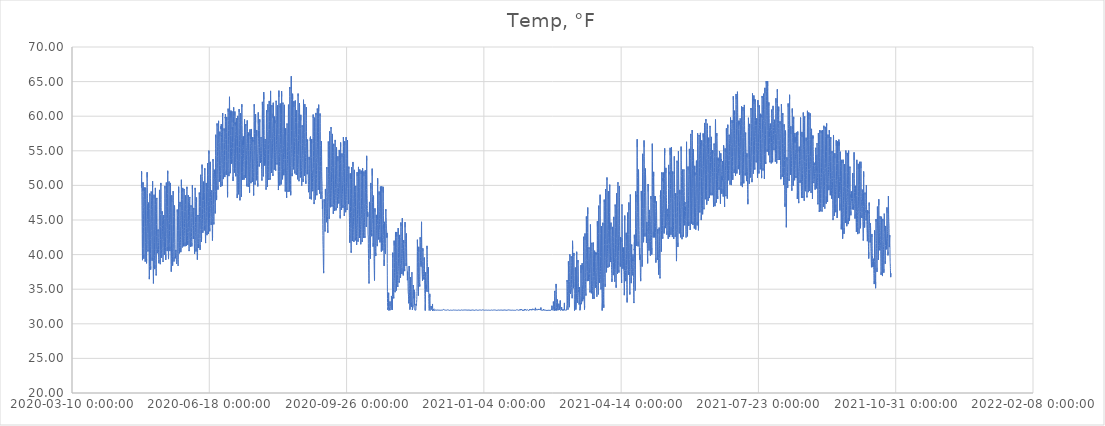
| Category | Temp, °F |
|---|---|
| 43950.59568287038 | 49.659 |
| 43950.63734953704 | 51.126 |
| 43950.67901620371 | 52.034 |
| 43950.72068287038 | 52.169 |
| 43950.76234953704 | 51.628 |
| 43950.80401620371 | 50.721 |
| 43950.84568287038 | 49.891 |
| 43950.88734953704 | 48.964 |
| 43950.92901620371 | 48.018 |
| 43950.97068287038 | 47.053 |
| 43951.01234953704 | 46.165 |
| 43951.05401620371 | 45.18 |
| 43951.09568287038 | 44.061 |
| 43951.13734953704 | 42.922 |
| 43951.17901620371 | 41.918 |
| 43951.22068287038 | 40.933 |
| 43951.26234953704 | 40.026 |
| 43951.30401620371 | 39.447 |
| 43951.34568287038 | 39.196 |
| 43951.38734953704 | 39.814 |
| 43951.42901620371 | 40.837 |
| 43951.47068287038 | 43.057 |
| 43951.51234953704 | 45.123 |
| 43951.55401620371 | 46.377 |
| 43951.59568287038 | 48.54 |
| 43951.63734953704 | 49.563 |
| 43951.67901620371 | 49.273 |
| 43951.72068287038 | 50.431 |
| 43951.76234953704 | 50.103 |
| 43951.80401620371 | 49.524 |
| 43951.84568287038 | 49.003 |
| 43951.88734953704 | 48.404 |
| 43951.92901620371 | 47.613 |
| 43951.97068287038 | 46.783 |
| 43952.01234953704 | 45.972 |
| 43952.05401620371 | 45.026 |
| 43952.09568287038 | 43.887 |
| 43952.13734953704 | 42.825 |
| 43952.17901620371 | 41.821 |
| 43952.22068287038 | 40.895 |
| 43952.26234953704 | 40.084 |
| 43952.30401620371 | 39.563 |
| 43952.34568287038 | 39.408 |
| 43952.38734953704 | 40.045 |
| 43952.42901620371 | 41.532 |
| 43952.47068287038 | 43.713 |
| 43952.51234953704 | 46.377 |
| 43952.55401620371 | 48.346 |
| 43952.59568287038 | 49.717 |
| 43952.63734953704 | 49.312 |
| 43952.67901620371 | 49.235 |
| 43952.72068287038 | 49.563 |
| 43952.76234953704 | 49.157 |
| 43952.80401620371 | 49.119 |
| 43952.84568287038 | 49.041 |
| 43952.88734953704 | 48.771 |
| 43952.92901620371 | 47.999 |
| 43952.97068287038 | 46.976 |
| 43953.01234953704 | 45.702 |
| 43953.05401620371 | 44.543 |
| 43953.09568287038 | 43.366 |
| 43953.13734953704 | 42.265 |
| 43953.17901620371 | 41.146 |
| 43953.22068287038 | 40.2 |
| 43953.26234953704 | 39.331 |
| 43953.30401620371 | 38.983 |
| 43953.34568287038 | 39.061 |
| 43953.38734953704 | 39.331 |
| 43953.42901620371 | 40.238 |
| 43953.47068287038 | 41.744 |
| 43953.51234953704 | 44.08 |
| 43953.55401620371 | 46.455 |
| 43953.59568287038 | 47.922 |
| 43953.63734953704 | 49.679 |
| 43953.67901620371 | 49.408 |
| 43953.72068287038 | 49.235 |
| 43953.76234953704 | 49.215 |
| 43953.80401620371 | 48.578 |
| 43953.84568287038 | 47.902 |
| 43953.88734953704 | 47.285 |
| 43953.92901620371 | 46.474 |
| 43953.97068287038 | 45.47 |
| 43954.01234953704 | 44.466 |
| 43954.05401620371 | 43.385 |
| 43954.09568287038 | 42.42 |
| 43954.13734953704 | 41.455 |
| 43954.17901620371 | 40.605 |
| 43954.22068287038 | 39.736 |
| 43954.26234953704 | 39.099 |
| 43954.30401620371 | 38.733 |
| 43954.34568287038 | 38.79 |
| 43954.38734953704 | 39.37 |
| 43954.42901620371 | 40.624 |
| 43954.47068287038 | 42.555 |
| 43954.51234953704 | 44.428 |
| 43954.55401620371 | 47.034 |
| 43954.59568287038 | 48.926 |
| 43954.63734953704 | 50.451 |
| 43954.67901620371 | 51.628 |
| 43954.72068287038 | 51.899 |
| 43954.76234953704 | 51.126 |
| 43954.80401620371 | 50.567 |
| 43954.84568287038 | 49.717 |
| 43954.88734953704 | 48.848 |
| 43954.92901620371 | 48.153 |
| 43954.97068287038 | 47.362 |
| 43955.01234953704 | 46.319 |
| 43955.05401620371 | 45.065 |
| 43955.09568287038 | 44.003 |
| 43955.13734953704 | 43.057 |
| 43955.17901620371 | 42.227 |
| 43955.22068287038 | 41.493 |
| 43955.26234953704 | 40.856 |
| 43955.30401620371 | 40.451 |
| 43955.34568287038 | 40.412 |
| 43955.38734953704 | 40.393 |
| 43955.42901620371 | 40.682 |
| 43955.47068287038 | 41.126 |
| 43955.51234953704 | 41.995 |
| 43955.55401620371 | 42.96 |
| 43955.59568287038 | 45.026 |
| 43955.63734953704 | 46.609 |
| 43955.67901620371 | 47.516 |
| 43955.72068287038 | 47.362 |
| 43955.76234953704 | 46.918 |
| 43955.80401620371 | 46.3 |
| 43955.84568287038 | 45.547 |
| 43955.88734953704 | 45.007 |
| 43955.92901620371 | 44.408 |
| 43955.97068287038 | 43.733 |
| 43956.01234953704 | 42.999 |
| 43956.05401620371 | 42.053 |
| 43956.09568287038 | 40.895 |
| 43956.13734953704 | 39.794 |
| 43956.17901620371 | 38.752 |
| 43956.22068287038 | 37.864 |
| 43956.26234953704 | 37.014 |
| 43956.30401620371 | 36.455 |
| 43956.34568287038 | 36.319 |
| 43956.38734953704 | 36.899 |
| 43956.42901620371 | 38.288 |
| 43956.47068287038 | 40.238 |
| 43956.51234953704 | 42.536 |
| 43956.55401620371 | 44.679 |
| 43956.59568287038 | 46.648 |
| 43956.63734953704 | 47.594 |
| 43956.67901620371 | 48.655 |
| 43956.72068287038 | 48.829 |
| 43956.76234953704 | 48.482 |
| 43956.80401620371 | 48.018 |
| 43956.84568287038 | 47.169 |
| 43956.88734953704 | 46.551 |
| 43956.92901620371 | 45.798 |
| 43956.97068287038 | 45.161 |
| 43957.01234953704 | 44.292 |
| 43957.05401620371 | 43.269 |
| 43957.09568287038 | 42.188 |
| 43957.13734953704 | 41.126 |
| 43957.17901620371 | 40.161 |
| 43957.22068287038 | 39.215 |
| 43957.26234953704 | 38.385 |
| 43957.30401620371 | 37.825 |
| 43957.34568287038 | 37.748 |
| 43957.38734953704 | 38.288 |
| 43957.42901620371 | 39.505 |
| 43957.47068287038 | 41.551 |
| 43957.51234953704 | 43.308 |
| 43957.55401620371 | 45.605 |
| 43957.59568287038 | 47.652 |
| 43957.63734953704 | 48.752 |
| 43957.67901620371 | 49.119 |
| 43957.72068287038 | 49.003 |
| 43957.76234953704 | 48.906 |
| 43957.80401620371 | 48.694 |
| 43957.84568287038 | 48.192 |
| 43957.88734953704 | 47.767 |
| 43957.92901620371 | 47.188 |
| 43957.97068287038 | 46.493 |
| 43958.01234953704 | 45.547 |
| 43958.05401620371 | 44.524 |
| 43958.09568287038 | 43.482 |
| 43958.13734953704 | 42.478 |
| 43958.17901620371 | 41.474 |
| 43958.22068287038 | 40.702 |
| 43958.26234953704 | 39.987 |
| 43958.30401620371 | 39.292 |
| 43958.34568287038 | 39.119 |
| 43958.38734953704 | 39.601 |
| 43958.42901620371 | 40.721 |
| 43958.47068287038 | 42.574 |
| 43958.51234953704 | 44.814 |
| 43958.55401620371 | 46.957 |
| 43958.59568287038 | 48.597 |
| 43958.63734953704 | 49.621 |
| 43958.67901620371 | 50.451 |
| 43958.72068287038 | 50.605 |
| 43958.76234953704 | 49.756 |
| 43958.80401620371 | 48.733 |
| 43958.84568287038 | 48.134 |
| 43958.88734953704 | 47.439 |
| 43958.92901620371 | 46.03 |
| 43958.97068287038 | 44.022 |
| 43959.01234953704 | 41.841 |
| 43959.05401620371 | 40.161 |
| 43959.09568287038 | 38.906 |
| 43959.13734953704 | 37.98 |
| 43959.17901620371 | 37.188 |
| 43959.22068287038 | 36.648 |
| 43959.26234953704 | 36.204 |
| 43959.30401620371 | 35.837 |
| 43959.34568287038 | 36.049 |
| 43959.38734953704 | 36.783 |
| 43959.42901620371 | 38.018 |
| 43959.47068287038 | 39.621 |
| 43959.51234953704 | 41.532 |
| 43959.55401620371 | 43.578 |
| 43959.59568287038 | 45.528 |
| 43959.63734953704 | 46.59 |
| 43959.67901620371 | 47.806 |
| 43959.72068287038 | 48.462 |
| 43959.76234953704 | 48.655 |
| 43959.80401620371 | 48.096 |
| 43959.84568287038 | 47.265 |
| 43959.88734953704 | 46.319 |
| 43959.92901620371 | 45.161 |
| 43959.97068287038 | 44.003 |
| 43960.01234953704 | 42.806 |
| 43960.05401620371 | 41.706 |
| 43960.09568287038 | 40.682 |
| 43960.13734953704 | 39.872 |
| 43960.17901620371 | 39.177 |
| 43960.22068287038 | 38.655 |
| 43960.26234953704 | 38.211 |
| 43960.30401620371 | 37.902 |
| 43960.34568287038 | 37.902 |
| 43960.38734953704 | 38.482 |
| 43960.42901620371 | 39.64 |
| 43960.47068287038 | 41.126 |
| 43960.51234953704 | 42.941 |
| 43960.55401620371 | 44.833 |
| 43960.59568287038 | 46.648 |
| 43960.63734953704 | 48.173 |
| 43960.67901620371 | 49.061 |
| 43960.72068287038 | 49.64 |
| 43960.76234953704 | 49.273 |
| 43960.80401620371 | 48.231 |
| 43960.84568287038 | 47.246 |
| 43960.88734953704 | 46.262 |
| 43960.92901620371 | 44.852 |
| 43960.97068287038 | 43.462 |
| 43961.01234953704 | 41.976 |
| 43961.05401620371 | 40.47 |
| 43961.09568287038 | 39.428 |
| 43961.13734953704 | 38.597 |
| 43961.17901620371 | 38.038 |
| 43961.22068287038 | 37.516 |
| 43961.26234953704 | 37.207 |
| 43961.30401620371 | 36.995 |
| 43961.34568287038 | 37.227 |
| 43961.38734953704 | 37.999 |
| 43961.42901620371 | 39.234 |
| 43961.47068287038 | 40.779 |
| 43961.51234953704 | 42.574 |
| 43961.55401620371 | 44.35 |
| 43961.59568287038 | 45.895 |
| 43961.63734953704 | 47.014 |
| 43961.67901620371 | 47.458 |
| 43961.72068287038 | 47.69 |
| 43961.76234953704 | 48.192 |
| 43961.80401620371 | 48.018 |
| 43961.84568287038 | 47.304 |
| 43961.88734953704 | 46.532 |
| 43961.92901620371 | 45.586 |
| 43961.97068287038 | 44.679 |
| 43962.01234953704 | 43.655 |
| 43962.05401620371 | 42.671 |
| 43962.09568287038 | 41.763 |
| 43962.13734953704 | 41.146 |
| 43962.17901620371 | 40.721 |
| 43962.22068287038 | 40.431 |
| 43962.26234953704 | 40.2 |
| 43962.30401620371 | 40.142 |
| 43962.34568287038 | 40.084 |
| 43962.38734953704 | 40.373 |
| 43962.42901620371 | 40.431 |
| 43962.47068287038 | 40.837 |
| 43962.51234953704 | 40.991 |
| 43962.55401620371 | 41.068 |
| 43962.59568287038 | 41.358 |
| 43962.63734953704 | 42.999 |
| 43962.67901620371 | 43.636 |
| 43962.72068287038 | 43.404 |
| 43962.76234953704 | 43.018 |
| 43962.80401620371 | 42.497 |
| 43962.84568287038 | 42.285 |
| 43962.88734953704 | 42.053 |
| 43962.92901620371 | 41.744 |
| 43962.97068287038 | 41.281 |
| 43963.01234953704 | 40.779 |
| 43963.05401620371 | 40.316 |
| 43963.09568287038 | 39.949 |
| 43963.13734953704 | 39.543 |
| 43963.17901620371 | 39.292 |
| 43963.22068287038 | 39.003 |
| 43963.26234953704 | 38.752 |
| 43963.30401620371 | 38.655 |
| 43963.34568287038 | 38.829 |
| 43963.38734953704 | 39.215 |
| 43963.42901620371 | 40.721 |
| 43963.47068287038 | 42.497 |
| 43963.51234953704 | 44.157 |
| 43963.55401620371 | 45.702 |
| 43963.59568287038 | 46.532 |
| 43963.63734953704 | 47.999 |
| 43963.67901620371 | 48.771 |
| 43963.72068287038 | 49.35 |
| 43963.76234953704 | 49.177 |
| 43963.80401620371 | 48.636 |
| 43963.84568287038 | 47.748 |
| 43963.88734953704 | 46.763 |
| 43963.92901620371 | 45.895 |
| 43963.97068287038 | 44.929 |
| 43964.01234953704 | 43.578 |
| 43964.05401620371 | 42.381 |
| 43964.09568287038 | 41.3 |
| 43964.13734953704 | 40.431 |
| 43964.17901620371 | 39.698 |
| 43964.22068287038 | 39.215 |
| 43964.26234953704 | 38.81 |
| 43964.30401620371 | 38.617 |
| 43964.34568287038 | 38.81 |
| 43964.38734953704 | 39.447 |
| 43964.42901620371 | 40.644 |
| 43964.47068287038 | 42.207 |
| 43964.51234953704 | 44.08 |
| 43964.55401620371 | 45.798 |
| 43964.59568287038 | 47.536 |
| 43964.63734953704 | 49.041 |
| 43964.67901620371 | 50.026 |
| 43964.72068287038 | 50.354 |
| 43964.76234953704 | 50.47 |
| 43964.80401620371 | 49.949 |
| 43964.84568287038 | 49.061 |
| 43964.88734953704 | 47.98 |
| 43964.92901620371 | 46.821 |
| 43964.97068287038 | 45.431 |
| 43965.01234953704 | 43.945 |
| 43965.05401620371 | 42.651 |
| 43965.09568287038 | 41.667 |
| 43965.13734953704 | 40.76 |
| 43965.17901620371 | 40.161 |
| 43965.22068287038 | 39.794 |
| 43965.26234953704 | 39.543 |
| 43965.30401620371 | 39.466 |
| 43965.34568287038 | 39.543 |
| 43965.38734953704 | 40.045 |
| 43965.42901620371 | 41.03 |
| 43965.47068287038 | 41.937 |
| 43965.51234953704 | 42.787 |
| 43965.55401620371 | 43.868 |
| 43965.59568287038 | 44.852 |
| 43965.63734953704 | 46.262 |
| 43965.67901620371 | 45.856 |
| 43965.72068287038 | 45.74 |
| 43965.76234953704 | 45.933 |
| 43965.80401620371 | 45.721 |
| 43965.84568287038 | 44.872 |
| 43965.88734953704 | 44.177 |
| 43965.92901620371 | 43.733 |
| 43965.97068287038 | 43.385 |
| 43966.01234953704 | 42.96 |
| 43966.05401620371 | 42.188 |
| 43966.09568287038 | 41.532 |
| 43966.13734953704 | 40.875 |
| 43966.17901620371 | 40.277 |
| 43966.22068287038 | 39.717 |
| 43966.26234953704 | 39.234 |
| 43966.30401620371 | 38.945 |
| 43966.34568287038 | 39.119 |
| 43966.38734953704 | 39.601 |
| 43966.42901620371 | 40.238 |
| 43966.47068287038 | 40.991 |
| 43966.51234953704 | 41.918 |
| 43966.55401620371 | 43.559 |
| 43966.59568287038 | 44.37 |
| 43966.63734953704 | 45.045 |
| 43966.67901620371 | 45.258 |
| 43966.72068287038 | 45.547 |
| 43966.76234953704 | 45.702 |
| 43966.80401620371 | 45.547 |
| 43966.84568287038 | 45.296 |
| 43966.88734953704 | 44.794 |
| 43966.92901620371 | 44.061 |
| 43966.97068287038 | 43.289 |
| 43967.01234953704 | 42.497 |
| 43967.05401620371 | 41.879 |
| 43967.09568287038 | 41.281 |
| 43967.13734953704 | 40.837 |
| 43967.17901620371 | 40.431 |
| 43967.22068287038 | 40.2 |
| 43967.26234953704 | 39.949 |
| 43967.30401620371 | 39.968 |
| 43967.34568287038 | 40.084 |
| 43967.38734953704 | 40.586 |
| 43967.42901620371 | 41.956 |
| 43967.47068287038 | 43.424 |
| 43967.51234953704 | 45.18 |
| 43967.55401620371 | 46.165 |
| 43967.59568287038 | 48.153 |
| 43967.63734953704 | 49.601 |
| 43967.67901620371 | 49.93 |
| 43967.72068287038 | 49.891 |
| 43967.76234953704 | 49.524 |
| 43967.80401620371 | 49.273 |
| 43967.84568287038 | 48.462 |
| 43967.88734953704 | 47.536 |
| 43967.92901620371 | 46.474 |
| 43967.97068287038 | 45.277 |
| 43968.01234953704 | 44.003 |
| 43968.05401620371 | 42.651 |
| 43968.09568287038 | 41.686 |
| 43968.13734953704 | 40.991 |
| 43968.17901620371 | 40.431 |
| 43968.22068287038 | 39.949 |
| 43968.26234953704 | 39.485 |
| 43968.30401620371 | 39.234 |
| 43968.34568287038 | 39.35 |
| 43968.38734953704 | 40.065 |
| 43968.42901620371 | 41.339 |
| 43968.47068287038 | 42.883 |
| 43968.51234953704 | 44.582 |
| 43968.55401620371 | 46.667 |
| 43968.59568287038 | 48.462 |
| 43968.63734953704 | 48.945 |
| 43968.67901620371 | 50.18 |
| 43968.72068287038 | 50.412 |
| 43968.76234953704 | 50.412 |
| 43968.80401620371 | 50.374 |
| 43968.84568287038 | 49.35 |
| 43968.88734953704 | 48.096 |
| 43968.92901620371 | 46.899 |
| 43968.97068287038 | 45.76 |
| 43969.01234953704 | 44.833 |
| 43969.05401620371 | 43.906 |
| 43969.09568287038 | 43.038 |
| 43969.13734953704 | 42.304 |
| 43969.17901620371 | 41.648 |
| 43969.22068287038 | 41.184 |
| 43969.26234953704 | 40.74 |
| 43969.30401620371 | 40.509 |
| 43969.34568287038 | 40.605 |
| 43969.38734953704 | 41.126 |
| 43969.42901620371 | 42.188 |
| 43969.47068287038 | 43.617 |
| 43969.51234953704 | 45.258 |
| 43969.55401620371 | 46.976 |
| 43969.59568287038 | 48.81 |
| 43969.63734953704 | 50.335 |
| 43969.67901620371 | 51.493 |
| 43969.72068287038 | 52.111 |
| 43969.76234953704 | 52.111 |
| 43969.80401620371 | 51.706 |
| 43969.84568287038 | 50.76 |
| 43969.88734953704 | 49.64 |
| 43969.92901620371 | 48.211 |
| 43969.97068287038 | 46.609 |
| 43970.01234953704 | 44.91 |
| 43970.05401620371 | 43.366 |
| 43970.09568287038 | 42.265 |
| 43970.13734953704 | 41.3 |
| 43970.17901620371 | 40.605 |
| 43970.22068287038 | 40.103 |
| 43970.26234953704 | 39.621 |
| 43970.30401620371 | 39.35 |
| 43970.34568287038 | 39.466 |
| 43970.38734953704 | 40.219 |
| 43970.42901620371 | 41.455 |
| 43970.47068287038 | 43.018 |
| 43970.51234953704 | 44.949 |
| 43970.55401620371 | 46.068 |
| 43970.59568287038 | 46.86 |
| 43970.63734953704 | 48.675 |
| 43970.67901620371 | 50.374 |
| 43970.72068287038 | 50.567 |
| 43970.76234953704 | 49.872 |
| 43970.80401620371 | 49.177 |
| 43970.84568287038 | 48.482 |
| 43970.88734953704 | 47.15 |
| 43970.92901620371 | 45.76 |
| 43970.97068287038 | 44.485 |
| 43971.01234953704 | 43.501 |
| 43971.05401620371 | 42.671 |
| 43971.09568287038 | 42.111 |
| 43971.13734953704 | 41.59 |
| 43971.17901620371 | 41.242 |
| 43971.22068287038 | 40.953 |
| 43971.26234953704 | 40.702 |
| 43971.30401620371 | 40.509 |
| 43971.34568287038 | 40.605 |
| 43971.38734953704 | 41.165 |
| 43971.42901620371 | 42.072 |
| 43971.47068287038 | 43.443 |
| 43971.51234953704 | 45.065 |
| 43971.55401620371 | 46.802 |
| 43971.59568287038 | 48.192 |
| 43971.63734953704 | 49.157 |
| 43971.67901620371 | 50.123 |
| 43971.72068287038 | 50.354 |
| 43971.76234953704 | 49.543 |
| 43971.80401620371 | 48.501 |
| 43971.84568287038 | 47.458 |
| 43971.88734953704 | 46.126 |
| 43971.92901620371 | 44.621 |
| 43971.97068287038 | 43.231 |
| 43972.01234953704 | 41.841 |
| 43972.05401620371 | 40.682 |
| 43972.09568287038 | 39.794 |
| 43972.13734953704 | 39.061 |
| 43972.17901620371 | 38.559 |
| 43972.22068287038 | 38.076 |
| 43972.26234953704 | 37.748 |
| 43972.30401620371 | 37.536 |
| 43972.34568287038 | 37.651 |
| 43972.38734953704 | 38.327 |
| 43972.42901620371 | 39.389 |
| 43972.47068287038 | 40.817 |
| 43972.51234953704 | 42.555 |
| 43972.55401620371 | 44.389 |
| 43972.59568287038 | 46.146 |
| 43972.63734953704 | 47.632 |
| 43972.67901620371 | 48.327 |
| 43972.72068287038 | 48.578 |
| 43972.76234953704 | 48.482 |
| 43972.80401620371 | 47.594 |
| 43972.84568287038 | 46.725 |
| 43972.88734953704 | 45.567 |
| 43972.92901620371 | 44.35 |
| 43972.97068287038 | 43.134 |
| 43973.01234953704 | 41.956 |
| 43973.05401620371 | 40.972 |
| 43973.09568287038 | 40.277 |
| 43973.13734953704 | 39.717 |
| 43973.17901620371 | 39.234 |
| 43973.22068287038 | 38.79 |
| 43973.26234953704 | 38.559 |
| 43973.30401620371 | 38.404 |
| 43973.34568287038 | 38.52 |
| 43973.38734953704 | 39.138 |
| 43973.42901620371 | 40.2 |
| 43973.47068287038 | 41.59 |
| 43973.51234953704 | 43.308 |
| 43973.55401620371 | 45.18 |
| 43973.59568287038 | 46.86 |
| 43973.63734953704 | 48.25 |
| 43973.67901620371 | 49.177 |
| 43973.72068287038 | 49.119 |
| 43973.76234953704 | 48.636 |
| 43973.80401620371 | 47.806 |
| 43973.84568287038 | 46.725 |
| 43973.88734953704 | 45.489 |
| 43973.92901620371 | 44.428 |
| 43973.97068287038 | 43.289 |
| 43974.01234953704 | 42.4 |
| 43974.05401620371 | 41.609 |
| 43974.09568287038 | 40.933 |
| 43974.13734953704 | 40.431 |
| 43974.17901620371 | 39.949 |
| 43974.22068287038 | 39.582 |
| 43974.26234953704 | 39.254 |
| 43974.30401620371 | 39.003 |
| 43974.34568287038 | 39.138 |
| 43974.38734953704 | 39.698 |
| 43974.42901620371 | 40.779 |
| 43974.47068287038 | 41.725 |
| 43974.51234953704 | 42.671 |
| 43974.55401620371 | 44.408 |
| 43974.59568287038 | 45.972 |
| 43974.63734953704 | 46.937 |
| 43974.67901620371 | 47.092 |
| 43974.72068287038 | 46.821 |
| 43974.76234953704 | 46.763 |
| 43974.80401620371 | 46.648 |
| 43974.84568287038 | 46.281 |
| 43974.88734953704 | 45.373 |
| 43974.92901620371 | 44.408 |
| 43974.97068287038 | 43.269 |
| 43975.01234953704 | 42.323 |
| 43975.05401620371 | 41.474 |
| 43975.09568287038 | 40.856 |
| 43975.13734953704 | 40.316 |
| 43975.17901620371 | 39.949 |
| 43975.22068287038 | 39.698 |
| 43975.26234953704 | 39.582 |
| 43975.30401620371 | 39.466 |
| 43975.34568287038 | 39.485 |
| 43975.38734953704 | 39.563 |
| 43975.42901620371 | 39.794 |
| 43975.47068287038 | 39.949 |
| 43975.51234953704 | 40.045 |
| 43975.55401620371 | 40.296 |
| 43975.59568287038 | 40.431 |
| 43975.63734953704 | 40.663 |
| 43975.67901620371 | 40.605 |
| 43975.72068287038 | 40.509 |
| 43975.76234953704 | 40.373 |
| 43975.80401620371 | 40.2 |
| 43975.84568287038 | 40.065 |
| 43975.88734953704 | 39.872 |
| 43975.92901620371 | 39.582 |
| 43975.97068287038 | 39.35 |
| 43976.01234953704 | 39.215 |
| 43976.05401620371 | 39.022 |
| 43976.09568287038 | 38.829 |
| 43976.13734953704 | 38.713 |
| 43976.17901620371 | 38.675 |
| 43976.22068287038 | 38.694 |
| 43976.26234953704 | 38.733 |
| 43976.30401620371 | 38.848 |
| 43976.34568287038 | 38.983 |
| 43976.38734953704 | 39.35 |
| 43976.42901620371 | 40.238 |
| 43976.47068287038 | 41.532 |
| 43976.51234953704 | 43.25 |
| 43976.55401620371 | 44.215 |
| 43976.59568287038 | 45.914 |
| 43976.63734953704 | 46.262 |
| 43976.67901620371 | 46.513 |
| 43976.72068287038 | 46.165 |
| 43976.76234953704 | 45.837 |
| 43976.80401620371 | 45.624 |
| 43976.84568287038 | 44.698 |
| 43976.88734953704 | 43.443 |
| 43976.92901620371 | 42.536 |
| 43976.97068287038 | 41.706 |
| 43977.01234953704 | 40.837 |
| 43977.05401620371 | 40.161 |
| 43977.09568287038 | 39.621 |
| 43977.13734953704 | 39.234 |
| 43977.17901620371 | 38.887 |
| 43977.22068287038 | 38.636 |
| 43977.26234953704 | 38.385 |
| 43977.30401620371 | 38.269 |
| 43977.34568287038 | 38.559 |
| 43977.38734953704 | 39.312 |
| 43977.42901620371 | 40.489 |
| 43977.47068287038 | 41.802 |
| 43977.51234953704 | 43.424 |
| 43977.55401620371 | 45.547 |
| 43977.59568287038 | 47.362 |
| 43977.63734953704 | 48.984 |
| 43977.67901620371 | 49.814 |
| 43977.72068287038 | 49.679 |
| 43977.76234953704 | 48.906 |
| 43977.80401620371 | 48.134 |
| 43977.84568287038 | 47.227 |
| 43977.88734953704 | 45.779 |
| 43977.92901620371 | 44.621 |
| 43977.97068287038 | 43.675 |
| 43978.01234953704 | 43.076 |
| 43978.05401620371 | 42.439 |
| 43978.09568287038 | 41.802 |
| 43978.13734953704 | 41.358 |
| 43978.17901620371 | 41.03 |
| 43978.22068287038 | 40.682 |
| 43978.26234953704 | 40.354 |
| 43978.30401620371 | 40.18 |
| 43978.34568287038 | 40.335 |
| 43978.38734953704 | 40.991 |
| 43978.42901620371 | 42.014 |
| 43978.47068287038 | 43.424 |
| 43978.51234953704 | 44.389 |
| 43978.55401620371 | 45.2 |
| 43978.59568287038 | 46.011 |
| 43978.63734953704 | 47.227 |
| 43978.67901620371 | 47.613 |
| 43978.72068287038 | 46.899 |
| 43978.76234953704 | 46.435 |
| 43978.80401620371 | 46.165 |
| 43978.84568287038 | 45.682 |
| 43978.88734953704 | 44.91 |
| 43978.92901620371 | 44.041 |
| 43978.97068287038 | 43.269 |
| 43979.01234953704 | 42.632 |
| 43979.05401620371 | 42.169 |
| 43979.09568287038 | 41.706 |
| 43979.13734953704 | 41.3 |
| 43979.17901620371 | 40.972 |
| 43979.22068287038 | 40.644 |
| 43979.26234953704 | 40.354 |
| 43979.30401620371 | 40.219 |
| 43979.34568287038 | 40.393 |
| 43979.38734953704 | 41.03 |
| 43979.42901620371 | 42.034 |
| 43979.47068287038 | 43.482 |
| 43979.51234953704 | 45.065 |
| 43979.55401620371 | 46.995 |
| 43979.59568287038 | 48.443 |
| 43979.63734953704 | 50.007 |
| 43979.67901620371 | 50.818 |
| 43979.72068287038 | 49.872 |
| 43979.76234953704 | 49.447 |
| 43979.80401620371 | 48.81 |
| 43979.84568287038 | 47.941 |
| 43979.88734953704 | 47.246 |
| 43979.92901620371 | 46.397 |
| 43979.97068287038 | 45.373 |
| 43980.01234953704 | 44.485 |
| 43980.05401620371 | 43.733 |
| 43980.09568287038 | 43.018 |
| 43980.13734953704 | 42.458 |
| 43980.17901620371 | 41.956 |
| 43980.22068287038 | 41.512 |
| 43980.26234953704 | 41.204 |
| 43980.30401620371 | 41.03 |
| 43980.34568287038 | 41.184 |
| 43980.38734953704 | 41.686 |
| 43980.42901620371 | 42.536 |
| 43980.47068287038 | 43.597 |
| 43980.51234953704 | 44.872 |
| 43980.55401620371 | 46.377 |
| 43980.59568287038 | 47.96 |
| 43980.63734953704 | 48.926 |
| 43980.67901620371 | 49.64 |
| 43980.72068287038 | 49.64 |
| 43980.76234953704 | 49.099 |
| 43980.80401620371 | 48.636 |
| 43980.84568287038 | 47.845 |
| 43980.88734953704 | 46.706 |
| 43980.92901620371 | 45.837 |
| 43980.97068287038 | 44.968 |
| 43981.01234953704 | 44.08 |
| 43981.05401620371 | 43.289 |
| 43981.09568287038 | 42.748 |
| 43981.13734953704 | 42.265 |
| 43981.17901620371 | 41.802 |
| 43981.22068287038 | 41.512 |
| 43981.26234953704 | 41.204 |
| 43981.30401620371 | 41.068 |
| 43981.34568287038 | 41.146 |
| 43981.38734953704 | 41.686 |
| 43981.42901620371 | 42.574 |
| 43981.47068287038 | 43.926 |
| 43981.51234953704 | 45.586 |
| 43981.55401620371 | 47.053 |
| 43981.59568287038 | 48.81 |
| 43981.63734953704 | 49.485 |
| 43981.67901620371 | 49.601 |
| 43981.72068287038 | 49.292 |
| 43981.76234953704 | 48.752 |
| 43981.80401620371 | 47.594 |
| 43981.84568287038 | 46.262 |
| 43981.88734953704 | 45.258 |
| 43981.92901620371 | 44.466 |
| 43981.97068287038 | 43.906 |
| 43982.01234953704 | 43.462 |
| 43982.05401620371 | 43.018 |
| 43982.09568287038 | 42.632 |
| 43982.13734953704 | 42.285 |
| 43982.17901620371 | 41.956 |
| 43982.22068287038 | 41.628 |
| 43982.26234953704 | 41.377 |
| 43982.30401620371 | 41.204 |
| 43982.34568287038 | 41.319 |
| 43982.38734953704 | 41.783 |
| 43982.42901620371 | 42.709 |
| 43982.47068287038 | 43.694 |
| 43982.51234953704 | 44.794 |
| 43982.55401620371 | 46.223 |
| 43982.59568287038 | 47.227 |
| 43982.63734953704 | 47.343 |
| 43982.67901620371 | 48.173 |
| 43982.72068287038 | 48.559 |
| 43982.76234953704 | 48.54 |
| 43982.80401620371 | 48.076 |
| 43982.84568287038 | 47.207 |
| 43982.88734953704 | 46.648 |
| 43982.92901620371 | 46.068 |
| 43982.97068287038 | 45.316 |
| 43983.01234953704 | 44.563 |
| 43983.05401620371 | 43.733 |
| 43983.09568287038 | 42.98 |
| 43983.13734953704 | 42.478 |
| 43983.17901620371 | 41.995 |
| 43983.22068287038 | 41.57 |
| 43983.26234953704 | 41.281 |
| 43983.30401620371 | 41.146 |
| 43983.34568287038 | 41.223 |
| 43983.38734953704 | 41.648 |
| 43983.42901620371 | 42.555 |
| 43983.47068287038 | 43.733 |
| 43983.51234953704 | 45.277 |
| 43983.55401620371 | 46.551 |
| 43983.59568287038 | 48.443 |
| 43983.63734953704 | 49.119 |
| 43983.67901620371 | 49.466 |
| 43983.72068287038 | 49.794 |
| 43983.76234953704 | 49.485 |
| 43983.80401620371 | 48.81 |
| 43983.84568287038 | 47.767 |
| 43983.88734953704 | 46.648 |
| 43983.92901620371 | 45.567 |
| 43983.97068287038 | 44.621 |
| 43984.01234953704 | 43.848 |
| 43984.05401620371 | 43.231 |
| 43984.09568287038 | 42.787 |
| 43984.13734953704 | 42.381 |
| 43984.17901620371 | 42.014 |
| 43984.22068287038 | 41.686 |
| 43984.26234953704 | 41.416 |
| 43984.30401620371 | 41.339 |
| 43984.34568287038 | 41.416 |
| 43984.38734953704 | 41.937 |
| 43984.42901620371 | 42.632 |
| 43984.47068287038 | 43.25 |
| 43984.51234953704 | 44.408 |
| 43984.55401620371 | 46.03 |
| 43984.59568287038 | 47.265 |
| 43984.63734953704 | 48.096 |
| 43984.67901620371 | 48.578 |
| 43984.72068287038 | 48.675 |
| 43984.76234953704 | 48.289 |
| 43984.80401620371 | 47.671 |
| 43984.84568287038 | 46.725 |
| 43984.88734953704 | 45.644 |
| 43984.92901620371 | 44.736 |
| 43984.97068287038 | 43.906 |
| 43985.01234953704 | 43.211 |
| 43985.05401620371 | 42.536 |
| 43985.09568287038 | 41.976 |
| 43985.13734953704 | 41.532 |
| 43985.17901620371 | 41.165 |
| 43985.22068287038 | 40.914 |
| 43985.26234953704 | 40.663 |
| 43985.30401620371 | 40.509 |
| 43985.34568287038 | 40.682 |
| 43985.38734953704 | 41.223 |
| 43985.42901620371 | 42.15 |
| 43985.47068287038 | 43.346 |
| 43985.51234953704 | 44.968 |
| 43985.55401620371 | 46.184 |
| 43985.59568287038 | 46.899 |
| 43985.63734953704 | 47.478 |
| 43985.67901620371 | 47.845 |
| 43985.72068287038 | 48.134 |
| 43985.76234953704 | 48.327 |
| 43985.80401620371 | 48.134 |
| 43985.84568287038 | 47.555 |
| 43985.88734953704 | 46.493 |
| 43985.92901620371 | 45.412 |
| 43985.97068287038 | 44.505 |
| 43986.01234953704 | 43.713 |
| 43986.05401620371 | 43.076 |
| 43986.09568287038 | 42.536 |
| 43986.13734953704 | 42.092 |
| 43986.17901620371 | 41.686 |
| 43986.22068287038 | 41.397 |
| 43986.26234953704 | 41.126 |
| 43986.30401620371 | 41.03 |
| 43986.34568287038 | 41.184 |
| 43986.38734953704 | 41.763 |
| 43986.42901620371 | 42.497 |
| 43986.47068287038 | 43.385 |
| 43986.51234953704 | 44.254 |
| 43986.55401620371 | 45.258 |
| 43986.59568287038 | 45.875 |
| 43986.63734953704 | 46.262 |
| 43986.67901620371 | 47.13 |
| 43986.72068287038 | 46.86 |
| 43986.76234953704 | 46.416 |
| 43986.80401620371 | 46.204 |
| 43986.84568287038 | 45.914 |
| 43986.88734953704 | 45.373 |
| 43986.92901620371 | 44.601 |
| 43986.97068287038 | 43.887 |
| 43987.01234953704 | 43.173 |
| 43987.05401620371 | 42.632 |
| 43987.09568287038 | 42.246 |
| 43987.13734953704 | 41.899 |
| 43987.17901620371 | 41.628 |
| 43987.22068287038 | 41.397 |
| 43987.26234953704 | 41.184 |
| 43987.30401620371 | 41.068 |
| 43987.34568287038 | 41.165 |
| 43987.38734953704 | 41.667 |
| 43987.42901620371 | 42.497 |
| 43987.47068287038 | 43.771 |
| 43987.51234953704 | 45.219 |
| 43987.55401620371 | 46.532 |
| 43987.59568287038 | 48.211 |
| 43987.63734953704 | 49.408 |
| 43987.67901620371 | 50.026 |
| 43987.72068287038 | 49.466 |
| 43987.76234953704 | 49.003 |
| 43987.80401620371 | 48.655 |
| 43987.84568287038 | 47.864 |
| 43987.88734953704 | 47.13 |
| 43987.92901620371 | 46.184 |
| 43987.97068287038 | 45.393 |
| 43988.01234953704 | 44.679 |
| 43988.05401620371 | 44.196 |
| 43988.09568287038 | 43.713 |
| 43988.13734953704 | 43.308 |
| 43988.17901620371 | 43.057 |
| 43988.22068287038 | 42.709 |
| 43988.26234953704 | 42.458 |
| 43988.30401620371 | 42.343 |
| 43988.34568287038 | 42.265 |
| 43988.38734953704 | 42.285 |
| 43988.42901620371 | 42.709 |
| 43988.47068287038 | 43.52 |
| 43988.51234953704 | 44.215 |
| 43988.55401620371 | 45.142 |
| 43988.59568287038 | 46.165 |
| 43988.63734953704 | 46.416 |
| 43988.67901620371 | 46.455 |
| 43988.72068287038 | 46.744 |
| 43988.76234953704 | 46.841 |
| 43988.80401620371 | 46.493 |
| 43988.84568287038 | 45.663 |
| 43988.88734953704 | 44.968 |
| 43988.92901620371 | 44.35 |
| 43988.97068287038 | 43.617 |
| 43989.01234953704 | 42.864 |
| 43989.05401620371 | 42.207 |
| 43989.09568287038 | 41.648 |
| 43989.13734953704 | 41.242 |
| 43989.17901620371 | 40.875 |
| 43989.22068287038 | 40.605 |
| 43989.26234953704 | 40.335 |
| 43989.30401620371 | 40.103 |
| 43989.34568287038 | 40.2 |
| 43989.38734953704 | 40.702 |
| 43989.42901620371 | 41.551 |
| 43989.47068287038 | 42.787 |
| 43989.51234953704 | 44.331 |
| 43989.55401620371 | 45.837 |
| 43989.59568287038 | 47.304 |
| 43989.63734953704 | 48.559 |
| 43989.67901620371 | 49.64 |
| 43989.72068287038 | 49.37 |
| 43989.76234953704 | 49.177 |
| 43989.80401620371 | 48.462 |
| 43989.84568287038 | 47.69 |
| 43989.88734953704 | 46.802 |
| 43989.92901620371 | 45.528 |
| 43989.97068287038 | 44.64 |
| 43990.01234953704 | 43.887 |
| 43990.05401620371 | 43.192 |
| 43990.09568287038 | 42.574 |
| 43990.13734953704 | 42.053 |
| 43990.17901620371 | 41.551 |
| 43990.22068287038 | 41.107 |
| 43990.26234953704 | 40.74 |
| 43990.30401620371 | 40.451 |
| 43990.34568287038 | 40.47 |
| 43990.38734953704 | 40.914 |
| 43990.42901620371 | 41.783 |
| 43990.47068287038 | 42.941 |
| 43990.51234953704 | 44.35 |
| 43990.55401620371 | 45.972 |
| 43990.59568287038 | 47.304 |
| 43990.63734953704 | 47.671 |
| 43990.67901620371 | 47.98 |
| 43990.72068287038 | 48.25 |
| 43990.76234953704 | 47.574 |
| 43990.80401620371 | 46.609 |
| 43990.84568287038 | 45.586 |
| 43990.88734953704 | 44.659 |
| 43990.92901620371 | 43.713 |
| 43990.97068287038 | 42.825 |
| 43991.01234953704 | 41.879 |
| 43991.05401620371 | 41.126 |
| 43991.09568287038 | 40.412 |
| 43991.13734953704 | 40.084 |
| 43991.17901620371 | 39.756 |
| 43991.22068287038 | 39.601 |
| 43991.26234953704 | 39.428 |
| 43991.30401620371 | 39.273 |
| 43991.34568287038 | 39.254 |
| 43991.38734953704 | 39.408 |
| 43991.42901620371 | 39.814 |
| 43991.47068287038 | 40.277 |
| 43991.51234953704 | 40.856 |
| 43991.55401620371 | 41.628 |
| 43991.59568287038 | 42.671 |
| 43991.63734953704 | 43.095 |
| 43991.67901620371 | 43.733 |
| 43991.72068287038 | 44.717 |
| 43991.76234953704 | 45.721 |
| 43991.80401620371 | 45.489 |
| 43991.84568287038 | 44.601 |
| 43991.88734953704 | 44.003 |
| 43991.92901620371 | 43.038 |
| 43991.97068287038 | 42.343 |
| 43992.01234953704 | 41.918 |
| 43992.05401620371 | 41.57 |
| 43992.09568287038 | 41.358 |
| 43992.13734953704 | 41.204 |
| 43992.17901620371 | 41.184 |
| 43992.22068287038 | 41.107 |
| 43992.26234953704 | 40.953 |
| 43992.30401620371 | 40.856 |
| 43992.34568287038 | 40.991 |
| 43992.38734953704 | 41.59 |
| 43992.42901620371 | 42.304 |
| 43992.47068287038 | 43.559 |
| 43992.51234953704 | 44.679 |
| 43992.55401620371 | 46.011 |
| 43992.59568287038 | 46.802 |
| 43992.63734953704 | 47.497 |
| 43992.67901620371 | 48.482 |
| 43992.72068287038 | 48.964 |
| 43992.76234953704 | 48.675 |
| 43992.80401620371 | 47.941 |
| 43992.84568287038 | 46.937 |
| 43992.88734953704 | 46.088 |
| 43992.92901620371 | 45.47 |
| 43992.97068287038 | 44.698 |
| 43993.01234953704 | 43.694 |
| 43993.05401620371 | 42.941 |
| 43993.09568287038 | 42.285 |
| 43993.13734953704 | 41.802 |
| 43993.17901620371 | 41.397 |
| 43993.22068287038 | 41.126 |
| 43993.26234953704 | 40.856 |
| 43993.30401620371 | 40.682 |
| 43993.34568287038 | 40.817 |
| 43993.38734953704 | 41.416 |
| 43993.42901620371 | 42.343 |
| 43993.47068287038 | 43.617 |
| 43993.51234953704 | 45.238 |
| 43993.55401620371 | 46.957 |
| 43993.59568287038 | 48.597 |
| 43993.63734953704 | 49.601 |
| 43993.67901620371 | 50.798 |
| 43993.72068287038 | 51.532 |
| 43993.76234953704 | 51.3 |
| 43993.80401620371 | 51.126 |
| 43993.84568287038 | 50.663 |
| 43993.88734953704 | 49.698 |
| 43993.92901620371 | 48.578 |
| 43993.97068287038 | 47.343 |
| 43994.01234953704 | 46.184 |
| 43994.05401620371 | 45.103 |
| 43994.09568287038 | 44.234 |
| 43994.13734953704 | 43.482 |
| 43994.17901620371 | 42.922 |
| 43994.22068287038 | 42.42 |
| 43994.26234953704 | 42.092 |
| 43994.30401620371 | 41.821 |
| 43994.34568287038 | 41.956 |
| 43994.38734953704 | 42.536 |
| 43994.42901620371 | 43.597 |
| 43994.47068287038 | 44.968 |
| 43994.51234953704 | 46.725 |
| 43994.55401620371 | 48.443 |
| 43994.59568287038 | 50.123 |
| 43994.63734953704 | 51.262 |
| 43994.67901620371 | 52.227 |
| 43994.72068287038 | 52.999 |
| 43994.76234953704 | 52.42 |
| 43994.80401620371 | 51.802 |
| 43994.84568287038 | 51.262 |
| 43994.88734953704 | 50.2 |
| 43994.92901620371 | 49.022 |
| 43994.97068287038 | 47.825 |
| 43995.01234953704 | 46.667 |
| 43995.05401620371 | 45.818 |
| 43995.09568287038 | 45.045 |
| 43995.13734953704 | 44.447 |
| 43995.17901620371 | 44.022 |
| 43995.22068287038 | 43.636 |
| 43995.26234953704 | 43.308 |
| 43995.30401620371 | 43.153 |
| 43995.34568287038 | 43.231 |
| 43995.38734953704 | 43.52 |
| 43995.42901620371 | 44.099 |
| 43995.47068287038 | 44.852 |
| 43995.51234953704 | 46.455 |
| 43995.55401620371 | 47.806 |
| 43995.59568287038 | 48.115 |
| 43995.63734953704 | 47.941 |
| 43995.67901620371 | 49.157 |
| 43995.72068287038 | 50.335 |
| 43995.76234953704 | 50.547 |
| 43995.80401620371 | 50.219 |
| 43995.84568287038 | 49.408 |
| 43995.88734953704 | 48.597 |
| 43995.92901620371 | 47.806 |
| 43995.97068287038 | 47.207 |
| 43996.01234953704 | 46.513 |
| 43996.05401620371 | 45.895 |
| 43996.09568287038 | 45.393 |
| 43996.13734953704 | 44.929 |
| 43996.17901620371 | 44.447 |
| 43996.22068287038 | 44.041 |
| 43996.26234953704 | 43.713 |
| 43996.30401620371 | 43.482 |
| 43996.34568287038 | 43.617 |
| 43996.38734953704 | 44.138 |
| 43996.42901620371 | 44.968 |
| 43996.47068287038 | 45.972 |
| 43996.51234953704 | 46.86 |
| 43996.55401620371 | 48.018 |
| 43996.59568287038 | 48.945 |
| 43996.63734953704 | 50.045 |
| 43996.67901620371 | 51.455 |
| 43996.72068287038 | 52.478 |
| 43996.76234953704 | 52.555 |
| 43996.80401620371 | 52.227 |
| 43996.84568287038 | 51.358 |
| 43996.88734953704 | 50.258 |
| 43996.92901620371 | 48.906 |
| 43996.97068287038 | 47.69 |
| 43997.01234953704 | 46.377 |
| 43997.05401620371 | 45.296 |
| 43997.09568287038 | 44.35 |
| 43997.13734953704 | 43.578 |
| 43997.17901620371 | 42.922 |
| 43997.22068287038 | 42.381 |
| 43997.26234953704 | 41.899 |
| 43997.30401620371 | 41.667 |
| 43997.34568287038 | 41.821 |
| 43997.38734953704 | 42.246 |
| 43997.42901620371 | 42.883 |
| 43997.47068287038 | 43.559 |
| 43997.51234953704 | 44.428 |
| 43997.55401620371 | 45.567 |
| 43997.59568287038 | 46.821 |
| 43997.63734953704 | 48.134 |
| 43997.67901620371 | 49.215 |
| 43997.72068287038 | 50.103 |
| 43997.76234953704 | 50.354 |
| 43997.80401620371 | 50.451 |
| 43997.84568287038 | 50.277 |
| 43997.88734953704 | 49.891 |
| 43997.92901620371 | 49.177 |
| 43997.97068287038 | 48.327 |
| 43998.01234953704 | 47.285 |
| 43998.05401620371 | 46.262 |
| 43998.09568287038 | 45.335 |
| 43998.13734953704 | 44.543 |
| 43998.17901620371 | 43.984 |
| 43998.22068287038 | 43.501 |
| 43998.26234953704 | 43.076 |
| 43998.30401620371 | 42.806 |
| 43998.34568287038 | 42.864 |
| 43998.38734953704 | 43.346 |
| 43998.42901620371 | 44.292 |
| 43998.47068287038 | 44.949 |
| 43998.51234953704 | 45.721 |
| 43998.55401620371 | 46.937 |
| 43998.59568287038 | 48.926 |
| 43998.63734953704 | 50.084 |
| 43998.67901620371 | 51.416 |
| 43998.72068287038 | 52.381 |
| 43998.76234953704 | 53.231 |
| 43998.80401620371 | 52.96 |
| 43998.84568287038 | 52.536 |
| 43998.88734953704 | 51.648 |
| 43998.92901620371 | 50.76 |
| 43998.97068287038 | 49.775 |
| 43999.01234953704 | 48.636 |
| 43999.05401620371 | 47.458 |
| 43999.09568287038 | 46.377 |
| 43999.13734953704 | 45.373 |
| 43999.17901620371 | 44.563 |
| 43999.22068287038 | 43.926 |
| 43999.26234953704 | 43.404 |
| 43999.30401620371 | 42.98 |
| 43999.34568287038 | 42.98 |
| 43999.38734953704 | 43.482 |
| 43999.42901620371 | 44.582 |
| 43999.47068287038 | 46.011 |
| 43999.51234953704 | 47.69 |
| 43999.55401620371 | 49.563 |
| 43999.59568287038 | 51.551 |
| 43999.63734953704 | 53.076 |
| 43999.67901620371 | 54.37 |
| 43999.72068287038 | 55.026 |
| 43999.76234953704 | 55.065 |
| 43999.80401620371 | 54.582 |
| 43999.84568287038 | 53.829 |
| 43999.88734953704 | 52.845 |
| 43999.92901620371 | 51.899 |
| 43999.97068287038 | 50.76 |
| 44000.01234953704 | 49.485 |
| 44000.05401620371 | 48.269 |
| 44000.09568287038 | 47.072 |
| 44000.13734953704 | 46.088 |
| 44000.17901620371 | 45.219 |
| 44000.22068287038 | 44.563 |
| 44000.26234953704 | 44.041 |
| 44000.30401620371 | 43.559 |
| 44000.34568287038 | 43.366 |
| 44000.38734953704 | 43.771 |
| 44000.42901620371 | 44.582 |
| 44000.47068287038 | 45.837 |
| 44000.51234953704 | 47.536 |
| 44000.55401620371 | 49.37 |
| 44000.59568287038 | 51.126 |
| 44000.63734953704 | 52.478 |
| 44000.67901620371 | 53.404 |
| 44000.72068287038 | 52.285 |
| 44000.76234953704 | 51.474 |
| 44000.80401620371 | 50.991 |
| 44000.84568287038 | 50.509 |
| 44000.88734953704 | 49.814 |
| 44000.92901620371 | 49.119 |
| 44000.97068287038 | 48.231 |
| 44001.01234953704 | 47.439 |
| 44001.05401620371 | 46.648 |
| 44001.09568287038 | 46.011 |
| 44001.13734953704 | 45.509 |
| 44001.17901620371 | 45.2 |
| 44001.22068287038 | 44.891 |
| 44001.26234953704 | 44.64 |
| 44001.30401620371 | 44.466 |
| 44001.34568287038 | 44.292 |
| 44001.38734953704 | 44.331 |
| 44001.42901620371 | 44.794 |
| 44001.47068287038 | 45.335 |
| 44001.51234953704 | 45.991 |
| 44001.55401620371 | 47.072 |
| 44001.59568287038 | 47.594 |
| 44001.63734953704 | 47.806 |
| 44001.67901620371 | 48.655 |
| 44001.72068287038 | 48.945 |
| 44001.76234953704 | 49.273 |
| 44001.80401620371 | 49.254 |
| 44001.84568287038 | 48.964 |
| 44001.88734953704 | 48.462 |
| 44001.92901620371 | 47.767 |
| 44001.97068287038 | 46.976 |
| 44002.01234953704 | 46.204 |
| 44002.05401620371 | 45.451 |
| 44002.09568287038 | 44.794 |
| 44002.13734953704 | 44.138 |
| 44002.17901620371 | 43.54 |
| 44002.22068287038 | 42.883 |
| 44002.26234953704 | 42.343 |
| 44002.30401620371 | 42.034 |
| 44002.34568287038 | 42.072 |
| 44002.38734953704 | 42.651 |
| 44002.42901620371 | 43.752 |
| 44002.47068287038 | 45.238 |
| 44002.51234953704 | 47.014 |
| 44002.55401620371 | 49.003 |
| 44002.59568287038 | 50.914 |
| 44002.63734953704 | 52.188 |
| 44002.67901620371 | 53.636 |
| 44002.72068287038 | 53.791 |
| 44002.76234953704 | 53.462 |
| 44002.80401620371 | 53.327 |
| 44002.84568287038 | 53.115 |
| 44002.88734953704 | 52.555 |
| 44002.92901620371 | 51.879 |
| 44002.97068287038 | 51.03 |
| 44003.01234953704 | 50.084 |
| 44003.05401620371 | 49.138 |
| 44003.09568287038 | 48.173 |
| 44003.13734953704 | 47.227 |
| 44003.17901620371 | 46.281 |
| 44003.22068287038 | 45.47 |
| 44003.26234953704 | 44.794 |
| 44003.30401620371 | 44.37 |
| 44003.34568287038 | 44.254 |
| 44003.38734953704 | 44.679 |
| 44003.42901620371 | 45.721 |
| 44003.47068287038 | 47.207 |
| 44003.51234953704 | 48.733 |
| 44003.55401620371 | 50.103 |
| 44003.59568287038 | 51.107 |
| 44003.63734953704 | 51.358 |
| 44003.67901620371 | 52.265 |
| 44003.72068287038 | 52.265 |
| 44003.76234953704 | 52.111 |
| 44003.80401620371 | 52.034 |
| 44003.84568287038 | 51.609 |
| 44003.88734953704 | 51.281 |
| 44003.92901620371 | 50.856 |
| 44003.97068287038 | 50.528 |
| 44004.01234953704 | 49.949 |
| 44004.05401620371 | 49.292 |
| 44004.09568287038 | 48.617 |
| 44004.13734953704 | 47.999 |
| 44004.17901620371 | 47.362 |
| 44004.22068287038 | 46.821 |
| 44004.26234953704 | 46.397 |
| 44004.30401620371 | 45.953 |
| 44004.34568287038 | 45.895 |
| 44004.38734953704 | 46.416 |
| 44004.42901620371 | 47.574 |
| 44004.47068287038 | 49.138 |
| 44004.51234953704 | 51.049 |
| 44004.55401620371 | 52.632 |
| 44004.59568287038 | 54.331 |
| 44004.63734953704 | 55.316 |
| 44004.67901620371 | 56.899 |
| 44004.72068287038 | 57.323 |
| 44004.76234953704 | 56.879 |
| 44004.80401620371 | 55.74 |
| 44004.84568287038 | 55.142 |
| 44004.88734953704 | 54.37 |
| 44004.92901620371 | 53.984 |
| 44004.97068287038 | 53.385 |
| 44005.01234953704 | 52.497 |
| 44005.05401620371 | 51.551 |
| 44005.09568287038 | 50.702 |
| 44005.13734953704 | 49.968 |
| 44005.17901620371 | 49.273 |
| 44005.22068287038 | 48.636 |
| 44005.26234953704 | 48.25 |
| 44005.30401620371 | 47.883 |
| 44005.34568287038 | 47.941 |
| 44005.38734953704 | 48.52 |
| 44005.42901620371 | 49.717 |
| 44005.47068287038 | 51.319 |
| 44005.51234953704 | 53.211 |
| 44005.55401620371 | 55.219 |
| 44005.59568287038 | 57.169 |
| 44005.63734953704 | 58.945 |
| 44005.67901620371 | 59.042 |
| 44005.72068287038 | 58.636 |
| 44005.76234953704 | 58.385 |
| 44005.80401620371 | 57.845 |
| 44005.84568287038 | 57.285 |
| 44005.88734953704 | 56.416 |
| 44005.92901620371 | 55.625 |
| 44005.97068287038 | 54.93 |
| 44006.01234953704 | 54.177 |
| 44006.05401620371 | 53.308 |
| 44006.09568287038 | 52.478 |
| 44006.13734953704 | 51.628 |
| 44006.17901620371 | 50.933 |
| 44006.22068287038 | 50.354 |
| 44006.26234953704 | 49.814 |
| 44006.30401620371 | 49.389 |
| 44006.34568287038 | 49.331 |
| 44006.38734953704 | 49.91 |
| 44006.42901620371 | 50.991 |
| 44006.47068287038 | 52.362 |
| 44006.51234953704 | 54.273 |
| 44006.55401620371 | 56.107 |
| 44006.59568287038 | 57.941 |
| 44006.63734953704 | 58.984 |
| 44006.67901620371 | 58.733 |
| 44006.72068287038 | 58.926 |
| 44006.76234953704 | 59.331 |
| 44006.80401620371 | 59.003 |
| 44006.84568287038 | 58.192 |
| 44006.88734953704 | 57.265 |
| 44006.92901620371 | 56.628 |
| 44006.97068287038 | 56.049 |
| 44007.01234953704 | 55.489 |
| 44007.05401620371 | 54.852 |
| 44007.09568287038 | 53.868 |
| 44007.13734953704 | 52.941 |
| 44007.17901620371 | 52.208 |
| 44007.22068287038 | 51.59 |
| 44007.26234953704 | 50.953 |
| 44007.30401620371 | 50.528 |
| 44007.34568287038 | 50.509 |
| 44007.38734953704 | 51.049 |
| 44007.42901620371 | 52.034 |
| 44007.47068287038 | 52.864 |
| 44007.51234953704 | 53.964 |
| 44007.55401620371 | 55.161 |
| 44007.59568287038 | 55.258 |
| 44007.63734953704 | 56.223 |
| 44007.67901620371 | 57.42 |
| 44007.72068287038 | 57.767 |
| 44007.76234953704 | 57.092 |
| 44007.80401620371 | 56.513 |
| 44007.84568287038 | 56.242 |
| 44007.88734953704 | 55.779 |
| 44007.92901620371 | 55.065 |
| 44007.97068287038 | 54.273 |
| 44008.01234953704 | 53.636 |
| 44008.05401620371 | 52.883 |
| 44008.09568287038 | 52.208 |
| 44008.13734953704 | 51.59 |
| 44008.17901620371 | 51.069 |
| 44008.22068287038 | 50.509 |
| 44008.26234953704 | 49.987 |
| 44008.30401620371 | 49.775 |
| 44008.34568287038 | 49.949 |
| 44008.38734953704 | 50.567 |
| 44008.42901620371 | 51.628 |
| 44008.47068287038 | 53.115 |
| 44008.51234953704 | 54.91 |
| 44008.55401620371 | 56.879 |
| 44008.59568287038 | 58.559 |
| 44008.63734953704 | 58.134 |
| 44008.67901620371 | 58.462 |
| 44008.72068287038 | 58.849 |
| 44008.76234953704 | 58.269 |
| 44008.80401620371 | 57.613 |
| 44008.84568287038 | 57.69 |
| 44008.88734953704 | 57.401 |
| 44008.92901620371 | 56.879 |
| 44008.97068287038 | 55.991 |
| 44009.01234953704 | 55.007 |
| 44009.05401620371 | 54.003 |
| 44009.09568287038 | 53.134 |
| 44009.13734953704 | 52.401 |
| 44009.17901620371 | 51.706 |
| 44009.22068287038 | 50.914 |
| 44009.26234953704 | 50.296 |
| 44009.30401620371 | 49.91 |
| 44009.34568287038 | 49.949 |
| 44009.38734953704 | 50.567 |
| 44009.42901620371 | 51.609 |
| 44009.47068287038 | 53.018 |
| 44009.51234953704 | 54.64 |
| 44009.55401620371 | 56.204 |
| 44009.59568287038 | 57.729 |
| 44009.63734953704 | 59.447 |
| 44009.67901620371 | 60.142 |
| 44009.72068287038 | 60.238 |
| 44009.76234953704 | 60.451 |
| 44009.80401620371 | 60.026 |
| 44009.84568287038 | 59.37 |
| 44009.88734953704 | 58.501 |
| 44009.92901620371 | 57.304 |
| 44009.97068287038 | 56.107 |
| 44010.01234953704 | 55.026 |
| 44010.05401620371 | 54.042 |
| 44010.09568287038 | 53.076 |
| 44010.13734953704 | 52.265 |
| 44010.17901620371 | 51.628 |
| 44010.22068287038 | 51.184 |
| 44010.26234953704 | 50.914 |
| 44010.30401620371 | 50.818 |
| 44010.34568287038 | 50.972 |
| 44010.38734953704 | 51.416 |
| 44010.42901620371 | 51.802 |
| 44010.47068287038 | 52.42 |
| 44010.51234953704 | 53.385 |
| 44010.55401620371 | 55.026 |
| 44010.59568287038 | 56.204 |
| 44010.63734953704 | 56.57 |
| 44010.67901620371 | 56.783 |
| 44010.72068287038 | 57.42 |
| 44010.76234953704 | 58.231 |
| 44010.80401620371 | 58.327 |
| 44010.84568287038 | 58.154 |
| 44010.88734953704 | 57.883 |
| 44010.92901620371 | 57.459 |
| 44010.97068287038 | 57.034 |
| 44011.01234953704 | 56.184 |
| 44011.05401620371 | 55.2 |
| 44011.09568287038 | 54.312 |
| 44011.13734953704 | 53.424 |
| 44011.17901620371 | 52.652 |
| 44011.22068287038 | 52.014 |
| 44011.26234953704 | 51.493 |
| 44011.30401620371 | 51.204 |
| 44011.34568287038 | 51.165 |
| 44011.38734953704 | 51.3 |
| 44011.42901620371 | 52.053 |
| 44011.47068287038 | 53.578 |
| 44011.51234953704 | 54.987 |
| 44011.55401620371 | 56.609 |
| 44011.59568287038 | 58.424 |
| 44011.63734953704 | 59.872 |
| 44011.67901620371 | 59.717 |
| 44011.72068287038 | 59.891 |
| 44011.76234953704 | 60.316 |
| 44011.80401620371 | 60.045 |
| 44011.84568287038 | 59.254 |
| 44011.88734953704 | 58.482 |
| 44011.92901620371 | 57.574 |
| 44011.97068287038 | 56.648 |
| 44012.01234953704 | 55.876 |
| 44012.05401620371 | 55.103 |
| 44012.09568287038 | 54.331 |
| 44012.13734953704 | 53.559 |
| 44012.17901620371 | 52.922 |
| 44012.22068287038 | 52.439 |
| 44012.26234953704 | 52.014 |
| 44012.30401620371 | 51.744 |
| 44012.34568287038 | 51.513 |
| 44012.38734953704 | 51.416 |
| 44012.42901620371 | 52.304 |
| 44012.47068287038 | 53.482 |
| 44012.51234953704 | 55.026 |
| 44012.55401620371 | 56.59 |
| 44012.59568287038 | 57.613 |
| 44012.63734953704 | 59.293 |
| 44012.67901620371 | 59.35 |
| 44012.72068287038 | 59.891 |
| 44012.76234953704 | 59.833 |
| 44012.80401620371 | 59.389 |
| 44012.84568287038 | 58.617 |
| 44012.88734953704 | 57.806 |
| 44012.92901620371 | 56.86 |
| 44012.97068287038 | 55.876 |
| 44013.01234953704 | 54.679 |
| 44013.05401620371 | 53.404 |
| 44013.09568287038 | 52.15 |
| 44013.13734953704 | 51.049 |
| 44013.17901620371 | 50.065 |
| 44013.22068287038 | 49.292 |
| 44013.26234953704 | 48.713 |
| 44013.30401620371 | 48.289 |
| 44013.34568287038 | 48.404 |
| 44013.38734953704 | 49.061 |
| 44013.42901620371 | 50.277 |
| 44013.47068287038 | 51.879 |
| 44013.51234953704 | 53.791 |
| 44013.55401620371 | 55.856 |
| 44013.59568287038 | 57.69 |
| 44013.63734953704 | 59.428 |
| 44013.67901620371 | 60.509 |
| 44013.72068287038 | 61.088 |
| 44013.76234953704 | 61.107 |
| 44013.80401620371 | 60.625 |
| 44013.84568287038 | 60.045 |
| 44013.88734953704 | 59.389 |
| 44013.92901620371 | 58.771 |
| 44013.97068287038 | 57.922 |
| 44014.01234953704 | 57.034 |
| 44014.05401620371 | 55.953 |
| 44014.09568287038 | 54.756 |
| 44014.13734953704 | 53.771 |
| 44014.17901620371 | 53.076 |
| 44014.22068287038 | 52.42 |
| 44014.26234953704 | 51.802 |
| 44014.30401620371 | 51.339 |
| 44014.34568287038 | 51.358 |
| 44014.38734953704 | 51.995 |
| 44014.42901620371 | 53.115 |
| 44014.47068287038 | 54.659 |
| 44014.51234953704 | 56.455 |
| 44014.55401620371 | 57.883 |
| 44014.59568287038 | 60.142 |
| 44014.63734953704 | 61.493 |
| 44014.67901620371 | 62.516 |
| 44014.72068287038 | 62.806 |
| 44014.76234953704 | 62.13 |
| 44014.80401620371 | 61.358 |
| 44014.84568287038 | 60.47 |
| 44014.88734953704 | 59.466 |
| 44014.92901620371 | 58.462 |
| 44014.97068287038 | 57.497 |
| 44015.01234953704 | 56.686 |
| 44015.05401620371 | 55.972 |
| 44015.09568287038 | 55.142 |
| 44015.13734953704 | 54.235 |
| 44015.17901620371 | 53.462 |
| 44015.22068287038 | 52.787 |
| 44015.26234953704 | 52.13 |
| 44015.30401620371 | 51.764 |
| 44015.34568287038 | 51.821 |
| 44015.38734953704 | 52.478 |
| 44015.42901620371 | 53.694 |
| 44015.47068287038 | 55.316 |
| 44015.51234953704 | 57.227 |
| 44015.55401620371 | 59.312 |
| 44015.59568287038 | 60.625 |
| 44015.63734953704 | 59.852 |
| 44015.67901620371 | 60.007 |
| 44015.72068287038 | 60.354 |
| 44015.76234953704 | 60.818 |
| 44015.80401620371 | 60.876 |
| 44015.84568287038 | 60.161 |
| 44015.88734953704 | 58.964 |
| 44015.92901620371 | 58.038 |
| 44015.97068287038 | 57.246 |
| 44016.01234953704 | 56.706 |
| 44016.05401620371 | 56.339 |
| 44016.09568287038 | 55.953 |
| 44016.13734953704 | 55.489 |
| 44016.17901620371 | 54.872 |
| 44016.22068287038 | 54.196 |
| 44016.26234953704 | 53.52 |
| 44016.30401620371 | 53.134 |
| 44016.34568287038 | 53.211 |
| 44016.38734953704 | 53.733 |
| 44016.42901620371 | 54.91 |
| 44016.47068287038 | 56.57 |
| 44016.51234953704 | 58.231 |
| 44016.55401620371 | 60.702 |
| 44016.59568287038 | 60.798 |
| 44016.63734953704 | 59.08 |
| 44016.67901620371 | 58.443 |
| 44016.72068287038 | 58.192 |
| 44016.76234953704 | 58.366 |
| 44016.80401620371 | 58.308 |
| 44016.84568287038 | 57.903 |
| 44016.88734953704 | 57.15 |
| 44016.92901620371 | 56.242 |
| 44016.97068287038 | 55.354 |
| 44017.01234953704 | 54.524 |
| 44017.05401620371 | 53.848 |
| 44017.09568287038 | 53.211 |
| 44017.13734953704 | 52.632 |
| 44017.17901620371 | 52.072 |
| 44017.22068287038 | 51.532 |
| 44017.26234953704 | 50.991 |
| 44017.30401620371 | 50.644 |
| 44017.34568287038 | 50.644 |
| 44017.38734953704 | 51.262 |
| 44017.42901620371 | 52.458 |
| 44017.47068287038 | 54.157 |
| 44017.51234953704 | 56.223 |
| 44017.55401620371 | 58.54 |
| 44017.59568287038 | 58.926 |
| 44017.63734953704 | 59.061 |
| 44017.67901620371 | 59.988 |
| 44017.72068287038 | 60.991 |
| 44017.76234953704 | 61.281 |
| 44017.80401620371 | 60.856 |
| 44017.84568287038 | 60.084 |
| 44017.88734953704 | 59.486 |
| 44017.92901620371 | 58.81 |
| 44017.97068287038 | 57.999 |
| 44018.01234953704 | 57.15 |
| 44018.05401620371 | 56.339 |
| 44018.09568287038 | 55.489 |
| 44018.13734953704 | 54.659 |
| 44018.17901620371 | 53.791 |
| 44018.22068287038 | 52.941 |
| 44018.26234953704 | 52.265 |
| 44018.30401620371 | 51.841 |
| 44018.34568287038 | 51.802 |
| 44018.38734953704 | 52.381 |
| 44018.42901620371 | 53.096 |
| 44018.47068287038 | 54.659 |
| 44018.51234953704 | 55.296 |
| 44018.55401620371 | 56.937 |
| 44018.59568287038 | 59.293 |
| 44018.63734953704 | 60.682 |
| 44018.67901620371 | 60.065 |
| 44018.72068287038 | 59.447 |
| 44018.76234953704 | 59.312 |
| 44018.80401620371 | 59.138 |
| 44018.84568287038 | 58.849 |
| 44018.88734953704 | 59.08 |
| 44018.92901620371 | 58.598 |
| 44018.97068287038 | 57.825 |
| 44019.01234953704 | 57.401 |
| 44019.05401620371 | 56.706 |
| 44019.09568287038 | 55.682 |
| 44019.13734953704 | 54.37 |
| 44019.17901620371 | 53.289 |
| 44019.22068287038 | 52.42 |
| 44019.26234953704 | 51.783 |
| 44019.30401620371 | 51.319 |
| 44019.34568287038 | 51.319 |
| 44019.38734953704 | 51.783 |
| 44019.42901620371 | 52.883 |
| 44019.47068287038 | 54.08 |
| 44019.51234953704 | 55.47 |
| 44019.55401620371 | 57.401 |
| 44019.59568287038 | 57.767 |
| 44019.63734953704 | 59.003 |
| 44019.67901620371 | 59.235 |
| 44019.72068287038 | 59.196 |
| 44019.76234953704 | 59.717 |
| 44019.80401620371 | 59.505 |
| 44019.84568287038 | 58.713 |
| 44019.88734953704 | 57.883 |
| 44019.92901620371 | 56.783 |
| 44019.97068287038 | 55.567 |
| 44020.01234953704 | 54.582 |
| 44020.05401620371 | 53.713 |
| 44020.09568287038 | 52.709 |
| 44020.13734953704 | 51.686 |
| 44020.17901620371 | 50.721 |
| 44020.22068287038 | 49.794 |
| 44020.26234953704 | 48.964 |
| 44020.30401620371 | 48.346 |
| 44020.34568287038 | 48.173 |
| 44020.38734953704 | 48.791 |
| 44020.42901620371 | 50.045 |
| 44020.47068287038 | 51.706 |
| 44020.51234953704 | 53.636 |
| 44020.55401620371 | 55.625 |
| 44020.59568287038 | 57.246 |
| 44020.63734953704 | 57.71 |
| 44020.67901620371 | 59.428 |
| 44020.72068287038 | 60.045 |
| 44020.76234953704 | 59.93 |
| 44020.80401620371 | 59.389 |
| 44020.84568287038 | 58.559 |
| 44020.88734953704 | 58.154 |
| 44020.92901620371 | 57.536 |
| 44020.97068287038 | 56.725 |
| 44021.01234953704 | 55.876 |
| 44021.05401620371 | 55.026 |
| 44021.09568287038 | 53.945 |
| 44021.13734953704 | 52.787 |
| 44021.17901620371 | 51.57 |
| 44021.22068287038 | 50.451 |
| 44021.26234953704 | 49.428 |
| 44021.30401620371 | 48.713 |
| 44021.34568287038 | 48.733 |
| 44021.38734953704 | 49.273 |
| 44021.42901620371 | 50.412 |
| 44021.47068287038 | 52.188 |
| 44021.51234953704 | 54.235 |
| 44021.55401620371 | 55.991 |
| 44021.59568287038 | 58.366 |
| 44021.63734953704 | 59.524 |
| 44021.67901620371 | 60.547 |
| 44021.72068287038 | 61.03 |
| 44021.76234953704 | 60.586 |
| 44021.80401620371 | 59.775 |
| 44021.84568287038 | 59.08 |
| 44021.88734953704 | 58.173 |
| 44021.92901620371 | 57.323 |
| 44021.97068287038 | 56.455 |
| 44022.01234953704 | 55.489 |
| 44022.05401620371 | 54.601 |
| 44022.09568287038 | 53.482 |
| 44022.13734953704 | 52.362 |
| 44022.17901620371 | 51.242 |
| 44022.22068287038 | 50.065 |
| 44022.26234953704 | 48.945 |
| 44022.30401620371 | 48.115 |
| 44022.34568287038 | 47.845 |
| 44022.38734953704 | 48.289 |
| 44022.42901620371 | 49.428 |
| 44022.47068287038 | 51.377 |
| 44022.51234953704 | 53.713 |
| 44022.55401620371 | 55.933 |
| 44022.59568287038 | 57.883 |
| 44022.63734953704 | 59.447 |
| 44022.67901620371 | 59.949 |
| 44022.72068287038 | 60.432 |
| 44022.76234953704 | 59.852 |
| 44022.80401620371 | 59.524 |
| 44022.84568287038 | 58.655 |
| 44022.88734953704 | 57.845 |
| 44022.92901620371 | 57.015 |
| 44022.97068287038 | 56.204 |
| 44023.01234953704 | 55.354 |
| 44023.05401620371 | 54.486 |
| 44023.09568287038 | 53.559 |
| 44023.13734953704 | 52.574 |
| 44023.17901620371 | 51.493 |
| 44023.22068287038 | 50.451 |
| 44023.26234953704 | 49.428 |
| 44023.30401620371 | 48.675 |
| 44023.34568287038 | 48.346 |
| 44023.38734953704 | 48.752 |
| 44023.42901620371 | 49.949 |
| 44023.47068287038 | 51.918 |
| 44023.51234953704 | 54.331 |
| 44023.55401620371 | 56.725 |
| 44023.59568287038 | 58.81 |
| 44023.63734953704 | 60.451 |
| 44023.67901620371 | 61.493 |
| 44023.72068287038 | 61.725 |
| 44023.76234953704 | 61.3 |
| 44023.80401620371 | 60.47 |
| 44023.84568287038 | 59.331 |
| 44023.88734953704 | 58.675 |
| 44023.92901620371 | 58.154 |
| 44023.97068287038 | 57.613 |
| 44024.01234953704 | 56.976 |
| 44024.05401620371 | 56.3 |
| 44024.09568287038 | 55.489 |
| 44024.13734953704 | 54.679 |
| 44024.17901620371 | 53.791 |
| 44024.22068287038 | 52.787 |
| 44024.26234953704 | 51.821 |
| 44024.30401620371 | 51.069 |
| 44024.34568287038 | 50.798 |
| 44024.38734953704 | 51.184 |
| 44024.42901620371 | 52.227 |
| 44024.47068287038 | 54.177 |
| 44024.51234953704 | 56.107 |
| 44024.55401620371 | 56.339 |
| 44024.59568287038 | 56.377 |
| 44024.63734953704 | 55.818 |
| 44024.67901620371 | 56.474 |
| 44024.72068287038 | 56.3 |
| 44024.76234953704 | 57.072 |
| 44024.80401620371 | 56.416 |
| 44024.84568287038 | 55.721 |
| 44024.88734953704 | 55.219 |
| 44024.92901620371 | 54.621 |
| 44024.97068287038 | 54.254 |
| 44025.01234953704 | 53.848 |
| 44025.05401620371 | 53.443 |
| 44025.09568287038 | 52.999 |
| 44025.13734953704 | 52.574 |
| 44025.17901620371 | 52.014 |
| 44025.22068287038 | 51.513 |
| 44025.26234953704 | 51.069 |
| 44025.30401620371 | 50.837 |
| 44025.34568287038 | 50.837 |
| 44025.38734953704 | 51.513 |
| 44025.42901620371 | 52.478 |
| 44025.47068287038 | 53.597 |
| 44025.51234953704 | 54.389 |
| 44025.55401620371 | 56.126 |
| 44025.59568287038 | 57.671 |
| 44025.63734953704 | 58.984 |
| 44025.67901620371 | 59.563 |
| 44025.72068287038 | 59.099 |
| 44025.76234953704 | 58.404 |
| 44025.80401620371 | 57.729 |
| 44025.84568287038 | 57.362 |
| 44025.88734953704 | 56.821 |
| 44025.92901620371 | 56.3 |
| 44025.97068287038 | 55.856 |
| 44026.01234953704 | 55.47 |
| 44026.05401620371 | 55.045 |
| 44026.09568287038 | 54.621 |
| 44026.13734953704 | 54.022 |
| 44026.17901620371 | 53.366 |
| 44026.22068287038 | 52.671 |
| 44026.26234953704 | 51.957 |
| 44026.30401620371 | 51.416 |
| 44026.34568287038 | 51.107 |
| 44026.38734953704 | 51.262 |
| 44026.42901620371 | 52.362 |
| 44026.47068287038 | 53.636 |
| 44026.51234953704 | 54.37 |
| 44026.55401620371 | 56.551 |
| 44026.59568287038 | 58.868 |
| 44026.63734953704 | 59.003 |
| 44026.67901620371 | 58.598 |
| 44026.72068287038 | 57.845 |
| 44026.76234953704 | 57.401 |
| 44026.80401620371 | 56.802 |
| 44026.84568287038 | 56.358 |
| 44026.88734953704 | 56.011 |
| 44026.92901620371 | 55.74 |
| 44026.97068287038 | 55.451 |
| 44027.01234953704 | 55.026 |
| 44027.05401620371 | 54.428 |
| 44027.09568287038 | 53.694 |
| 44027.13734953704 | 52.941 |
| 44027.17901620371 | 52.227 |
| 44027.22068287038 | 51.513 |
| 44027.26234953704 | 50.702 |
| 44027.30401620371 | 50.18 |
| 44027.34568287038 | 49.872 |
| 44027.38734953704 | 50.258 |
| 44027.42901620371 | 51.223 |
| 44027.47068287038 | 52.922 |
| 44027.51234953704 | 55.123 |
| 44027.55401620371 | 57.381 |
| 44027.59568287038 | 59.235 |
| 44027.63734953704 | 59.389 |
| 44027.67901620371 | 58.771 |
| 44027.72068287038 | 58.578 |
| 44027.76234953704 | 58.173 |
| 44027.80401620371 | 57.787 |
| 44027.84568287038 | 57.478 |
| 44027.88734953704 | 56.86 |
| 44027.92901620371 | 56.069 |
| 44027.97068287038 | 55.412 |
| 44028.01234953704 | 54.833 |
| 44028.05401620371 | 54.215 |
| 44028.09568287038 | 53.597 |
| 44028.13734953704 | 52.922 |
| 44028.17901620371 | 52.111 |
| 44028.22068287038 | 51.358 |
| 44028.26234953704 | 50.605 |
| 44028.30401620371 | 49.987 |
| 44028.34568287038 | 49.794 |
| 44028.38734953704 | 50.142 |
| 44028.42901620371 | 51.223 |
| 44028.47068287038 | 52.941 |
| 44028.51234953704 | 55.026 |
| 44028.55401620371 | 57.092 |
| 44028.59568287038 | 57.092 |
| 44028.63734953704 | 57.632 |
| 44028.67901620371 | 57.111 |
| 44028.72068287038 | 56.744 |
| 44028.76234953704 | 56.474 |
| 44028.80401620371 | 56.262 |
| 44028.84568287038 | 55.76 |
| 44028.88734953704 | 55.316 |
| 44028.92901620371 | 55.045 |
| 44028.97068287038 | 54.717 |
| 44029.01234953704 | 54.138 |
| 44029.05401620371 | 53.443 |
| 44029.09568287038 | 52.729 |
| 44029.13734953704 | 51.995 |
| 44029.17901620371 | 51.184 |
| 44029.22068287038 | 50.451 |
| 44029.26234953704 | 49.698 |
| 44029.30401620371 | 49.177 |
| 44029.34568287038 | 48.945 |
| 44029.38734953704 | 49.331 |
| 44029.42901620371 | 50.431 |
| 44029.47068287038 | 52.323 |
| 44029.51234953704 | 54.35 |
| 44029.55401620371 | 56.03 |
| 44029.59568287038 | 57.903 |
| 44029.63734953704 | 58.096 |
| 44029.67901620371 | 57.439 |
| 44029.72068287038 | 57.227 |
| 44029.76234953704 | 57.246 |
| 44029.80401620371 | 57.401 |
| 44029.84568287038 | 57.323 |
| 44029.88734953704 | 56.667 |
| 44029.92901620371 | 56.011 |
| 44029.97068287038 | 55.567 |
| 44030.01234953704 | 55.026 |
| 44030.05401620371 | 54.408 |
| 44030.09568287038 | 53.81 |
| 44030.13734953704 | 53.192 |
| 44030.17901620371 | 52.497 |
| 44030.22068287038 | 51.802 |
| 44030.26234953704 | 51.049 |
| 44030.30401620371 | 50.509 |
| 44030.34568287038 | 50.316 |
| 44030.38734953704 | 50.625 |
| 44030.42901620371 | 51.628 |
| 44030.47068287038 | 53.366 |
| 44030.51234953704 | 55.721 |
| 44030.55401620371 | 56.706 |
| 44030.59568287038 | 58.154 |
| 44030.63734953704 | 57.343 |
| 44030.67901620371 | 57.632 |
| 44030.72068287038 | 57.265 |
| 44030.76234953704 | 56.995 |
| 44030.80401620371 | 56.667 |
| 44030.84568287038 | 56.3 |
| 44030.88734953704 | 55.779 |
| 44030.92901620371 | 55.296 |
| 44030.97068287038 | 54.91 |
| 44031.01234953704 | 54.408 |
| 44031.05401620371 | 54.042 |
| 44031.09568287038 | 53.501 |
| 44031.13734953704 | 52.825 |
| 44031.17901620371 | 52.092 |
| 44031.22068287038 | 51.435 |
| 44031.26234953704 | 50.837 |
| 44031.30401620371 | 50.509 |
| 44031.34568287038 | 50.374 |
| 44031.38734953704 | 50.489 |
| 44031.42901620371 | 51.242 |
| 44031.47068287038 | 52.304 |
| 44031.51234953704 | 53.829 |
| 44031.55401620371 | 54.119 |
| 44031.59568287038 | 55.065 |
| 44031.63734953704 | 55.393 |
| 44031.67901620371 | 56.976 |
| 44031.72068287038 | 56.358 |
| 44031.76234953704 | 56.551 |
| 44031.80401620371 | 56.339 |
| 44031.84568287038 | 55.586 |
| 44031.88734953704 | 55.103 |
| 44031.92901620371 | 54.486 |
| 44031.97068287038 | 53.829 |
| 44032.01234953704 | 53.173 |
| 44032.05401620371 | 52.536 |
| 44032.09568287038 | 51.821 |
| 44032.13734953704 | 51.146 |
| 44032.17901620371 | 50.509 |
| 44032.22068287038 | 49.736 |
| 44032.26234953704 | 49.08 |
| 44032.30401620371 | 48.54 |
| 44032.34568287038 | 48.404 |
| 44032.38734953704 | 48.81 |
| 44032.42901620371 | 49.93 |
| 44032.47068287038 | 51.86 |
| 44032.51234953704 | 54.37 |
| 44032.55401620371 | 57.072 |
| 44032.59568287038 | 59.235 |
| 44032.63734953704 | 60.432 |
| 44032.67901620371 | 61.474 |
| 44032.72068287038 | 61.725 |
| 44032.76234953704 | 61.377 |
| 44032.80401620371 | 60.412 |
| 44032.84568287038 | 59.37 |
| 44032.88734953704 | 58.424 |
| 44032.92901620371 | 57.516 |
| 44032.97068287038 | 56.686 |
| 44033.01234953704 | 55.818 |
| 44033.05401620371 | 55.026 |
| 44033.09568287038 | 54.235 |
| 44033.13734953704 | 53.482 |
| 44033.17901620371 | 52.709 |
| 44033.22068287038 | 51.879 |
| 44033.26234953704 | 51.088 |
| 44033.30401620371 | 50.335 |
| 44033.34568287038 | 50.103 |
| 44033.38734953704 | 50.374 |
| 44033.42901620371 | 51.397 |
| 44033.47068287038 | 53.211 |
| 44033.51234953704 | 55.798 |
| 44033.55401620371 | 58.173 |
| 44033.59568287038 | 59.486 |
| 44033.63734953704 | 59.486 |
| 44033.67901620371 | 59.814 |
| 44033.72068287038 | 60.296 |
| 44033.76234953704 | 60.2 |
| 44033.80401620371 | 59.119 |
| 44033.84568287038 | 58.018 |
| 44033.88734953704 | 57.478 |
| 44033.92901620371 | 56.628 |
| 44033.97068287038 | 55.76 |
| 44034.01234953704 | 54.968 |
| 44034.05401620371 | 54.389 |
| 44034.09568287038 | 53.829 |
| 44034.13734953704 | 53.385 |
| 44034.17901620371 | 52.845 |
| 44034.22068287038 | 52.169 |
| 44034.26234953704 | 51.435 |
| 44034.30401620371 | 50.895 |
| 44034.34568287038 | 50.74 |
| 44034.38734953704 | 51.03 |
| 44034.42901620371 | 52.053 |
| 44034.47068287038 | 52.999 |
| 44034.51234953704 | 54.833 |
| 44034.55401620371 | 56.744 |
| 44034.59568287038 | 57.999 |
| 44034.63734953704 | 57.092 |
| 44034.67901620371 | 56.513 |
| 44034.72068287038 | 56.088 |
| 44034.76234953704 | 55.876 |
| 44034.80401620371 | 55.528 |
| 44034.84568287038 | 55.219 |
| 44034.88734953704 | 54.891 |
| 44034.92901620371 | 54.621 |
| 44034.97068287038 | 54.215 |
| 44035.01234953704 | 53.945 |
| 44035.05401620371 | 53.617 |
| 44035.09568287038 | 53.211 |
| 44035.13734953704 | 52.652 |
| 44035.17901620371 | 52.111 |
| 44035.22068287038 | 51.416 |
| 44035.26234953704 | 50.682 |
| 44035.30401620371 | 50.065 |
| 44035.34568287038 | 49.852 |
| 44035.38734953704 | 50.316 |
| 44035.42901620371 | 51.397 |
| 44035.47068287038 | 53.54 |
| 44035.51234953704 | 54.563 |
| 44035.55401620371 | 55.895 |
| 44035.59568287038 | 57.903 |
| 44035.63734953704 | 60.026 |
| 44035.67901620371 | 60.547 |
| 44035.72068287038 | 58.945 |
| 44035.76234953704 | 58.926 |
| 44035.80401620371 | 58.636 |
| 44035.84568287038 | 57.922 |
| 44035.88734953704 | 57.15 |
| 44035.92901620371 | 56.764 |
| 44035.97068287038 | 56.628 |
| 44036.01234953704 | 56.32 |
| 44036.05401620371 | 55.933 |
| 44036.09568287038 | 55.489 |
| 44036.13734953704 | 55.045 |
| 44036.17901620371 | 54.505 |
| 44036.22068287038 | 53.906 |
| 44036.26234953704 | 53.347 |
| 44036.30401620371 | 53.038 |
| 44036.34568287038 | 52.729 |
| 44036.38734953704 | 52.69 |
| 44036.42901620371 | 53.076 |
| 44036.47068287038 | 53.54 |
| 44036.51234953704 | 54.312 |
| 44036.55401620371 | 55.451 |
| 44036.59568287038 | 56.416 |
| 44036.63734953704 | 57.903 |
| 44036.67901620371 | 59.022 |
| 44036.72068287038 | 59.215 |
| 44036.76234953704 | 59.543 |
| 44036.80401620371 | 59.119 |
| 44036.84568287038 | 58.25 |
| 44036.88734953704 | 57.439 |
| 44036.92901620371 | 57.034 |
| 44036.97068287038 | 56.628 |
| 44037.01234953704 | 56.184 |
| 44037.05401620371 | 55.856 |
| 44037.09568287038 | 55.644 |
| 44037.13734953704 | 55.393 |
| 44037.17901620371 | 55.026 |
| 44037.22068287038 | 54.601 |
| 44037.26234953704 | 54.08 |
| 44037.30401620371 | 53.636 |
| 44037.34568287038 | 53.269 |
| 44037.38734953704 | 53.289 |
| 44037.42901620371 | 53.597 |
| 44037.47068287038 | 53.848 |
| 44037.51234953704 | 53.984 |
| 44037.55401620371 | 54.331 |
| 44037.59568287038 | 55.026 |
| 44037.63734953704 | 55.74 |
| 44037.67901620371 | 56.821 |
| 44037.72068287038 | 56.976 |
| 44037.76234953704 | 56.764 |
| 44037.80401620371 | 56.377 |
| 44037.84568287038 | 56.049 |
| 44037.88734953704 | 55.586 |
| 44037.92901620371 | 55.065 |
| 44037.97068287038 | 54.563 |
| 44038.01234953704 | 54.061 |
| 44038.05401620371 | 53.694 |
| 44038.09568287038 | 53.308 |
| 44038.13734953704 | 52.787 |
| 44038.17901620371 | 52.285 |
| 44038.22068287038 | 51.764 |
| 44038.26234953704 | 51.3 |
| 44038.30401620371 | 50.856 |
| 44038.34568287038 | 50.702 |
| 44038.38734953704 | 50.991 |
| 44038.42901620371 | 51.976 |
| 44038.47068287038 | 53.791 |
| 44038.51234953704 | 56.126 |
| 44038.55401620371 | 59.37 |
| 44038.59568287038 | 60.567 |
| 44038.63734953704 | 60.991 |
| 44038.67901620371 | 62.072 |
| 44038.72068287038 | 61.551 |
| 44038.76234953704 | 61.011 |
| 44038.80401620371 | 59.852 |
| 44038.84568287038 | 59.157 |
| 44038.88734953704 | 58.404 |
| 44038.92901620371 | 57.883 |
| 44038.97068287038 | 57.381 |
| 44039.01234953704 | 56.725 |
| 44039.05401620371 | 56.069 |
| 44039.09568287038 | 55.451 |
| 44039.13734953704 | 54.794 |
| 44039.17901620371 | 54.022 |
| 44039.22068287038 | 53.25 |
| 44039.26234953704 | 52.343 |
| 44039.30401620371 | 51.609 |
| 44039.34568287038 | 51.3 |
| 44039.38734953704 | 51.59 |
| 44039.42901620371 | 52.536 |
| 44039.47068287038 | 54.37 |
| 44039.51234953704 | 56.976 |
| 44039.55401620371 | 59.679 |
| 44039.59568287038 | 61.802 |
| 44039.63734953704 | 63.327 |
| 44039.67901620371 | 63.482 |
| 44039.72068287038 | 63.501 |
| 44039.76234953704 | 63.443 |
| 44039.80401620371 | 62.439 |
| 44039.84568287038 | 61.3 |
| 44039.88734953704 | 60.084 |
| 44039.92901620371 | 59.003 |
| 44039.97068287038 | 58.076 |
| 44040.01234953704 | 57.188 |
| 44040.05401620371 | 56.551 |
| 44040.09568287038 | 56.011 |
| 44040.13734953704 | 55.489 |
| 44040.17901620371 | 54.833 |
| 44040.22068287038 | 54.157 |
| 44040.26234953704 | 53.501 |
| 44040.30401620371 | 53.057 |
| 44040.34568287038 | 52.864 |
| 44040.38734953704 | 52.922 |
| 44040.42901620371 | 52.941 |
| 44040.47068287038 | 53.327 |
| 44040.51234953704 | 53.52 |
| 44040.55401620371 | 53.269 |
| 44040.59568287038 | 54.138 |
| 44040.63734953704 | 56.532 |
| 44040.67901620371 | 56.648 |
| 44040.72068287038 | 56.686 |
| 44040.76234953704 | 56.764 |
| 44040.80401620371 | 56.493 |
| 44040.84568287038 | 56.011 |
| 44040.88734953704 | 55.181 |
| 44040.92901620371 | 54.563 |
| 44040.97068287038 | 53.906 |
| 44041.01234953704 | 53.443 |
| 44041.05401620371 | 52.941 |
| 44041.09568287038 | 52.671 |
| 44041.13734953704 | 52.227 |
| 44041.17901620371 | 51.59 |
| 44041.22068287038 | 50.933 |
| 44041.26234953704 | 50.277 |
| 44041.30401620371 | 49.679 |
| 44041.34568287038 | 49.389 |
| 44041.38734953704 | 49.717 |
| 44041.42901620371 | 50.702 |
| 44041.47068287038 | 52.767 |
| 44041.51234953704 | 55.026 |
| 44041.55401620371 | 57.459 |
| 44041.59568287038 | 58.984 |
| 44041.63734953704 | 59.814 |
| 44041.67901620371 | 60.856 |
| 44041.72068287038 | 60.296 |
| 44041.76234953704 | 59.988 |
| 44041.80401620371 | 59.003 |
| 44041.84568287038 | 58.096 |
| 44041.88734953704 | 57.092 |
| 44041.92901620371 | 56.416 |
| 44041.97068287038 | 55.876 |
| 44042.01234953704 | 55.142 |
| 44042.05401620371 | 54.428 |
| 44042.09568287038 | 53.771 |
| 44042.13734953704 | 53.076 |
| 44042.17901620371 | 52.362 |
| 44042.22068287038 | 51.551 |
| 44042.26234953704 | 50.76 |
| 44042.30401620371 | 50.161 |
| 44042.34568287038 | 49.775 |
| 44042.38734953704 | 50.103 |
| 44042.42901620371 | 51.069 |
| 44042.47068287038 | 52.323 |
| 44042.51234953704 | 55.123 |
| 44042.55401620371 | 57.806 |
| 44042.59568287038 | 59.042 |
| 44042.63734953704 | 60.219 |
| 44042.67901620371 | 61.435 |
| 44042.72068287038 | 61.725 |
| 44042.76234953704 | 60.547 |
| 44042.80401620371 | 60.103 |
| 44042.84568287038 | 59.293 |
| 44042.88734953704 | 58.81 |
| 44042.92901620371 | 58.057 |
| 44042.97068287038 | 57.285 |
| 44043.01234953704 | 56.551 |
| 44043.05401620371 | 55.914 |
| 44043.09568287038 | 55.181 |
| 44043.13734953704 | 54.447 |
| 44043.17901620371 | 53.617 |
| 44043.22068287038 | 52.709 |
| 44043.26234953704 | 51.879 |
| 44043.30401620371 | 51.165 |
| 44043.34568287038 | 50.779 |
| 44043.38734953704 | 51.069 |
| 44043.42901620371 | 51.918 |
| 44043.47068287038 | 53.829 |
| 44043.51234953704 | 56.493 |
| 44043.55401620371 | 59.119 |
| 44043.59568287038 | 61.493 |
| 44043.63734953704 | 62.208 |
| 44043.67901620371 | 61.783 |
| 44043.72068287038 | 61.918 |
| 44043.76234953704 | 61.416 |
| 44043.80401620371 | 60.47 |
| 44043.84568287038 | 59.215 |
| 44043.88734953704 | 58.057 |
| 44043.92901620371 | 57.42 |
| 44043.97068287038 | 56.706 |
| 44044.01234953704 | 56.011 |
| 44044.05401620371 | 55.393 |
| 44044.09568287038 | 54.833 |
| 44044.13734953704 | 54.235 |
| 44044.17901620371 | 53.54 |
| 44044.22068287038 | 52.787 |
| 44044.26234953704 | 51.937 |
| 44044.30401620371 | 51.184 |
| 44044.34568287038 | 50.837 |
| 44044.38734953704 | 51.088 |
| 44044.42901620371 | 52.014 |
| 44044.47068287038 | 53.926 |
| 44044.51234953704 | 56.744 |
| 44044.55401620371 | 59.601 |
| 44044.59568287038 | 61.879 |
| 44044.63734953704 | 63.655 |
| 44044.67901620371 | 63.289 |
| 44044.72068287038 | 62.999 |
| 44044.76234953704 | 62.864 |
| 44044.80401620371 | 61.648 |
| 44044.84568287038 | 60.489 |
| 44044.88734953704 | 59.582 |
| 44044.92901620371 | 58.617 |
| 44044.97068287038 | 57.883 |
| 44045.01234953704 | 57.111 |
| 44045.05401620371 | 56.455 |
| 44045.09568287038 | 55.702 |
| 44045.13734953704 | 55.084 |
| 44045.17901620371 | 54.428 |
| 44045.22068287038 | 53.655 |
| 44045.26234953704 | 52.767 |
| 44045.30401620371 | 52.092 |
| 44045.34568287038 | 51.802 |
| 44045.38734953704 | 52.092 |
| 44045.42901620371 | 52.864 |
| 44045.47068287038 | 54.775 |
| 44045.51234953704 | 56.513 |
| 44045.55401620371 | 59.235 |
| 44045.59568287038 | 61.59 |
| 44045.63734953704 | 61.358 |
| 44045.67901620371 | 59.524 |
| 44045.72068287038 | 59.659 |
| 44045.76234953704 | 59.64 |
| 44045.80401620371 | 59.582 |
| 44045.84568287038 | 58.598 |
| 44045.88734953704 | 57.806 |
| 44045.92901620371 | 57.285 |
| 44045.97068287038 | 56.744 |
| 44046.01234953704 | 56.107 |
| 44046.05401620371 | 55.528 |
| 44046.09568287038 | 54.968 |
| 44046.13734953704 | 54.389 |
| 44046.17901620371 | 53.733 |
| 44046.22068287038 | 52.96 |
| 44046.26234953704 | 52.323 |
| 44046.30401620371 | 51.706 |
| 44046.34568287038 | 51.377 |
| 44046.38734953704 | 51.628 |
| 44046.42901620371 | 52.497 |
| 44046.47068287038 | 54.466 |
| 44046.51234953704 | 57.227 |
| 44046.55401620371 | 60.354 |
| 44046.59568287038 | 59.775 |
| 44046.63734953704 | 61.937 |
| 44046.67901620371 | 61.899 |
| 44046.72068287038 | 60.914 |
| 44046.76234953704 | 60.702 |
| 44046.80401620371 | 60.007 |
| 44046.84568287038 | 59.003 |
| 44046.88734953704 | 58.25 |
| 44046.92901620371 | 57.516 |
| 44046.97068287038 | 56.841 |
| 44047.01234953704 | 56.165 |
| 44047.05401620371 | 55.586 |
| 44047.09568287038 | 55.065 |
| 44047.13734953704 | 54.543 |
| 44047.17901620371 | 53.964 |
| 44047.22068287038 | 53.289 |
| 44047.26234953704 | 52.652 |
| 44047.30401620371 | 52.265 |
| 44047.34568287038 | 52.227 |
| 44047.38734953704 | 52.497 |
| 44047.42901620371 | 53.096 |
| 44047.47068287038 | 54.794 |
| 44047.51234953704 | 57.053 |
| 44047.55401620371 | 57.864 |
| 44047.59568287038 | 59.949 |
| 44047.63734953704 | 59.022 |
| 44047.67901620371 | 59.408 |
| 44047.72068287038 | 59.524 |
| 44047.76234953704 | 58.906 |
| 44047.80401620371 | 58.424 |
| 44047.84568287038 | 57.69 |
| 44047.88734953704 | 56.995 |
| 44047.92901620371 | 56.358 |
| 44047.97068287038 | 55.74 |
| 44048.01234953704 | 55.2 |
| 44048.05401620371 | 54.814 |
| 44048.09568287038 | 54.35 |
| 44048.13734953704 | 54.042 |
| 44048.17901620371 | 53.791 |
| 44048.22068287038 | 53.424 |
| 44048.26234953704 | 52.883 |
| 44048.30401620371 | 52.343 |
| 44048.34568287038 | 52.13 |
| 44048.38734953704 | 52.381 |
| 44048.42901620371 | 53.076 |
| 44048.47068287038 | 54.717 |
| 44048.51234953704 | 57.362 |
| 44048.55401620371 | 59.157 |
| 44048.59568287038 | 60.316 |
| 44048.63734953704 | 61.532 |
| 44048.67901620371 | 62.227 |
| 44048.72068287038 | 62.015 |
| 44048.76234953704 | 61.184 |
| 44048.80401620371 | 60.084 |
| 44048.84568287038 | 59.138 |
| 44048.88734953704 | 58.308 |
| 44048.92901620371 | 57.285 |
| 44048.97068287038 | 56.513 |
| 44049.01234953704 | 55.933 |
| 44049.05401620371 | 55.509 |
| 44049.09568287038 | 55.258 |
| 44049.13734953704 | 54.91 |
| 44049.17901620371 | 54.505 |
| 44049.22068287038 | 54.119 |
| 44049.26234953704 | 53.713 |
| 44049.30401620371 | 53.308 |
| 44049.34568287038 | 53.018 |
| 44049.38734953704 | 53.289 |
| 44049.42901620371 | 53.675 |
| 44049.47068287038 | 55.045 |
| 44049.51234953704 | 56.59 |
| 44049.55401620371 | 58.231 |
| 44049.59568287038 | 58.771 |
| 44049.63734953704 | 60.007 |
| 44049.67901620371 | 59.524 |
| 44049.72068287038 | 61.551 |
| 44049.76234953704 | 61.03 |
| 44049.80401620371 | 59.659 |
| 44049.84568287038 | 58.038 |
| 44049.88734953704 | 57.072 |
| 44049.92901620371 | 56.223 |
| 44049.97068287038 | 55.2 |
| 44050.01234953704 | 54.273 |
| 44050.05401620371 | 53.443 |
| 44050.09568287038 | 52.767 |
| 44050.13734953704 | 52.014 |
| 44050.17901620371 | 51.416 |
| 44050.22068287038 | 50.933 |
| 44050.26234953704 | 50.258 |
| 44050.30401620371 | 49.601 |
| 44050.34568287038 | 49.331 |
| 44050.38734953704 | 49.524 |
| 44050.42901620371 | 50.335 |
| 44050.47068287038 | 52.014 |
| 44050.51234953704 | 54.428 |
| 44050.55401620371 | 57.381 |
| 44050.59568287038 | 60.007 |
| 44050.63734953704 | 62.343 |
| 44050.67901620371 | 63.482 |
| 44050.72068287038 | 63.694 |
| 44050.76234953704 | 62.767 |
| 44050.80401620371 | 61.223 |
| 44050.84568287038 | 59.466 |
| 44050.88734953704 | 58.366 |
| 44050.92901620371 | 57.343 |
| 44050.97068287038 | 56.397 |
| 44051.01234953704 | 55.567 |
| 44051.05401620371 | 54.775 |
| 44051.09568287038 | 54.138 |
| 44051.13734953704 | 53.462 |
| 44051.17901620371 | 52.748 |
| 44051.22068287038 | 51.976 |
| 44051.26234953704 | 51.204 |
| 44051.30401620371 | 50.412 |
| 44051.34568287038 | 49.968 |
| 44051.38734953704 | 49.987 |
| 44051.42901620371 | 50.567 |
| 44051.47068287038 | 51.995 |
| 44051.51234953704 | 54.408 |
| 44051.55401620371 | 57.188 |
| 44051.59568287038 | 60.084 |
| 44051.63734953704 | 60.876 |
| 44051.67901620371 | 61.841 |
| 44051.72068287038 | 61.262 |
| 44051.76234953704 | 61.455 |
| 44051.80401620371 | 60.489 |
| 44051.84568287038 | 59.099 |
| 44051.88734953704 | 57.883 |
| 44051.92901620371 | 56.899 |
| 44051.97068287038 | 55.933 |
| 44052.01234953704 | 55.2 |
| 44052.05401620371 | 54.543 |
| 44052.09568287038 | 53.984 |
| 44052.13734953704 | 53.404 |
| 44052.17901620371 | 52.767 |
| 44052.22068287038 | 52.014 |
| 44052.26234953704 | 51.223 |
| 44052.30401620371 | 50.528 |
| 44052.34568287038 | 50.142 |
| 44052.38734953704 | 50.219 |
| 44052.42901620371 | 50.856 |
| 44052.47068287038 | 52.285 |
| 44052.51234953704 | 54.582 |
| 44052.55401620371 | 57.459 |
| 44052.59568287038 | 60.238 |
| 44052.63734953704 | 62.072 |
| 44052.67901620371 | 63.636 |
| 44052.72068287038 | 63.655 |
| 44052.76234953704 | 62.845 |
| 44052.80401620371 | 61.648 |
| 44052.84568287038 | 59.814 |
| 44052.88734953704 | 58.385 |
| 44052.92901620371 | 57.381 |
| 44052.97068287038 | 56.59 |
| 44053.01234953704 | 55.914 |
| 44053.05401620371 | 55.316 |
| 44053.09568287038 | 54.659 |
| 44053.13734953704 | 54.099 |
| 44053.17901620371 | 53.443 |
| 44053.22068287038 | 52.787 |
| 44053.26234953704 | 51.957 |
| 44053.30401620371 | 51.223 |
| 44053.34568287038 | 50.875 |
| 44053.38734953704 | 50.953 |
| 44053.42901620371 | 51.59 |
| 44053.47068287038 | 52.98 |
| 44053.51234953704 | 55.316 |
| 44053.55401620371 | 57.767 |
| 44053.59568287038 | 58.52 |
| 44053.63734953704 | 61.957 |
| 44053.67901620371 | 61.744 |
| 44053.72068287038 | 61.628 |
| 44053.76234953704 | 60.798 |
| 44053.80401620371 | 59.601 |
| 44053.84568287038 | 58.598 |
| 44053.88734953704 | 57.497 |
| 44053.92901620371 | 56.706 |
| 44053.97068287038 | 55.779 |
| 44054.01234953704 | 54.794 |
| 44054.05401620371 | 54.08 |
| 44054.09568287038 | 53.733 |
| 44054.13734953704 | 53.366 |
| 44054.17901620371 | 52.98 |
| 44054.22068287038 | 52.478 |
| 44054.26234953704 | 51.957 |
| 44054.30401620371 | 51.474 |
| 44054.34568287038 | 51.397 |
| 44054.38734953704 | 51.513 |
| 44054.42901620371 | 52.439 |
| 44054.47068287038 | 53.366 |
| 44054.51234953704 | 54.968 |
| 44054.55401620371 | 56.918 |
| 44054.59568287038 | 59.505 |
| 44054.63734953704 | 60.895 |
| 44054.67901620371 | 61.648 |
| 44054.72068287038 | 60.47 |
| 44054.76234953704 | 59.428 |
| 44054.80401620371 | 57.845 |
| 44054.84568287038 | 56.686 |
| 44054.88734953704 | 55.431 |
| 44054.92901620371 | 54.447 |
| 44054.97068287038 | 53.752 |
| 44055.01234953704 | 53.211 |
| 44055.05401620371 | 52.671 |
| 44055.09568287038 | 52.227 |
| 44055.13734953704 | 51.841 |
| 44055.17901620371 | 51.204 |
| 44055.22068287038 | 50.625 |
| 44055.26234953704 | 49.93 |
| 44055.30401620371 | 49.292 |
| 44055.34568287038 | 49.119 |
| 44055.38734953704 | 49.408 |
| 44055.42901620371 | 50.065 |
| 44055.47068287038 | 51.667 |
| 44055.51234953704 | 53.733 |
| 44055.55401620371 | 57.015 |
| 44055.59568287038 | 58.018 |
| 44055.63734953704 | 58.25 |
| 44055.67901620371 | 57.227 |
| 44055.72068287038 | 56.821 |
| 44055.76234953704 | 56.957 |
| 44055.80401620371 | 56.262 |
| 44055.84568287038 | 55.335 |
| 44055.88734953704 | 54.37 |
| 44055.92901620371 | 53.462 |
| 44055.97068287038 | 52.941 |
| 44056.01234953704 | 52.536 |
| 44056.05401620371 | 52.169 |
| 44056.09568287038 | 51.802 |
| 44056.13734953704 | 51.223 |
| 44056.17901620371 | 50.547 |
| 44056.22068287038 | 49.814 |
| 44056.26234953704 | 49.08 |
| 44056.30401620371 | 48.404 |
| 44056.34568287038 | 48.211 |
| 44056.38734953704 | 48.482 |
| 44056.42901620371 | 49.466 |
| 44056.47068287038 | 51.377 |
| 44056.51234953704 | 54.08 |
| 44056.55401620371 | 56.59 |
| 44056.59568287038 | 57.999 |
| 44056.63734953704 | 58.945 |
| 44056.67901620371 | 58.771 |
| 44056.72068287038 | 58.269 |
| 44056.76234953704 | 57.845 |
| 44056.80401620371 | 57.13 |
| 44056.84568287038 | 56.339 |
| 44056.88734953704 | 55.586 |
| 44056.92901620371 | 54.891 |
| 44056.97068287038 | 54.312 |
| 44057.01234953704 | 53.752 |
| 44057.05401620371 | 53.192 |
| 44057.09568287038 | 52.709 |
| 44057.13734953704 | 52.13 |
| 44057.17901620371 | 51.493 |
| 44057.22068287038 | 50.779 |
| 44057.26234953704 | 49.987 |
| 44057.30401620371 | 49.273 |
| 44057.34568287038 | 49.061 |
| 44057.38734953704 | 49.312 |
| 44057.42901620371 | 50.18 |
| 44057.47068287038 | 51.899 |
| 44057.51234953704 | 54.408 |
| 44057.55401620371 | 57.497 |
| 44057.59568287038 | 59.814 |
| 44057.63734953704 | 61.339 |
| 44057.67901620371 | 61.667 |
| 44057.72068287038 | 60.895 |
| 44057.76234953704 | 59.968 |
| 44057.80401620371 | 58.713 |
| 44057.84568287038 | 57.555 |
| 44057.88734953704 | 56.165 |
| 44057.92901620371 | 55.103 |
| 44057.97068287038 | 54.235 |
| 44058.01234953704 | 53.424 |
| 44058.05401620371 | 52.845 |
| 44058.09568287038 | 52.343 |
| 44058.13734953704 | 51.744 |
| 44058.17901620371 | 51.146 |
| 44058.22068287038 | 50.451 |
| 44058.26234953704 | 49.717 |
| 44058.30401620371 | 49.119 |
| 44058.34568287038 | 49.003 |
| 44058.38734953704 | 49.389 |
| 44058.42901620371 | 50.316 |
| 44058.47068287038 | 52.381 |
| 44058.51234953704 | 55.045 |
| 44058.55401620371 | 58.578 |
| 44058.59568287038 | 60.933 |
| 44058.63734953704 | 62.845 |
| 44058.67901620371 | 64.215 |
| 44058.72068287038 | 63.945 |
| 44058.76234953704 | 62.845 |
| 44058.80401620371 | 60.876 |
| 44058.84568287038 | 59.003 |
| 44058.88734953704 | 57.034 |
| 44058.92901620371 | 55.586 |
| 44058.97068287038 | 54.254 |
| 44059.01234953704 | 53.52 |
| 44059.05401620371 | 52.845 |
| 44059.09568287038 | 52.072 |
| 44059.13734953704 | 51.339 |
| 44059.17901620371 | 50.682 |
| 44059.22068287038 | 50.123 |
| 44059.26234953704 | 49.37 |
| 44059.30401620371 | 48.578 |
| 44059.34568287038 | 48.694 |
| 44059.38734953704 | 49.157 |
| 44059.42901620371 | 50.161 |
| 44059.47068287038 | 51.937 |
| 44059.51234953704 | 54.987 |
| 44059.55401620371 | 58.173 |
| 44059.59568287038 | 61.725 |
| 44059.63734953704 | 63.598 |
| 44059.67901620371 | 64.679 |
| 44059.72068287038 | 65.779 |
| 44059.76234953704 | 63.964 |
| 44059.80401620371 | 62.42 |
| 44059.84568287038 | 59.93 |
| 44059.88734953704 | 57.941 |
| 44059.92901620371 | 56.706 |
| 44059.97068287038 | 55.76 |
| 44060.01234953704 | 55.161 |
| 44060.05401620371 | 54.621 |
| 44060.09568287038 | 54.061 |
| 44060.13734953704 | 53.675 |
| 44060.17901620371 | 53.153 |
| 44060.22068287038 | 52.594 |
| 44060.26234953704 | 51.899 |
| 44060.30401620371 | 51.339 |
| 44060.34568287038 | 51.435 |
| 44060.38734953704 | 51.783 |
| 44060.42901620371 | 52.594 |
| 44060.47068287038 | 54.215 |
| 44060.51234953704 | 56.841 |
| 44060.55401620371 | 59.756 |
| 44060.59568287038 | 62.188 |
| 44060.63734953704 | 62.285 |
| 44060.67901620371 | 63.25 |
| 44060.72068287038 | 63.347 |
| 44060.76234953704 | 62.497 |
| 44060.80401620371 | 61.455 |
| 44060.84568287038 | 60.451 |
| 44060.88734953704 | 59.389 |
| 44060.92901620371 | 58.501 |
| 44060.97068287038 | 57.69 |
| 44061.01234953704 | 56.937 |
| 44061.05401620371 | 56.3 |
| 44061.09568287038 | 55.76 |
| 44061.13734953704 | 55.316 |
| 44061.17901620371 | 54.717 |
| 44061.22068287038 | 54.061 |
| 44061.26234953704 | 53.347 |
| 44061.30401620371 | 52.671 |
| 44061.34568287038 | 52.323 |
| 44061.38734953704 | 52.729 |
| 44061.42901620371 | 53.848 |
| 44061.47068287038 | 55.837 |
| 44061.51234953704 | 57.999 |
| 44061.55401620371 | 60.084 |
| 44061.59568287038 | 61.899 |
| 44061.63734953704 | 62.169 |
| 44061.67901620371 | 62.188 |
| 44061.72068287038 | 61.3 |
| 44061.76234953704 | 60.895 |
| 44061.80401620371 | 59.852 |
| 44061.84568287038 | 58.849 |
| 44061.88734953704 | 57.96 |
| 44061.92901620371 | 57.285 |
| 44061.97068287038 | 56.899 |
| 44062.01234953704 | 56.358 |
| 44062.05401620371 | 55.682 |
| 44062.09568287038 | 55.026 |
| 44062.13734953704 | 54.428 |
| 44062.17901620371 | 54.022 |
| 44062.22068287038 | 53.462 |
| 44062.26234953704 | 52.748 |
| 44062.30401620371 | 51.976 |
| 44062.34568287038 | 51.725 |
| 44062.38734953704 | 52.15 |
| 44062.42901620371 | 53.424 |
| 44062.47068287038 | 55.393 |
| 44062.51234953704 | 57.671 |
| 44062.55401620371 | 59.852 |
| 44062.59568287038 | 61.86 |
| 44062.63734953704 | 62.266 |
| 44062.67901620371 | 61.764 |
| 44062.72068287038 | 61.416 |
| 44062.76234953704 | 60.451 |
| 44062.80401620371 | 59.794 |
| 44062.84568287038 | 59.08 |
| 44062.88734953704 | 58.134 |
| 44062.92901620371 | 57.401 |
| 44062.97068287038 | 56.764 |
| 44063.01234953704 | 56.165 |
| 44063.05401620371 | 55.605 |
| 44063.09568287038 | 55.065 |
| 44063.13734953704 | 54.486 |
| 44063.17901620371 | 53.829 |
| 44063.22068287038 | 53.115 |
| 44063.26234953704 | 52.401 |
| 44063.30401620371 | 51.744 |
| 44063.34568287038 | 51.513 |
| 44063.38734953704 | 51.918 |
| 44063.42901620371 | 53.231 |
| 44063.47068287038 | 55.258 |
| 44063.51234953704 | 56.937 |
| 44063.55401620371 | 59.119 |
| 44063.59568287038 | 60.856 |
| 44063.63734953704 | 60.702 |
| 44063.67901620371 | 59.273 |
| 44063.72068287038 | 59.312 |
| 44063.76234953704 | 59.389 |
| 44063.80401620371 | 58.675 |
| 44063.84568287038 | 57.787 |
| 44063.88734953704 | 57.111 |
| 44063.92901620371 | 56.764 |
| 44063.97068287038 | 56.242 |
| 44064.01234953704 | 55.702 |
| 44064.05401620371 | 55.103 |
| 44064.09568287038 | 54.486 |
| 44064.13734953704 | 53.829 |
| 44064.17901620371 | 53.231 |
| 44064.22068287038 | 52.594 |
| 44064.26234953704 | 51.841 |
| 44064.30401620371 | 51.146 |
| 44064.34568287038 | 50.875 |
| 44064.38734953704 | 51.319 |
| 44064.42901620371 | 52.555 |
| 44064.47068287038 | 54.486 |
| 44064.51234953704 | 56.783 |
| 44064.55401620371 | 59.099 |
| 44064.59568287038 | 61.32 |
| 44064.63734953704 | 62.806 |
| 44064.67901620371 | 63.269 |
| 44064.72068287038 | 62.845 |
| 44064.76234953704 | 61.783 |
| 44064.80401620371 | 60.567 |
| 44064.84568287038 | 59.35 |
| 44064.88734953704 | 58.269 |
| 44064.92901620371 | 57.343 |
| 44064.97068287038 | 56.493 |
| 44065.01234953704 | 55.682 |
| 44065.05401620371 | 54.968 |
| 44065.09568287038 | 54.331 |
| 44065.13734953704 | 53.675 |
| 44065.17901620371 | 52.98 |
| 44065.22068287038 | 52.285 |
| 44065.26234953704 | 51.532 |
| 44065.30401620371 | 50.875 |
| 44065.34568287038 | 50.605 |
| 44065.38734953704 | 50.895 |
| 44065.42901620371 | 52.034 |
| 44065.47068287038 | 53.829 |
| 44065.51234953704 | 56.088 |
| 44065.55401620371 | 58.115 |
| 44065.59568287038 | 59.91 |
| 44065.63734953704 | 61.242 |
| 44065.67901620371 | 61.899 |
| 44065.72068287038 | 62.015 |
| 44065.76234953704 | 61.416 |
| 44065.80401620371 | 60.374 |
| 44065.84568287038 | 59.235 |
| 44065.88734953704 | 58.211 |
| 44065.92901620371 | 57.208 |
| 44065.97068287038 | 56.416 |
| 44066.01234953704 | 55.586 |
| 44066.05401620371 | 54.891 |
| 44066.09568287038 | 54.254 |
| 44066.13734953704 | 53.694 |
| 44066.17901620371 | 53.134 |
| 44066.22068287038 | 52.516 |
| 44066.26234953704 | 51.899 |
| 44066.30401620371 | 51.397 |
| 44066.34568287038 | 51.146 |
| 44066.38734953704 | 51.397 |
| 44066.42901620371 | 51.976 |
| 44066.47068287038 | 53.887 |
| 44066.51234953704 | 55.933 |
| 44066.55401620371 | 58.231 |
| 44066.59568287038 | 59.582 |
| 44066.63734953704 | 59.756 |
| 44066.67901620371 | 60.2 |
| 44066.72068287038 | 59.37 |
| 44066.76234953704 | 58.54 |
| 44066.80401620371 | 57.825 |
| 44066.84568287038 | 56.686 |
| 44066.88734953704 | 55.798 |
| 44066.92901620371 | 55.007 |
| 44066.97068287038 | 54.273 |
| 44067.01234953704 | 53.597 |
| 44067.05401620371 | 53.057 |
| 44067.09568287038 | 52.594 |
| 44067.13734953704 | 52.15 |
| 44067.17901620371 | 51.628 |
| 44067.22068287038 | 51.184 |
| 44067.26234953704 | 50.682 |
| 44067.30401620371 | 50.161 |
| 44067.34568287038 | 49.968 |
| 44067.38734953704 | 50.123 |
| 44067.42901620371 | 51.165 |
| 44067.47068287038 | 53.134 |
| 44067.51234953704 | 55.335 |
| 44067.55401620371 | 57.169 |
| 44067.59568287038 | 58.115 |
| 44067.63734953704 | 58.694 |
| 44067.67901620371 | 58.385 |
| 44067.72068287038 | 57.98 |
| 44067.76234953704 | 57.42 |
| 44067.80401620371 | 56.802 |
| 44067.84568287038 | 56.069 |
| 44067.88734953704 | 55.721 |
| 44067.92901620371 | 55.412 |
| 44067.97068287038 | 55.007 |
| 44068.01234953704 | 54.408 |
| 44068.05401620371 | 53.887 |
| 44068.09568287038 | 53.327 |
| 44068.13734953704 | 52.845 |
| 44068.17901620371 | 52.401 |
| 44068.22068287038 | 51.802 |
| 44068.26234953704 | 51.223 |
| 44068.30401620371 | 50.663 |
| 44068.34568287038 | 50.509 |
| 44068.38734953704 | 50.933 |
| 44068.42901620371 | 52.246 |
| 44068.47068287038 | 54.312 |
| 44068.51234953704 | 56.648 |
| 44068.55401620371 | 59.061 |
| 44068.59568287038 | 60.837 |
| 44068.63734953704 | 62.381 |
| 44068.67901620371 | 61.648 |
| 44068.72068287038 | 60.316 |
| 44068.76234953704 | 59.235 |
| 44068.80401620371 | 58.25 |
| 44068.84568287038 | 57.323 |
| 44068.88734953704 | 56.416 |
| 44068.92901620371 | 55.779 |
| 44068.97068287038 | 55.354 |
| 44069.01234953704 | 55.084 |
| 44069.05401620371 | 54.64 |
| 44069.09568287038 | 54.37 |
| 44069.13734953704 | 53.848 |
| 44069.17901620371 | 53.211 |
| 44069.22068287038 | 52.574 |
| 44069.26234953704 | 52.034 |
| 44069.30401620371 | 51.551 |
| 44069.34568287038 | 51.377 |
| 44069.38734953704 | 51.899 |
| 44069.42901620371 | 53.115 |
| 44069.47068287038 | 55.605 |
| 44069.51234953704 | 57.632 |
| 44069.55401620371 | 60.123 |
| 44069.59568287038 | 61.744 |
| 44069.63734953704 | 61.281 |
| 44069.67901620371 | 60.74 |
| 44069.72068287038 | 60.181 |
| 44069.76234953704 | 59.08 |
| 44069.80401620371 | 57.845 |
| 44069.84568287038 | 56.783 |
| 44069.88734953704 | 56.03 |
| 44069.92901620371 | 55.586 |
| 44069.97068287038 | 55.065 |
| 44070.01234953704 | 54.582 |
| 44070.05401620371 | 54.061 |
| 44070.09568287038 | 53.443 |
| 44070.13734953704 | 52.941 |
| 44070.17901620371 | 52.343 |
| 44070.22068287038 | 51.706 |
| 44070.26234953704 | 51.107 |
| 44070.30401620371 | 50.47 |
| 44070.34568287038 | 50.238 |
| 44070.38734953704 | 50.702 |
| 44070.42901620371 | 52.034 |
| 44070.47068287038 | 54.273 |
| 44070.51234953704 | 56.937 |
| 44070.55401620371 | 59.428 |
| 44070.59568287038 | 60.779 |
| 44070.63734953704 | 61.32 |
| 44070.67901620371 | 60.181 |
| 44070.72068287038 | 59.389 |
| 44070.76234953704 | 58.926 |
| 44070.80401620371 | 57.787 |
| 44070.84568287038 | 57.072 |
| 44070.88734953704 | 56.242 |
| 44070.92901620371 | 55.547 |
| 44070.97068287038 | 54.987 |
| 44071.01234953704 | 54.447 |
| 44071.05401620371 | 54.022 |
| 44071.09568287038 | 53.713 |
| 44071.13734953704 | 53.404 |
| 44071.17901620371 | 53.018 |
| 44071.22068287038 | 52.516 |
| 44071.26234953704 | 52.034 |
| 44071.30401620371 | 51.609 |
| 44071.34568287038 | 51.551 |
| 44071.38734953704 | 51.725 |
| 44071.42901620371 | 52.265 |
| 44071.47068287038 | 53.366 |
| 44071.51234953704 | 54.659 |
| 44071.55401620371 | 55.123 |
| 44071.59568287038 | 56.628 |
| 44071.63734953704 | 56.416 |
| 44071.67901620371 | 55.682 |
| 44071.72068287038 | 55.277 |
| 44071.76234953704 | 54.698 |
| 44071.80401620371 | 54.215 |
| 44071.84568287038 | 53.636 |
| 44071.88734953704 | 53.153 |
| 44071.92901620371 | 52.883 |
| 44071.97068287038 | 52.478 |
| 44072.01234953704 | 51.976 |
| 44072.05401620371 | 51.532 |
| 44072.09568287038 | 51.011 |
| 44072.13734953704 | 50.547 |
| 44072.17901620371 | 50.142 |
| 44072.22068287038 | 49.64 |
| 44072.26234953704 | 49.254 |
| 44072.30401620371 | 49.022 |
| 44072.34568287038 | 48.887 |
| 44072.38734953704 | 48.926 |
| 44072.42901620371 | 48.926 |
| 44072.47068287038 | 49.254 |
| 44072.51234953704 | 49.389 |
| 44072.55401620371 | 49.582 |
| 44072.59568287038 | 50.142 |
| 44072.63734953704 | 52.323 |
| 44072.67901620371 | 53.771 |
| 44072.72068287038 | 54.119 |
| 44072.76234953704 | 53.675 |
| 44072.80401620371 | 53.038 |
| 44072.84568287038 | 52.478 |
| 44072.88734953704 | 51.937 |
| 44072.92901620371 | 51.223 |
| 44072.97068287038 | 50.74 |
| 44073.01234953704 | 50.451 |
| 44073.05401620371 | 50.354 |
| 44073.09568287038 | 50.18 |
| 44073.13734953704 | 49.794 |
| 44073.17901620371 | 49.466 |
| 44073.22068287038 | 48.964 |
| 44073.26234953704 | 48.54 |
| 44073.30401620371 | 48.057 |
| 44073.34568287038 | 47.941 |
| 44073.38734953704 | 48.366 |
| 44073.42901620371 | 49.736 |
| 44073.47068287038 | 51.957 |
| 44073.51234953704 | 54.486 |
| 44073.55401620371 | 56.455 |
| 44073.59568287038 | 56.918 |
| 44073.63734953704 | 56.416 |
| 44073.67901620371 | 56.783 |
| 44073.72068287038 | 57.053 |
| 44073.76234953704 | 56.474 |
| 44073.80401620371 | 55.277 |
| 44073.84568287038 | 54.524 |
| 44073.88734953704 | 53.984 |
| 44073.92901620371 | 53.578 |
| 44073.97068287038 | 53.115 |
| 44074.01234953704 | 52.362 |
| 44074.05401620371 | 51.686 |
| 44074.09568287038 | 51.069 |
| 44074.13734953704 | 50.586 |
| 44074.17901620371 | 50.026 |
| 44074.22068287038 | 49.466 |
| 44074.26234953704 | 48.791 |
| 44074.30401620371 | 48.192 |
| 44074.34568287038 | 47.98 |
| 44074.38734953704 | 48.424 |
| 44074.42901620371 | 49.775 |
| 44074.47068287038 | 51.821 |
| 44074.51234953704 | 54.022 |
| 44074.55401620371 | 55.856 |
| 44074.59568287038 | 56.416 |
| 44074.63734953704 | 56.686 |
| 44074.67901620371 | 56.049 |
| 44074.72068287038 | 55.026 |
| 44074.76234953704 | 54.099 |
| 44074.80401620371 | 53.462 |
| 44074.84568287038 | 53.096 |
| 44074.88734953704 | 52.748 |
| 44074.92901620371 | 52.458 |
| 44074.97068287038 | 52.285 |
| 44075.01234953704 | 52.111 |
| 44075.05401620371 | 51.937 |
| 44075.09568287038 | 51.783 |
| 44075.13734953704 | 51.416 |
| 44075.17901620371 | 51.011 |
| 44075.22068287038 | 50.412 |
| 44075.26234953704 | 49.891 |
| 44075.30401620371 | 49.408 |
| 44075.34568287038 | 49.157 |
| 44075.38734953704 | 49.37 |
| 44075.42901620371 | 50.431 |
| 44075.47068287038 | 52.265 |
| 44075.51234953704 | 54.389 |
| 44075.55401620371 | 56.493 |
| 44075.59568287038 | 58.308 |
| 44075.63734953704 | 59.698 |
| 44075.67901620371 | 60.238 |
| 44075.72068287038 | 59.717 |
| 44075.76234953704 | 58.443 |
| 44075.80401620371 | 57.092 |
| 44075.84568287038 | 56.011 |
| 44075.88734953704 | 55.045 |
| 44075.92901620371 | 54.138 |
| 44075.97068287038 | 53.25 |
| 44076.01234953704 | 52.439 |
| 44076.05401620371 | 51.783 |
| 44076.09568287038 | 51.126 |
| 44076.13734953704 | 50.528 |
| 44076.17901620371 | 49.872 |
| 44076.22068287038 | 49.099 |
| 44076.26234953704 | 48.346 |
| 44076.30401620371 | 47.613 |
| 44076.34568287038 | 47.304 |
| 44076.38734953704 | 47.594 |
| 44076.42901620371 | 48.81 |
| 44076.47068287038 | 50.875 |
| 44076.51234953704 | 53.269 |
| 44076.55401620371 | 55.702 |
| 44076.59568287038 | 57.767 |
| 44076.63734953704 | 59.215 |
| 44076.67901620371 | 59.794 |
| 44076.72068287038 | 59.215 |
| 44076.76234953704 | 58.154 |
| 44076.80401620371 | 56.937 |
| 44076.84568287038 | 55.991 |
| 44076.88734953704 | 55.123 |
| 44076.92901620371 | 54.35 |
| 44076.97068287038 | 53.559 |
| 44077.01234953704 | 52.845 |
| 44077.05401620371 | 52.227 |
| 44077.09568287038 | 51.706 |
| 44077.13734953704 | 51.107 |
| 44077.17901620371 | 50.489 |
| 44077.22068287038 | 49.756 |
| 44077.26234953704 | 49.003 |
| 44077.30401620371 | 48.308 |
| 44077.34568287038 | 47.96 |
| 44077.38734953704 | 48.211 |
| 44077.42901620371 | 49.466 |
| 44077.47068287038 | 51.551 |
| 44077.51234953704 | 53.926 |
| 44077.55401620371 | 56.339 |
| 44077.59568287038 | 58.404 |
| 44077.63734953704 | 59.852 |
| 44077.67901620371 | 60.47 |
| 44077.72068287038 | 60.123 |
| 44077.76234953704 | 59.061 |
| 44077.80401620371 | 57.767 |
| 44077.84568287038 | 56.706 |
| 44077.88734953704 | 55.644 |
| 44077.92901620371 | 54.814 |
| 44077.97068287038 | 54.042 |
| 44078.01234953704 | 53.327 |
| 44078.05401620371 | 52.652 |
| 44078.09568287038 | 52.111 |
| 44078.13734953704 | 51.59 |
| 44078.17901620371 | 51.011 |
| 44078.22068287038 | 50.277 |
| 44078.26234953704 | 49.582 |
| 44078.30401620371 | 48.868 |
| 44078.34568287038 | 48.578 |
| 44078.38734953704 | 48.848 |
| 44078.42901620371 | 50.142 |
| 44078.47068287038 | 52.15 |
| 44078.51234953704 | 54.505 |
| 44078.55401620371 | 56.821 |
| 44078.59568287038 | 58.926 |
| 44078.63734953704 | 60.432 |
| 44078.67901620371 | 61.107 |
| 44078.72068287038 | 60.876 |
| 44078.76234953704 | 59.601 |
| 44078.80401620371 | 58.424 |
| 44078.84568287038 | 57.246 |
| 44078.88734953704 | 56.184 |
| 44078.92901620371 | 55.181 |
| 44078.97068287038 | 54.37 |
| 44079.01234953704 | 53.713 |
| 44079.05401620371 | 53.173 |
| 44079.09568287038 | 52.709 |
| 44079.13734953704 | 52.343 |
| 44079.17901620371 | 51.744 |
| 44079.22068287038 | 51.146 |
| 44079.26234953704 | 50.393 |
| 44079.30401620371 | 49.717 |
| 44079.34568287038 | 49.37 |
| 44079.38734953704 | 49.582 |
| 44079.42901620371 | 50.76 |
| 44079.47068287038 | 52.825 |
| 44079.51234953704 | 55.258 |
| 44079.55401620371 | 57.652 |
| 44079.59568287038 | 59.679 |
| 44079.63734953704 | 60.953 |
| 44079.67901620371 | 61.667 |
| 44079.72068287038 | 60.702 |
| 44079.76234953704 | 59.737 |
| 44079.80401620371 | 58.52 |
| 44079.84568287038 | 57.381 |
| 44079.88734953704 | 56.648 |
| 44079.92901620371 | 55.76 |
| 44079.97068287038 | 54.968 |
| 44080.01234953704 | 54.157 |
| 44080.05401620371 | 53.385 |
| 44080.09568287038 | 52.767 |
| 44080.13734953704 | 52.15 |
| 44080.17901620371 | 51.474 |
| 44080.22068287038 | 50.74 |
| 44080.26234953704 | 49.949 |
| 44080.30401620371 | 49.177 |
| 44080.34568287038 | 48.829 |
| 44080.38734953704 | 49.099 |
| 44080.42901620371 | 50.18 |
| 44080.47068287038 | 52.13 |
| 44080.51234953704 | 54.389 |
| 44080.55401620371 | 56.686 |
| 44080.59568287038 | 58.462 |
| 44080.63734953704 | 59.852 |
| 44080.67901620371 | 60.393 |
| 44080.72068287038 | 60.026 |
| 44080.76234953704 | 58.926 |
| 44080.80401620371 | 57.787 |
| 44080.84568287038 | 56.686 |
| 44080.88734953704 | 55.779 |
| 44080.92901620371 | 54.987 |
| 44080.97068287038 | 54.157 |
| 44081.01234953704 | 53.404 |
| 44081.05401620371 | 52.69 |
| 44081.09568287038 | 52.092 |
| 44081.13734953704 | 51.513 |
| 44081.17901620371 | 50.895 |
| 44081.22068287038 | 50.065 |
| 44081.26234953704 | 49.292 |
| 44081.30401620371 | 48.501 |
| 44081.34568287038 | 48.057 |
| 44081.38734953704 | 48.173 |
| 44081.42901620371 | 49.08 |
| 44081.47068287038 | 50.586 |
| 44081.51234953704 | 51.995 |
| 44081.55401620371 | 53.675 |
| 44081.59568287038 | 55.219 |
| 44081.63734953704 | 56.107 |
| 44081.67901620371 | 56.397 |
| 44081.72068287038 | 56.126 |
| 44081.76234953704 | 55.296 |
| 44081.80401620371 | 54.447 |
| 44081.84568287038 | 53.578 |
| 44081.88734953704 | 52.748 |
| 44081.92901620371 | 52.014 |
| 44081.97068287038 | 51.319 |
| 44082.01234953704 | 50.991 |
| 44082.05401620371 | 50.682 |
| 44082.09568287038 | 50.567 |
| 44082.13734953704 | 50.238 |
| 44082.17901620371 | 49.833 |
| 44082.22068287038 | 49.254 |
| 44082.26234953704 | 48.713 |
| 44082.30401620371 | 48.115 |
| 44082.34568287038 | 47.343 |
| 44082.38734953704 | 46.802 |
| 44082.42901620371 | 46.609 |
| 44082.47068287038 | 46.995 |
| 44082.51234953704 | 47.072 |
| 44082.55401620371 | 47.787 |
| 44082.59568287038 | 46.686 |
| 44082.63734953704 | 45.412 |
| 44082.67901620371 | 44.35 |
| 44082.72068287038 | 43.462 |
| 44082.76234953704 | 42.748 |
| 44082.80401620371 | 41.918 |
| 44082.84568287038 | 41.435 |
| 44082.88734953704 | 41.242 |
| 44082.92901620371 | 40.856 |
| 44082.97068287038 | 40.47 |
| 44083.01234953704 | 40.065 |
| 44083.05401620371 | 39.485 |
| 44083.09568287038 | 38.926 |
| 44083.13734953704 | 38.462 |
| 44083.17901620371 | 38.057 |
| 44083.22068287038 | 37.671 |
| 44083.26234953704 | 37.478 |
| 44083.30401620371 | 37.323 |
| 44083.34568287038 | 37.632 |
| 44083.38734953704 | 38.153 |
| 44083.42901620371 | 38.945 |
| 44083.47068287038 | 40.895 |
| 44083.51234953704 | 42.806 |
| 44083.55401620371 | 43.733 |
| 44083.59568287038 | 45.2 |
| 44083.63734953704 | 47.304 |
| 44083.67901620371 | 47.999 |
| 44083.72068287038 | 48.096 |
| 44083.76234953704 | 47.671 |
| 44083.80401620371 | 47.555 |
| 44083.84568287038 | 47.42 |
| 44083.88734953704 | 46.763 |
| 44083.92901620371 | 46.281 |
| 44083.97068287038 | 45.663 |
| 44084.01234953704 | 45.219 |
| 44084.05401620371 | 44.929 |
| 44084.09568287038 | 44.756 |
| 44084.13734953704 | 44.64 |
| 44084.17901620371 | 44.447 |
| 44084.22068287038 | 44.234 |
| 44084.26234953704 | 43.906 |
| 44084.30401620371 | 43.655 |
| 44084.34568287038 | 43.346 |
| 44084.38734953704 | 43.54 |
| 44084.42901620371 | 44.563 |
| 44084.47068287038 | 46.628 |
| 44084.51234953704 | 48.076 |
| 44084.55401620371 | 49.215 |
| 44084.59568287038 | 49.485 |
| 44084.63734953704 | 48.597 |
| 44084.67901620371 | 48.366 |
| 44084.72068287038 | 47.98 |
| 44084.76234953704 | 47.632 |
| 44084.80401620371 | 47.227 |
| 44084.84568287038 | 46.995 |
| 44084.88734953704 | 46.86 |
| 44084.92901620371 | 46.59 |
| 44084.97068287038 | 46.262 |
| 44085.01234953704 | 45.991 |
| 44085.05401620371 | 45.875 |
| 44085.09568287038 | 45.74 |
| 44085.13734953704 | 45.644 |
| 44085.17901620371 | 45.547 |
| 44085.22068287038 | 45.316 |
| 44085.26234953704 | 44.987 |
| 44085.30401620371 | 44.679 |
| 44085.34568287038 | 44.543 |
| 44085.38734953704 | 44.582 |
| 44085.42901620371 | 44.852 |
| 44085.47068287038 | 45.624 |
| 44085.51234953704 | 45.933 |
| 44085.55401620371 | 48.231 |
| 44085.59568287038 | 50.76 |
| 44085.63734953704 | 52.652 |
| 44085.67901620371 | 52.671 |
| 44085.72068287038 | 52.323 |
| 44085.76234953704 | 51.686 |
| 44085.80401620371 | 50.528 |
| 44085.84568287038 | 49.679 |
| 44085.88734953704 | 49.08 |
| 44085.92901620371 | 48.366 |
| 44085.97068287038 | 47.555 |
| 44086.01234953704 | 46.706 |
| 44086.05401620371 | 46.011 |
| 44086.09568287038 | 45.509 |
| 44086.13734953704 | 45.142 |
| 44086.17901620371 | 44.794 |
| 44086.22068287038 | 44.37 |
| 44086.26234953704 | 43.906 |
| 44086.30401620371 | 43.346 |
| 44086.34568287038 | 43.153 |
| 44086.38734953704 | 43.501 |
| 44086.42901620371 | 44.833 |
| 44086.47068287038 | 46.957 |
| 44086.51234953704 | 49.505 |
| 44086.55401620371 | 51.918 |
| 44086.59568287038 | 54.042 |
| 44086.63734953704 | 55.663 |
| 44086.67901620371 | 56.339 |
| 44086.72068287038 | 56.184 |
| 44086.76234953704 | 55.142 |
| 44086.80401620371 | 53.906 |
| 44086.84568287038 | 52.767 |
| 44086.88734953704 | 51.706 |
| 44086.92901620371 | 50.837 |
| 44086.97068287038 | 50.007 |
| 44087.01234953704 | 49.312 |
| 44087.05401620371 | 48.694 |
| 44087.09568287038 | 48.192 |
| 44087.13734953704 | 47.709 |
| 44087.17901620371 | 47.188 |
| 44087.22068287038 | 46.686 |
| 44087.26234953704 | 46.088 |
| 44087.30401620371 | 45.509 |
| 44087.34568287038 | 45.161 |
| 44087.38734953704 | 45.567 |
| 44087.42901620371 | 46.821 |
| 44087.47068287038 | 48.887 |
| 44087.51234953704 | 51.319 |
| 44087.55401620371 | 53.694 |
| 44087.59568287038 | 55.74 |
| 44087.63734953704 | 57.246 |
| 44087.67901620371 | 57.806 |
| 44087.72068287038 | 57.497 |
| 44087.76234953704 | 56.474 |
| 44087.80401620371 | 55.354 |
| 44087.84568287038 | 54.235 |
| 44087.88734953704 | 53.269 |
| 44087.92901620371 | 52.401 |
| 44087.97068287038 | 51.57 |
| 44088.01234953704 | 50.875 |
| 44088.05401620371 | 50.258 |
| 44088.09568287038 | 49.717 |
| 44088.13734953704 | 49.235 |
| 44088.17901620371 | 48.771 |
| 44088.22068287038 | 48.269 |
| 44088.26234953704 | 47.709 |
| 44088.30401620371 | 47.13 |
| 44088.34568287038 | 46.841 |
| 44088.38734953704 | 47.207 |
| 44088.42901620371 | 48.192 |
| 44088.47068287038 | 49.968 |
| 44088.51234953704 | 52.15 |
| 44088.55401620371 | 54.37 |
| 44088.59568287038 | 56.397 |
| 44088.63734953704 | 57.806 |
| 44088.67901620371 | 58.424 |
| 44088.72068287038 | 58.173 |
| 44088.76234953704 | 57.208 |
| 44088.80401620371 | 56.242 |
| 44088.84568287038 | 55.123 |
| 44088.88734953704 | 53.926 |
| 44088.92901620371 | 52.864 |
| 44088.97068287038 | 51.995 |
| 44089.01234953704 | 51.204 |
| 44089.05401620371 | 50.412 |
| 44089.09568287038 | 49.794 |
| 44089.13734953704 | 49.292 |
| 44089.17901620371 | 48.771 |
| 44089.22068287038 | 48.308 |
| 44089.26234953704 | 47.767 |
| 44089.30401620371 | 47.207 |
| 44089.34568287038 | 46.937 |
| 44089.38734953704 | 47.246 |
| 44089.42901620371 | 48.346 |
| 44089.47068287038 | 50.2 |
| 44089.51234953704 | 52.362 |
| 44089.55401620371 | 54.389 |
| 44089.59568287038 | 56.03 |
| 44089.63734953704 | 57.111 |
| 44089.67901620371 | 57.439 |
| 44089.72068287038 | 56.744 |
| 44089.76234953704 | 55.856 |
| 44089.80401620371 | 54.756 |
| 44089.84568287038 | 53.54 |
| 44089.88734953704 | 52.574 |
| 44089.92901620371 | 51.706 |
| 44089.97068287038 | 50.875 |
| 44090.01234953704 | 50.123 |
| 44090.05401620371 | 49.505 |
| 44090.09568287038 | 48.906 |
| 44090.13734953704 | 48.346 |
| 44090.17901620371 | 47.825 |
| 44090.22068287038 | 47.285 |
| 44090.26234953704 | 46.763 |
| 44090.30401620371 | 46.165 |
| 44090.34568287038 | 45.895 |
| 44090.38734953704 | 46.262 |
| 44090.42901620371 | 47.246 |
| 44090.47068287038 | 48.733 |
| 44090.51234953704 | 50.76 |
| 44090.55401620371 | 52.613 |
| 44090.59568287038 | 54.35 |
| 44090.63734953704 | 55.528 |
| 44090.67901620371 | 56.011 |
| 44090.72068287038 | 55.702 |
| 44090.76234953704 | 54.756 |
| 44090.80401620371 | 53.578 |
| 44090.84568287038 | 52.516 |
| 44090.88734953704 | 51.551 |
| 44090.92901620371 | 50.798 |
| 44090.97068287038 | 50.354 |
| 44091.01234953704 | 49.814 |
| 44091.05401620371 | 49.37 |
| 44091.09568287038 | 48.926 |
| 44091.13734953704 | 48.482 |
| 44091.17901620371 | 48.096 |
| 44091.22068287038 | 47.594 |
| 44091.26234953704 | 47.111 |
| 44091.30401620371 | 46.609 |
| 44091.34568287038 | 46.319 |
| 44091.38734953704 | 46.744 |
| 44091.42901620371 | 47.806 |
| 44091.47068287038 | 49.543 |
| 44091.51234953704 | 51.667 |
| 44091.55401620371 | 53.713 |
| 44091.59568287038 | 55.335 |
| 44091.63734953704 | 56.3 |
| 44091.67901620371 | 56.57 |
| 44091.72068287038 | 56.242 |
| 44091.76234953704 | 55.393 |
| 44091.80401620371 | 54.119 |
| 44091.84568287038 | 52.883 |
| 44091.88734953704 | 51.783 |
| 44091.92901620371 | 50.933 |
| 44091.97068287038 | 50.18 |
| 44092.01234953704 | 49.543 |
| 44092.05401620371 | 48.926 |
| 44092.09568287038 | 48.52 |
| 44092.13734953704 | 48.173 |
| 44092.17901620371 | 47.787 |
| 44092.22068287038 | 47.343 |
| 44092.26234953704 | 46.918 |
| 44092.30401620371 | 46.551 |
| 44092.34568287038 | 46.397 |
| 44092.38734953704 | 46.763 |
| 44092.42901620371 | 47.825 |
| 44092.47068287038 | 49.505 |
| 44092.51234953704 | 50.856 |
| 44092.55401620371 | 52.15 |
| 44092.59568287038 | 53.366 |
| 44092.63734953704 | 54.833 |
| 44092.67901620371 | 55.489 |
| 44092.72068287038 | 55.412 |
| 44092.76234953704 | 54.505 |
| 44092.80401620371 | 53.096 |
| 44092.84568287038 | 51.648 |
| 44092.88734953704 | 50.567 |
| 44092.92901620371 | 49.852 |
| 44092.97068287038 | 49.254 |
| 44093.01234953704 | 48.733 |
| 44093.05401620371 | 48.346 |
| 44093.09568287038 | 48.211 |
| 44093.13734953704 | 48.057 |
| 44093.17901620371 | 47.845 |
| 44093.22068287038 | 47.478 |
| 44093.26234953704 | 47.111 |
| 44093.30401620371 | 46.763 |
| 44093.34568287038 | 46.744 |
| 44093.38734953704 | 47.053 |
| 44093.42901620371 | 48.404 |
| 44093.47068287038 | 48.848 |
| 44093.51234953704 | 49.679 |
| 44093.55401620371 | 50.412 |
| 44093.59568287038 | 51.319 |
| 44093.63734953704 | 52.304 |
| 44093.67901620371 | 53.655 |
| 44093.72068287038 | 54.215 |
| 44093.76234953704 | 53.462 |
| 44093.80401620371 | 52.458 |
| 44093.84568287038 | 51.783 |
| 44093.88734953704 | 51.146 |
| 44093.92901620371 | 50.625 |
| 44093.97068287038 | 50.238 |
| 44094.01234953704 | 49.968 |
| 44094.05401620371 | 49.717 |
| 44094.09568287038 | 49.466 |
| 44094.13734953704 | 49.138 |
| 44094.17901620371 | 48.713 |
| 44094.22068287038 | 48.327 |
| 44094.26234953704 | 47.941 |
| 44094.30401620371 | 47.536 |
| 44094.34568287038 | 47.381 |
| 44094.38734953704 | 47.594 |
| 44094.42901620371 | 48.52 |
| 44094.47068287038 | 49.794 |
| 44094.51234953704 | 50.644 |
| 44094.55401620371 | 51.918 |
| 44094.59568287038 | 53.52 |
| 44094.63734953704 | 54.93 |
| 44094.67901620371 | 55.123 |
| 44094.72068287038 | 55.007 |
| 44094.76234953704 | 54.022 |
| 44094.80401620371 | 52.98 |
| 44094.84568287038 | 51.957 |
| 44094.88734953704 | 51.184 |
| 44094.92901620371 | 50.431 |
| 44094.97068287038 | 49.601 |
| 44095.01234953704 | 48.752 |
| 44095.05401620371 | 47.999 |
| 44095.09568287038 | 47.42 |
| 44095.13734953704 | 46.937 |
| 44095.17901620371 | 46.532 |
| 44095.22068287038 | 46.165 |
| 44095.26234953704 | 45.798 |
| 44095.30401620371 | 45.412 |
| 44095.34568287038 | 45.238 |
| 44095.38734953704 | 45.702 |
| 44095.42901620371 | 46.957 |
| 44095.47068287038 | 48.887 |
| 44095.51234953704 | 51.358 |
| 44095.55401620371 | 53.134 |
| 44095.59568287038 | 53.636 |
| 44095.63734953704 | 54.698 |
| 44095.67901620371 | 56.204 |
| 44095.72068287038 | 55.586 |
| 44095.76234953704 | 54.698 |
| 44095.80401620371 | 53.791 |
| 44095.84568287038 | 52.709 |
| 44095.88734953704 | 51.59 |
| 44095.92901620371 | 50.837 |
| 44095.97068287038 | 49.93 |
| 44096.01234953704 | 49.235 |
| 44096.05401620371 | 48.694 |
| 44096.09568287038 | 48.327 |
| 44096.13734953704 | 48.096 |
| 44096.17901620371 | 47.845 |
| 44096.22068287038 | 47.516 |
| 44096.26234953704 | 47.111 |
| 44096.30401620371 | 46.648 |
| 44096.34568287038 | 46.474 |
| 44096.38734953704 | 46.879 |
| 44096.42901620371 | 48.096 |
| 44096.47068287038 | 50.045 |
| 44096.51234953704 | 51.995 |
| 44096.55401620371 | 53.347 |
| 44096.59568287038 | 53.752 |
| 44096.63734953704 | 54.621 |
| 44096.67901620371 | 54.601 |
| 44096.72068287038 | 54.061 |
| 44096.76234953704 | 53.076 |
| 44096.80401620371 | 52.285 |
| 44096.84568287038 | 51.397 |
| 44096.88734953704 | 50.663 |
| 44096.92901620371 | 50.354 |
| 44096.97068287038 | 50.084 |
| 44097.01234953704 | 49.601 |
| 44097.05401620371 | 49.157 |
| 44097.09568287038 | 48.887 |
| 44097.13734953704 | 48.694 |
| 44097.17901620371 | 48.346 |
| 44097.22068287038 | 47.902 |
| 44097.26234953704 | 47.458 |
| 44097.30401620371 | 47.014 |
| 44097.34568287038 | 46.763 |
| 44097.38734953704 | 47.169 |
| 44097.42901620371 | 48.25 |
| 44097.47068287038 | 50.18 |
| 44097.51234953704 | 52.536 |
| 44097.55401620371 | 54.93 |
| 44097.59568287038 | 56.107 |
| 44097.63734953704 | 56.686 |
| 44097.67901620371 | 56.976 |
| 44097.72068287038 | 56.706 |
| 44097.76234953704 | 55.605 |
| 44097.80401620371 | 54.331 |
| 44097.84568287038 | 53.173 |
| 44097.88734953704 | 52.034 |
| 44097.92901620371 | 51.184 |
| 44097.97068287038 | 50.431 |
| 44098.01234953704 | 49.717 |
| 44098.05401620371 | 49.041 |
| 44098.09568287038 | 48.404 |
| 44098.13734953704 | 47.922 |
| 44098.17901620371 | 47.381 |
| 44098.22068287038 | 46.879 |
| 44098.26234953704 | 46.339 |
| 44098.30401620371 | 45.818 |
| 44098.34568287038 | 45.586 |
| 44098.38734953704 | 45.914 |
| 44098.42901620371 | 47.111 |
| 44098.47068287038 | 48.327 |
| 44098.51234953704 | 50.238 |
| 44098.55401620371 | 52.42 |
| 44098.59568287038 | 54.621 |
| 44098.63734953704 | 56.049 |
| 44098.67901620371 | 56.377 |
| 44098.72068287038 | 55.856 |
| 44098.76234953704 | 54.621 |
| 44098.80401620371 | 53.462 |
| 44098.84568287038 | 52.478 |
| 44098.88734953704 | 51.474 |
| 44098.92901620371 | 50.567 |
| 44098.97068287038 | 49.852 |
| 44099.01234953704 | 49.177 |
| 44099.05401620371 | 48.675 |
| 44099.09568287038 | 48.289 |
| 44099.13734953704 | 47.941 |
| 44099.17901620371 | 47.613 |
| 44099.22068287038 | 47.207 |
| 44099.26234953704 | 46.821 |
| 44099.30401620371 | 46.339 |
| 44099.34568287038 | 46.126 |
| 44099.38734953704 | 46.551 |
| 44099.42901620371 | 47.767 |
| 44099.47068287038 | 49.717 |
| 44099.51234953704 | 51.667 |
| 44099.55401620371 | 53.848 |
| 44099.59568287038 | 55.682 |
| 44099.63734953704 | 56.686 |
| 44099.67901620371 | 56.976 |
| 44099.72068287038 | 56.532 |
| 44099.76234953704 | 55.277 |
| 44099.80401620371 | 53.926 |
| 44099.84568287038 | 52.883 |
| 44099.88734953704 | 51.937 |
| 44099.92901620371 | 51.204 |
| 44099.97068287038 | 50.431 |
| 44100.01234953704 | 49.775 |
| 44100.05401620371 | 49.177 |
| 44100.09568287038 | 48.675 |
| 44100.13734953704 | 48.269 |
| 44100.17901620371 | 47.825 |
| 44100.22068287038 | 47.42 |
| 44100.26234953704 | 46.957 |
| 44100.30401620371 | 46.628 |
| 44100.34568287038 | 46.455 |
| 44100.38734953704 | 46.686 |
| 44100.42901620371 | 47.825 |
| 44100.47068287038 | 49.563 |
| 44100.51234953704 | 51.725 |
| 44100.55401620371 | 53.906 |
| 44100.59568287038 | 55.393 |
| 44100.63734953704 | 56.32 |
| 44100.67901620371 | 56.551 |
| 44100.72068287038 | 56.262 |
| 44100.76234953704 | 55.142 |
| 44100.80401620371 | 53.771 |
| 44100.84568287038 | 52.787 |
| 44100.88734953704 | 52.034 |
| 44100.92901620371 | 51.319 |
| 44100.97068287038 | 50.682 |
| 44101.01234953704 | 50.335 |
| 44101.05401620371 | 50.142 |
| 44101.09568287038 | 49.891 |
| 44101.13734953704 | 49.582 |
| 44101.17901620371 | 49.099 |
| 44101.22068287038 | 48.617 |
| 44101.26234953704 | 48.096 |
| 44101.30401620371 | 47.69 |
| 44101.34568287038 | 47.458 |
| 44101.38734953704 | 47.304 |
| 44101.42901620371 | 47.458 |
| 44101.47068287038 | 48.308 |
| 44101.51234953704 | 49.505 |
| 44101.55401620371 | 50.625 |
| 44101.59568287038 | 52.265 |
| 44101.63734953704 | 52.709 |
| 44101.67901620371 | 52.709 |
| 44101.72068287038 | 52.401 |
| 44101.76234953704 | 51.011 |
| 44101.80401620371 | 49.621 |
| 44101.84568287038 | 48.597 |
| 44101.88734953704 | 47.922 |
| 44101.92901620371 | 47.111 |
| 44101.97068287038 | 46.3 |
| 44102.01234953704 | 45.702 |
| 44102.05401620371 | 45.335 |
| 44102.09568287038 | 44.833 |
| 44102.13734953704 | 44.331 |
| 44102.17901620371 | 43.926 |
| 44102.22068287038 | 43.366 |
| 44102.26234953704 | 42.864 |
| 44102.30401620371 | 42.207 |
| 44102.34568287038 | 41.725 |
| 44102.38734953704 | 41.86 |
| 44102.42901620371 | 42.902 |
| 44102.47068287038 | 44.563 |
| 44102.51234953704 | 46.706 |
| 44102.55401620371 | 48.848 |
| 44102.59568287038 | 50.47 |
| 44102.63734953704 | 51.532 |
| 44102.67901620371 | 51.744 |
| 44102.72068287038 | 50.895 |
| 44102.76234953704 | 49.524 |
| 44102.80401620371 | 48.211 |
| 44102.84568287038 | 46.976 |
| 44102.88734953704 | 46.068 |
| 44102.92901620371 | 45.258 |
| 44102.97068287038 | 44.524 |
| 44103.01234953704 | 43.81 |
| 44103.05401620371 | 43.25 |
| 44103.09568287038 | 42.787 |
| 44103.13734953704 | 42.323 |
| 44103.17901620371 | 41.937 |
| 44103.22068287038 | 41.512 |
| 44103.26234953704 | 41.049 |
| 44103.30401620371 | 40.528 |
| 44103.34568287038 | 40.277 |
| 44103.38734953704 | 40.586 |
| 44103.42901620371 | 41.841 |
| 44103.47068287038 | 43.733 |
| 44103.51234953704 | 46.223 |
| 44103.55401620371 | 48.713 |
| 44103.59568287038 | 50.837 |
| 44103.63734953704 | 52.246 |
| 44103.67901620371 | 52.652 |
| 44103.72068287038 | 52.169 |
| 44103.76234953704 | 50.895 |
| 44103.80401620371 | 49.679 |
| 44103.84568287038 | 48.578 |
| 44103.88734953704 | 47.594 |
| 44103.92901620371 | 46.648 |
| 44103.97068287038 | 45.895 |
| 44104.01234953704 | 45.258 |
| 44104.05401620371 | 44.756 |
| 44104.09568287038 | 44.292 |
| 44104.13734953704 | 43.964 |
| 44104.17901620371 | 43.559 |
| 44104.22068287038 | 43.211 |
| 44104.26234953704 | 42.709 |
| 44104.30401620371 | 42.246 |
| 44104.34568287038 | 41.956 |
| 44104.38734953704 | 42.343 |
| 44104.42901620371 | 43.617 |
| 44104.47068287038 | 45.624 |
| 44104.51234953704 | 48.115 |
| 44104.55401620371 | 50.451 |
| 44104.59568287038 | 52.304 |
| 44104.63734953704 | 53.385 |
| 44104.67901620371 | 53.482 |
| 44104.72068287038 | 52.709 |
| 44104.76234953704 | 51.184 |
| 44104.80401620371 | 49.814 |
| 44104.84568287038 | 48.675 |
| 44104.88734953704 | 47.671 |
| 44104.92901620371 | 46.783 |
| 44104.97068287038 | 45.991 |
| 44105.01234953704 | 45.354 |
| 44105.05401620371 | 44.833 |
| 44105.09568287038 | 44.408 |
| 44105.13734953704 | 44.022 |
| 44105.17901620371 | 43.578 |
| 44105.22068287038 | 43.134 |
| 44105.26234953704 | 42.748 |
| 44105.30401620371 | 42.169 |
| 44105.34568287038 | 41.841 |
| 44105.38734953704 | 42.169 |
| 44105.42901620371 | 43.153 |
| 44105.47068287038 | 44.582 |
| 44105.51234953704 | 46.821 |
| 44105.55401620371 | 48.945 |
| 44105.59568287038 | 50.76 |
| 44105.63734953704 | 51.976 |
| 44105.67901620371 | 52.246 |
| 44105.72068287038 | 51.59 |
| 44105.76234953704 | 50.219 |
| 44105.80401620371 | 49.08 |
| 44105.84568287038 | 48.057 |
| 44105.88734953704 | 47.285 |
| 44105.92901620371 | 46.667 |
| 44105.97068287038 | 45.895 |
| 44106.01234953704 | 45.316 |
| 44106.05401620371 | 44.833 |
| 44106.09568287038 | 44.601 |
| 44106.13734953704 | 44.234 |
| 44106.17901620371 | 43.848 |
| 44106.22068287038 | 43.385 |
| 44106.26234953704 | 42.902 |
| 44106.30401620371 | 42.362 |
| 44106.34568287038 | 42.053 |
| 44106.38734953704 | 42.458 |
| 44106.42901620371 | 43.597 |
| 44106.47068287038 | 45.451 |
| 44106.51234953704 | 46.957 |
| 44106.55401620371 | 48.289 |
| 44106.59568287038 | 49.099 |
| 44106.63734953704 | 49.466 |
| 44106.67901620371 | 49.93 |
| 44106.72068287038 | 49.756 |
| 44106.76234953704 | 49.003 |
| 44106.80401620371 | 47.96 |
| 44106.84568287038 | 46.957 |
| 44106.88734953704 | 46.223 |
| 44106.92901620371 | 45.624 |
| 44106.97068287038 | 45.142 |
| 44107.01234953704 | 44.621 |
| 44107.05401620371 | 44.215 |
| 44107.09568287038 | 43.81 |
| 44107.13734953704 | 43.424 |
| 44107.17901620371 | 43.057 |
| 44107.22068287038 | 42.613 |
| 44107.26234953704 | 42.169 |
| 44107.30401620371 | 41.628 |
| 44107.34568287038 | 41.416 |
| 44107.38734953704 | 41.744 |
| 44107.42901620371 | 42.748 |
| 44107.47068287038 | 44.447 |
| 44107.51234953704 | 46.744 |
| 44107.55401620371 | 48.906 |
| 44107.59568287038 | 50.586 |
| 44107.63734953704 | 51.686 |
| 44107.67901620371 | 51.918 |
| 44107.72068287038 | 51.319 |
| 44107.76234953704 | 50.219 |
| 44107.80401620371 | 49.119 |
| 44107.84568287038 | 48.057 |
| 44107.88734953704 | 47.169 |
| 44107.92901620371 | 46.474 |
| 44107.97068287038 | 45.76 |
| 44108.01234953704 | 45.2 |
| 44108.05401620371 | 44.717 |
| 44108.09568287038 | 44.312 |
| 44108.13734953704 | 43.945 |
| 44108.17901620371 | 43.52 |
| 44108.22068287038 | 43.095 |
| 44108.26234953704 | 42.613 |
| 44108.30401620371 | 42.188 |
| 44108.34568287038 | 41.86 |
| 44108.38734953704 | 42.227 |
| 44108.42901620371 | 43.366 |
| 44108.47068287038 | 45.277 |
| 44108.51234953704 | 47.555 |
| 44108.55401620371 | 49.64 |
| 44108.59568287038 | 51.339 |
| 44108.63734953704 | 52.401 |
| 44108.67901620371 | 52.671 |
| 44108.72068287038 | 52.072 |
| 44108.76234953704 | 50.991 |
| 44108.80401620371 | 49.833 |
| 44108.84568287038 | 48.81 |
| 44108.88734953704 | 47.883 |
| 44108.92901620371 | 47.15 |
| 44108.97068287038 | 46.532 |
| 44109.01234953704 | 45.972 |
| 44109.05401620371 | 45.489 |
| 44109.09568287038 | 45.123 |
| 44109.13734953704 | 44.736 |
| 44109.17901620371 | 44.292 |
| 44109.22068287038 | 43.79 |
| 44109.26234953704 | 43.289 |
| 44109.30401620371 | 42.709 |
| 44109.34568287038 | 42.4 |
| 44109.38734953704 | 42.651 |
| 44109.42901620371 | 43.733 |
| 44109.47068287038 | 45.528 |
| 44109.51234953704 | 47.671 |
| 44109.55401620371 | 49.717 |
| 44109.59568287038 | 51.262 |
| 44109.63734953704 | 52.304 |
| 44109.67901620371 | 52.362 |
| 44109.72068287038 | 51.628 |
| 44109.76234953704 | 50.374 |
| 44109.80401620371 | 49.215 |
| 44109.84568287038 | 48.134 |
| 44109.88734953704 | 47.111 |
| 44109.92901620371 | 46.3 |
| 44109.97068287038 | 45.586 |
| 44110.01234953704 | 44.872 |
| 44110.05401620371 | 44.35 |
| 44110.09568287038 | 44.003 |
| 44110.13734953704 | 43.617 |
| 44110.17901620371 | 43.25 |
| 44110.22068287038 | 42.787 |
| 44110.26234953704 | 42.343 |
| 44110.30401620371 | 41.802 |
| 44110.34568287038 | 41.493 |
| 44110.38734953704 | 41.821 |
| 44110.42901620371 | 42.96 |
| 44110.47068287038 | 44.698 |
| 44110.51234953704 | 46.899 |
| 44110.55401620371 | 49.041 |
| 44110.59568287038 | 50.682 |
| 44110.63734953704 | 51.764 |
| 44110.67901620371 | 52.13 |
| 44110.72068287038 | 51.628 |
| 44110.76234953704 | 50.547 |
| 44110.80401620371 | 49.37 |
| 44110.84568287038 | 48.269 |
| 44110.88734953704 | 47.323 |
| 44110.92901620371 | 46.493 |
| 44110.97068287038 | 45.779 |
| 44111.01234953704 | 45.2 |
| 44111.05401620371 | 44.756 |
| 44111.09568287038 | 44.408 |
| 44111.13734953704 | 44.08 |
| 44111.17901620371 | 43.675 |
| 44111.22068287038 | 43.25 |
| 44111.26234953704 | 42.729 |
| 44111.30401620371 | 42.227 |
| 44111.34568287038 | 41.821 |
| 44111.38734953704 | 42.15 |
| 44111.42901620371 | 43.173 |
| 44111.47068287038 | 44.872 |
| 44111.51234953704 | 47.111 |
| 44111.55401620371 | 49.196 |
| 44111.59568287038 | 50.953 |
| 44111.63734953704 | 52.092 |
| 44111.67901620371 | 52.478 |
| 44111.72068287038 | 51.995 |
| 44111.76234953704 | 50.914 |
| 44111.80401620371 | 49.756 |
| 44111.84568287038 | 48.597 |
| 44111.88734953704 | 47.671 |
| 44111.92901620371 | 46.918 |
| 44111.97068287038 | 46.281 |
| 44112.01234953704 | 45.74 |
| 44112.05401620371 | 45.296 |
| 44112.09568287038 | 44.949 |
| 44112.13734953704 | 44.601 |
| 44112.17901620371 | 44.273 |
| 44112.22068287038 | 43.771 |
| 44112.26234953704 | 43.327 |
| 44112.30401620371 | 42.787 |
| 44112.34568287038 | 42.4 |
| 44112.38734953704 | 42.613 |
| 44112.42901620371 | 43.655 |
| 44112.47068287038 | 45.316 |
| 44112.51234953704 | 47.458 |
| 44112.55401620371 | 49.505 |
| 44112.59568287038 | 51.146 |
| 44112.63734953704 | 52.014 |
| 44112.67901620371 | 51.957 |
| 44112.72068287038 | 51.358 |
| 44112.76234953704 | 50.277 |
| 44112.80401620371 | 49.235 |
| 44112.84568287038 | 48.327 |
| 44112.88734953704 | 47.401 |
| 44112.92901620371 | 46.686 |
| 44112.97068287038 | 46.068 |
| 44113.01234953704 | 45.451 |
| 44113.05401620371 | 45.007 |
| 44113.09568287038 | 44.601 |
| 44113.13734953704 | 44.234 |
| 44113.17901620371 | 43.848 |
| 44113.22068287038 | 43.578 |
| 44113.26234953704 | 43.192 |
| 44113.30401620371 | 42.787 |
| 44113.34568287038 | 42.42 |
| 44113.38734953704 | 42.671 |
| 44113.42901620371 | 43.926 |
| 44113.47068287038 | 45.779 |
| 44113.51234953704 | 48.211 |
| 44113.55401620371 | 50.528 |
| 44113.59568287038 | 51.513 |
| 44113.63734953704 | 52.188 |
| 44113.67901620371 | 52.208 |
| 44113.72068287038 | 51.628 |
| 44113.76234953704 | 50.818 |
| 44113.80401620371 | 49.949 |
| 44113.84568287038 | 48.964 |
| 44113.88734953704 | 48.173 |
| 44113.92901620371 | 47.574 |
| 44113.97068287038 | 46.976 |
| 44114.01234953704 | 46.493 |
| 44114.05401620371 | 46.204 |
| 44114.09568287038 | 45.875 |
| 44114.13734953704 | 45.605 |
| 44114.17901620371 | 45.335 |
| 44114.22068287038 | 45.123 |
| 44114.26234953704 | 44.775 |
| 44114.30401620371 | 44.292 |
| 44114.34568287038 | 44.003 |
| 44114.38734953704 | 44.292 |
| 44114.42901620371 | 45.451 |
| 44114.47068287038 | 47.246 |
| 44114.51234953704 | 49.428 |
| 44114.55401620371 | 51.358 |
| 44114.59568287038 | 52.806 |
| 44114.63734953704 | 54.273 |
| 44114.67901620371 | 54.35 |
| 44114.72068287038 | 53.597 |
| 44114.76234953704 | 52.478 |
| 44114.80401620371 | 51.609 |
| 44114.84568287038 | 50.74 |
| 44114.88734953704 | 49.736 |
| 44114.92901620371 | 48.848 |
| 44114.97068287038 | 48.482 |
| 44115.01234953704 | 48.076 |
| 44115.05401620371 | 47.594 |
| 44115.09568287038 | 47.15 |
| 44115.13734953704 | 46.667 |
| 44115.17901620371 | 46.358 |
| 44115.22068287038 | 46.165 |
| 44115.26234953704 | 45.972 |
| 44115.30401620371 | 45.624 |
| 44115.34568287038 | 45.451 |
| 44115.38734953704 | 45.663 |
| 44115.42901620371 | 46.126 |
| 44115.47068287038 | 46.165 |
| 44115.51234953704 | 46.165 |
| 44115.55401620371 | 45.586 |
| 44115.59568287038 | 44.273 |
| 44115.63734953704 | 42.96 |
| 44115.67901620371 | 42.825 |
| 44115.72068287038 | 42.999 |
| 44115.76234953704 | 42.96 |
| 44115.80401620371 | 42.536 |
| 44115.84568287038 | 41.628 |
| 44115.88734953704 | 40.837 |
| 44115.92901620371 | 40.2 |
| 44115.97068287038 | 39.814 |
| 44116.01234953704 | 39.408 |
| 44116.05401620371 | 38.926 |
| 44116.09568287038 | 38.462 |
| 44116.13734953704 | 37.922 |
| 44116.17901620371 | 37.42 |
| 44116.22068287038 | 36.937 |
| 44116.26234953704 | 36.532 |
| 44116.30401620371 | 36.165 |
| 44116.34568287038 | 35.837 |
| 44116.38734953704 | 36.126 |
| 44116.42901620371 | 37.246 |
| 44116.47068287038 | 39.157 |
| 44116.51234953704 | 41.706 |
| 44116.55401620371 | 44.234 |
| 44116.59568287038 | 46.165 |
| 44116.63734953704 | 47.343 |
| 44116.67901620371 | 47.613 |
| 44116.72068287038 | 46.976 |
| 44116.76234953704 | 45.972 |
| 44116.80401620371 | 44.949 |
| 44116.84568287038 | 44.119 |
| 44116.88734953704 | 43.269 |
| 44116.92901620371 | 42.594 |
| 44116.97068287038 | 42.169 |
| 44117.01234953704 | 41.879 |
| 44117.05401620371 | 41.609 |
| 44117.09568287038 | 41.242 |
| 44117.13734953704 | 40.953 |
| 44117.17901620371 | 40.644 |
| 44117.22068287038 | 40.354 |
| 44117.26234953704 | 40.007 |
| 44117.30401620371 | 39.621 |
| 44117.34568287038 | 39.408 |
| 44117.38734953704 | 39.717 |
| 44117.42901620371 | 40.837 |
| 44117.47068287038 | 42.806 |
| 44117.51234953704 | 45.258 |
| 44117.55401620371 | 47.555 |
| 44117.59568287038 | 49.119 |
| 44117.63734953704 | 50.142 |
| 44117.67901620371 | 50.354 |
| 44117.72068287038 | 49.524 |
| 44117.76234953704 | 48.25 |
| 44117.80401620371 | 47.246 |
| 44117.84568287038 | 46.281 |
| 44117.88734953704 | 45.412 |
| 44117.92901620371 | 44.717 |
| 44117.97068287038 | 44.254 |
| 44118.01234953704 | 43.868 |
| 44118.05401620371 | 43.617 |
| 44118.09568287038 | 43.52 |
| 44118.13734953704 | 43.54 |
| 44118.17901620371 | 43.482 |
| 44118.22068287038 | 43.404 |
| 44118.26234953704 | 43.173 |
| 44118.30401620371 | 42.922 |
| 44118.34568287038 | 42.651 |
| 44118.38734953704 | 43.018 |
| 44118.42901620371 | 44.041 |
| 44118.47068287038 | 45.682 |
| 44118.51234953704 | 47.922 |
| 44118.55401620371 | 49.987 |
| 44118.59568287038 | 51.609 |
| 44118.63734953704 | 52.42 |
| 44118.67901620371 | 52.285 |
| 44118.72068287038 | 51.397 |
| 44118.76234953704 | 50.296 |
| 44118.80401620371 | 49.235 |
| 44118.84568287038 | 48.385 |
| 44118.88734953704 | 47.516 |
| 44118.92901620371 | 46.57 |
| 44118.97068287038 | 45.856 |
| 44119.01234953704 | 45.084 |
| 44119.05401620371 | 44.485 |
| 44119.09568287038 | 44.331 |
| 44119.13734953704 | 44.119 |
| 44119.17901620371 | 43.675 |
| 44119.22068287038 | 43.211 |
| 44119.26234953704 | 42.594 |
| 44119.30401620371 | 41.821 |
| 44119.34568287038 | 41.146 |
| 44119.38734953704 | 41.049 |
| 44119.42901620371 | 41.706 |
| 44119.47068287038 | 42.999 |
| 44119.51234953704 | 44.91 |
| 44119.55401620371 | 46.783 |
| 44119.59568287038 | 48.115 |
| 44119.63734953704 | 48.52 |
| 44119.67901620371 | 48.038 |
| 44119.72068287038 | 46.725 |
| 44119.76234953704 | 45.258 |
| 44119.80401620371 | 44.08 |
| 44119.84568287038 | 42.98 |
| 44119.88734953704 | 42.014 |
| 44119.92901620371 | 41.165 |
| 44119.97068287038 | 40.393 |
| 44120.01234953704 | 39.659 |
| 44120.05401620371 | 39.003 |
| 44120.09568287038 | 38.482 |
| 44120.13734953704 | 38.076 |
| 44120.17901620371 | 37.767 |
| 44120.22068287038 | 37.362 |
| 44120.26234953704 | 36.956 |
| 44120.30401620371 | 36.551 |
| 44120.34568287038 | 36.261 |
| 44120.38734953704 | 36.686 |
| 44120.42901620371 | 37.69 |
| 44120.47068287038 | 39.428 |
| 44120.51234953704 | 41.686 |
| 44120.55401620371 | 43.636 |
| 44120.59568287038 | 45.2 |
| 44120.63734953704 | 46.262 |
| 44120.67901620371 | 46.686 |
| 44120.72068287038 | 46.165 |
| 44120.76234953704 | 45.142 |
| 44120.80401620371 | 44.196 |
| 44120.84568287038 | 43.404 |
| 44120.88734953704 | 42.536 |
| 44120.92901620371 | 41.821 |
| 44120.97068287038 | 41.319 |
| 44121.01234953704 | 40.895 |
| 44121.05401620371 | 40.644 |
| 44121.09568287038 | 40.431 |
| 44121.13734953704 | 40.296 |
| 44121.17901620371 | 40.122 |
| 44121.22068287038 | 39.968 |
| 44121.26234953704 | 39.794 |
| 44121.30401620371 | 39.678 |
| 44121.34568287038 | 39.794 |
| 44121.38734953704 | 40.2 |
| 44121.42901620371 | 41.261 |
| 44121.47068287038 | 41.59 |
| 44121.51234953704 | 42.072 |
| 44121.55401620371 | 42.787 |
| 44121.59568287038 | 44.08 |
| 44121.63734953704 | 45.2 |
| 44121.67901620371 | 45.74 |
| 44121.72068287038 | 45.818 |
| 44121.76234953704 | 45.258 |
| 44121.80401620371 | 44.621 |
| 44121.84568287038 | 44.254 |
| 44121.88734953704 | 43.868 |
| 44121.92901620371 | 43.501 |
| 44121.97068287038 | 43.076 |
| 44122.01234953704 | 42.671 |
| 44122.05401620371 | 42.285 |
| 44122.09568287038 | 42.111 |
| 44122.13734953704 | 41.899 |
| 44122.17901620371 | 41.783 |
| 44122.22068287038 | 41.648 |
| 44122.26234953704 | 41.532 |
| 44122.30401620371 | 41.397 |
| 44122.34568287038 | 41.223 |
| 44122.38734953704 | 41.59 |
| 44122.42901620371 | 42.825 |
| 44122.47068287038 | 44.35 |
| 44122.51234953704 | 44.872 |
| 44122.55401620371 | 47.188 |
| 44122.59568287038 | 49.621 |
| 44122.63734953704 | 51.03 |
| 44122.67901620371 | 51.126 |
| 44122.72068287038 | 50.219 |
| 44122.76234953704 | 49.389 |
| 44122.80401620371 | 48.733 |
| 44122.84568287038 | 47.941 |
| 44122.88734953704 | 47.285 |
| 44122.92901620371 | 46.397 |
| 44122.97068287038 | 45.567 |
| 44123.01234953704 | 45.007 |
| 44123.05401620371 | 44.524 |
| 44123.09568287038 | 44.177 |
| 44123.13734953704 | 43.848 |
| 44123.17901620371 | 43.404 |
| 44123.22068287038 | 43.231 |
| 44123.26234953704 | 42.941 |
| 44123.30401620371 | 42.574 |
| 44123.34568287038 | 42.188 |
| 44123.38734953704 | 42.42 |
| 44123.42901620371 | 43.308 |
| 44123.47068287038 | 44.929 |
| 44123.51234953704 | 46.918 |
| 44123.55401620371 | 48.134 |
| 44123.59568287038 | 48.192 |
| 44123.63734953704 | 48.675 |
| 44123.67901620371 | 49.119 |
| 44123.72068287038 | 48.578 |
| 44123.76234953704 | 47.845 |
| 44123.80401620371 | 46.879 |
| 44123.84568287038 | 46.204 |
| 44123.88734953704 | 45.74 |
| 44123.92901620371 | 45.238 |
| 44123.97068287038 | 44.736 |
| 44124.01234953704 | 44.331 |
| 44124.05401620371 | 43.984 |
| 44124.09568287038 | 43.675 |
| 44124.13734953704 | 43.482 |
| 44124.17901620371 | 43.192 |
| 44124.22068287038 | 42.96 |
| 44124.26234953704 | 42.613 |
| 44124.30401620371 | 42.15 |
| 44124.34568287038 | 41.763 |
| 44124.38734953704 | 41.744 |
| 44124.42901620371 | 42.613 |
| 44124.47068287038 | 44.119 |
| 44124.51234953704 | 46.068 |
| 44124.55401620371 | 47.883 |
| 44124.59568287038 | 49.177 |
| 44124.63734953704 | 49.833 |
| 44124.67901620371 | 49.949 |
| 44124.72068287038 | 49.292 |
| 44124.76234953704 | 48.327 |
| 44124.80401620371 | 47.458 |
| 44124.84568287038 | 46.706 |
| 44124.88734953704 | 45.875 |
| 44124.92901620371 | 45.084 |
| 44124.97068287038 | 44.37 |
| 44125.01234953704 | 43.694 |
| 44125.05401620371 | 43.134 |
| 44125.09568287038 | 42.709 |
| 44125.13734953704 | 42.265 |
| 44125.17901620371 | 41.918 |
| 44125.22068287038 | 41.532 |
| 44125.26234953704 | 41.146 |
| 44125.30401620371 | 40.76 |
| 44125.34568287038 | 40.431 |
| 44125.38734953704 | 40.489 |
| 44125.42901620371 | 41.609 |
| 44125.47068287038 | 43.25 |
| 44125.51234953704 | 45.142 |
| 44125.55401620371 | 47.169 |
| 44125.59568287038 | 48.771 |
| 44125.63734953704 | 49.872 |
| 44125.67901620371 | 49.91 |
| 44125.72068287038 | 49.119 |
| 44125.76234953704 | 48.057 |
| 44125.80401620371 | 47.207 |
| 44125.84568287038 | 46.262 |
| 44125.88734953704 | 45.2 |
| 44125.92901620371 | 44.35 |
| 44125.97068287038 | 43.578 |
| 44126.01234953704 | 42.941 |
| 44126.05401620371 | 42.458 |
| 44126.09568287038 | 42.092 |
| 44126.13734953704 | 41.802 |
| 44126.17901620371 | 41.532 |
| 44126.22068287038 | 41.281 |
| 44126.26234953704 | 41.088 |
| 44126.30401620371 | 40.779 |
| 44126.34568287038 | 40.605 |
| 44126.38734953704 | 40.779 |
| 44126.42901620371 | 41.783 |
| 44126.47068287038 | 43.404 |
| 44126.51234953704 | 45.489 |
| 44126.55401620371 | 47.555 |
| 44126.59568287038 | 49.022 |
| 44126.63734953704 | 49.794 |
| 44126.67901620371 | 49.756 |
| 44126.72068287038 | 48.906 |
| 44126.76234953704 | 47.671 |
| 44126.80401620371 | 46.706 |
| 44126.84568287038 | 45.663 |
| 44126.88734953704 | 44.466 |
| 44126.92901620371 | 43.694 |
| 44126.97068287038 | 43.269 |
| 44127.01234953704 | 42.787 |
| 44127.05401620371 | 42.169 |
| 44127.09568287038 | 41.609 |
| 44127.13734953704 | 41.068 |
| 44127.17901620371 | 40.567 |
| 44127.22068287038 | 40.045 |
| 44127.26234953704 | 39.428 |
| 44127.30401620371 | 38.829 |
| 44127.34568287038 | 38.366 |
| 44127.38734953704 | 38.501 |
| 44127.42901620371 | 39.234 |
| 44127.47068287038 | 40.161 |
| 44127.51234953704 | 41.068 |
| 44127.55401620371 | 42.4 |
| 44127.59568287038 | 43.713 |
| 44127.63734953704 | 44.736 |
| 44127.67901620371 | 44.794 |
| 44127.72068287038 | 44.35 |
| 44127.76234953704 | 43.694 |
| 44127.80401620371 | 43.115 |
| 44127.84568287038 | 42.651 |
| 44127.88734953704 | 42.285 |
| 44127.92901620371 | 42.014 |
| 44127.97068287038 | 41.783 |
| 44128.01234953704 | 41.628 |
| 44128.05401620371 | 41.455 |
| 44128.09568287038 | 41.165 |
| 44128.13734953704 | 40.953 |
| 44128.17901620371 | 40.779 |
| 44128.22068287038 | 40.644 |
| 44128.26234953704 | 40.547 |
| 44128.30401620371 | 40.335 |
| 44128.34568287038 | 40.122 |
| 44128.38734953704 | 40.296 |
| 44128.42901620371 | 40.528 |
| 44128.47068287038 | 41.59 |
| 44128.51234953704 | 43.713 |
| 44128.55401620371 | 46.011 |
| 44128.59568287038 | 46.551 |
| 44128.63734953704 | 46.3 |
| 44128.67901620371 | 45.837 |
| 44128.72068287038 | 45.528 |
| 44128.76234953704 | 45.335 |
| 44128.80401620371 | 45.296 |
| 44128.84568287038 | 45.123 |
| 44128.88734953704 | 44.872 |
| 44128.92901620371 | 44.466 |
| 44128.97068287038 | 44.138 |
| 44129.01234953704 | 43.829 |
| 44129.05401620371 | 43.733 |
| 44129.09568287038 | 43.675 |
| 44129.13734953704 | 43.636 |
| 44129.17901620371 | 43.424 |
| 44129.22068287038 | 43.115 |
| 44129.26234953704 | 42.845 |
| 44129.30401620371 | 42.613 |
| 44129.34568287038 | 42.458 |
| 44129.38734953704 | 42.729 |
| 44129.42901620371 | 43.134 |
| 44129.47068287038 | 43.269 |
| 44129.51234953704 | 43.095 |
| 44129.55401620371 | 42.458 |
| 44129.59568287038 | 40.933 |
| 44129.63734953704 | 38.713 |
| 44129.67901620371 | 37.034 |
| 44129.72068287038 | 35.74 |
| 44129.76234953704 | 34.621 |
| 44129.80401620371 | 33.617 |
| 44129.84568287038 | 33.095 |
| 44129.88734953704 | 32.96 |
| 44129.92901620371 | 32.536 |
| 44129.97068287038 | 32.323 |
| 44130.01234953704 | 32.034 |
| 44130.05401620371 | 31.956 |
| 44130.09568287038 | 31.956 |
| 44130.13734953704 | 31.937 |
| 44130.17901620371 | 31.976 |
| 44130.22068287038 | 31.976 |
| 44130.26234953704 | 31.976 |
| 44130.30401620371 | 31.937 |
| 44130.34568287038 | 31.956 |
| 44130.38734953704 | 31.995 |
| 44130.42901620371 | 32.014 |
| 44130.47068287038 | 31.995 |
| 44130.51234953704 | 32.034 |
| 44130.55401620371 | 32.516 |
| 44130.59568287038 | 33.694 |
| 44130.63734953704 | 34.485 |
| 44130.67901620371 | 34.215 |
| 44130.72068287038 | 33.945 |
| 44130.76234953704 | 33.482 |
| 44130.80401620371 | 32.98 |
| 44130.84568287038 | 32.304 |
| 44130.88734953704 | 31.918 |
| 44130.92901620371 | 31.995 |
| 44130.97068287038 | 31.956 |
| 44131.01234953704 | 31.956 |
| 44131.05401620371 | 31.956 |
| 44131.09568287038 | 31.976 |
| 44131.13734953704 | 31.995 |
| 44131.17901620371 | 31.956 |
| 44131.22068287038 | 31.956 |
| 44131.26234953704 | 31.976 |
| 44131.30401620371 | 31.976 |
| 44131.34568287038 | 31.976 |
| 44131.38734953704 | 31.976 |
| 44131.42901620371 | 31.937 |
| 44131.47068287038 | 32.034 |
| 44131.51234953704 | 32.034 |
| 44131.55401620371 | 32.362 |
| 44131.59568287038 | 32.902 |
| 44131.63734953704 | 33.231 |
| 44131.67901620371 | 33.134 |
| 44131.72068287038 | 32.555 |
| 44131.76234953704 | 31.995 |
| 44131.80401620371 | 31.956 |
| 44131.84568287038 | 31.976 |
| 44131.88734953704 | 31.976 |
| 44131.92901620371 | 31.956 |
| 44131.97068287038 | 31.918 |
| 44132.01234953704 | 31.956 |
| 44132.05401620371 | 31.956 |
| 44132.09568287038 | 31.976 |
| 44132.13734953704 | 31.976 |
| 44132.17901620371 | 31.956 |
| 44132.22068287038 | 31.976 |
| 44132.26234953704 | 31.937 |
| 44132.30401620371 | 31.976 |
| 44132.34568287038 | 31.956 |
| 44132.38734953704 | 31.956 |
| 44132.42901620371 | 32.014 |
| 44132.47068287038 | 32.072 |
| 44132.51234953704 | 32.053 |
| 44132.55401620371 | 32.092 |
| 44132.59568287038 | 32.169 |
| 44132.63734953704 | 33.385 |
| 44132.67901620371 | 34.022 |
| 44132.72068287038 | 34.022 |
| 44132.76234953704 | 33.713 |
| 44132.80401620371 | 33.52 |
| 44132.84568287038 | 33.308 |
| 44132.88734953704 | 32.999 |
| 44132.92901620371 | 32.671 |
| 44132.97068287038 | 32.362 |
| 44133.01234953704 | 32.304 |
| 44133.05401620371 | 32.188 |
| 44133.09568287038 | 32.169 |
| 44133.13734953704 | 32.149 |
| 44133.17901620371 | 32.149 |
| 44133.22068287038 | 32.13 |
| 44133.26234953704 | 31.995 |
| 44133.30401620371 | 31.918 |
| 44133.34568287038 | 31.918 |
| 44133.38734953704 | 31.956 |
| 44133.42901620371 | 32.709 |
| 44133.47068287038 | 33.983 |
| 44133.51234953704 | 36.049 |
| 44133.55401620371 | 37.999 |
| 44133.59568287038 | 39.447 |
| 44133.63734953704 | 40.277 |
| 44133.67901620371 | 40.335 |
| 44133.72068287038 | 39.601 |
| 44133.76234953704 | 38.868 |
| 44133.80401620371 | 38.134 |
| 44133.84568287038 | 37.343 |
| 44133.88734953704 | 36.705 |
| 44133.92901620371 | 36.223 |
| 44133.97068287038 | 35.76 |
| 44134.01234953704 | 35.451 |
| 44134.05401620371 | 35.238 |
| 44134.09568287038 | 35.026 |
| 44134.13734953704 | 34.91 |
| 44134.17901620371 | 34.678 |
| 44134.22068287038 | 34.524 |
| 44134.26234953704 | 34.196 |
| 44134.30401620371 | 33.868 |
| 44134.34568287038 | 33.675 |
| 44134.38734953704 | 33.868 |
| 44134.42901620371 | 34.601 |
| 44134.47068287038 | 36.049 |
| 44134.51234953704 | 37.999 |
| 44134.55401620371 | 39.794 |
| 44134.59568287038 | 41.184 |
| 44134.63734953704 | 42.014 |
| 44134.67901620371 | 42.092 |
| 44134.72068287038 | 41.3 |
| 44134.76234953704 | 40.431 |
| 44134.80401620371 | 39.659 |
| 44134.84568287038 | 38.848 |
| 44134.88734953704 | 38.018 |
| 44134.92901620371 | 37.381 |
| 44134.97068287038 | 36.918 |
| 44135.01234953704 | 36.57 |
| 44135.05401620371 | 36.242 |
| 44135.09568287038 | 36.088 |
| 44135.13734953704 | 35.933 |
| 44135.17901620371 | 35.76 |
| 44135.22068287038 | 35.509 |
| 44135.26234953704 | 35.2 |
| 44135.30401620371 | 34.852 |
| 44135.34568287038 | 34.563 |
| 44135.38734953704 | 34.833 |
| 44135.42901620371 | 35.817 |
| 44135.47068287038 | 37.458 |
| 44135.51234953704 | 39.524 |
| 44135.55401620371 | 41.377 |
| 44135.59568287038 | 42.458 |
| 44135.63734953704 | 43.269 |
| 44135.67901620371 | 43.192 |
| 44135.72068287038 | 42.458 |
| 44135.76234953704 | 41.512 |
| 44135.80401620371 | 40.779 |
| 44135.84568287038 | 39.929 |
| 44135.88734953704 | 39.08 |
| 44135.92901620371 | 38.327 |
| 44135.97068287038 | 37.767 |
| 44136.01234953704 | 37.304 |
| 44136.05401620371 | 36.995 |
| 44136.05401620371 | 36.744 |
| 44136.09568287038 | 36.455 |
| 44136.13734953704 | 36.126 |
| 44136.17901620371 | 35.837 |
| 44136.22068287038 | 35.489 |
| 44136.26234953704 | 35.065 |
| 44136.30401620371 | 34.814 |
| 44136.34568287038 | 34.968 |
| 44136.38734953704 | 35.76 |
| 44136.42901620371 | 37.169 |
| 44136.47068287038 | 39.138 |
| 44136.51234953704 | 40.991 |
| 44136.55401620371 | 42.439 |
| 44136.59568287038 | 43.269 |
| 44136.63734953704 | 43.346 |
| 44136.67901620371 | 42.613 |
| 44136.72068287038 | 41.763 |
| 44136.76234953704 | 40.895 |
| 44136.80401620371 | 39.968 |
| 44136.84568287038 | 39.041 |
| 44136.88734953704 | 38.385 |
| 44136.92901620371 | 37.883 |
| 44136.97068287038 | 37.555 |
| 44137.01234953704 | 37.323 |
| 44137.05401620371 | 37.111 |
| 44137.09568287038 | 36.918 |
| 44137.13734953704 | 36.628 |
| 44137.17901620371 | 36.3 |
| 44137.22068287038 | 35.991 |
| 44137.26234953704 | 35.682 |
| 44137.30401620371 | 35.335 |
| 44137.34568287038 | 35.528 |
| 44137.38734953704 | 36.3 |
| 44137.42901620371 | 37.651 |
| 44137.47068287038 | 39.563 |
| 44137.51234953704 | 41.455 |
| 44137.55401620371 | 42.922 |
| 44137.59568287038 | 43.829 |
| 44137.63734953704 | 43.829 |
| 44137.67901620371 | 43.076 |
| 44137.72068287038 | 42.15 |
| 44137.76234953704 | 41.204 |
| 44137.80401620371 | 40.277 |
| 44137.84568287038 | 39.447 |
| 44137.88734953704 | 38.771 |
| 44137.92901620371 | 38.288 |
| 44137.97068287038 | 37.999 |
| 44138.01234953704 | 37.767 |
| 44138.05401620371 | 37.555 |
| 44138.09568287038 | 37.362 |
| 44138.13734953704 | 37.149 |
| 44138.17901620371 | 36.918 |
| 44138.22068287038 | 36.57 |
| 44138.26234953704 | 36.281 |
| 44138.30401620371 | 35.953 |
| 44138.34568287038 | 36.184 |
| 44138.38734953704 | 36.995 |
| 44138.42901620371 | 38.346 |
| 44138.47068287038 | 39.621 |
| 44138.51234953704 | 41.261 |
| 44138.55401620371 | 42.555 |
| 44138.59568287038 | 42.845 |
| 44138.63734953704 | 42.767 |
| 44138.67901620371 | 42.69 |
| 44138.72068287038 | 42.207 |
| 44138.76234953704 | 41.532 |
| 44138.80401620371 | 40.624 |
| 44138.84568287038 | 39.794 |
| 44138.88734953704 | 39.254 |
| 44138.92901620371 | 38.964 |
| 44138.97068287038 | 38.694 |
| 44139.01234953704 | 38.501 |
| 44139.05401620371 | 38.211 |
| 44139.09568287038 | 37.941 |
| 44139.13734953704 | 37.767 |
| 44139.17901620371 | 37.497 |
| 44139.22068287038 | 37.207 |
| 44139.26234953704 | 36.937 |
| 44139.30401620371 | 36.648 |
| 44139.34568287038 | 36.648 |
| 44139.38734953704 | 37.362 |
| 44139.42901620371 | 38.733 |
| 44139.47068287038 | 40.509 |
| 44139.51234953704 | 42.478 |
| 44139.55401620371 | 43.926 |
| 44139.59568287038 | 44.64 |
| 44139.63734953704 | 44.717 |
| 44139.67901620371 | 44.138 |
| 44139.72068287038 | 43.346 |
| 44139.76234953704 | 42.613 |
| 44139.80401620371 | 41.763 |
| 44139.84568287038 | 40.875 |
| 44139.88734953704 | 40.18 |
| 44139.92901620371 | 39.678 |
| 44139.97068287038 | 39.389 |
| 44140.01234953704 | 39.177 |
| 44140.05401620371 | 38.926 |
| 44140.09568287038 | 38.636 |
| 44140.13734953704 | 38.366 |
| 44140.17901620371 | 38.115 |
| 44140.22068287038 | 37.787 |
| 44140.26234953704 | 37.497 |
| 44140.30401620371 | 37.207 |
| 44140.34568287038 | 37.304 |
| 44140.38734953704 | 38.134 |
| 44140.42901620371 | 39.505 |
| 44140.47068287038 | 41.339 |
| 44140.51234953704 | 43.153 |
| 44140.55401620371 | 44.466 |
| 44140.59568287038 | 45.258 |
| 44140.63734953704 | 45.296 |
| 44140.67901620371 | 44.543 |
| 44140.72068287038 | 43.655 |
| 44140.76234953704 | 42.825 |
| 44140.80401620371 | 41.802 |
| 44140.84568287038 | 40.895 |
| 44140.88734953704 | 40.18 |
| 44140.92901620371 | 39.678 |
| 44140.97068287038 | 39.408 |
| 44141.01234953704 | 39.099 |
| 44141.05401620371 | 38.829 |
| 44141.09568287038 | 38.52 |
| 44141.13734953704 | 38.269 |
| 44141.17901620371 | 37.941 |
| 44141.22068287038 | 37.632 |
| 44141.26234953704 | 37.246 |
| 44141.30401620371 | 36.995 |
| 44141.34568287038 | 37.111 |
| 44141.38734953704 | 37.902 |
| 44141.42901620371 | 39.099 |
| 44141.47068287038 | 40.624 |
| 44141.51234953704 | 41.455 |
| 44141.55401620371 | 41.628 |
| 44141.59568287038 | 42.092 |
| 44141.63734953704 | 42.13 |
| 44141.67901620371 | 42.15 |
| 44141.72068287038 | 41.686 |
| 44141.76234953704 | 41.184 |
| 44141.80401620371 | 40.605 |
| 44141.84568287038 | 40.103 |
| 44141.88734953704 | 39.678 |
| 44141.92901620371 | 39.37 |
| 44141.97068287038 | 39.022 |
| 44142.01234953704 | 38.829 |
| 44142.05401620371 | 38.733 |
| 44142.09568287038 | 38.597 |
| 44142.13734953704 | 38.482 |
| 44142.17901620371 | 38.25 |
| 44142.22068287038 | 37.999 |
| 44142.26234953704 | 37.787 |
| 44142.30401620371 | 37.613 |
| 44142.34568287038 | 37.883 |
| 44142.38734953704 | 38.675 |
| 44142.42901620371 | 39.968 |
| 44142.47068287038 | 41.03 |
| 44142.51234953704 | 42.265 |
| 44142.55401620371 | 43.829 |
| 44142.59568287038 | 44.698 |
| 44142.63734953704 | 43.926 |
| 44142.67901620371 | 43.404 |
| 44142.72068287038 | 43.057 |
| 44142.76234953704 | 42.709 |
| 44142.80401620371 | 42.246 |
| 44142.84568287038 | 41.918 |
| 44142.88734953704 | 41.57 |
| 44142.92901620371 | 41.455 |
| 44142.97068287038 | 41.474 |
| 44143.01234953704 | 41.416 |
| 44143.05401620371 | 41.377 |
| 44143.09568287038 | 41.068 |
| 44143.13734953704 | 40.489 |
| 44143.17901620371 | 39.949 |
| 44143.22068287038 | 39.408 |
| 44143.26234953704 | 38.848 |
| 44143.30401620371 | 38.617 |
| 44143.34568287038 | 38.366 |
| 44143.38734953704 | 38.79 |
| 44143.42901620371 | 39.543 |
| 44143.47068287038 | 40.856 |
| 44143.51234953704 | 42.13 |
| 44143.55401620371 | 43.057 |
| 44143.59568287038 | 43.134 |
| 44143.63734953704 | 42.323 |
| 44143.67901620371 | 41.512 |
| 44143.72068287038 | 40.933 |
| 44143.76234953704 | 40.354 |
| 44143.80401620371 | 39.64 |
| 44143.84568287038 | 38.964 |
| 44143.88734953704 | 38.636 |
| 44143.92901620371 | 38.443 |
| 44143.97068287038 | 38.327 |
| 44144.01234953704 | 38.269 |
| 44144.05401620371 | 38.231 |
| 44144.09568287038 | 37.922 |
| 44144.13734953704 | 37.787 |
| 44144.17901620371 | 37.555 |
| 44144.22068287038 | 36.995 |
| 44144.26234953704 | 36.628 |
| 44144.30401620371 | 36.3 |
| 44144.34568287038 | 36.242 |
| 44144.38734953704 | 36.184 |
| 44144.42901620371 | 36.705 |
| 44144.47068287038 | 37.304 |
| 44144.51234953704 | 37.555 |
| 44144.55401620371 | 36.956 |
| 44144.59568287038 | 36.995 |
| 44144.63734953704 | 36.995 |
| 44144.67901620371 | 36.648 |
| 44144.72068287038 | 36.3 |
| 44144.76234953704 | 35.798 |
| 44144.80401620371 | 35.354 |
| 44144.84568287038 | 34.91 |
| 44144.88734953704 | 34.621 |
| 44144.92901620371 | 34.447 |
| 44144.97068287038 | 34.37 |
| 44145.01234953704 | 34.35 |
| 44145.05401620371 | 34.234 |
| 44145.09568287038 | 34.176 |
| 44145.13734953704 | 33.926 |
| 44145.17901620371 | 33.713 |
| 44145.22068287038 | 33.52 |
| 44145.26234953704 | 33.211 |
| 44145.30401620371 | 32.96 |
| 44145.34568287038 | 32.98 |
| 44145.38734953704 | 33.385 |
| 44145.42901620371 | 34.37 |
| 44145.47068287038 | 35.586 |
| 44145.51234953704 | 36.937 |
| 44145.55401620371 | 37.999 |
| 44145.59568287038 | 38.346 |
| 44145.63734953704 | 37.613 |
| 44145.67901620371 | 36.377 |
| 44145.72068287038 | 35.586 |
| 44145.76234953704 | 35.103 |
| 44145.80401620371 | 34.563 |
| 44145.84568287038 | 34.099 |
| 44145.88734953704 | 33.597 |
| 44145.92901620371 | 33.192 |
| 44145.97068287038 | 32.922 |
| 44146.01234953704 | 32.613 |
| 44146.05401620371 | 32.458 |
| 44146.09568287038 | 32.246 |
| 44146.13734953704 | 32.053 |
| 44146.17901620371 | 31.937 |
| 44146.22068287038 | 31.937 |
| 44146.26234953704 | 31.976 |
| 44146.30401620371 | 31.956 |
| 44146.34568287038 | 31.956 |
| 44146.38734953704 | 31.976 |
| 44146.42901620371 | 32.111 |
| 44146.47068287038 | 32.98 |
| 44146.51234953704 | 34.659 |
| 44146.55401620371 | 36.068 |
| 44146.59568287038 | 36.744 |
| 44146.63734953704 | 36.667 |
| 44146.67901620371 | 35.856 |
| 44146.72068287038 | 35.238 |
| 44146.76234953704 | 34.891 |
| 44146.80401620371 | 34.427 |
| 44146.84568287038 | 33.964 |
| 44146.88734953704 | 33.443 |
| 44146.92901620371 | 32.98 |
| 44146.97068287038 | 32.806 |
| 44147.01234953704 | 32.902 |
| 44147.05401620371 | 32.999 |
| 44147.09568287038 | 32.98 |
| 44147.13734953704 | 32.96 |
| 44147.17901620371 | 32.844 |
| 44147.22068287038 | 32.883 |
| 44147.26234953704 | 32.787 |
| 44147.30401620371 | 32.478 |
| 44147.34568287038 | 32.536 |
| 44147.38734953704 | 32.709 |
| 44147.42901620371 | 33.269 |
| 44147.47068287038 | 34.601 |
| 44147.51234953704 | 35.933 |
| 44147.55401620371 | 36.937 |
| 44147.59568287038 | 37.439 |
| 44147.63734953704 | 37.285 |
| 44147.67901620371 | 36.474 |
| 44147.72068287038 | 35.624 |
| 44147.76234953704 | 34.91 |
| 44147.80401620371 | 34.119 |
| 44147.84568287038 | 33.308 |
| 44147.88734953704 | 32.613 |
| 44147.92901620371 | 31.995 |
| 44147.97068287038 | 31.937 |
| 44148.01234953704 | 31.937 |
| 44148.05401620371 | 31.976 |
| 44148.09568287038 | 31.976 |
| 44148.13734953704 | 31.995 |
| 44148.17901620371 | 31.937 |
| 44148.22068287038 | 31.976 |
| 44148.26234953704 | 31.956 |
| 44148.30401620371 | 31.956 |
| 44148.34568287038 | 31.956 |
| 44148.38734953704 | 31.995 |
| 44148.42901620371 | 31.995 |
| 44148.47068287038 | 32.072 |
| 44148.51234953704 | 32.767 |
| 44148.55401620371 | 34.08 |
| 44148.59568287038 | 35.122 |
| 44148.63734953704 | 35.605 |
| 44148.67901620371 | 35.412 |
| 44148.72068287038 | 35.084 |
| 44148.76234953704 | 34.891 |
| 44148.80401620371 | 34.678 |
| 44148.84568287038 | 34.273 |
| 44148.88734953704 | 33.945 |
| 44148.92901620371 | 33.694 |
| 44148.97068287038 | 33.597 |
| 44149.01234953704 | 33.617 |
| 44149.05401620371 | 33.964 |
| 44149.09568287038 | 34.292 |
| 44149.13734953704 | 34.524 |
| 44149.17901620371 | 34.736 |
| 44149.22068287038 | 34.91 |
| 44149.26234953704 | 34.968 |
| 44149.30401620371 | 34.698 |
| 44149.34568287038 | 33.443 |
| 44149.38734953704 | 33.173 |
| 44149.42901620371 | 33.25 |
| 44149.47068287038 | 32.729 |
| 44149.51234953704 | 34.08 |
| 44149.55401620371 | 34.621 |
| 44149.59568287038 | 33.732 |
| 44149.63734953704 | 32.941 |
| 44149.67901620371 | 32.304 |
| 44149.72068287038 | 31.976 |
| 44149.76234953704 | 31.956 |
| 44149.80401620371 | 31.918 |
| 44149.84568287038 | 31.956 |
| 44149.88734953704 | 31.937 |
| 44149.92901620371 | 31.956 |
| 44149.97068287038 | 31.956 |
| 44150.01234953704 | 31.956 |
| 44150.05401620371 | 31.995 |
| 44150.09568287038 | 31.918 |
| 44150.13734953704 | 31.937 |
| 44150.17901620371 | 31.956 |
| 44150.22068287038 | 31.956 |
| 44150.26234953704 | 31.995 |
| 44150.30401620371 | 31.995 |
| 44150.34568287038 | 31.976 |
| 44150.38734953704 | 31.956 |
| 44150.42901620371 | 31.976 |
| 44150.47068287038 | 31.976 |
| 44150.51234953704 | 32.014 |
| 44150.55401620371 | 32.613 |
| 44150.59568287038 | 32.632 |
| 44150.63734953704 | 32.864 |
| 44150.67901620371 | 32.806 |
| 44150.72068287038 | 32.651 |
| 44150.76234953704 | 32.536 |
| 44150.80401620371 | 32.613 |
| 44150.84568287038 | 32.729 |
| 44150.88734953704 | 32.902 |
| 44150.92901620371 | 33.037 |
| 44150.97068287038 | 33.076 |
| 44151.01234953704 | 33.095 |
| 44151.05401620371 | 32.999 |
| 44151.09568287038 | 33.153 |
| 44151.13734953704 | 33.501 |
| 44151.17901620371 | 33.926 |
| 44151.22068287038 | 34.35 |
| 44151.26234953704 | 34.678 |
| 44151.30401620371 | 34.794 |
| 44151.34568287038 | 35.2 |
| 44151.38734953704 | 36.204 |
| 44151.42901620371 | 37.458 |
| 44151.47068287038 | 38.906 |
| 44151.51234953704 | 40.451 |
| 44151.55401620371 | 41.59 |
| 44151.59568287038 | 42.15 |
| 44151.63734953704 | 42.034 |
| 44151.67901620371 | 41.242 |
| 44151.72068287038 | 40.431 |
| 44151.76234953704 | 39.775 |
| 44151.80401620371 | 38.906 |
| 44151.84568287038 | 38.134 |
| 44151.88734953704 | 37.497 |
| 44151.92901620371 | 37.014 |
| 44151.97068287038 | 36.686 |
| 44152.01234953704 | 36.435 |
| 44152.05401620371 | 36.107 |
| 44152.09568287038 | 35.798 |
| 44152.13734953704 | 35.451 |
| 44152.17901620371 | 35.084 |
| 44152.22068287038 | 34.678 |
| 44152.26234953704 | 34.408 |
| 44152.30401620371 | 34.08 |
| 44152.34568287038 | 34.119 |
| 44152.38734953704 | 34.678 |
| 44152.42901620371 | 35.779 |
| 44152.47068287038 | 37.285 |
| 44152.51234953704 | 39.003 |
| 44152.55401620371 | 40.335 |
| 44152.59568287038 | 41.126 |
| 44152.63734953704 | 41.03 |
| 44152.67901620371 | 40.393 |
| 44152.72068287038 | 39.64 |
| 44152.76234953704 | 38.848 |
| 44152.80401620371 | 38.115 |
| 44152.84568287038 | 37.362 |
| 44152.88734953704 | 36.841 |
| 44152.92901620371 | 36.358 |
| 44152.97068287038 | 36.126 |
| 44153.01234953704 | 35.953 |
| 44153.05401620371 | 35.914 |
| 44153.09568287038 | 35.914 |
| 44153.13734953704 | 35.933 |
| 44153.17901620371 | 35.837 |
| 44153.22068287038 | 35.702 |
| 44153.26234953704 | 35.547 |
| 44153.30401620371 | 35.393 |
| 44153.34568287038 | 35.682 |
| 44153.38734953704 | 36.435 |
| 44153.42901620371 | 37.613 |
| 44153.47068287038 | 38.906 |
| 44153.51234953704 | 40.412 |
| 44153.55401620371 | 41.821 |
| 44153.59568287038 | 42.497 |
| 44153.63734953704 | 42.188 |
| 44153.67901620371 | 41.725 |
| 44153.72068287038 | 41.242 |
| 44153.76234953704 | 40.76 |
| 44153.80401620371 | 40.238 |
| 44153.84568287038 | 39.621 |
| 44153.88734953704 | 39.119 |
| 44153.92901620371 | 38.829 |
| 44153.97068287038 | 38.694 |
| 44154.01234953704 | 38.636 |
| 44154.05401620371 | 38.52 |
| 44154.09568287038 | 38.501 |
| 44154.13734953704 | 38.462 |
| 44154.17901620371 | 38.404 |
| 44154.22068287038 | 38.404 |
| 44154.26234953704 | 38.269 |
| 44154.30401620371 | 38.173 |
| 44154.34568287038 | 38.288 |
| 44154.38734953704 | 39.138 |
| 44154.42901620371 | 40.219 |
| 44154.47068287038 | 41.686 |
| 44154.51234953704 | 43.269 |
| 44154.55401620371 | 44.196 |
| 44154.59568287038 | 44.736 |
| 44154.63734953704 | 44.37 |
| 44154.67901620371 | 43.25 |
| 44154.72068287038 | 42.343 |
| 44154.76234953704 | 41.474 |
| 44154.80401620371 | 40.567 |
| 44154.84568287038 | 39.736 |
| 44154.88734953704 | 39.08 |
| 44154.92901620371 | 38.462 |
| 44154.97068287038 | 37.999 |
| 44155.01234953704 | 37.613 |
| 44155.05401620371 | 37.246 |
| 44155.09568287038 | 37.092 |
| 44155.13734953704 | 36.956 |
| 44155.17901620371 | 36.783 |
| 44155.22068287038 | 36.609 |
| 44155.26234953704 | 36.512 |
| 44155.30401620371 | 36.242 |
| 44155.34568287038 | 36.242 |
| 44155.38734953704 | 36.725 |
| 44155.42901620371 | 37.825 |
| 44155.47068287038 | 39.003 |
| 44155.51234953704 | 40.296 |
| 44155.55401620371 | 40.914 |
| 44155.59568287038 | 40.895 |
| 44155.63734953704 | 40.779 |
| 44155.67901620371 | 40.509 |
| 44155.72068287038 | 40.084 |
| 44155.76234953704 | 39.563 |
| 44155.80401620371 | 39.003 |
| 44155.84568287038 | 38.462 |
| 44155.88734953704 | 37.98 |
| 44155.92901620371 | 37.594 |
| 44155.97068287038 | 37.246 |
| 44156.01234953704 | 37.092 |
| 44156.05401620371 | 37.072 |
| 44156.09568287038 | 36.956 |
| 44156.13734953704 | 36.879 |
| 44156.17901620371 | 36.802 |
| 44156.22068287038 | 36.686 |
| 44156.26234953704 | 36.57 |
| 44156.30401620371 | 36.416 |
| 44156.34568287038 | 36.474 |
| 44156.38734953704 | 36.763 |
| 44156.42901620371 | 37.188 |
| 44156.47068287038 | 37.613 |
| 44156.51234953704 | 38.327 |
| 44156.55401620371 | 39.292 |
| 44156.59568287038 | 39.582 |
| 44156.63734953704 | 39.698 |
| 44156.67901620371 | 39.138 |
| 44156.72068287038 | 38.482 |
| 44156.76234953704 | 37.825 |
| 44156.80401620371 | 37.323 |
| 44156.84568287038 | 36.802 |
| 44156.88734953704 | 36.223 |
| 44156.92901620371 | 35.605 |
| 44156.97068287038 | 34.929 |
| 44157.01234953704 | 34.389 |
| 44157.05401620371 | 33.945 |
| 44157.09568287038 | 33.501 |
| 44157.13734953704 | 33.115 |
| 44157.17901620371 | 32.806 |
| 44157.22068287038 | 32.42 |
| 44157.26234953704 | 32.072 |
| 44157.30401620371 | 31.918 |
| 44157.34568287038 | 31.918 |
| 44157.38734953704 | 31.956 |
| 44157.42901620371 | 32.883 |
| 44157.47068287038 | 34.273 |
| 44157.51234953704 | 35.624 |
| 44157.55401620371 | 36.725 |
| 44157.59568287038 | 37.439 |
| 44157.63734953704 | 37.227 |
| 44157.67901620371 | 36.725 |
| 44157.72068287038 | 36.261 |
| 44157.76234953704 | 35.991 |
| 44157.80401620371 | 35.605 |
| 44157.84568287038 | 35.258 |
| 44157.88734953704 | 34.833 |
| 44157.92901620371 | 34.736 |
| 44157.97068287038 | 34.659 |
| 44158.01234953704 | 34.852 |
| 44158.05401620371 | 34.929 |
| 44158.09568287038 | 34.833 |
| 44158.13734953704 | 34.987 |
| 44158.17901620371 | 35.142 |
| 44158.22068287038 | 35.315 |
| 44158.26234953704 | 35.2 |
| 44158.30401620371 | 35.084 |
| 44158.34568287038 | 35.161 |
| 44158.38734953704 | 35.721 |
| 44158.42901620371 | 36.879 |
| 44158.47068287038 | 38.308 |
| 44158.51234953704 | 40.084 |
| 44158.55401620371 | 41.088 |
| 44158.59568287038 | 41.261 |
| 44158.63734953704 | 40.76 |
| 44158.67901620371 | 40.373 |
| 44158.72068287038 | 40.084 |
| 44158.76234953704 | 39.756 |
| 44158.80401620371 | 39.292 |
| 44158.84568287038 | 38.868 |
| 44158.88734953704 | 38.327 |
| 44158.92901620371 | 37.941 |
| 44158.97068287038 | 37.864 |
| 44159.01234953704 | 37.922 |
| 44159.05401620371 | 37.902 |
| 44159.09568287038 | 37.149 |
| 44159.13734953704 | 36.03 |
| 44159.17901620371 | 36.03 |
| 44159.22068287038 | 35.702 |
| 44159.26234953704 | 35.315 |
| 44159.30401620371 | 34.891 |
| 44159.34568287038 | 34.601 |
| 44159.38734953704 | 34.543 |
| 44159.42901620371 | 35.065 |
| 44159.47068287038 | 35.953 |
| 44159.51234953704 | 37.053 |
| 44159.55401620371 | 37.767 |
| 44159.59568287038 | 37.883 |
| 44159.63734953704 | 38.153 |
| 44159.67901620371 | 37.323 |
| 44159.72068287038 | 36.242 |
| 44159.76234953704 | 35.586 |
| 44159.80401620371 | 34.91 |
| 44159.84568287038 | 34.234 |
| 44159.88734953704 | 33.694 |
| 44159.92901620371 | 33.173 |
| 44159.97068287038 | 32.767 |
| 44160.01234953704 | 32.188 |
| 44160.05401620371 | 31.937 |
| 44160.09568287038 | 31.918 |
| 44160.13734953704 | 31.937 |
| 44160.17901620371 | 31.956 |
| 44160.22068287038 | 31.956 |
| 44160.26234953704 | 31.976 |
| 44160.30401620371 | 31.976 |
| 44160.34568287038 | 31.976 |
| 44160.38734953704 | 31.976 |
| 44160.42901620371 | 32.034 |
| 44160.47068287038 | 32.092 |
| 44160.51234953704 | 32.709 |
| 44160.55401620371 | 33.578 |
| 44160.59568287038 | 34.331 |
| 44160.63734953704 | 34.427 |
| 44160.67901620371 | 33.887 |
| 44160.72068287038 | 33.327 |
| 44160.76234953704 | 32.96 |
| 44160.80401620371 | 32.478 |
| 44160.84568287038 | 31.898 |
| 44160.88734953704 | 31.995 |
| 44160.92901620371 | 31.937 |
| 44160.97068287038 | 31.937 |
| 44161.01234953704 | 31.956 |
| 44161.05401620371 | 31.956 |
| 44161.09568287038 | 31.976 |
| 44161.13734953704 | 31.937 |
| 44161.17901620371 | 31.976 |
| 44161.22068287038 | 31.937 |
| 44161.26234953704 | 31.956 |
| 44161.30401620371 | 31.937 |
| 44161.34568287038 | 31.995 |
| 44161.38734953704 | 31.976 |
| 44161.42901620371 | 32.014 |
| 44161.47068287038 | 32.092 |
| 44161.51234953704 | 32.053 |
| 44161.55401620371 | 32.362 |
| 44161.59568287038 | 32.574 |
| 44161.63734953704 | 32.555 |
| 44161.67901620371 | 32.246 |
| 44161.72068287038 | 32.188 |
| 44161.76234953704 | 32.246 |
| 44161.80401620371 | 32.323 |
| 44161.84568287038 | 32.227 |
| 44161.88734953704 | 32.072 |
| 44161.92901620371 | 31.937 |
| 44161.97068287038 | 31.937 |
| 44162.01234953704 | 31.956 |
| 44162.05401620371 | 31.937 |
| 44162.09568287038 | 31.937 |
| 44162.13734953704 | 31.976 |
| 44162.17901620371 | 31.956 |
| 44162.22068287038 | 31.976 |
| 44162.26234953704 | 31.956 |
| 44162.30401620371 | 31.956 |
| 44162.34568287038 | 31.956 |
| 44162.38734953704 | 31.976 |
| 44162.42901620371 | 31.995 |
| 44162.47068287038 | 32.053 |
| 44162.51234953704 | 32.092 |
| 44162.55401620371 | 32.323 |
| 44162.59568287038 | 32.864 |
| 44162.63734953704 | 32.69 |
| 44162.67901620371 | 32.188 |
| 44162.72068287038 | 31.86 |
| 44162.76234953704 | 31.937 |
| 44162.80401620371 | 31.937 |
| 44162.84568287038 | 31.956 |
| 44162.88734953704 | 31.937 |
| 44162.92901620371 | 31.956 |
| 44162.97068287038 | 31.937 |
| 44163.01234953704 | 31.956 |
| 44163.05401620371 | 32.014 |
| 44163.09568287038 | 31.956 |
| 44163.13734953704 | 31.995 |
| 44163.17901620371 | 31.995 |
| 44163.22068287038 | 31.956 |
| 44163.26234953704 | 31.995 |
| 44163.30401620371 | 31.995 |
| 44163.34568287038 | 31.976 |
| 44163.38734953704 | 31.956 |
| 44163.42901620371 | 31.976 |
| 44163.47068287038 | 32.072 |
| 44163.51234953704 | 32.072 |
| 44163.55401620371 | 32.034 |
| 44163.59568287038 | 32.149 |
| 44163.63734953704 | 32.169 |
| 44163.67901620371 | 31.918 |
| 44163.72068287038 | 31.995 |
| 44163.76234953704 | 31.937 |
| 44163.80401620371 | 31.956 |
| 44163.84568287038 | 31.956 |
| 44163.88734953704 | 31.956 |
| 44163.92901620371 | 31.937 |
| 44163.97068287038 | 31.956 |
| 44164.01234953704 | 31.976 |
| 44164.05401620371 | 31.976 |
| 44164.09568287038 | 31.956 |
| 44164.13734953704 | 31.956 |
| 44164.17901620371 | 31.956 |
| 44164.22068287038 | 31.956 |
| 44164.26234953704 | 31.976 |
| 44164.30401620371 | 32.014 |
| 44164.34568287038 | 32.014 |
| 44164.38734953704 | 31.976 |
| 44164.42901620371 | 32.014 |
| 44164.47068287038 | 32.072 |
| 44164.51234953704 | 32.034 |
| 44164.55401620371 | 32.034 |
| 44164.59568287038 | 32.014 |
| 44164.63734953704 | 31.976 |
| 44164.67901620371 | 31.976 |
| 44164.72068287038 | 31.976 |
| 44164.76234953704 | 31.956 |
| 44164.80401620371 | 31.956 |
| 44164.84568287038 | 31.995 |
| 44164.88734953704 | 31.956 |
| 44164.92901620371 | 31.956 |
| 44164.97068287038 | 31.956 |
| 44165.01234953704 | 31.976 |
| 44165.05401620371 | 31.976 |
| 44165.09568287038 | 31.976 |
| 44165.13734953704 | 31.956 |
| 44165.17901620371 | 31.956 |
| 44165.22068287038 | 31.995 |
| 44165.26234953704 | 31.956 |
| 44165.30401620371 | 31.956 |
| 44165.34568287038 | 31.976 |
| 44165.38734953704 | 31.956 |
| 44165.42901620371 | 31.995 |
| 44165.47068287038 | 32.034 |
| 44165.51234953704 | 32.014 |
| 44165.55401620371 | 32.072 |
| 44165.59568287038 | 31.956 |
| 44165.63734953704 | 31.937 |
| 44165.67901620371 | 31.976 |
| 44165.72068287038 | 31.937 |
| 44165.76234953704 | 32.014 |
| 44165.80401620371 | 31.995 |
| 44165.84568287038 | 32.014 |
| 44165.88734953704 | 31.956 |
| 44165.92901620371 | 31.995 |
| 44165.97068287038 | 31.956 |
| 44166.01234953704 | 31.937 |
| 44166.05401620371 | 31.956 |
| 44166.09568287038 | 31.956 |
| 44166.13734953704 | 31.976 |
| 44166.17901620371 | 31.956 |
| 44166.22068287038 | 31.956 |
| 44166.26234953704 | 31.956 |
| 44166.30401620371 | 31.976 |
| 44166.34568287038 | 31.956 |
| 44166.38734953704 | 31.976 |
| 44166.42901620371 | 31.995 |
| 44166.47068287038 | 32.014 |
| 44166.51234953704 | 32.034 |
| 44166.55401620371 | 32.014 |
| 44166.59568287038 | 32.014 |
| 44166.63734953704 | 31.956 |
| 44166.67901620371 | 31.976 |
| 44166.72068287038 | 31.976 |
| 44166.76234953704 | 31.956 |
| 44166.80401620371 | 31.956 |
| 44166.84568287038 | 31.976 |
| 44166.88734953704 | 31.976 |
| 44166.92901620371 | 31.937 |
| 44166.97068287038 | 31.976 |
| 44167.01234953704 | 31.976 |
| 44167.05401620371 | 31.956 |
| 44167.09568287038 | 31.956 |
| 44167.13734953704 | 31.956 |
| 44167.17901620371 | 31.976 |
| 44167.22068287038 | 31.976 |
| 44167.26234953704 | 31.956 |
| 44167.30401620371 | 31.976 |
| 44167.34568287038 | 31.995 |
| 44167.38734953704 | 31.956 |
| 44167.42901620371 | 31.976 |
| 44167.47068287038 | 31.956 |
| 44167.51234953704 | 32.014 |
| 44167.55401620371 | 31.976 |
| 44167.59568287038 | 32.014 |
| 44167.63734953704 | 31.956 |
| 44167.67901620371 | 31.976 |
| 44167.72068287038 | 31.937 |
| 44167.76234953704 | 31.976 |
| 44167.80401620371 | 31.956 |
| 44167.84568287038 | 31.956 |
| 44167.88734953704 | 31.937 |
| 44167.92901620371 | 31.976 |
| 44167.97068287038 | 31.956 |
| 44168.01234953704 | 31.956 |
| 44168.05401620371 | 31.976 |
| 44168.09568287038 | 31.937 |
| 44168.13734953704 | 31.976 |
| 44168.17901620371 | 31.956 |
| 44168.22068287038 | 31.918 |
| 44168.26234953704 | 31.956 |
| 44168.30401620371 | 31.937 |
| 44168.34568287038 | 31.995 |
| 44168.38734953704 | 31.995 |
| 44168.42901620371 | 31.995 |
| 44168.47068287038 | 31.995 |
| 44168.51234953704 | 32.072 |
| 44168.55401620371 | 32.053 |
| 44168.59568287038 | 32.034 |
| 44168.63734953704 | 31.976 |
| 44168.67901620371 | 31.956 |
| 44168.72068287038 | 31.995 |
| 44168.76234953704 | 31.995 |
| 44168.80401620371 | 31.956 |
| 44168.84568287038 | 31.976 |
| 44168.88734953704 | 31.937 |
| 44168.92901620371 | 31.976 |
| 44168.97068287038 | 31.976 |
| 44169.01234953704 | 31.956 |
| 44169.05401620371 | 31.937 |
| 44169.09568287038 | 31.995 |
| 44169.13734953704 | 31.995 |
| 44169.17901620371 | 31.995 |
| 44169.22068287038 | 31.976 |
| 44169.26234953704 | 31.976 |
| 44169.30401620371 | 31.956 |
| 44169.34568287038 | 31.956 |
| 44169.38734953704 | 31.956 |
| 44169.42901620371 | 32.072 |
| 44169.47068287038 | 32.053 |
| 44169.51234953704 | 32.072 |
| 44169.55401620371 | 32.053 |
| 44169.59568287038 | 32.034 |
| 44169.63734953704 | 31.976 |
| 44169.67901620371 | 31.956 |
| 44169.72068287038 | 31.956 |
| 44169.76234953704 | 31.956 |
| 44169.80401620371 | 31.995 |
| 44169.84568287038 | 31.976 |
| 44169.88734953704 | 31.937 |
| 44169.92901620371 | 31.956 |
| 44169.97068287038 | 31.976 |
| 44170.01234953704 | 31.956 |
| 44170.05401620371 | 31.995 |
| 44170.09568287038 | 31.995 |
| 44170.13734953704 | 31.937 |
| 44170.17901620371 | 31.995 |
| 44170.22068287038 | 31.995 |
| 44170.26234953704 | 31.976 |
| 44170.30401620371 | 31.937 |
| 44170.34568287038 | 31.995 |
| 44170.38734953704 | 31.976 |
| 44170.42901620371 | 32.072 |
| 44170.47068287038 | 32.072 |
| 44170.51234953704 | 32.034 |
| 44170.55401620371 | 32.053 |
| 44170.59568287038 | 32.014 |
| 44170.63734953704 | 31.995 |
| 44170.67901620371 | 32.014 |
| 44170.72068287038 | 32.014 |
| 44170.76234953704 | 31.976 |
| 44170.80401620371 | 32.014 |
| 44170.84568287038 | 31.995 |
| 44170.88734953704 | 31.937 |
| 44170.92901620371 | 31.995 |
| 44170.97068287038 | 31.956 |
| 44171.01234953704 | 31.995 |
| 44171.05401620371 | 31.976 |
| 44171.09568287038 | 31.956 |
| 44171.13734953704 | 31.956 |
| 44171.17901620371 | 32.014 |
| 44171.22068287038 | 31.976 |
| 44171.26234953704 | 31.956 |
| 44171.30401620371 | 31.956 |
| 44171.34568287038 | 31.956 |
| 44171.38734953704 | 31.995 |
| 44171.42901620371 | 32.014 |
| 44171.47068287038 | 32.072 |
| 44171.51234953704 | 32.034 |
| 44171.55401620371 | 32.034 |
| 44171.59568287038 | 32.034 |
| 44171.63734953704 | 32.014 |
| 44171.67901620371 | 31.956 |
| 44171.72068287038 | 31.956 |
| 44171.76234953704 | 31.956 |
| 44171.80401620371 | 31.976 |
| 44171.84568287038 | 31.937 |
| 44171.88734953704 | 31.995 |
| 44171.92901620371 | 31.976 |
| 44171.97068287038 | 31.976 |
| 44172.01234953704 | 31.976 |
| 44172.05401620371 | 31.976 |
| 44172.09568287038 | 31.937 |
| 44172.13734953704 | 31.995 |
| 44172.17901620371 | 31.956 |
| 44172.22068287038 | 31.995 |
| 44172.26234953704 | 31.976 |
| 44172.30401620371 | 31.976 |
| 44172.34568287038 | 31.995 |
| 44172.38734953704 | 31.976 |
| 44172.42901620371 | 32.014 |
| 44172.47068287038 | 31.995 |
| 44172.51234953704 | 32.034 |
| 44172.55401620371 | 32.014 |
| 44172.59568287038 | 32.034 |
| 44172.63734953704 | 31.995 |
| 44172.67901620371 | 31.956 |
| 44172.72068287038 | 31.976 |
| 44172.76234953704 | 31.956 |
| 44172.80401620371 | 31.918 |
| 44172.84568287038 | 31.976 |
| 44172.88734953704 | 31.995 |
| 44172.92901620371 | 31.976 |
| 44172.97068287038 | 32.014 |
| 44173.01234953704 | 31.937 |
| 44173.05401620371 | 31.976 |
| 44173.09568287038 | 31.995 |
| 44173.13734953704 | 31.956 |
| 44173.17901620371 | 31.976 |
| 44173.22068287038 | 31.937 |
| 44173.26234953704 | 31.937 |
| 44173.30401620371 | 31.976 |
| 44173.34568287038 | 31.937 |
| 44173.38734953704 | 31.956 |
| 44173.42901620371 | 32.014 |
| 44173.47068287038 | 32.034 |
| 44173.51234953704 | 32.034 |
| 44173.55401620371 | 32.053 |
| 44173.59568287038 | 32.014 |
| 44173.63734953704 | 31.995 |
| 44173.67901620371 | 31.956 |
| 44173.72068287038 | 31.937 |
| 44173.76234953704 | 31.976 |
| 44173.80401620371 | 31.937 |
| 44173.84568287038 | 31.956 |
| 44173.88734953704 | 31.956 |
| 44173.92901620371 | 31.995 |
| 44173.97068287038 | 32.014 |
| 44174.01234953704 | 31.976 |
| 44174.05401620371 | 31.976 |
| 44174.09568287038 | 31.937 |
| 44174.13734953704 | 31.937 |
| 44174.17901620371 | 31.995 |
| 44174.22068287038 | 31.976 |
| 44174.26234953704 | 31.976 |
| 44174.30401620371 | 31.976 |
| 44174.34568287038 | 31.956 |
| 44174.38734953704 | 31.976 |
| 44174.42901620371 | 32.014 |
| 44174.47068287038 | 32.014 |
| 44174.51234953704 | 32.034 |
| 44174.55401620371 | 31.976 |
| 44174.59568287038 | 31.995 |
| 44174.63734953704 | 31.976 |
| 44174.67901620371 | 31.937 |
| 44174.72068287038 | 31.956 |
| 44174.76234953704 | 31.976 |
| 44174.80401620371 | 31.976 |
| 44174.84568287038 | 31.976 |
| 44174.88734953704 | 31.956 |
| 44174.92901620371 | 31.937 |
| 44174.97068287038 | 31.976 |
| 44175.01234953704 | 31.976 |
| 44175.05401620371 | 31.995 |
| 44175.09568287038 | 31.995 |
| 44175.13734953704 | 31.976 |
| 44175.17901620371 | 31.976 |
| 44175.22068287038 | 31.976 |
| 44175.26234953704 | 32.014 |
| 44175.30401620371 | 31.976 |
| 44175.34568287038 | 31.976 |
| 44175.38734953704 | 31.976 |
| 44175.42901620371 | 31.995 |
| 44175.47068287038 | 31.956 |
| 44175.51234953704 | 31.995 |
| 44175.55401620371 | 31.995 |
| 44175.59568287038 | 31.937 |
| 44175.63734953704 | 31.976 |
| 44175.67901620371 | 31.976 |
| 44175.72068287038 | 31.937 |
| 44175.76234953704 | 31.976 |
| 44175.80401620371 | 31.956 |
| 44175.84568287038 | 31.937 |
| 44175.88734953704 | 31.918 |
| 44175.92901620371 | 31.937 |
| 44175.97068287038 | 31.976 |
| 44176.01234953704 | 31.937 |
| 44176.05401620371 | 32.014 |
| 44176.09568287038 | 31.976 |
| 44176.13734953704 | 31.976 |
| 44176.17901620371 | 31.976 |
| 44176.22068287038 | 31.976 |
| 44176.26234953704 | 31.995 |
| 44176.30401620371 | 31.956 |
| 44176.34568287038 | 31.976 |
| 44176.38734953704 | 31.995 |
| 44176.42901620371 | 31.956 |
| 44176.47068287038 | 31.937 |
| 44176.51234953704 | 31.995 |
| 44176.55401620371 | 31.976 |
| 44176.59568287038 | 31.976 |
| 44176.63734953704 | 31.956 |
| 44176.67901620371 | 31.937 |
| 44176.72068287038 | 31.976 |
| 44176.76234953704 | 31.995 |
| 44176.80401620371 | 31.956 |
| 44176.84568287038 | 31.956 |
| 44176.88734953704 | 31.976 |
| 44176.92901620371 | 31.976 |
| 44176.97068287038 | 31.956 |
| 44177.01234953704 | 31.956 |
| 44177.05401620371 | 31.995 |
| 44177.09568287038 | 31.956 |
| 44177.13734953704 | 32.014 |
| 44177.17901620371 | 31.956 |
| 44177.22068287038 | 31.976 |
| 44177.26234953704 | 31.937 |
| 44177.30401620371 | 31.976 |
| 44177.34568287038 | 31.995 |
| 44177.38734953704 | 31.937 |
| 44177.42901620371 | 31.937 |
| 44177.47068287038 | 31.995 |
| 44177.51234953704 | 31.956 |
| 44177.55401620371 | 31.976 |
| 44177.59568287038 | 31.956 |
| 44177.63734953704 | 31.976 |
| 44177.67901620371 | 31.976 |
| 44177.72068287038 | 31.937 |
| 44177.76234953704 | 31.956 |
| 44177.80401620371 | 31.956 |
| 44177.84568287038 | 31.976 |
| 44177.88734953704 | 31.937 |
| 44177.92901620371 | 31.995 |
| 44177.97068287038 | 31.976 |
| 44178.01234953704 | 31.976 |
| 44178.05401620371 | 31.976 |
| 44178.09568287038 | 31.956 |
| 44178.13734953704 | 31.956 |
| 44178.17901620371 | 31.995 |
| 44178.22068287038 | 31.995 |
| 44178.26234953704 | 31.995 |
| 44178.30401620371 | 31.976 |
| 44178.34568287038 | 31.976 |
| 44178.38734953704 | 31.995 |
| 44178.42901620371 | 31.995 |
| 44178.47068287038 | 31.956 |
| 44178.51234953704 | 31.956 |
| 44178.55401620371 | 31.995 |
| 44178.59568287038 | 31.956 |
| 44178.63734953704 | 31.937 |
| 44178.67901620371 | 31.976 |
| 44178.72068287038 | 31.937 |
| 44178.76234953704 | 31.956 |
| 44178.80401620371 | 31.956 |
| 44178.84568287038 | 31.956 |
| 44178.88734953704 | 32.014 |
| 44178.92901620371 | 31.976 |
| 44178.97068287038 | 31.956 |
| 44179.01234953704 | 31.976 |
| 44179.05401620371 | 32.014 |
| 44179.09568287038 | 31.976 |
| 44179.13734953704 | 31.976 |
| 44179.17901620371 | 31.956 |
| 44179.22068287038 | 31.995 |
| 44179.26234953704 | 31.976 |
| 44179.30401620371 | 31.956 |
| 44179.34568287038 | 31.956 |
| 44179.38734953704 | 31.937 |
| 44179.42901620371 | 31.976 |
| 44179.47068287038 | 31.995 |
| 44179.51234953704 | 31.976 |
| 44179.55401620371 | 31.976 |
| 44179.59568287038 | 31.937 |
| 44179.63734953704 | 31.976 |
| 44179.67901620371 | 31.976 |
| 44179.72068287038 | 31.976 |
| 44179.76234953704 | 31.995 |
| 44179.80401620371 | 31.976 |
| 44179.84568287038 | 31.995 |
| 44179.88734953704 | 31.976 |
| 44179.92901620371 | 32.014 |
| 44179.97068287038 | 31.956 |
| 44180.01234953704 | 31.956 |
| 44180.05401620371 | 31.976 |
| 44180.09568287038 | 31.956 |
| 44180.13734953704 | 31.976 |
| 44180.17901620371 | 31.956 |
| 44180.22068287038 | 31.956 |
| 44180.26234953704 | 31.976 |
| 44180.30401620371 | 31.956 |
| 44180.34568287038 | 31.976 |
| 44180.38734953704 | 31.956 |
| 44180.42901620371 | 31.995 |
| 44180.47068287038 | 31.937 |
| 44180.51234953704 | 31.956 |
| 44180.55401620371 | 32.014 |
| 44180.59568287038 | 31.956 |
| 44180.63734953704 | 31.956 |
| 44180.67901620371 | 31.976 |
| 44180.72068287038 | 31.995 |
| 44180.76234953704 | 31.956 |
| 44180.80401620371 | 31.956 |
| 44180.84568287038 | 31.956 |
| 44180.88734953704 | 31.976 |
| 44180.92901620371 | 31.956 |
| 44180.97068287038 | 31.976 |
| 44181.01234953704 | 31.976 |
| 44181.05401620371 | 31.976 |
| 44181.09568287038 | 31.976 |
| 44181.13734953704 | 31.956 |
| 44181.17901620371 | 31.995 |
| 44181.22068287038 | 31.976 |
| 44181.26234953704 | 31.937 |
| 44181.30401620371 | 31.995 |
| 44181.34568287038 | 32.014 |
| 44181.38734953704 | 31.995 |
| 44181.42901620371 | 31.976 |
| 44181.47068287038 | 31.995 |
| 44181.51234953704 | 31.956 |
| 44181.55401620371 | 31.995 |
| 44181.59568287038 | 31.976 |
| 44181.63734953704 | 31.956 |
| 44181.67901620371 | 31.995 |
| 44181.72068287038 | 31.956 |
| 44181.76234953704 | 31.976 |
| 44181.80401620371 | 31.976 |
| 44181.84568287038 | 31.995 |
| 44181.88734953704 | 31.956 |
| 44181.92901620371 | 31.956 |
| 44181.97068287038 | 31.976 |
| 44182.01234953704 | 31.976 |
| 44182.05401620371 | 31.976 |
| 44182.09568287038 | 31.956 |
| 44182.13734953704 | 31.956 |
| 44182.17901620371 | 31.976 |
| 44182.22068287038 | 31.956 |
| 44182.26234953704 | 31.995 |
| 44182.30401620371 | 31.995 |
| 44182.34568287038 | 31.937 |
| 44182.38734953704 | 31.995 |
| 44182.42901620371 | 31.956 |
| 44182.47068287038 | 31.937 |
| 44182.51234953704 | 31.956 |
| 44182.55401620371 | 31.956 |
| 44182.59568287038 | 31.976 |
| 44182.63734953704 | 31.976 |
| 44182.67901620371 | 31.956 |
| 44182.72068287038 | 31.995 |
| 44182.76234953704 | 31.976 |
| 44182.80401620371 | 31.976 |
| 44182.84568287038 | 31.995 |
| 44182.88734953704 | 31.956 |
| 44182.92901620371 | 31.956 |
| 44182.97068287038 | 31.976 |
| 44183.01234953704 | 32.014 |
| 44183.05401620371 | 31.956 |
| 44183.09568287038 | 31.956 |
| 44183.13734953704 | 31.956 |
| 44183.17901620371 | 31.956 |
| 44183.22068287038 | 31.976 |
| 44183.26234953704 | 31.976 |
| 44183.30401620371 | 31.918 |
| 44183.34568287038 | 31.976 |
| 44183.38734953704 | 31.995 |
| 44183.42901620371 | 31.937 |
| 44183.47068287038 | 31.976 |
| 44183.51234953704 | 31.976 |
| 44183.55401620371 | 31.995 |
| 44183.59568287038 | 31.976 |
| 44183.63734953704 | 31.956 |
| 44183.67901620371 | 31.976 |
| 44183.72068287038 | 31.956 |
| 44183.76234953704 | 31.976 |
| 44183.80401620371 | 31.976 |
| 44183.84568287038 | 31.956 |
| 44183.88734953704 | 31.976 |
| 44183.92901620371 | 32.014 |
| 44183.97068287038 | 31.995 |
| 44184.01234953704 | 31.976 |
| 44184.05401620371 | 31.937 |
| 44184.09568287038 | 31.937 |
| 44184.13734953704 | 31.956 |
| 44184.17901620371 | 31.956 |
| 44184.22068287038 | 32.014 |
| 44184.26234953704 | 31.956 |
| 44184.30401620371 | 31.976 |
| 44184.34568287038 | 31.995 |
| 44184.38734953704 | 31.937 |
| 44184.42901620371 | 31.995 |
| 44184.47068287038 | 31.995 |
| 44184.51234953704 | 31.976 |
| 44184.55401620371 | 32.014 |
| 44184.59568287038 | 31.995 |
| 44184.63734953704 | 31.956 |
| 44184.67901620371 | 31.956 |
| 44184.72068287038 | 31.956 |
| 44184.76234953704 | 31.976 |
| 44184.80401620371 | 31.976 |
| 44184.84568287038 | 31.995 |
| 44184.88734953704 | 31.956 |
| 44184.92901620371 | 31.956 |
| 44184.97068287038 | 31.976 |
| 44185.01234953704 | 31.937 |
| 44185.05401620371 | 31.976 |
| 44185.09568287038 | 31.976 |
| 44185.13734953704 | 31.976 |
| 44185.17901620371 | 31.956 |
| 44185.22068287038 | 31.956 |
| 44185.26234953704 | 31.956 |
| 44185.30401620371 | 31.976 |
| 44185.34568287038 | 31.956 |
| 44185.38734953704 | 31.995 |
| 44185.42901620371 | 31.995 |
| 44185.47068287038 | 31.956 |
| 44185.51234953704 | 31.976 |
| 44185.55401620371 | 32.014 |
| 44185.59568287038 | 31.956 |
| 44185.63734953704 | 31.956 |
| 44185.67901620371 | 31.976 |
| 44185.72068287038 | 31.976 |
| 44185.76234953704 | 32.014 |
| 44185.80401620371 | 31.976 |
| 44185.84568287038 | 31.976 |
| 44185.88734953704 | 31.995 |
| 44185.92901620371 | 31.976 |
| 44185.97068287038 | 31.995 |
| 44186.01234953704 | 31.956 |
| 44186.05401620371 | 32.014 |
| 44186.09568287038 | 31.976 |
| 44186.13734953704 | 31.956 |
| 44186.17901620371 | 31.995 |
| 44186.22068287038 | 31.995 |
| 44186.26234953704 | 31.995 |
| 44186.30401620371 | 31.956 |
| 44186.34568287038 | 32.014 |
| 44186.38734953704 | 32.014 |
| 44186.42901620371 | 31.995 |
| 44186.47068287038 | 32.034 |
| 44186.51234953704 | 31.995 |
| 44186.55401620371 | 32.034 |
| 44186.59568287038 | 32.053 |
| 44186.63734953704 | 32.034 |
| 44186.67901620371 | 31.976 |
| 44186.72068287038 | 31.976 |
| 44186.76234953704 | 31.976 |
| 44186.80401620371 | 31.956 |
| 44186.84568287038 | 31.956 |
| 44186.88734953704 | 31.976 |
| 44186.92901620371 | 31.995 |
| 44186.97068287038 | 31.956 |
| 44187.01234953704 | 31.976 |
| 44187.05401620371 | 31.937 |
| 44187.09568287038 | 31.976 |
| 44187.13734953704 | 31.898 |
| 44187.17901620371 | 31.976 |
| 44187.22068287038 | 31.956 |
| 44187.26234953704 | 32.014 |
| 44187.30401620371 | 31.995 |
| 44187.34568287038 | 31.976 |
| 44187.38734953704 | 31.976 |
| 44187.42901620371 | 31.995 |
| 44187.47068287038 | 31.976 |
| 44187.51234953704 | 32.072 |
| 44187.55401620371 | 32.053 |
| 44187.59568287038 | 32.034 |
| 44187.63734953704 | 31.976 |
| 44187.67901620371 | 31.976 |
| 44187.72068287038 | 31.937 |
| 44187.76234953704 | 31.976 |
| 44187.80401620371 | 31.937 |
| 44187.84568287038 | 31.937 |
| 44187.88734953704 | 31.976 |
| 44187.92901620371 | 31.956 |
| 44187.97068287038 | 31.995 |
| 44188.01234953704 | 31.976 |
| 44188.05401620371 | 31.937 |
| 44188.09568287038 | 31.976 |
| 44188.13734953704 | 31.937 |
| 44188.17901620371 | 31.956 |
| 44188.22068287038 | 31.956 |
| 44188.26234953704 | 31.976 |
| 44188.30401620371 | 31.976 |
| 44188.34568287038 | 31.937 |
| 44188.38734953704 | 31.937 |
| 44188.42901620371 | 31.976 |
| 44188.47068287038 | 31.995 |
| 44188.51234953704 | 31.956 |
| 44188.55401620371 | 32.014 |
| 44188.59568287038 | 31.976 |
| 44188.63734953704 | 31.976 |
| 44188.67901620371 | 31.995 |
| 44188.72068287038 | 32.014 |
| 44188.76234953704 | 31.937 |
| 44188.80401620371 | 31.976 |
| 44188.84568287038 | 31.956 |
| 44188.88734953704 | 31.995 |
| 44188.92901620371 | 31.956 |
| 44188.97068287038 | 31.976 |
| 44189.01234953704 | 31.956 |
| 44189.05401620371 | 31.956 |
| 44189.09568287038 | 31.976 |
| 44189.13734953704 | 31.976 |
| 44189.17901620371 | 31.995 |
| 44189.22068287038 | 31.976 |
| 44189.26234953704 | 31.976 |
| 44189.30401620371 | 31.976 |
| 44189.34568287038 | 31.976 |
| 44189.38734953704 | 31.976 |
| 44189.42901620371 | 31.956 |
| 44189.47068287038 | 31.976 |
| 44189.51234953704 | 32.014 |
| 44189.55401620371 | 31.995 |
| 44189.59568287038 | 31.956 |
| 44189.63734953704 | 31.937 |
| 44189.67901620371 | 31.976 |
| 44189.72068287038 | 31.956 |
| 44189.76234953704 | 31.956 |
| 44189.80401620371 | 31.937 |
| 44189.84568287038 | 31.956 |
| 44189.88734953704 | 31.956 |
| 44189.92901620371 | 31.956 |
| 44189.97068287038 | 31.956 |
| 44190.01234953704 | 31.956 |
| 44190.05401620371 | 31.956 |
| 44190.09568287038 | 31.937 |
| 44190.13734953704 | 31.937 |
| 44190.17901620371 | 31.976 |
| 44190.22068287038 | 31.995 |
| 44190.26234953704 | 31.937 |
| 44190.30401620371 | 31.995 |
| 44190.34568287038 | 31.976 |
| 44190.38734953704 | 31.956 |
| 44190.42901620371 | 31.976 |
| 44190.47068287038 | 31.976 |
| 44190.51234953704 | 31.995 |
| 44190.55401620371 | 31.918 |
| 44190.59568287038 | 31.956 |
| 44190.63734953704 | 31.995 |
| 44190.67901620371 | 31.956 |
| 44190.72068287038 | 31.918 |
| 44190.76234953704 | 31.976 |
| 44190.80401620371 | 31.956 |
| 44190.84568287038 | 31.956 |
| 44190.88734953704 | 31.995 |
| 44190.92901620371 | 31.956 |
| 44190.97068287038 | 31.956 |
| 44191.01234953704 | 31.995 |
| 44191.05401620371 | 31.937 |
| 44191.09568287038 | 31.995 |
| 44191.13734953704 | 31.956 |
| 44191.17901620371 | 31.976 |
| 44191.22068287038 | 31.995 |
| 44191.26234953704 | 31.976 |
| 44191.30401620371 | 31.976 |
| 44191.34568287038 | 31.995 |
| 44191.38734953704 | 31.956 |
| 44191.42901620371 | 31.995 |
| 44191.47068287038 | 31.995 |
| 44191.51234953704 | 32.014 |
| 44191.55401620371 | 31.976 |
| 44191.59568287038 | 32.014 |
| 44191.63734953704 | 31.976 |
| 44191.67901620371 | 31.976 |
| 44191.72068287038 | 31.976 |
| 44191.76234953704 | 31.995 |
| 44191.80401620371 | 31.976 |
| 44191.84568287038 | 31.956 |
| 44191.88734953704 | 31.937 |
| 44191.92901620371 | 31.956 |
| 44191.97068287038 | 31.937 |
| 44192.01234953704 | 31.956 |
| 44192.05401620371 | 31.976 |
| 44192.09568287038 | 31.976 |
| 44192.13734953704 | 31.937 |
| 44192.17901620371 | 31.995 |
| 44192.22068287038 | 31.995 |
| 44192.26234953704 | 31.956 |
| 44192.30401620371 | 31.995 |
| 44192.34568287038 | 31.956 |
| 44192.38734953704 | 31.976 |
| 44192.42901620371 | 31.995 |
| 44192.47068287038 | 31.995 |
| 44192.51234953704 | 31.937 |
| 44192.55401620371 | 31.976 |
| 44192.59568287038 | 31.937 |
| 44192.63734953704 | 31.995 |
| 44192.67901620371 | 31.976 |
| 44192.72068287038 | 31.976 |
| 44192.76234953704 | 31.976 |
| 44192.80401620371 | 31.956 |
| 44192.84568287038 | 31.976 |
| 44192.88734953704 | 31.995 |
| 44192.92901620371 | 31.937 |
| 44192.97068287038 | 31.956 |
| 44193.01234953704 | 31.956 |
| 44193.05401620371 | 31.956 |
| 44193.09568287038 | 31.995 |
| 44193.13734953704 | 31.918 |
| 44193.17901620371 | 31.956 |
| 44193.22068287038 | 31.956 |
| 44193.26234953704 | 31.937 |
| 44193.30401620371 | 31.937 |
| 44193.34568287038 | 31.976 |
| 44193.38734953704 | 32.014 |
| 44193.42901620371 | 31.976 |
| 44193.47068287038 | 31.976 |
| 44193.51234953704 | 31.995 |
| 44193.55401620371 | 31.976 |
| 44193.59568287038 | 32.014 |
| 44193.63734953704 | 31.976 |
| 44193.67901620371 | 31.976 |
| 44193.72068287038 | 31.956 |
| 44193.76234953704 | 31.937 |
| 44193.80401620371 | 31.937 |
| 44193.84568287038 | 31.937 |
| 44193.88734953704 | 31.995 |
| 44193.92901620371 | 31.976 |
| 44193.97068287038 | 31.976 |
| 44194.01234953704 | 31.956 |
| 44194.05401620371 | 31.937 |
| 44194.09568287038 | 31.976 |
| 44194.13734953704 | 31.976 |
| 44194.17901620371 | 31.995 |
| 44194.22068287038 | 31.937 |
| 44194.26234953704 | 31.976 |
| 44194.30401620371 | 31.976 |
| 44194.34568287038 | 32.014 |
| 44194.38734953704 | 32.014 |
| 44194.42901620371 | 32.014 |
| 44194.47068287038 | 32.014 |
| 44194.51234953704 | 31.956 |
| 44194.55401620371 | 31.995 |
| 44194.59568287038 | 31.976 |
| 44194.63734953704 | 31.937 |
| 44194.67901620371 | 31.976 |
| 44194.72068287038 | 31.956 |
| 44194.76234953704 | 31.995 |
| 44194.80401620371 | 31.976 |
| 44194.84568287038 | 31.956 |
| 44194.88734953704 | 31.976 |
| 44194.92901620371 | 31.976 |
| 44194.97068287038 | 31.956 |
| 44195.01234953704 | 31.937 |
| 44195.05401620371 | 31.976 |
| 44195.09568287038 | 31.956 |
| 44195.13734953704 | 31.976 |
| 44195.17901620371 | 31.956 |
| 44195.22068287038 | 31.995 |
| 44195.26234953704 | 31.995 |
| 44195.30401620371 | 31.956 |
| 44195.34568287038 | 31.976 |
| 44195.38734953704 | 31.956 |
| 44195.42901620371 | 32.014 |
| 44195.47068287038 | 31.976 |
| 44195.51234953704 | 31.956 |
| 44195.55401620371 | 31.995 |
| 44195.59568287038 | 31.976 |
| 44195.63734953704 | 31.995 |
| 44195.67901620371 | 31.956 |
| 44195.72068287038 | 31.976 |
| 44195.76234953704 | 31.937 |
| 44195.80401620371 | 31.937 |
| 44195.84568287038 | 31.937 |
| 44195.88734953704 | 31.976 |
| 44195.92901620371 | 31.956 |
| 44195.97068287038 | 31.976 |
| 44196.01234953704 | 31.976 |
| 44196.05401620371 | 31.976 |
| 44196.09568287038 | 31.956 |
| 44196.13734953704 | 31.937 |
| 44196.17901620371 | 31.956 |
| 44196.22068287038 | 31.995 |
| 44196.26234953704 | 31.976 |
| 44196.30401620371 | 32.014 |
| 44196.34568287038 | 31.937 |
| 44196.38734953704 | 31.956 |
| 44196.42901620371 | 31.976 |
| 44196.47068287038 | 31.995 |
| 44196.51234953704 | 31.976 |
| 44196.55401620371 | 31.995 |
| 44196.59568287038 | 31.976 |
| 44196.63734953704 | 31.976 |
| 44196.67901620371 | 31.995 |
| 44196.72068287038 | 31.976 |
| 44196.76234953704 | 31.976 |
| 44196.80401620371 | 31.937 |
| 44196.84568287038 | 31.995 |
| 44196.88734953704 | 31.956 |
| 44196.92901620371 | 31.956 |
| 44196.97068287038 | 31.956 |
| 44197.01234953704 | 31.956 |
| 44197.05401620371 | 31.995 |
| 44197.09568287038 | 31.995 |
| 44197.13734953704 | 31.995 |
| 44197.17901620371 | 31.956 |
| 44197.22068287038 | 31.976 |
| 44197.26234953704 | 31.898 |
| 44197.30401620371 | 31.937 |
| 44197.34568287038 | 31.956 |
| 44197.38734953704 | 31.995 |
| 44197.42901620371 | 31.995 |
| 44197.47068287038 | 32.034 |
| 44197.51234953704 | 31.976 |
| 44197.55401620371 | 31.995 |
| 44197.59568287038 | 31.976 |
| 44197.63734953704 | 31.995 |
| 44197.67901620371 | 31.976 |
| 44197.72068287038 | 31.956 |
| 44197.76234953704 | 31.956 |
| 44197.80401620371 | 31.976 |
| 44197.84568287038 | 31.956 |
| 44197.88734953704 | 31.956 |
| 44197.92901620371 | 31.956 |
| 44197.97068287038 | 31.976 |
| 44198.01234953704 | 31.956 |
| 44198.05401620371 | 31.937 |
| 44198.09568287038 | 31.995 |
| 44198.13734953704 | 31.995 |
| 44198.17901620371 | 31.956 |
| 44198.22068287038 | 31.937 |
| 44198.26234953704 | 31.976 |
| 44198.30401620371 | 31.956 |
| 44198.34568287038 | 31.976 |
| 44198.38734953704 | 31.995 |
| 44198.42901620371 | 31.995 |
| 44198.47068287038 | 31.976 |
| 44198.51234953704 | 31.956 |
| 44198.55401620371 | 31.956 |
| 44198.59568287038 | 31.995 |
| 44198.63734953704 | 31.956 |
| 44198.67901620371 | 31.976 |
| 44198.72068287038 | 31.956 |
| 44198.76234953704 | 31.956 |
| 44198.80401620371 | 31.956 |
| 44198.84568287038 | 31.956 |
| 44198.88734953704 | 31.995 |
| 44198.92901620371 | 32.014 |
| 44198.97068287038 | 31.995 |
| 44199.01234953704 | 31.995 |
| 44199.05401620371 | 31.976 |
| 44199.09568287038 | 31.956 |
| 44199.13734953704 | 31.976 |
| 44199.17901620371 | 31.956 |
| 44199.22068287038 | 31.976 |
| 44199.26234953704 | 31.937 |
| 44199.30401620371 | 31.995 |
| 44199.34568287038 | 31.976 |
| 44199.38734953704 | 31.976 |
| 44199.42901620371 | 31.976 |
| 44199.47068287038 | 31.995 |
| 44199.51234953704 | 32.053 |
| 44199.55401620371 | 32.034 |
| 44199.59568287038 | 31.995 |
| 44199.63734953704 | 31.976 |
| 44199.67901620371 | 31.995 |
| 44199.72068287038 | 31.995 |
| 44199.76234953704 | 31.995 |
| 44199.80401620371 | 31.995 |
| 44199.84568287038 | 31.956 |
| 44199.88734953704 | 31.976 |
| 44199.92901620371 | 31.937 |
| 44199.97068287038 | 31.956 |
| 44200.01234953704 | 32.014 |
| 44200.05401620371 | 31.956 |
| 44200.09568287038 | 31.956 |
| 44200.13734953704 | 31.995 |
| 44200.17901620371 | 31.956 |
| 44200.22068287038 | 31.956 |
| 44200.26234953704 | 31.976 |
| 44200.30401620371 | 31.995 |
| 44200.34568287038 | 31.956 |
| 44200.38734953704 | 31.976 |
| 44200.42901620371 | 31.956 |
| 44200.47068287038 | 32.034 |
| 44200.51234953704 | 32.034 |
| 44200.55401620371 | 32.014 |
| 44200.59568287038 | 32.014 |
| 44200.63734953704 | 31.995 |
| 44200.67901620371 | 31.976 |
| 44200.72068287038 | 31.995 |
| 44200.76234953704 | 31.976 |
| 44200.80401620371 | 31.956 |
| 44200.84568287038 | 31.956 |
| 44200.88734953704 | 31.976 |
| 44200.92901620371 | 31.956 |
| 44200.97068287038 | 31.995 |
| 44201.01234953704 | 31.956 |
| 44201.05401620371 | 31.976 |
| 44201.09568287038 | 31.995 |
| 44201.13734953704 | 31.956 |
| 44201.17901620371 | 31.976 |
| 44201.22068287038 | 31.956 |
| 44201.26234953704 | 31.937 |
| 44201.30401620371 | 31.995 |
| 44201.34568287038 | 31.995 |
| 44201.38734953704 | 31.976 |
| 44201.42901620371 | 31.995 |
| 44201.47068287038 | 31.995 |
| 44201.51234953704 | 32.014 |
| 44201.55401620371 | 32.014 |
| 44201.59568287038 | 31.976 |
| 44201.63734953704 | 32.014 |
| 44201.67901620371 | 31.976 |
| 44201.72068287038 | 31.976 |
| 44201.76234953704 | 32.014 |
| 44201.80401620371 | 31.995 |
| 44201.84568287038 | 31.976 |
| 44201.88734953704 | 31.995 |
| 44201.92901620371 | 31.976 |
| 44201.97068287038 | 31.976 |
| 44202.01234953704 | 31.976 |
| 44202.05401620371 | 31.937 |
| 44202.09568287038 | 31.976 |
| 44202.13734953704 | 31.956 |
| 44202.17901620371 | 31.937 |
| 44202.22068287038 | 31.976 |
| 44202.26234953704 | 31.995 |
| 44202.30401620371 | 31.956 |
| 44202.34568287038 | 31.976 |
| 44202.38734953704 | 31.956 |
| 44202.42901620371 | 31.976 |
| 44202.47068287038 | 32.014 |
| 44202.51234953704 | 32.014 |
| 44202.55401620371 | 32.053 |
| 44202.59568287038 | 31.976 |
| 44202.63734953704 | 31.976 |
| 44202.67901620371 | 31.956 |
| 44202.72068287038 | 31.976 |
| 44202.76234953704 | 31.937 |
| 44202.80401620371 | 31.976 |
| 44202.84568287038 | 31.937 |
| 44202.88734953704 | 31.976 |
| 44202.92901620371 | 31.956 |
| 44202.97068287038 | 31.937 |
| 44203.01234953704 | 31.956 |
| 44203.05401620371 | 31.976 |
| 44203.09568287038 | 31.918 |
| 44203.13734953704 | 31.995 |
| 44203.17901620371 | 32.014 |
| 44203.22068287038 | 31.976 |
| 44203.26234953704 | 31.976 |
| 44203.30401620371 | 31.937 |
| 44203.34568287038 | 31.976 |
| 44203.38734953704 | 31.995 |
| 44203.42901620371 | 31.976 |
| 44203.47068287038 | 31.976 |
| 44203.51234953704 | 31.956 |
| 44203.55401620371 | 31.995 |
| 44203.59568287038 | 31.995 |
| 44203.63734953704 | 31.995 |
| 44203.67901620371 | 31.995 |
| 44203.72068287038 | 31.956 |
| 44203.76234953704 | 31.976 |
| 44203.80401620371 | 31.937 |
| 44203.84568287038 | 31.937 |
| 44203.88734953704 | 31.956 |
| 44203.92901620371 | 31.956 |
| 44203.97068287038 | 31.937 |
| 44204.01234953704 | 32.014 |
| 44204.05401620371 | 31.995 |
| 44204.09568287038 | 32.014 |
| 44204.13734953704 | 31.976 |
| 44204.17901620371 | 31.956 |
| 44204.22068287038 | 31.937 |
| 44204.26234953704 | 31.995 |
| 44204.30401620371 | 31.976 |
| 44204.34568287038 | 31.937 |
| 44204.38734953704 | 31.995 |
| 44204.42901620371 | 32.014 |
| 44204.47068287038 | 31.995 |
| 44204.51234953704 | 31.976 |
| 44204.55401620371 | 32.014 |
| 44204.59568287038 | 31.956 |
| 44204.63734953704 | 32.014 |
| 44204.67901620371 | 31.976 |
| 44204.72068287038 | 31.937 |
| 44204.76234953704 | 31.937 |
| 44204.80401620371 | 31.956 |
| 44204.84568287038 | 31.995 |
| 44204.88734953704 | 31.976 |
| 44204.92901620371 | 31.956 |
| 44204.97068287038 | 31.976 |
| 44205.01234953704 | 31.976 |
| 44205.05401620371 | 31.976 |
| 44205.09568287038 | 31.995 |
| 44205.13734953704 | 31.918 |
| 44205.17901620371 | 31.976 |
| 44205.22068287038 | 31.956 |
| 44205.26234953704 | 31.995 |
| 44205.30401620371 | 31.937 |
| 44205.34568287038 | 31.976 |
| 44205.38734953704 | 31.976 |
| 44205.42901620371 | 31.995 |
| 44205.47068287038 | 31.995 |
| 44205.51234953704 | 31.995 |
| 44205.55401620371 | 32.014 |
| 44205.59568287038 | 32.014 |
| 44205.63734953704 | 32.014 |
| 44205.67901620371 | 31.995 |
| 44205.72068287038 | 31.995 |
| 44205.76234953704 | 31.956 |
| 44205.80401620371 | 31.995 |
| 44205.84568287038 | 31.956 |
| 44205.88734953704 | 31.976 |
| 44205.92901620371 | 31.976 |
| 44205.97068287038 | 31.976 |
| 44206.01234953704 | 31.956 |
| 44206.05401620371 | 31.995 |
| 44206.09568287038 | 31.976 |
| 44206.13734953704 | 31.937 |
| 44206.17901620371 | 31.976 |
| 44206.22068287038 | 31.976 |
| 44206.26234953704 | 31.956 |
| 44206.30401620371 | 31.976 |
| 44206.34568287038 | 31.976 |
| 44206.38734953704 | 31.976 |
| 44206.42901620371 | 31.956 |
| 44206.47068287038 | 31.976 |
| 44206.51234953704 | 31.937 |
| 44206.55401620371 | 31.995 |
| 44206.59568287038 | 31.976 |
| 44206.63734953704 | 32.034 |
| 44206.67901620371 | 31.976 |
| 44206.72068287038 | 31.956 |
| 44206.76234953704 | 31.956 |
| 44206.80401620371 | 31.976 |
| 44206.84568287038 | 31.956 |
| 44206.88734953704 | 31.976 |
| 44206.92901620371 | 31.995 |
| 44206.97068287038 | 31.956 |
| 44207.01234953704 | 31.976 |
| 44207.05401620371 | 31.976 |
| 44207.09568287038 | 31.956 |
| 44207.13734953704 | 31.956 |
| 44207.17901620371 | 31.995 |
| 44207.22068287038 | 31.976 |
| 44207.26234953704 | 31.956 |
| 44207.30401620371 | 31.995 |
| 44207.34568287038 | 31.976 |
| 44207.38734953704 | 31.956 |
| 44207.42901620371 | 31.937 |
| 44207.47068287038 | 31.956 |
| 44207.51234953704 | 31.976 |
| 44207.55401620371 | 31.937 |
| 44207.59568287038 | 31.995 |
| 44207.63734953704 | 31.976 |
| 44207.67901620371 | 31.976 |
| 44207.72068287038 | 31.956 |
| 44207.76234953704 | 31.976 |
| 44207.80401620371 | 31.918 |
| 44207.84568287038 | 31.976 |
| 44207.88734953704 | 31.956 |
| 44207.92901620371 | 31.995 |
| 44207.97068287038 | 31.956 |
| 44208.01234953704 | 32.014 |
| 44208.05401620371 | 31.956 |
| 44208.09568287038 | 31.937 |
| 44208.13734953704 | 31.976 |
| 44208.17901620371 | 31.995 |
| 44208.22068287038 | 31.976 |
| 44208.26234953704 | 31.976 |
| 44208.30401620371 | 31.976 |
| 44208.34568287038 | 31.976 |
| 44208.38734953704 | 31.956 |
| 44208.42901620371 | 32.014 |
| 44208.47068287038 | 31.995 |
| 44208.51234953704 | 31.976 |
| 44208.55401620371 | 31.995 |
| 44208.59568287038 | 31.956 |
| 44208.63734953704 | 31.976 |
| 44208.67901620371 | 31.976 |
| 44208.72068287038 | 31.995 |
| 44208.76234953704 | 31.976 |
| 44208.80401620371 | 32.014 |
| 44208.84568287038 | 32.014 |
| 44208.88734953704 | 31.976 |
| 44208.92901620371 | 31.937 |
| 44208.97068287038 | 31.995 |
| 44209.01234953704 | 31.995 |
| 44209.05401620371 | 31.956 |
| 44209.09568287038 | 31.995 |
| 44209.13734953704 | 31.956 |
| 44209.17901620371 | 31.976 |
| 44209.22068287038 | 31.976 |
| 44209.26234953704 | 31.976 |
| 44209.30401620371 | 31.956 |
| 44209.34568287038 | 31.995 |
| 44209.38734953704 | 32.014 |
| 44209.42901620371 | 31.937 |
| 44209.47068287038 | 32.034 |
| 44209.51234953704 | 31.976 |
| 44209.55401620371 | 32.034 |
| 44209.59568287038 | 31.995 |
| 44209.63734953704 | 31.956 |
| 44209.67901620371 | 31.995 |
| 44209.72068287038 | 31.956 |
| 44209.76234953704 | 31.976 |
| 44209.80401620371 | 32.014 |
| 44209.84568287038 | 31.976 |
| 44209.88734953704 | 31.956 |
| 44209.92901620371 | 31.976 |
| 44209.97068287038 | 31.976 |
| 44210.01234953704 | 31.995 |
| 44210.05401620371 | 31.995 |
| 44210.09568287038 | 31.937 |
| 44210.13734953704 | 31.937 |
| 44210.17901620371 | 31.976 |
| 44210.22068287038 | 31.995 |
| 44210.26234953704 | 31.976 |
| 44210.30401620371 | 31.995 |
| 44210.34568287038 | 31.976 |
| 44210.38734953704 | 31.956 |
| 44210.42901620371 | 31.995 |
| 44210.47068287038 | 31.956 |
| 44210.51234953704 | 32.014 |
| 44210.55401620371 | 31.937 |
| 44210.59568287038 | 32.014 |
| 44210.63734953704 | 31.956 |
| 44210.67901620371 | 31.918 |
| 44210.72068287038 | 31.976 |
| 44210.76234953704 | 31.976 |
| 44210.80401620371 | 31.956 |
| 44210.84568287038 | 31.976 |
| 44210.88734953704 | 31.956 |
| 44210.92901620371 | 31.995 |
| 44210.97068287038 | 31.995 |
| 44211.01234953704 | 31.995 |
| 44211.05401620371 | 31.937 |
| 44211.09568287038 | 31.956 |
| 44211.13734953704 | 31.956 |
| 44211.17901620371 | 31.995 |
| 44211.22068287038 | 31.995 |
| 44211.26234953704 | 31.956 |
| 44211.30401620371 | 31.956 |
| 44211.34568287038 | 31.956 |
| 44211.38734953704 | 31.976 |
| 44211.42901620371 | 31.995 |
| 44211.47068287038 | 31.976 |
| 44211.51234953704 | 31.976 |
| 44211.55401620371 | 31.995 |
| 44211.59568287038 | 31.995 |
| 44211.63734953704 | 31.976 |
| 44211.67901620371 | 31.956 |
| 44211.72068287038 | 31.956 |
| 44211.76234953704 | 31.976 |
| 44211.80401620371 | 31.976 |
| 44211.84568287038 | 31.976 |
| 44211.88734953704 | 31.995 |
| 44211.92901620371 | 31.956 |
| 44211.97068287038 | 31.976 |
| 44212.01234953704 | 32.014 |
| 44212.05401620371 | 31.937 |
| 44212.09568287038 | 31.976 |
| 44212.13734953704 | 31.976 |
| 44212.17901620371 | 31.956 |
| 44212.22068287038 | 31.995 |
| 44212.26234953704 | 31.976 |
| 44212.30401620371 | 31.995 |
| 44212.34568287038 | 31.956 |
| 44212.38734953704 | 31.995 |
| 44212.42901620371 | 31.995 |
| 44212.47068287038 | 32.053 |
| 44212.51234953704 | 31.995 |
| 44212.55401620371 | 32.034 |
| 44212.59568287038 | 31.995 |
| 44212.63734953704 | 31.976 |
| 44212.67901620371 | 32.014 |
| 44212.72068287038 | 32.034 |
| 44212.76234953704 | 31.976 |
| 44212.80401620371 | 31.976 |
| 44212.84568287038 | 31.976 |
| 44212.88734953704 | 31.956 |
| 44212.92901620371 | 31.995 |
| 44212.97068287038 | 31.995 |
| 44213.01234953704 | 31.976 |
| 44213.05401620371 | 31.976 |
| 44213.09568287038 | 31.976 |
| 44213.13734953704 | 31.956 |
| 44213.17901620371 | 31.976 |
| 44213.22068287038 | 31.995 |
| 44213.26234953704 | 31.995 |
| 44213.30401620371 | 31.976 |
| 44213.34568287038 | 31.956 |
| 44213.38734953704 | 31.995 |
| 44213.42901620371 | 32.014 |
| 44213.47068287038 | 32.014 |
| 44213.51234953704 | 32.014 |
| 44213.55401620371 | 32.053 |
| 44213.59568287038 | 32.053 |
| 44213.63734953704 | 32.014 |
| 44213.67901620371 | 31.995 |
| 44213.72068287038 | 32.014 |
| 44213.76234953704 | 31.995 |
| 44213.80401620371 | 31.976 |
| 44213.84568287038 | 31.995 |
| 44213.88734953704 | 31.956 |
| 44213.92901620371 | 31.956 |
| 44213.97068287038 | 31.995 |
| 44214.01234953704 | 31.976 |
| 44214.05401620371 | 31.995 |
| 44214.09568287038 | 31.976 |
| 44214.13734953704 | 31.956 |
| 44214.17901620371 | 31.976 |
| 44214.22068287038 | 31.976 |
| 44214.26234953704 | 32.014 |
| 44214.30401620371 | 31.976 |
| 44214.34568287038 | 32.034 |
| 44214.38734953704 | 32.014 |
| 44214.42901620371 | 32.014 |
| 44214.47068287038 | 32.014 |
| 44214.51234953704 | 32.034 |
| 44214.55401620371 | 32.014 |
| 44214.59568287038 | 31.995 |
| 44214.63734953704 | 32.014 |
| 44214.67901620371 | 31.995 |
| 44214.72068287038 | 31.976 |
| 44214.76234953704 | 31.956 |
| 44214.80401620371 | 31.956 |
| 44214.84568287038 | 31.956 |
| 44214.88734953704 | 31.976 |
| 44214.92901620371 | 31.976 |
| 44214.97068287038 | 31.995 |
| 44215.01234953704 | 31.976 |
| 44215.05401620371 | 31.956 |
| 44215.09568287038 | 31.976 |
| 44215.13734953704 | 31.976 |
| 44215.17901620371 | 31.995 |
| 44215.22068287038 | 31.956 |
| 44215.26234953704 | 31.956 |
| 44215.30401620371 | 31.956 |
| 44215.34568287038 | 31.956 |
| 44215.38734953704 | 31.956 |
| 44215.42901620371 | 31.995 |
| 44215.47068287038 | 31.995 |
| 44215.51234953704 | 32.014 |
| 44215.55401620371 | 32.072 |
| 44215.59568287038 | 32.034 |
| 44215.63734953704 | 31.995 |
| 44215.67901620371 | 31.995 |
| 44215.72068287038 | 31.976 |
| 44215.76234953704 | 31.956 |
| 44215.80401620371 | 31.995 |
| 44215.84568287038 | 32.014 |
| 44215.88734953704 | 31.956 |
| 44215.92901620371 | 31.976 |
| 44215.97068287038 | 31.976 |
| 44216.01234953704 | 31.918 |
| 44216.05401620371 | 31.976 |
| 44216.09568287038 | 31.976 |
| 44216.13734953704 | 31.956 |
| 44216.17901620371 | 31.956 |
| 44216.22068287038 | 31.918 |
| 44216.26234953704 | 31.956 |
| 44216.30401620371 | 31.976 |
| 44216.34568287038 | 31.976 |
| 44216.38734953704 | 31.976 |
| 44216.42901620371 | 31.995 |
| 44216.47068287038 | 31.956 |
| 44216.51234953704 | 31.976 |
| 44216.55401620371 | 32.034 |
| 44216.59568287038 | 32.014 |
| 44216.63734953704 | 32.014 |
| 44216.67901620371 | 31.995 |
| 44216.72068287038 | 31.995 |
| 44216.76234953704 | 31.956 |
| 44216.80401620371 | 31.956 |
| 44216.84568287038 | 31.956 |
| 44216.88734953704 | 31.976 |
| 44216.92901620371 | 31.956 |
| 44216.97068287038 | 31.956 |
| 44217.01234953704 | 31.937 |
| 44217.05401620371 | 31.995 |
| 44217.09568287038 | 31.976 |
| 44217.13734953704 | 31.976 |
| 44217.17901620371 | 31.956 |
| 44217.22068287038 | 31.976 |
| 44217.26234953704 | 31.976 |
| 44217.30401620371 | 31.937 |
| 44217.34568287038 | 31.976 |
| 44217.38734953704 | 31.976 |
| 44217.42901620371 | 31.995 |
| 44217.47068287038 | 31.995 |
| 44217.51234953704 | 31.995 |
| 44217.55401620371 | 32.053 |
| 44217.59568287038 | 31.995 |
| 44217.63734953704 | 32.053 |
| 44217.67901620371 | 32.014 |
| 44217.72068287038 | 31.976 |
| 44217.76234953704 | 31.956 |
| 44217.80401620371 | 31.976 |
| 44217.84568287038 | 31.956 |
| 44217.88734953704 | 32.014 |
| 44217.92901620371 | 32.014 |
| 44217.97068287038 | 31.937 |
| 44218.01234953704 | 31.995 |
| 44218.05401620371 | 31.976 |
| 44218.09568287038 | 31.976 |
| 44218.13734953704 | 31.976 |
| 44218.17901620371 | 32.014 |
| 44218.22068287038 | 31.956 |
| 44218.26234953704 | 31.976 |
| 44218.30401620371 | 32.014 |
| 44218.34568287038 | 31.976 |
| 44218.38734953704 | 32.014 |
| 44218.42901620371 | 31.995 |
| 44218.47068287038 | 31.995 |
| 44218.51234953704 | 32.034 |
| 44218.55401620371 | 32.053 |
| 44218.59568287038 | 32.053 |
| 44218.63734953704 | 31.995 |
| 44218.67901620371 | 31.976 |
| 44218.72068287038 | 31.995 |
| 44218.76234953704 | 31.976 |
| 44218.80401620371 | 31.976 |
| 44218.84568287038 | 32.034 |
| 44218.88734953704 | 31.995 |
| 44218.92901620371 | 32.014 |
| 44218.97068287038 | 31.995 |
| 44219.01234953704 | 31.937 |
| 44219.05401620371 | 31.956 |
| 44219.09568287038 | 31.995 |
| 44219.13734953704 | 31.995 |
| 44219.17901620371 | 31.976 |
| 44219.22068287038 | 31.956 |
| 44219.26234953704 | 32.014 |
| 44219.30401620371 | 31.995 |
| 44219.34568287038 | 31.976 |
| 44219.38734953704 | 31.976 |
| 44219.42901620371 | 32.014 |
| 44219.47068287038 | 32.053 |
| 44219.51234953704 | 32.072 |
| 44219.55401620371 | 32.034 |
| 44219.59568287038 | 32.053 |
| 44219.63734953704 | 32.053 |
| 44219.67901620371 | 31.995 |
| 44219.72068287038 | 31.976 |
| 44219.76234953704 | 31.995 |
| 44219.80401620371 | 31.995 |
| 44219.84568287038 | 31.976 |
| 44219.88734953704 | 31.995 |
| 44219.92901620371 | 31.956 |
| 44219.97068287038 | 31.956 |
| 44220.01234953704 | 31.956 |
| 44220.05401620371 | 31.956 |
| 44220.09568287038 | 31.956 |
| 44220.13734953704 | 31.956 |
| 44220.17901620371 | 31.976 |
| 44220.22068287038 | 31.976 |
| 44220.26234953704 | 31.976 |
| 44220.30401620371 | 31.976 |
| 44220.34568287038 | 31.995 |
| 44220.38734953704 | 31.995 |
| 44220.42901620371 | 31.976 |
| 44220.47068287038 | 31.976 |
| 44220.51234953704 | 31.995 |
| 44220.55401620371 | 31.995 |
| 44220.59568287038 | 32.034 |
| 44220.63734953704 | 31.995 |
| 44220.67901620371 | 31.976 |
| 44220.72068287038 | 31.976 |
| 44220.76234953704 | 31.956 |
| 44220.80401620371 | 31.937 |
| 44220.84568287038 | 31.976 |
| 44220.88734953704 | 31.976 |
| 44220.92901620371 | 31.976 |
| 44220.97068287038 | 31.956 |
| 44221.01234953704 | 31.956 |
| 44221.05401620371 | 31.937 |
| 44221.09568287038 | 31.918 |
| 44221.13734953704 | 31.956 |
| 44221.17901620371 | 31.956 |
| 44221.22068287038 | 31.976 |
| 44221.26234953704 | 31.956 |
| 44221.30401620371 | 31.995 |
| 44221.34568287038 | 31.976 |
| 44221.38734953704 | 31.918 |
| 44221.42901620371 | 31.956 |
| 44221.47068287038 | 31.995 |
| 44221.51234953704 | 32.034 |
| 44221.55401620371 | 32.014 |
| 44221.59568287038 | 31.995 |
| 44221.63734953704 | 31.995 |
| 44221.67901620371 | 31.995 |
| 44221.72068287038 | 31.995 |
| 44221.76234953704 | 31.956 |
| 44221.80401620371 | 31.937 |
| 44221.84568287038 | 31.937 |
| 44221.88734953704 | 31.937 |
| 44221.92901620371 | 31.976 |
| 44221.97068287038 | 31.976 |
| 44222.01234953704 | 31.976 |
| 44222.05401620371 | 31.995 |
| 44222.09568287038 | 31.976 |
| 44222.13734953704 | 31.956 |
| 44222.17901620371 | 31.956 |
| 44222.22068287038 | 31.937 |
| 44222.26234953704 | 31.956 |
| 44222.30401620371 | 31.976 |
| 44222.34568287038 | 31.956 |
| 44222.38734953704 | 31.976 |
| 44222.42901620371 | 31.937 |
| 44222.47068287038 | 31.995 |
| 44222.51234953704 | 31.995 |
| 44222.55401620371 | 31.995 |
| 44222.59568287038 | 31.956 |
| 44222.63734953704 | 31.937 |
| 44222.67901620371 | 31.937 |
| 44222.72068287038 | 31.995 |
| 44222.76234953704 | 31.976 |
| 44222.80401620371 | 31.937 |
| 44222.84568287038 | 31.956 |
| 44222.88734953704 | 31.976 |
| 44222.92901620371 | 31.937 |
| 44222.97068287038 | 31.956 |
| 44223.01234953704 | 31.956 |
| 44223.05401620371 | 31.956 |
| 44223.09568287038 | 31.995 |
| 44223.13734953704 | 31.976 |
| 44223.17901620371 | 31.956 |
| 44223.22068287038 | 31.976 |
| 44223.26234953704 | 31.995 |
| 44223.30401620371 | 31.918 |
| 44223.34568287038 | 31.956 |
| 44223.38734953704 | 31.937 |
| 44223.42901620371 | 31.995 |
| 44223.47068287038 | 32.014 |
| 44223.51234953704 | 31.976 |
| 44223.55401620371 | 32.014 |
| 44223.59568287038 | 31.976 |
| 44223.63734953704 | 31.995 |
| 44223.67901620371 | 32.014 |
| 44223.72068287038 | 31.976 |
| 44223.76234953704 | 31.976 |
| 44223.80401620371 | 31.995 |
| 44223.84568287038 | 31.976 |
| 44223.88734953704 | 31.976 |
| 44223.92901620371 | 32.014 |
| 44223.97068287038 | 31.956 |
| 44224.01234953704 | 31.956 |
| 44224.05401620371 | 32.014 |
| 44224.09568287038 | 31.976 |
| 44224.13734953704 | 31.976 |
| 44224.17901620371 | 31.995 |
| 44224.22068287038 | 31.956 |
| 44224.26234953704 | 31.956 |
| 44224.30401620371 | 31.976 |
| 44224.34568287038 | 31.995 |
| 44224.38734953704 | 31.995 |
| 44224.42901620371 | 32.014 |
| 44224.47068287038 | 32.072 |
| 44224.51234953704 | 32.034 |
| 44224.55401620371 | 32.092 |
| 44224.59568287038 | 32.072 |
| 44224.63734953704 | 32.053 |
| 44224.67901620371 | 32.034 |
| 44224.72068287038 | 31.976 |
| 44224.76234953704 | 31.976 |
| 44224.80401620371 | 31.995 |
| 44224.84568287038 | 31.995 |
| 44224.88734953704 | 31.976 |
| 44224.92901620371 | 31.937 |
| 44224.97068287038 | 32.014 |
| 44225.01234953704 | 31.956 |
| 44225.05401620371 | 31.976 |
| 44225.09568287038 | 31.976 |
| 44225.13734953704 | 31.956 |
| 44225.17901620371 | 31.956 |
| 44225.22068287038 | 31.956 |
| 44225.26234953704 | 31.956 |
| 44225.30401620371 | 31.976 |
| 44225.34568287038 | 31.976 |
| 44225.38734953704 | 31.995 |
| 44225.42901620371 | 31.995 |
| 44225.47068287038 | 32.053 |
| 44225.51234953704 | 32.092 |
| 44225.55401620371 | 32.092 |
| 44225.59568287038 | 32.092 |
| 44225.63734953704 | 32.034 |
| 44225.67901620371 | 32.034 |
| 44225.72068287038 | 31.976 |
| 44225.76234953704 | 32.014 |
| 44225.80401620371 | 31.976 |
| 44225.84568287038 | 31.956 |
| 44225.88734953704 | 31.976 |
| 44225.92901620371 | 31.956 |
| 44225.97068287038 | 31.995 |
| 44226.01234953704 | 31.976 |
| 44226.05401620371 | 31.995 |
| 44226.09568287038 | 31.956 |
| 44226.13734953704 | 31.995 |
| 44226.17901620371 | 31.918 |
| 44226.22068287038 | 32.014 |
| 44226.26234953704 | 31.995 |
| 44226.30401620371 | 31.976 |
| 44226.34568287038 | 31.995 |
| 44226.38734953704 | 32.014 |
| 44226.42901620371 | 32.053 |
| 44226.47068287038 | 32.13 |
| 44226.51234953704 | 32.034 |
| 44226.55401620371 | 32.014 |
| 44226.59568287038 | 32.034 |
| 44226.63734953704 | 32.034 |
| 44226.67901620371 | 32.034 |
| 44226.72068287038 | 31.995 |
| 44226.76234953704 | 31.995 |
| 44226.80401620371 | 31.956 |
| 44226.84568287038 | 31.956 |
| 44226.88734953704 | 31.956 |
| 44226.92901620371 | 31.995 |
| 44226.97068287038 | 31.976 |
| 44227.01234953704 | 31.956 |
| 44227.05401620371 | 31.956 |
| 44227.09568287038 | 31.956 |
| 44227.13734953704 | 31.918 |
| 44227.17901620371 | 31.937 |
| 44227.22068287038 | 31.995 |
| 44227.26234953704 | 31.937 |
| 44227.30401620371 | 31.976 |
| 44227.34568287038 | 31.956 |
| 44227.38734953704 | 31.976 |
| 44227.42901620371 | 31.995 |
| 44227.47068287038 | 32.072 |
| 44227.51234953704 | 32.13 |
| 44227.55401620371 | 32.149 |
| 44227.59568287038 | 32.111 |
| 44227.63734953704 | 32.092 |
| 44227.67901620371 | 31.995 |
| 44227.72068287038 | 31.995 |
| 44227.76234953704 | 31.956 |
| 44227.80401620371 | 31.976 |
| 44227.84568287038 | 31.976 |
| 44227.88734953704 | 31.995 |
| 44227.92901620371 | 31.937 |
| 44227.97068287038 | 31.956 |
| 44228.01234953704 | 31.976 |
| 44228.05401620371 | 31.995 |
| 44228.09568287038 | 31.937 |
| 44228.13734953704 | 31.937 |
| 44228.17901620371 | 31.956 |
| 44228.22068287038 | 31.956 |
| 44228.26234953704 | 31.937 |
| 44228.30401620371 | 31.956 |
| 44228.34568287038 | 31.937 |
| 44228.38734953704 | 31.956 |
| 44228.42901620371 | 31.956 |
| 44228.47068287038 | 31.995 |
| 44228.51234953704 | 31.937 |
| 44228.55401620371 | 31.937 |
| 44228.59568287038 | 31.976 |
| 44228.63734953704 | 31.976 |
| 44228.67901620371 | 31.995 |
| 44228.72068287038 | 31.976 |
| 44228.76234953704 | 31.995 |
| 44228.80401620371 | 31.976 |
| 44228.84568287038 | 31.937 |
| 44228.88734953704 | 31.918 |
| 44228.92901620371 | 31.956 |
| 44228.97068287038 | 32.014 |
| 44229.01234953704 | 31.956 |
| 44229.05401620371 | 31.995 |
| 44229.09568287038 | 31.976 |
| 44229.13734953704 | 31.956 |
| 44229.17901620371 | 31.937 |
| 44229.22068287038 | 31.937 |
| 44229.26234953704 | 31.956 |
| 44229.30401620371 | 31.956 |
| 44229.34568287038 | 31.956 |
| 44229.38734953704 | 31.976 |
| 44229.42901620371 | 31.937 |
| 44229.47068287038 | 32.014 |
| 44229.51234953704 | 32.053 |
| 44229.55401620371 | 32.111 |
| 44229.59568287038 | 32.092 |
| 44229.63734953704 | 31.976 |
| 44229.67901620371 | 32.034 |
| 44229.72068287038 | 31.995 |
| 44229.76234953704 | 31.976 |
| 44229.80401620371 | 31.937 |
| 44229.84568287038 | 32.014 |
| 44229.88734953704 | 31.918 |
| 44229.92901620371 | 31.956 |
| 44229.97068287038 | 31.937 |
| 44230.01234953704 | 31.956 |
| 44230.05401620371 | 31.995 |
| 44230.09568287038 | 31.956 |
| 44230.13734953704 | 31.995 |
| 44230.17901620371 | 31.995 |
| 44230.22068287038 | 31.956 |
| 44230.26234953704 | 31.995 |
| 44230.30401620371 | 32.014 |
| 44230.34568287038 | 32.034 |
| 44230.38734953704 | 32.053 |
| 44230.42901620371 | 32.111 |
| 44230.47068287038 | 32.111 |
| 44230.51234953704 | 32.034 |
| 44230.55401620371 | 32.053 |
| 44230.59568287038 | 32.072 |
| 44230.63734953704 | 32.053 |
| 44230.67901620371 | 31.976 |
| 44230.72068287038 | 31.995 |
| 44230.76234953704 | 31.976 |
| 44230.80401620371 | 31.976 |
| 44230.84568287038 | 31.937 |
| 44230.88734953704 | 31.995 |
| 44230.92901620371 | 31.976 |
| 44230.97068287038 | 31.976 |
| 44231.01234953704 | 31.937 |
| 44231.05401620371 | 31.956 |
| 44231.09568287038 | 31.976 |
| 44231.13734953704 | 31.976 |
| 44231.17901620371 | 31.976 |
| 44231.22068287038 | 31.976 |
| 44231.26234953704 | 31.976 |
| 44231.30401620371 | 31.937 |
| 44231.34568287038 | 31.995 |
| 44231.38734953704 | 31.976 |
| 44231.42901620371 | 31.956 |
| 44231.47068287038 | 31.956 |
| 44231.51234953704 | 31.976 |
| 44231.55401620371 | 31.956 |
| 44231.59568287038 | 32.053 |
| 44231.63734953704 | 32.034 |
| 44231.67901620371 | 31.995 |
| 44231.72068287038 | 31.937 |
| 44231.76234953704 | 31.956 |
| 44231.80401620371 | 31.937 |
| 44231.84568287038 | 31.956 |
| 44231.88734953704 | 31.976 |
| 44231.92901620371 | 31.937 |
| 44231.97068287038 | 31.976 |
| 44232.01234953704 | 31.956 |
| 44232.05401620371 | 31.937 |
| 44232.09568287038 | 31.976 |
| 44232.13734953704 | 31.976 |
| 44232.17901620371 | 31.976 |
| 44232.22068287038 | 31.918 |
| 44232.26234953704 | 31.995 |
| 44232.30401620371 | 31.976 |
| 44232.34568287038 | 31.937 |
| 44232.38734953704 | 31.995 |
| 44232.42901620371 | 31.976 |
| 44232.47068287038 | 31.995 |
| 44232.51234953704 | 31.956 |
| 44232.55401620371 | 31.995 |
| 44232.59568287038 | 31.995 |
| 44232.63734953704 | 31.976 |
| 44232.67901620371 | 31.995 |
| 44232.72068287038 | 31.976 |
| 44232.76234953704 | 31.937 |
| 44232.80401620371 | 31.976 |
| 44232.84568287038 | 31.956 |
| 44232.88734953704 | 31.956 |
| 44232.92901620371 | 31.937 |
| 44232.97068287038 | 31.956 |
| 44233.01234953704 | 31.918 |
| 44233.05401620371 | 31.937 |
| 44233.09568287038 | 31.956 |
| 44233.13734953704 | 31.937 |
| 44233.17901620371 | 31.956 |
| 44233.22068287038 | 31.976 |
| 44233.26234953704 | 31.956 |
| 44233.30401620371 | 31.976 |
| 44233.34568287038 | 31.976 |
| 44233.38734953704 | 31.956 |
| 44233.42901620371 | 31.956 |
| 44233.47068287038 | 32.053 |
| 44233.51234953704 | 32.13 |
| 44233.55401620371 | 32.169 |
| 44233.59568287038 | 32.053 |
| 44233.63734953704 | 32.034 |
| 44233.67901620371 | 32.034 |
| 44233.72068287038 | 31.976 |
| 44233.76234953704 | 31.976 |
| 44233.80401620371 | 31.956 |
| 44233.84568287038 | 31.956 |
| 44233.88734953704 | 31.956 |
| 44233.92901620371 | 31.956 |
| 44233.97068287038 | 31.976 |
| 44234.01234953704 | 31.976 |
| 44234.05401620371 | 31.956 |
| 44234.09568287038 | 31.976 |
| 44234.13734953704 | 32.014 |
| 44234.17901620371 | 31.956 |
| 44234.22068287038 | 31.956 |
| 44234.26234953704 | 31.956 |
| 44234.30401620371 | 31.995 |
| 44234.34568287038 | 31.995 |
| 44234.38734953704 | 31.976 |
| 44234.42901620371 | 32.053 |
| 44234.47068287038 | 32.13 |
| 44234.51234953704 | 32.188 |
| 44234.55401620371 | 32.207 |
| 44234.59568287038 | 32.169 |
| 44234.63734953704 | 32.092 |
| 44234.67901620371 | 32.034 |
| 44234.72068287038 | 31.995 |
| 44234.76234953704 | 31.956 |
| 44234.80401620371 | 31.956 |
| 44234.84568287038 | 31.937 |
| 44234.88734953704 | 31.956 |
| 44234.92901620371 | 31.937 |
| 44234.97068287038 | 31.918 |
| 44235.01234953704 | 31.995 |
| 44235.05401620371 | 31.976 |
| 44235.09568287038 | 31.976 |
| 44235.13734953704 | 31.956 |
| 44235.17901620371 | 31.937 |
| 44235.22068287038 | 31.976 |
| 44235.26234953704 | 31.995 |
| 44235.30401620371 | 31.976 |
| 44235.34568287038 | 31.976 |
| 44235.38734953704 | 31.976 |
| 44235.42901620371 | 31.956 |
| 44235.47068287038 | 32.169 |
| 44235.51234953704 | 32.227 |
| 44235.55401620371 | 32.246 |
| 44235.59568287038 | 32.188 |
| 44235.63734953704 | 32.13 |
| 44235.67901620371 | 31.995 |
| 44235.72068287038 | 31.995 |
| 44235.76234953704 | 31.956 |
| 44235.80401620371 | 31.956 |
| 44235.84568287038 | 31.956 |
| 44235.88734953704 | 31.956 |
| 44235.92901620371 | 31.956 |
| 44235.97068287038 | 31.956 |
| 44236.01234953704 | 31.956 |
| 44236.05401620371 | 31.995 |
| 44236.09568287038 | 31.976 |
| 44236.13734953704 | 31.995 |
| 44236.17901620371 | 31.976 |
| 44236.22068287038 | 31.956 |
| 44236.26234953704 | 31.976 |
| 44236.30401620371 | 31.976 |
| 44236.34568287038 | 31.976 |
| 44236.38734953704 | 32.072 |
| 44236.42901620371 | 32.13 |
| 44236.47068287038 | 32.188 |
| 44236.51234953704 | 32.188 |
| 44236.55401620371 | 32.149 |
| 44236.59568287038 | 32.227 |
| 44236.63734953704 | 32.13 |
| 44236.67901620371 | 32.053 |
| 44236.72068287038 | 32.053 |
| 44236.76234953704 | 32.034 |
| 44236.80401620371 | 32.053 |
| 44236.84568287038 | 31.995 |
| 44236.88734953704 | 31.956 |
| 44236.92901620371 | 32.014 |
| 44236.97068287038 | 31.976 |
| 44237.01234953704 | 31.995 |
| 44237.05401620371 | 32.014 |
| 44237.09568287038 | 31.995 |
| 44237.13734953704 | 32.014 |
| 44237.17901620371 | 31.995 |
| 44237.22068287038 | 32.034 |
| 44237.26234953704 | 31.976 |
| 44237.30401620371 | 31.976 |
| 44237.34568287038 | 31.995 |
| 44237.38734953704 | 32.053 |
| 44237.42901620371 | 32.13 |
| 44237.47068287038 | 32.169 |
| 44237.51234953704 | 32.207 |
| 44237.55401620371 | 32.304 |
| 44237.59568287038 | 32.188 |
| 44237.63734953704 | 32.111 |
| 44237.67901620371 | 32.072 |
| 44237.72068287038 | 31.976 |
| 44237.76234953704 | 31.976 |
| 44237.80401620371 | 31.976 |
| 44237.84568287038 | 31.937 |
| 44237.88734953704 | 31.956 |
| 44237.92901620371 | 31.976 |
| 44237.97068287038 | 31.956 |
| 44238.01234953704 | 31.976 |
| 44238.05401620371 | 31.976 |
| 44238.09568287038 | 31.976 |
| 44238.13734953704 | 31.995 |
| 44238.17901620371 | 31.956 |
| 44238.22068287038 | 31.976 |
| 44238.26234953704 | 31.976 |
| 44238.30401620371 | 31.937 |
| 44238.34568287038 | 31.995 |
| 44238.38734953704 | 32.034 |
| 44238.42901620371 | 32.034 |
| 44238.47068287038 | 32.111 |
| 44238.51234953704 | 32.149 |
| 44238.55401620371 | 32.111 |
| 44238.59568287038 | 32.111 |
| 44238.63734953704 | 32.092 |
| 44238.67901620371 | 32.053 |
| 44238.72068287038 | 32.053 |
| 44238.76234953704 | 31.995 |
| 44238.80401620371 | 31.976 |
| 44238.84568287038 | 31.995 |
| 44238.88734953704 | 32.014 |
| 44238.92901620371 | 32.014 |
| 44238.97068287038 | 32.014 |
| 44239.01234953704 | 31.995 |
| 44239.05401620371 | 32.014 |
| 44239.09568287038 | 31.976 |
| 44239.13734953704 | 31.995 |
| 44239.17901620371 | 31.995 |
| 44239.22068287038 | 31.995 |
| 44239.26234953704 | 31.976 |
| 44239.30401620371 | 31.956 |
| 44239.34568287038 | 32.034 |
| 44239.38734953704 | 32.053 |
| 44239.42901620371 | 32.053 |
| 44239.47068287038 | 32.13 |
| 44239.51234953704 | 32.072 |
| 44239.55401620371 | 32.149 |
| 44239.59568287038 | 32.246 |
| 44239.63734953704 | 32.169 |
| 44239.67901620371 | 32.092 |
| 44239.72068287038 | 32.053 |
| 44239.76234953704 | 32.034 |
| 44239.80401620371 | 31.995 |
| 44239.84568287038 | 31.995 |
| 44239.88734953704 | 32.034 |
| 44239.92901620371 | 32.014 |
| 44239.97068287038 | 31.956 |
| 44240.01234953704 | 31.976 |
| 44240.05401620371 | 31.976 |
| 44240.09568287038 | 31.976 |
| 44240.13734953704 | 31.995 |
| 44240.17901620371 | 31.956 |
| 44240.22068287038 | 31.976 |
| 44240.26234953704 | 31.976 |
| 44240.30401620371 | 31.937 |
| 44240.34568287038 | 31.956 |
| 44240.38734953704 | 32.053 |
| 44240.42901620371 | 32.149 |
| 44240.47068287038 | 32.265 |
| 44240.51234953704 | 32.207 |
| 44240.55401620371 | 32.207 |
| 44240.59568287038 | 32.207 |
| 44240.63734953704 | 32.188 |
| 44240.67901620371 | 32.13 |
| 44240.72068287038 | 32.053 |
| 44240.76234953704 | 32.053 |
| 44240.80401620371 | 32.014 |
| 44240.84568287038 | 32.034 |
| 44240.88734953704 | 32.072 |
| 44240.92901620371 | 32.072 |
| 44240.97068287038 | 32.072 |
| 44241.01234953704 | 32.034 |
| 44241.05401620371 | 32.053 |
| 44241.09568287038 | 31.976 |
| 44241.13734953704 | 31.976 |
| 44241.17901620371 | 31.956 |
| 44241.22068287038 | 31.976 |
| 44241.26234953704 | 31.956 |
| 44241.30401620371 | 31.937 |
| 44241.34568287038 | 31.976 |
| 44241.38734953704 | 31.976 |
| 44241.42901620371 | 31.956 |
| 44241.47068287038 | 31.995 |
| 44241.51234953704 | 32.111 |
| 44241.55401620371 | 32.343 |
| 44241.59568287038 | 32.4 |
| 44241.63734953704 | 32.323 |
| 44241.67901620371 | 32.169 |
| 44241.72068287038 | 31.976 |
| 44241.76234953704 | 31.976 |
| 44241.80401620371 | 31.937 |
| 44241.84568287038 | 31.956 |
| 44241.88734953704 | 31.976 |
| 44241.92901620371 | 31.976 |
| 44241.97068287038 | 31.956 |
| 44242.01234953704 | 31.937 |
| 44242.05401620371 | 31.956 |
| 44242.09568287038 | 31.976 |
| 44242.13734953704 | 31.937 |
| 44242.17901620371 | 31.937 |
| 44242.22068287038 | 31.918 |
| 44242.26234953704 | 31.976 |
| 44242.30401620371 | 31.976 |
| 44242.34568287038 | 31.976 |
| 44242.38734953704 | 31.956 |
| 44242.42901620371 | 31.956 |
| 44242.47068287038 | 31.976 |
| 44242.51234953704 | 31.956 |
| 44242.55401620371 | 31.995 |
| 44242.59568287038 | 32.014 |
| 44242.63734953704 | 31.995 |
| 44242.67901620371 | 32.034 |
| 44242.72068287038 | 31.956 |
| 44242.76234953704 | 31.937 |
| 44242.80401620371 | 31.976 |
| 44242.84568287038 | 31.956 |
| 44242.88734953704 | 31.937 |
| 44242.92901620371 | 31.937 |
| 44242.97068287038 | 31.956 |
| 44243.01234953704 | 31.937 |
| 44243.05401620371 | 31.956 |
| 44243.09568287038 | 31.956 |
| 44243.13734953704 | 31.956 |
| 44243.17901620371 | 31.937 |
| 44243.22068287038 | 31.937 |
| 44243.26234953704 | 31.937 |
| 44243.30401620371 | 31.976 |
| 44243.34568287038 | 31.956 |
| 44243.38734953704 | 31.976 |
| 44243.42901620371 | 32.014 |
| 44243.47068287038 | 31.976 |
| 44243.51234953704 | 31.995 |
| 44243.55401620371 | 32.13 |
| 44243.59568287038 | 32.053 |
| 44243.63734953704 | 32.072 |
| 44243.67901620371 | 31.995 |
| 44243.72068287038 | 31.976 |
| 44243.76234953704 | 31.937 |
| 44243.80401620371 | 31.976 |
| 44243.84568287038 | 31.937 |
| 44243.88734953704 | 31.956 |
| 44243.92901620371 | 31.956 |
| 44243.97068287038 | 31.956 |
| 44244.01234953704 | 31.956 |
| 44244.05401620371 | 31.995 |
| 44244.09568287038 | 31.995 |
| 44244.13734953704 | 31.956 |
| 44244.17901620371 | 31.956 |
| 44244.22068287038 | 31.918 |
| 44244.26234953704 | 31.937 |
| 44244.30401620371 | 31.956 |
| 44244.34568287038 | 31.976 |
| 44244.38734953704 | 31.976 |
| 44244.42901620371 | 31.937 |
| 44244.47068287038 | 31.976 |
| 44244.51234953704 | 31.956 |
| 44244.55401620371 | 31.995 |
| 44244.59568287038 | 31.995 |
| 44244.63734953704 | 31.956 |
| 44244.67901620371 | 31.995 |
| 44244.72068287038 | 31.976 |
| 44244.76234953704 | 31.918 |
| 44244.80401620371 | 31.918 |
| 44244.84568287038 | 31.976 |
| 44244.88734953704 | 31.937 |
| 44244.92901620371 | 32.014 |
| 44244.97068287038 | 31.956 |
| 44245.01234953704 | 31.956 |
| 44245.05401620371 | 31.937 |
| 44245.09568287038 | 31.956 |
| 44245.13734953704 | 31.956 |
| 44245.17901620371 | 31.937 |
| 44245.22068287038 | 31.956 |
| 44245.26234953704 | 31.976 |
| 44245.30401620371 | 31.976 |
| 44245.34568287038 | 31.976 |
| 44245.38734953704 | 31.976 |
| 44245.42901620371 | 31.976 |
| 44245.47068287038 | 31.956 |
| 44245.51234953704 | 31.976 |
| 44245.55401620371 | 31.937 |
| 44245.59568287038 | 31.976 |
| 44245.63734953704 | 31.918 |
| 44245.67901620371 | 31.937 |
| 44245.72068287038 | 31.976 |
| 44245.76234953704 | 31.976 |
| 44245.80401620371 | 31.956 |
| 44245.84568287038 | 31.976 |
| 44245.88734953704 | 31.956 |
| 44245.92901620371 | 31.956 |
| 44245.97068287038 | 31.918 |
| 44246.01234953704 | 31.995 |
| 44246.05401620371 | 31.937 |
| 44246.09568287038 | 31.956 |
| 44246.13734953704 | 31.937 |
| 44246.17901620371 | 32.014 |
| 44246.22068287038 | 31.937 |
| 44246.26234953704 | 31.937 |
| 44246.30401620371 | 31.956 |
| 44246.34568287038 | 31.956 |
| 44246.38734953704 | 31.976 |
| 44246.42901620371 | 31.956 |
| 44246.47068287038 | 31.956 |
| 44246.51234953704 | 31.937 |
| 44246.55401620371 | 31.956 |
| 44246.59568287038 | 31.956 |
| 44246.63734953704 | 31.976 |
| 44246.67901620371 | 31.956 |
| 44246.72068287038 | 31.956 |
| 44246.76234953704 | 31.956 |
| 44246.80401620371 | 31.976 |
| 44246.84568287038 | 31.918 |
| 44246.88734953704 | 31.937 |
| 44246.92901620371 | 31.976 |
| 44246.97068287038 | 31.976 |
| 44247.01234953704 | 31.937 |
| 44247.05401620371 | 31.976 |
| 44247.09568287038 | 31.956 |
| 44247.13734953704 | 31.937 |
| 44247.17901620371 | 31.956 |
| 44247.22068287038 | 31.956 |
| 44247.26234953704 | 31.995 |
| 44247.30401620371 | 31.937 |
| 44247.34568287038 | 31.976 |
| 44247.38734953704 | 31.956 |
| 44247.42901620371 | 31.956 |
| 44247.47068287038 | 31.956 |
| 44247.51234953704 | 31.995 |
| 44247.55401620371 | 32.053 |
| 44247.59568287038 | 32.034 |
| 44247.63734953704 | 31.995 |
| 44247.67901620371 | 31.995 |
| 44247.72068287038 | 31.976 |
| 44247.76234953704 | 31.937 |
| 44247.80401620371 | 31.937 |
| 44247.84568287038 | 31.956 |
| 44247.88734953704 | 31.976 |
| 44247.92901620371 | 31.937 |
| 44247.97068287038 | 31.995 |
| 44248.01234953704 | 31.976 |
| 44248.05401620371 | 31.995 |
| 44248.09568287038 | 31.956 |
| 44248.13734953704 | 31.976 |
| 44248.17901620371 | 31.956 |
| 44248.22068287038 | 31.937 |
| 44248.26234953704 | 31.956 |
| 44248.30401620371 | 31.956 |
| 44248.34568287038 | 31.976 |
| 44248.38734953704 | 32.014 |
| 44248.42901620371 | 31.976 |
| 44248.47068287038 | 31.937 |
| 44248.51234953704 | 31.956 |
| 44248.55401620371 | 31.956 |
| 44248.59568287038 | 31.995 |
| 44248.63734953704 | 31.937 |
| 44248.67901620371 | 31.995 |
| 44248.72068287038 | 31.995 |
| 44248.76234953704 | 31.976 |
| 44248.80401620371 | 31.956 |
| 44248.84568287038 | 31.937 |
| 44248.88734953704 | 31.956 |
| 44248.92901620371 | 31.976 |
| 44248.97068287038 | 31.976 |
| 44249.01234953704 | 31.976 |
| 44249.05401620371 | 31.956 |
| 44249.09568287038 | 31.976 |
| 44249.13734953704 | 31.995 |
| 44249.17901620371 | 31.937 |
| 44249.22068287038 | 31.937 |
| 44249.26234953704 | 31.956 |
| 44249.30401620371 | 31.937 |
| 44249.34568287038 | 31.956 |
| 44249.38734953704 | 32.014 |
| 44249.42901620371 | 31.995 |
| 44249.47068287038 | 32.111 |
| 44249.51234953704 | 32.149 |
| 44249.55401620371 | 32.381 |
| 44249.59568287038 | 32.613 |
| 44249.63734953704 | 32.497 |
| 44249.67901620371 | 32.111 |
| 44249.72068287038 | 32.13 |
| 44249.76234953704 | 32.111 |
| 44249.80401620371 | 31.995 |
| 44249.84568287038 | 31.956 |
| 44249.88734953704 | 31.918 |
| 44249.92901620371 | 31.956 |
| 44249.97068287038 | 31.976 |
| 44250.01234953704 | 31.918 |
| 44250.05401620371 | 31.956 |
| 44250.09568287038 | 31.956 |
| 44250.13734953704 | 31.937 |
| 44250.17901620371 | 31.956 |
| 44250.22068287038 | 31.956 |
| 44250.26234953704 | 31.956 |
| 44250.30401620371 | 31.956 |
| 44250.34568287038 | 31.976 |
| 44250.38734953704 | 31.956 |
| 44250.42901620371 | 31.995 |
| 44250.47068287038 | 31.956 |
| 44250.51234953704 | 31.956 |
| 44250.55401620371 | 32.169 |
| 44250.59568287038 | 32.478 |
| 44250.63734953704 | 33.211 |
| 44250.67901620371 | 33.134 |
| 44250.72068287038 | 32.787 |
| 44250.76234953704 | 32.729 |
| 44250.80401620371 | 32.767 |
| 44250.84568287038 | 32.574 |
| 44250.88734953704 | 32.42 |
| 44250.92901620371 | 32.265 |
| 44250.97068287038 | 32.111 |
| 44251.01234953704 | 32.053 |
| 44251.05401620371 | 31.995 |
| 44251.09568287038 | 32.034 |
| 44251.13734953704 | 32.053 |
| 44251.17901620371 | 32.034 |
| 44251.22068287038 | 31.898 |
| 44251.26234953704 | 31.956 |
| 44251.30401620371 | 31.918 |
| 44251.34568287038 | 31.937 |
| 44251.38734953704 | 31.956 |
| 44251.42901620371 | 31.995 |
| 44251.47068287038 | 32.458 |
| 44251.51234953704 | 33.288 |
| 44251.55401620371 | 33.906 |
| 44251.59568287038 | 34.389 |
| 44251.63734953704 | 34.756 |
| 44251.67901620371 | 34.563 |
| 44251.72068287038 | 34.061 |
| 44251.76234953704 | 33.848 |
| 44251.80401620371 | 33.578 |
| 44251.84568287038 | 33.327 |
| 44251.88734953704 | 32.844 |
| 44251.92901620371 | 32.265 |
| 44251.97068287038 | 31.937 |
| 44252.01234953704 | 31.995 |
| 44252.05401620371 | 31.976 |
| 44252.09568287038 | 31.937 |
| 44252.13734953704 | 31.956 |
| 44252.17901620371 | 31.937 |
| 44252.22068287038 | 31.995 |
| 44252.26234953704 | 31.956 |
| 44252.30401620371 | 31.956 |
| 44252.34568287038 | 31.976 |
| 44252.38734953704 | 31.937 |
| 44252.42901620371 | 32.014 |
| 44252.47068287038 | 32.207 |
| 44252.51234953704 | 33.597 |
| 44252.55401620371 | 34.929 |
| 44252.59568287038 | 35.76 |
| 44252.63734953704 | 35.663 |
| 44252.67901620371 | 35.2 |
| 44252.72068287038 | 34.678 |
| 44252.76234953704 | 34.254 |
| 44252.80401620371 | 33.868 |
| 44252.84568287038 | 33.057 |
| 44252.88734953704 | 32.362 |
| 44252.92901620371 | 31.937 |
| 44252.97068287038 | 31.995 |
| 44253.01234953704 | 31.956 |
| 44253.05401620371 | 31.937 |
| 44253.09568287038 | 31.937 |
| 44253.13734953704 | 31.937 |
| 44253.17901620371 | 31.976 |
| 44253.22068287038 | 31.918 |
| 44253.26234953704 | 31.937 |
| 44253.30401620371 | 31.937 |
| 44253.34568287038 | 31.956 |
| 44253.38734953704 | 31.976 |
| 44253.42901620371 | 31.956 |
| 44253.47068287038 | 31.956 |
| 44253.51234953704 | 31.995 |
| 44253.55401620371 | 32.227 |
| 44253.59568287038 | 32.941 |
| 44253.63734953704 | 33.501 |
| 44253.67901620371 | 33.231 |
| 44253.72068287038 | 32.729 |
| 44253.76234953704 | 32.188 |
| 44253.80401620371 | 32.149 |
| 44253.84568287038 | 32.246 |
| 44253.88734953704 | 32.188 |
| 44253.92901620371 | 32.072 |
| 44253.97068287038 | 31.937 |
| 44254.01234953704 | 31.956 |
| 44254.05401620371 | 31.918 |
| 44254.09568287038 | 31.956 |
| 44254.13734953704 | 31.956 |
| 44254.17901620371 | 31.937 |
| 44254.22068287038 | 31.937 |
| 44254.26234953704 | 31.976 |
| 44254.30401620371 | 31.918 |
| 44254.34568287038 | 31.956 |
| 44254.38734953704 | 31.976 |
| 44254.42901620371 | 31.995 |
| 44254.47068287038 | 31.976 |
| 44254.51234953704 | 31.956 |
| 44254.55401620371 | 31.918 |
| 44254.59568287038 | 32.246 |
| 44254.63734953704 | 32.69 |
| 44254.67901620371 | 32.902 |
| 44254.72068287038 | 32.767 |
| 44254.76234953704 | 32.439 |
| 44254.80401620371 | 31.995 |
| 44254.84568287038 | 31.956 |
| 44254.88734953704 | 31.956 |
| 44254.92901620371 | 31.937 |
| 44254.97068287038 | 31.976 |
| 44255.01234953704 | 31.976 |
| 44255.05401620371 | 31.956 |
| 44255.09568287038 | 31.956 |
| 44255.13734953704 | 31.937 |
| 44255.17901620371 | 31.918 |
| 44255.22068287038 | 31.976 |
| 44255.26234953704 | 31.937 |
| 44255.30401620371 | 31.956 |
| 44255.34568287038 | 31.976 |
| 44255.38734953704 | 31.956 |
| 44255.42901620371 | 31.976 |
| 44255.47068287038 | 32.014 |
| 44255.51234953704 | 32.072 |
| 44255.55401620371 | 32.632 |
| 44255.59568287038 | 33.134 |
| 44255.63734953704 | 33.366 |
| 44255.67901620371 | 32.844 |
| 44255.72068287038 | 32.092 |
| 44255.76234953704 | 31.937 |
| 44255.80401620371 | 31.995 |
| 44255.84568287038 | 31.918 |
| 44255.88734953704 | 31.976 |
| 44255.92901620371 | 31.976 |
| 44255.97068287038 | 31.976 |
| 44256.01234953704 | 31.976 |
| 44256.05401620371 | 31.976 |
| 44256.09568287038 | 32.014 |
| 44256.13734953704 | 31.937 |
| 44256.17901620371 | 31.956 |
| 44256.22068287038 | 31.976 |
| 44256.26234953704 | 31.918 |
| 44256.30401620371 | 31.956 |
| 44256.34568287038 | 31.956 |
| 44256.38734953704 | 31.956 |
| 44256.42901620371 | 31.956 |
| 44256.47068287038 | 31.937 |
| 44256.51234953704 | 31.995 |
| 44256.55401620371 | 31.995 |
| 44256.59568287038 | 32.188 |
| 44256.63734953704 | 32.42 |
| 44256.67901620371 | 32.458 |
| 44256.72068287038 | 32.053 |
| 44256.76234953704 | 31.956 |
| 44256.80401620371 | 31.976 |
| 44256.84568287038 | 31.976 |
| 44256.88734953704 | 31.976 |
| 44256.92901620371 | 31.956 |
| 44256.97068287038 | 31.937 |
| 44257.01234953704 | 31.956 |
| 44257.05401620371 | 31.937 |
| 44257.09568287038 | 31.956 |
| 44257.13734953704 | 31.976 |
| 44257.17901620371 | 31.995 |
| 44257.22068287038 | 31.995 |
| 44257.26234953704 | 31.956 |
| 44257.30401620371 | 31.956 |
| 44257.34568287038 | 32.014 |
| 44257.38734953704 | 31.976 |
| 44257.42901620371 | 31.976 |
| 44257.47068287038 | 31.937 |
| 44257.51234953704 | 31.976 |
| 44257.55401620371 | 31.956 |
| 44257.59568287038 | 31.995 |
| 44257.63734953704 | 32.111 |
| 44257.67901620371 | 32.169 |
| 44257.72068287038 | 32.014 |
| 44257.76234953704 | 31.956 |
| 44257.80401620371 | 31.918 |
| 44257.84568287038 | 31.937 |
| 44257.88734953704 | 31.995 |
| 44257.92901620371 | 31.956 |
| 44257.97068287038 | 31.937 |
| 44258.01234953704 | 31.995 |
| 44258.05401620371 | 31.956 |
| 44258.09568287038 | 31.937 |
| 44258.13734953704 | 31.937 |
| 44258.17901620371 | 31.956 |
| 44258.22068287038 | 31.956 |
| 44258.26234953704 | 31.976 |
| 44258.30401620371 | 31.918 |
| 44258.34568287038 | 31.995 |
| 44258.38734953704 | 31.995 |
| 44258.42901620371 | 31.937 |
| 44258.47068287038 | 31.956 |
| 44258.51234953704 | 32.014 |
| 44258.55401620371 | 32.014 |
| 44258.59568287038 | 32.13 |
| 44258.63734953704 | 32.844 |
| 44258.67901620371 | 33.018 |
| 44258.72068287038 | 32.381 |
| 44258.76234953704 | 31.976 |
| 44258.80401620371 | 31.956 |
| 44258.84568287038 | 31.956 |
| 44258.88734953704 | 31.937 |
| 44258.92901620371 | 31.956 |
| 44258.97068287038 | 31.976 |
| 44259.01234953704 | 31.937 |
| 44259.05401620371 | 31.937 |
| 44259.09568287038 | 31.956 |
| 44259.13734953704 | 31.976 |
| 44259.17901620371 | 31.976 |
| 44259.22068287038 | 31.976 |
| 44259.26234953704 | 31.976 |
| 44259.30401620371 | 31.918 |
| 44259.34568287038 | 31.937 |
| 44259.38734953704 | 31.956 |
| 44259.42901620371 | 31.976 |
| 44259.47068287038 | 31.976 |
| 44259.51234953704 | 31.976 |
| 44259.55401620371 | 31.995 |
| 44259.59568287038 | 31.956 |
| 44259.63734953704 | 31.956 |
| 44259.67901620371 | 31.976 |
| 44259.72068287038 | 31.995 |
| 44259.76234953704 | 31.956 |
| 44259.80401620371 | 31.976 |
| 44259.84568287038 | 31.976 |
| 44259.88734953704 | 31.976 |
| 44259.92901620371 | 31.937 |
| 44259.97068287038 | 31.937 |
| 44260.01234953704 | 31.956 |
| 44260.05401620371 | 31.976 |
| 44260.09568287038 | 31.937 |
| 44260.13734953704 | 31.956 |
| 44260.17901620371 | 31.995 |
| 44260.22068287038 | 31.937 |
| 44260.26234953704 | 31.976 |
| 44260.30401620371 | 31.976 |
| 44260.34568287038 | 31.956 |
| 44260.38734953704 | 31.995 |
| 44260.42901620371 | 31.976 |
| 44260.47068287038 | 31.976 |
| 44260.51234953704 | 31.976 |
| 44260.55401620371 | 32.806 |
| 44260.59568287038 | 35.682 |
| 44260.63734953704 | 36.319 |
| 44260.67901620371 | 36.049 |
| 44260.72068287038 | 35.624 |
| 44260.76234953704 | 35.431 |
| 44260.80401620371 | 35.142 |
| 44260.84568287038 | 34.659 |
| 44260.88734953704 | 34.061 |
| 44260.92901620371 | 33.404 |
| 44260.97068287038 | 32.902 |
| 44261.01234953704 | 32.632 |
| 44261.05401620371 | 32.439 |
| 44261.09568287038 | 32.4 |
| 44261.13734953704 | 32.343 |
| 44261.17901620371 | 32.265 |
| 44261.22068287038 | 32.188 |
| 44261.26234953704 | 32.053 |
| 44261.30401620371 | 31.918 |
| 44261.34568287038 | 31.956 |
| 44261.38734953704 | 32.227 |
| 44261.42901620371 | 33.308 |
| 44261.47068287038 | 34.814 |
| 44261.51234953704 | 36.377 |
| 44261.55401620371 | 37.883 |
| 44261.59568287038 | 39.022 |
| 44261.63734953704 | 38.906 |
| 44261.67901620371 | 37.806 |
| 44261.72068287038 | 37.246 |
| 44261.76234953704 | 36.107 |
| 44261.80401620371 | 35.644 |
| 44261.84568287038 | 35.026 |
| 44261.88734953704 | 34.312 |
| 44261.92901620371 | 33.752 |
| 44261.97068287038 | 33.288 |
| 44262.01234953704 | 33.057 |
| 44262.05401620371 | 32.98 |
| 44262.09568287038 | 32.883 |
| 44262.13734953704 | 32.844 |
| 44262.17901620371 | 32.864 |
| 44262.22068287038 | 32.787 |
| 44262.26234953704 | 32.613 |
| 44262.30401620371 | 32.4 |
| 44262.34568287038 | 32.478 |
| 44262.38734953704 | 33.173 |
| 44262.42901620371 | 34.37 |
| 44262.47068287038 | 36.126 |
| 44262.51234953704 | 37.42 |
| 44262.55401620371 | 38.443 |
| 44262.59568287038 | 39.621 |
| 44262.63734953704 | 40.045 |
| 44262.67901620371 | 39.736 |
| 44262.72068287038 | 39.64 |
| 44262.76234953704 | 38.848 |
| 44262.80401620371 | 37.96 |
| 44262.84568287038 | 37.207 |
| 44262.88734953704 | 36.358 |
| 44262.92901620371 | 35.663 |
| 44262.97068287038 | 35.142 |
| 44263.01234953704 | 34.698 |
| 44263.05401620371 | 34.485 |
| 44263.09568287038 | 34.312 |
| 44263.13734953704 | 34.35 |
| 44263.17901620371 | 34.389 |
| 44263.22068287038 | 34.408 |
| 44263.26234953704 | 34.408 |
| 44263.30401620371 | 34.35 |
| 44263.34568287038 | 34.408 |
| 44263.38734953704 | 34.852 |
| 44263.42901620371 | 35.856 |
| 44263.47068287038 | 37.072 |
| 44263.51234953704 | 37.96 |
| 44263.55401620371 | 38.945 |
| 44263.59568287038 | 39.756 |
| 44263.63734953704 | 39.485 |
| 44263.67901620371 | 38.829 |
| 44263.72068287038 | 38.443 |
| 44263.76234953704 | 37.767 |
| 44263.80401620371 | 36.995 |
| 44263.84568287038 | 36.397 |
| 44263.88734953704 | 35.76 |
| 44263.92901620371 | 35.238 |
| 44263.97068287038 | 34.852 |
| 44264.01234953704 | 34.64 |
| 44264.05401620371 | 34.505 |
| 44264.09568287038 | 34.485 |
| 44264.13734953704 | 34.312 |
| 44264.17901620371 | 34.234 |
| 44264.22068287038 | 34.119 |
| 44264.26234953704 | 33.945 |
| 44264.30401620371 | 33.694 |
| 44264.34568287038 | 33.771 |
| 44264.38734953704 | 34.196 |
| 44264.42901620371 | 35.624 |
| 44264.47068287038 | 37.188 |
| 44264.51234953704 | 38.926 |
| 44264.55401620371 | 40.76 |
| 44264.59568287038 | 41.995 |
| 44264.63734953704 | 42.13 |
| 44264.67901620371 | 41.86 |
| 44264.72068287038 | 40.837 |
| 44264.76234953704 | 40.065 |
| 44264.80401620371 | 39.041 |
| 44264.84568287038 | 38.115 |
| 44264.88734953704 | 37.4 |
| 44264.92901620371 | 36.956 |
| 44264.97068287038 | 36.648 |
| 44265.01234953704 | 36.57 |
| 44265.05401620371 | 36.609 |
| 44265.09568287038 | 36.261 |
| 44265.13734953704 | 36.204 |
| 44265.17901620371 | 36.126 |
| 44265.22068287038 | 35.875 |
| 44265.26234953704 | 35.798 |
| 44265.30401620371 | 35.142 |
| 44265.34568287038 | 35.065 |
| 44265.38734953704 | 35.586 |
| 44265.42901620371 | 36.512 |
| 44265.47068287038 | 38.115 |
| 44265.51234953704 | 39.234 |
| 44265.55401620371 | 39.717 |
| 44265.59568287038 | 40.238 |
| 44265.63734953704 | 39.775 |
| 44265.67901620371 | 38.462 |
| 44265.72068287038 | 37.883 |
| 44265.76234953704 | 37.014 |
| 44265.80401620371 | 36.126 |
| 44265.84568287038 | 35.258 |
| 44265.88734953704 | 34.389 |
| 44265.92901620371 | 33.462 |
| 44265.97068287038 | 32.729 |
| 44266.01234953704 | 32.149 |
| 44266.05401620371 | 31.918 |
| 44266.09568287038 | 31.956 |
| 44266.13734953704 | 31.918 |
| 44266.17901620371 | 31.956 |
| 44266.22068287038 | 31.976 |
| 44266.26234953704 | 31.956 |
| 44266.30401620371 | 31.976 |
| 44266.34568287038 | 31.995 |
| 44266.38734953704 | 31.995 |
| 44266.42901620371 | 31.976 |
| 44266.47068287038 | 31.937 |
| 44266.51234953704 | 33.173 |
| 44266.55401620371 | 35.142 |
| 44266.59568287038 | 37.304 |
| 44266.63734953704 | 38.134 |
| 44266.67901620371 | 37.632 |
| 44266.72068287038 | 35.76 |
| 44266.76234953704 | 35.18 |
| 44266.80401620371 | 34.891 |
| 44266.84568287038 | 34.312 |
| 44266.88734953704 | 33.559 |
| 44266.92901620371 | 32.787 |
| 44266.97068287038 | 32.323 |
| 44267.01234953704 | 32.053 |
| 44267.05401620371 | 31.918 |
| 44267.09568287038 | 31.956 |
| 44267.13734953704 | 31.937 |
| 44267.17901620371 | 31.937 |
| 44267.22068287038 | 31.918 |
| 44267.26234953704 | 31.976 |
| 44267.30401620371 | 31.937 |
| 44267.34568287038 | 32.014 |
| 44267.38734953704 | 31.937 |
| 44267.42901620371 | 31.995 |
| 44267.47068287038 | 34.37 |
| 44267.51234953704 | 37.188 |
| 44267.55401620371 | 39.273 |
| 44267.59568287038 | 40.412 |
| 44267.63734953704 | 40.547 |
| 44267.67901620371 | 40.431 |
| 44267.72068287038 | 40.084 |
| 44267.76234953704 | 39.196 |
| 44267.80401620371 | 38.153 |
| 44267.84568287038 | 37.111 |
| 44267.88734953704 | 36.165 |
| 44267.92901620371 | 35.412 |
| 44267.97068287038 | 34.871 |
| 44268.01234953704 | 34.408 |
| 44268.05401620371 | 34.138 |
| 44268.09568287038 | 33.771 |
| 44268.13734953704 | 33.52 |
| 44268.17901620371 | 33.231 |
| 44268.22068287038 | 33.192 |
| 44268.26234953704 | 33.095 |
| 44268.30401620371 | 33.037 |
| 44268.34568287038 | 33.308 |
| 44268.38734953704 | 34.061 |
| 44268.42901620371 | 35.798 |
| 44268.47068287038 | 37.014 |
| 44268.51234953704 | 38.424 |
| 44268.55401620371 | 39.215 |
| 44268.59568287038 | 38.829 |
| 44268.63734953704 | 38.52 |
| 44268.67901620371 | 38.366 |
| 44268.72068287038 | 38.057 |
| 44268.76234953704 | 37.497 |
| 44268.80401620371 | 36.763 |
| 44268.84568287038 | 35.933 |
| 44268.88734953704 | 35.335 |
| 44268.92901620371 | 34.987 |
| 44268.97068287038 | 34.524 |
| 44269.01234953704 | 34.37 |
| 44269.05401620371 | 34.273 |
| 44269.13734953704 | 34.273 |
| 44269.17901620371 | 34.176 |
| 44269.22068287038 | 34.022 |
| 44269.26234953704 | 33.848 |
| 44269.30401620371 | 33.501 |
| 44269.34568287038 | 32.999 |
| 44269.38734953704 | 32.787 |
| 44269.42901620371 | 33.076 |
| 44269.47068287038 | 33.462 |
| 44269.51234953704 | 33.713 |
| 44269.55401620371 | 34.022 |
| 44269.59568287038 | 34.929 |
| 44269.63734953704 | 35.296 |
| 44269.67901620371 | 35.18 |
| 44269.72068287038 | 34.775 |
| 44269.76234953704 | 34.196 |
| 44269.80401620371 | 33.771 |
| 44269.84568287038 | 33.192 |
| 44269.88734953704 | 32.787 |
| 44269.92901620371 | 32.458 |
| 44269.97068287038 | 32.207 |
| 44270.01234953704 | 31.956 |
| 44270.05401620371 | 31.976 |
| 44270.09568287038 | 31.976 |
| 44270.13734953704 | 31.995 |
| 44270.17901620371 | 31.956 |
| 44270.22068287038 | 31.937 |
| 44270.26234953704 | 31.937 |
| 44270.30401620371 | 31.976 |
| 44270.34568287038 | 31.937 |
| 44270.38734953704 | 31.976 |
| 44270.42901620371 | 31.956 |
| 44270.47068287038 | 31.976 |
| 44270.51234953704 | 32.092 |
| 44270.55401620371 | 33.018 |
| 44270.59568287038 | 34.119 |
| 44270.63734953704 | 35.74 |
| 44270.67901620371 | 37.709 |
| 44270.72068287038 | 38.482 |
| 44270.76234953704 | 37.323 |
| 44270.80401620371 | 36.493 |
| 44270.84568287038 | 35.875 |
| 44270.88734953704 | 35.103 |
| 44270.92901620371 | 34.427 |
| 44270.97068287038 | 33.887 |
| 44271.01234953704 | 33.269 |
| 44271.05401620371 | 32.844 |
| 44271.09568287038 | 32.806 |
| 44271.13734953704 | 32.902 |
| 44271.17901620371 | 33.037 |
| 44271.22068287038 | 33.037 |
| 44271.26234953704 | 33.192 |
| 44271.30401620371 | 33.153 |
| 44271.34568287038 | 33.076 |
| 44271.38734953704 | 33.269 |
| 44271.42901620371 | 33.926 |
| 44271.47068287038 | 35.373 |
| 44271.51234953704 | 37.072 |
| 44271.55401620371 | 38.578 |
| 44271.59568287038 | 38.752 |
| 44271.63734953704 | 37.806 |
| 44271.67901620371 | 36.088 |
| 44271.72068287038 | 35.721 |
| 44271.76234953704 | 35.779 |
| 44271.80401620371 | 35.47 |
| 44271.84568287038 | 34.621 |
| 44271.88734953704 | 34.312 |
| 44271.92901620371 | 33.578 |
| 44271.97068287038 | 33.269 |
| 44272.01234953704 | 33.52 |
| 44272.05401620371 | 33.617 |
| 44272.09568287038 | 33.732 |
| 44272.13734953704 | 33.771 |
| 44272.17901620371 | 33.829 |
| 44272.22068287038 | 33.829 |
| 44272.26234953704 | 33.732 |
| 44272.30401620371 | 33.559 |
| 44272.34568287038 | 33.462 |
| 44272.38734953704 | 33.597 |
| 44272.42901620371 | 33.983 |
| 44272.47068287038 | 34.987 |
| 44272.51234953704 | 36.319 |
| 44272.55401620371 | 38.52 |
| 44272.59568287038 | 40.47 |
| 44272.63734953704 | 41.937 |
| 44272.67901620371 | 42.574 |
| 44272.72068287038 | 42.381 |
| 44272.76234953704 | 41.242 |
| 44272.80401620371 | 39.814 |
| 44272.84568287038 | 38.636 |
| 44272.88734953704 | 37.632 |
| 44272.92901620371 | 36.59 |
| 44272.97068287038 | 35.605 |
| 44273.01234953704 | 34.698 |
| 44273.05401620371 | 34.022 |
| 44273.09568287038 | 33.482 |
| 44273.13734953704 | 33.173 |
| 44273.17901620371 | 32.902 |
| 44273.22068287038 | 32.69 |
| 44273.26234953704 | 32.4 |
| 44273.30401620371 | 32.053 |
| 44273.34568287038 | 31.918 |
| 44273.38734953704 | 31.918 |
| 44273.42901620371 | 32.555 |
| 44273.47068287038 | 34.389 |
| 44273.51234953704 | 36.512 |
| 44273.55401620371 | 38.926 |
| 44273.59568287038 | 41.049 |
| 44273.63734953704 | 42.536 |
| 44273.67901620371 | 43.057 |
| 44273.72068287038 | 42.111 |
| 44273.76234953704 | 40.875 |
| 44273.80401620371 | 40.007 |
| 44273.84568287038 | 39.138 |
| 44273.88734953704 | 38.366 |
| 44273.92901620371 | 37.381 |
| 44273.97068287038 | 36.648 |
| 44274.01234953704 | 36.107 |
| 44274.05401620371 | 35.663 |
| 44274.09568287038 | 35.315 |
| 44274.13734953704 | 35.084 |
| 44274.17901620371 | 34.891 |
| 44274.22068287038 | 34.717 |
| 44274.26234953704 | 34.601 |
| 44274.30401620371 | 34.273 |
| 44274.34568287038 | 34.08 |
| 44274.38734953704 | 34.389 |
| 44274.42901620371 | 35.315 |
| 44274.47068287038 | 37.188 |
| 44274.51234953704 | 39.389 |
| 44274.55401620371 | 41.725 |
| 44274.59568287038 | 43.771 |
| 44274.63734953704 | 45.258 |
| 44274.67901620371 | 45.509 |
| 44274.72068287038 | 45.065 |
| 44274.76234953704 | 44.099 |
| 44274.80401620371 | 42.825 |
| 44274.84568287038 | 41.455 |
| 44274.88734953704 | 40.296 |
| 44274.92901620371 | 39.292 |
| 44274.97068287038 | 38.597 |
| 44275.01234953704 | 38.057 |
| 44275.05401620371 | 37.555 |
| 44275.09568287038 | 37.207 |
| 44275.13734953704 | 37.014 |
| 44275.17901620371 | 36.802 |
| 44275.22068287038 | 36.609 |
| 44275.26234953704 | 36.435 |
| 44275.30401620371 | 36.165 |
| 44275.34568287038 | 36.03 |
| 44275.38734953704 | 36.551 |
| 44275.42901620371 | 37.594 |
| 44275.47068287038 | 39.099 |
| 44275.51234953704 | 41.165 |
| 44275.55401620371 | 43.211 |
| 44275.59568287038 | 45.045 |
| 44275.63734953704 | 46.377 |
| 44275.67901620371 | 46.802 |
| 44275.72068287038 | 45.856 |
| 44275.76234953704 | 44.659 |
| 44275.80401620371 | 43.153 |
| 44275.84568287038 | 41.763 |
| 44275.88734953704 | 40.76 |
| 44275.92901620371 | 40.007 |
| 44275.97068287038 | 39.466 |
| 44276.01234953704 | 39.061 |
| 44276.05401620371 | 38.231 |
| 44276.09568287038 | 36.667 |
| 44276.13734953704 | 36.512 |
| 44276.17901620371 | 36.783 |
| 44276.22068287038 | 37.053 |
| 44276.26234953704 | 37.092 |
| 44276.30401620371 | 36.802 |
| 44276.34568287038 | 36.377 |
| 44276.38734953704 | 36.184 |
| 44276.42901620371 | 36.59 |
| 44276.47068287038 | 37.864 |
| 44276.51234953704 | 39.814 |
| 44276.55401620371 | 40.721 |
| 44276.59568287038 | 41.049 |
| 44276.63734953704 | 40.817 |
| 44276.67901620371 | 40.567 |
| 44276.72068287038 | 40.277 |
| 44276.76234953704 | 40.122 |
| 44276.80401620371 | 39.659 |
| 44276.84568287038 | 38.79 |
| 44276.88734953704 | 38.076 |
| 44276.92901620371 | 37.246 |
| 44276.97068287038 | 37.072 |
| 44277.01234953704 | 36.725 |
| 44277.05401620371 | 36.435 |
| 44277.09568287038 | 36.03 |
| 44277.13734953704 | 35.566 |
| 44277.17901620371 | 35.335 |
| 44277.22068287038 | 35.084 |
| 44277.26234953704 | 34.775 |
| 44277.30401620371 | 34.543 |
| 44277.34568287038 | 34.427 |
| 44277.38734953704 | 34.833 |
| 44277.42901620371 | 35.721 |
| 44277.47068287038 | 37.304 |
| 44277.51234953704 | 39.312 |
| 44277.55401620371 | 41.455 |
| 44277.59568287038 | 43.269 |
| 44277.63734953704 | 44.35 |
| 44277.67901620371 | 43.945 |
| 44277.72068287038 | 43.404 |
| 44277.76234953704 | 42.536 |
| 44277.80401620371 | 41.551 |
| 44277.84568287038 | 40.509 |
| 44277.88734953704 | 39.428 |
| 44277.92901620371 | 38.462 |
| 44277.97068287038 | 37.883 |
| 44278.01234953704 | 37.343 |
| 44278.05401620371 | 36.918 |
| 44278.09568287038 | 36.474 |
| 44278.13734953704 | 36.088 |
| 44278.17901620371 | 35.644 |
| 44278.22068287038 | 35.238 |
| 44278.26234953704 | 34.678 |
| 44278.30401620371 | 34.408 |
| 44278.34568287038 | 34.35 |
| 44278.38734953704 | 34.736 |
| 44278.42901620371 | 35.161 |
| 44278.47068287038 | 36.242 |
| 44278.51234953704 | 37.207 |
| 44278.55401620371 | 38.327 |
| 44278.59568287038 | 40.431 |
| 44278.63734953704 | 41.706 |
| 44278.67901620371 | 41.532 |
| 44278.72068287038 | 41.204 |
| 44278.76234953704 | 40.451 |
| 44278.80401620371 | 39.447 |
| 44278.84568287038 | 38.346 |
| 44278.88734953704 | 37.516 |
| 44278.92901620371 | 36.802 |
| 44278.97068287038 | 36.184 |
| 44279.01234953704 | 35.76 |
| 44279.05401620371 | 35.373 |
| 44279.09568287038 | 35.161 |
| 44279.13734953704 | 35.045 |
| 44279.17901620371 | 34.814 |
| 44279.22068287038 | 34.505 |
| 44279.26234953704 | 34.138 |
| 44279.30401620371 | 33.81 |
| 44279.34568287038 | 33.597 |
| 44279.38734953704 | 33.559 |
| 44279.42901620371 | 34.601 |
| 44279.47068287038 | 36.3 |
| 44279.51234953704 | 38.424 |
| 44279.55401620371 | 40.18 |
| 44279.59568287038 | 41.011 |
| 44279.63734953704 | 41.512 |
| 44279.67901620371 | 41.744 |
| 44279.72068287038 | 41.609 |
| 44279.76234953704 | 41.126 |
| 44279.80401620371 | 40.065 |
| 44279.84568287038 | 39.061 |
| 44279.88734953704 | 38.192 |
| 44279.92901620371 | 37.381 |
| 44279.97068287038 | 36.841 |
| 44280.01234953704 | 36.165 |
| 44280.05401620371 | 35.624 |
| 44280.09568287038 | 35.18 |
| 44280.13734953704 | 34.736 |
| 44280.17901620371 | 34.447 |
| 44280.22068287038 | 34.138 |
| 44280.26234953704 | 33.906 |
| 44280.30401620371 | 33.617 |
| 44280.34568287038 | 33.597 |
| 44280.38734953704 | 33.926 |
| 44280.42901620371 | 34.968 |
| 44280.47068287038 | 36.204 |
| 44280.51234953704 | 36.783 |
| 44280.55401620371 | 37.343 |
| 44280.59568287038 | 38.346 |
| 44280.63734953704 | 39.949 |
| 44280.67901620371 | 40.567 |
| 44280.72068287038 | 40.663 |
| 44280.76234953704 | 40.431 |
| 44280.80401620371 | 39.563 |
| 44280.84568287038 | 38.771 |
| 44280.88734953704 | 38.192 |
| 44280.92901620371 | 37.806 |
| 44280.97068287038 | 37.207 |
| 44281.01234953704 | 36.705 |
| 44281.05401620371 | 36.319 |
| 44281.09568287038 | 35.991 |
| 44281.13734953704 | 35.798 |
| 44281.17901620371 | 35.586 |
| 44281.22068287038 | 35.393 |
| 44281.26234953704 | 35.277 |
| 44281.30401620371 | 35.219 |
| 44281.34568287038 | 35.161 |
| 44281.38734953704 | 35.412 |
| 44281.42901620371 | 36.204 |
| 44281.47068287038 | 37.709 |
| 44281.51234953704 | 39.022 |
| 44281.55401620371 | 40.161 |
| 44281.59568287038 | 40.335 |
| 44281.63734953704 | 40.065 |
| 44281.67901620371 | 40.238 |
| 44281.72068287038 | 39.872 |
| 44281.76234953704 | 39.389 |
| 44281.80401620371 | 38.79 |
| 44281.84568287038 | 38.153 |
| 44281.88734953704 | 37.42 |
| 44281.92901620371 | 36.763 |
| 44281.97068287038 | 36.146 |
| 44282.01234953704 | 35.663 |
| 44282.05401620371 | 35.2 |
| 44282.09568287038 | 34.987 |
| 44282.13734953704 | 34.582 |
| 44282.17901620371 | 34.35 |
| 44282.22068287038 | 34.119 |
| 44282.26234953704 | 34.061 |
| 44282.30401620371 | 33.926 |
| 44282.34568287038 | 33.887 |
| 44282.38734953704 | 34.119 |
| 44282.42901620371 | 34.775 |
| 44282.47068287038 | 36.648 |
| 44282.51234953704 | 38.559 |
| 44282.55401620371 | 40.296 |
| 44282.59568287038 | 42.188 |
| 44282.63734953704 | 43.54 |
| 44282.67901620371 | 44.833 |
| 44282.72068287038 | 44.041 |
| 44282.76234953704 | 42.787 |
| 44282.80401620371 | 42.014 |
| 44282.84568287038 | 40.875 |
| 44282.88734953704 | 39.891 |
| 44282.92901620371 | 39.061 |
| 44282.97068287038 | 38.288 |
| 44283.01234953704 | 37.671 |
| 44283.05401620371 | 37.188 |
| 44283.09568287038 | 36.802 |
| 44283.13734953704 | 36.435 |
| 44283.17901620371 | 35.914 |
| 44283.22068287038 | 35.566 |
| 44283.26234953704 | 35.122 |
| 44283.30401620371 | 34.659 |
| 44283.34568287038 | 34.234 |
| 44283.38734953704 | 34.408 |
| 44283.42901620371 | 35.489 |
| 44283.47068287038 | 37.632 |
| 44283.51234953704 | 40.316 |
| 44283.55401620371 | 43.057 |
| 44283.59568287038 | 44.987 |
| 44283.63734953704 | 46.455 |
| 44283.67901620371 | 47.072 |
| 44283.72068287038 | 46.609 |
| 44283.76234953704 | 45.393 |
| 44283.80401620371 | 43.887 |
| 44283.84568287038 | 42.478 |
| 44283.88734953704 | 41.107 |
| 44283.92901620371 | 39.91 |
| 44283.97068287038 | 39.003 |
| 44284.01234953704 | 38.269 |
| 44284.05401620371 | 37.594 |
| 44284.09568287038 | 37.092 |
| 44284.13734953704 | 36.686 |
| 44284.17901620371 | 36.474 |
| 44284.22068287038 | 36.3 |
| 44284.26234953704 | 36.107 |
| 44284.30401620371 | 35.895 |
| 44284.34568287038 | 35.856 |
| 44284.38734953704 | 36.3 |
| 44284.42901620371 | 37.632 |
| 44284.47068287038 | 39.794 |
| 44284.51234953704 | 42.285 |
| 44284.55401620371 | 44.814 |
| 44284.59568287038 | 46.879 |
| 44284.63734953704 | 48.327 |
| 44284.67901620371 | 48.655 |
| 44284.72068287038 | 47.343 |
| 44284.76234953704 | 45.682 |
| 44284.80401620371 | 44.408 |
| 44284.84568287038 | 43.076 |
| 44284.88734953704 | 41.532 |
| 44284.92901620371 | 39.736 |
| 44284.97068287038 | 38.038 |
| 44285.01234953704 | 37.574 |
| 44285.05401620371 | 37.111 |
| 44285.09568287038 | 36.435 |
| 44285.13734953704 | 36.184 |
| 44285.17901620371 | 35.47 |
| 44285.22068287038 | 35.219 |
| 44285.26234953704 | 35.258 |
| 44285.30401620371 | 35.084 |
| 44285.34568287038 | 34.968 |
| 44285.38734953704 | 35.296 |
| 44285.42901620371 | 35.721 |
| 44285.47068287038 | 37.536 |
| 44285.51234953704 | 39.601 |
| 44285.55401620371 | 41.339 |
| 44285.59568287038 | 42.381 |
| 44285.63734953704 | 44.099 |
| 44285.67901620371 | 43.829 |
| 44285.72068287038 | 42.96 |
| 44285.76234953704 | 42.092 |
| 44285.80401620371 | 40.316 |
| 44285.84568287038 | 38.424 |
| 44285.88734953704 | 36.899 |
| 44285.92901620371 | 35.837 |
| 44285.97068287038 | 35.084 |
| 44286.01234953704 | 34.408 |
| 44286.05401620371 | 33.694 |
| 44286.09568287038 | 33.018 |
| 44286.13734953704 | 32.362 |
| 44286.17901620371 | 31.918 |
| 44286.22068287038 | 31.937 |
| 44286.26234953704 | 31.956 |
| 44286.30401620371 | 31.976 |
| 44286.34568287038 | 31.995 |
| 44286.38734953704 | 31.918 |
| 44286.42901620371 | 32.034 |
| 44286.47068287038 | 33.443 |
| 44286.51234953704 | 36.03 |
| 44286.55401620371 | 39.061 |
| 44286.59568287038 | 41.821 |
| 44286.63734953704 | 43.829 |
| 44286.67901620371 | 44.601 |
| 44286.72068287038 | 44.177 |
| 44286.76234953704 | 42.825 |
| 44286.80401620371 | 41.3 |
| 44286.84568287038 | 40.045 |
| 44286.88734953704 | 38.906 |
| 44286.92901620371 | 37.613 |
| 44286.97068287038 | 36.648 |
| 44287.01234953704 | 35.914 |
| 44287.05401620371 | 35.258 |
| 44287.09568287038 | 34.678 |
| 44287.13734953704 | 34.196 |
| 44287.17901620371 | 33.81 |
| 44287.22068287038 | 33.385 |
| 44287.26234953704 | 32.98 |
| 44287.30401620371 | 32.536 |
| 44287.34568287038 | 32.323 |
| 44287.38734953704 | 32.787 |
| 44287.42901620371 | 34.273 |
| 44287.47068287038 | 36.744 |
| 44287.51234953704 | 39.621 |
| 44287.55401620371 | 42.574 |
| 44287.59568287038 | 45.142 |
| 44287.63734953704 | 47.092 |
| 44287.67901620371 | 47.941 |
| 44287.72068287038 | 47.574 |
| 44287.76234953704 | 46.242 |
| 44287.80401620371 | 44.601 |
| 44287.84568287038 | 42.999 |
| 44287.88734953704 | 41.435 |
| 44287.92901620371 | 40.238 |
| 44287.97068287038 | 39.196 |
| 44288.01234953704 | 38.366 |
| 44288.05401620371 | 37.651 |
| 44288.09568287038 | 37.092 |
| 44288.13734953704 | 36.705 |
| 44288.17901620371 | 36.455 |
| 44288.22068287038 | 36.165 |
| 44288.26234953704 | 35.914 |
| 44288.30401620371 | 35.547 |
| 44288.34568287038 | 35.354 |
| 44288.38734953704 | 35.76 |
| 44288.42901620371 | 37.304 |
| 44288.47068287038 | 39.543 |
| 44288.51234953704 | 42.188 |
| 44288.55401620371 | 45.045 |
| 44288.59568287038 | 47.304 |
| 44288.63734953704 | 48.945 |
| 44288.67901620371 | 49.466 |
| 44288.72068287038 | 49.273 |
| 44288.76234953704 | 47.922 |
| 44288.80401620371 | 46.358 |
| 44288.84568287038 | 44.679 |
| 44288.88734953704 | 43.308 |
| 44288.92901620371 | 42.265 |
| 44288.97068287038 | 41.281 |
| 44289.01234953704 | 40.509 |
| 44289.05401620371 | 39.872 |
| 44289.09568287038 | 39.389 |
| 44289.13734953704 | 39.08 |
| 44289.17901620371 | 38.733 |
| 44289.22068287038 | 38.462 |
| 44289.26234953704 | 38.115 |
| 44289.30401620371 | 37.69 |
| 44289.34568287038 | 37.439 |
| 44289.38734953704 | 37.883 |
| 44289.42901620371 | 39.312 |
| 44289.47068287038 | 41.493 |
| 44289.51234953704 | 44.138 |
| 44289.55401620371 | 46.763 |
| 44289.59568287038 | 48.926 |
| 44289.63734953704 | 50.528 |
| 44289.67901620371 | 51.146 |
| 44289.72068287038 | 50.76 |
| 44289.76234953704 | 49.485 |
| 44289.80401620371 | 47.613 |
| 44289.84568287038 | 45.818 |
| 44289.88734953704 | 44.389 |
| 44289.92901620371 | 43.231 |
| 44289.97068287038 | 42.265 |
| 44290.01234953704 | 41.455 |
| 44290.05401620371 | 40.856 |
| 44290.09568287038 | 40.47 |
| 44290.13734953704 | 40.122 |
| 44290.17901620371 | 39.794 |
| 44290.22068287038 | 39.408 |
| 44290.26234953704 | 38.906 |
| 44290.30401620371 | 38.443 |
| 44290.34568287038 | 38.115 |
| 44290.38734953704 | 38.462 |
| 44290.42901620371 | 39.717 |
| 44290.47068287038 | 41.532 |
| 44290.51234953704 | 43.578 |
| 44290.55401620371 | 45.373 |
| 44290.59568287038 | 46.821 |
| 44290.63734953704 | 48.617 |
| 44290.67901620371 | 49.157 |
| 44290.72068287038 | 48.018 |
| 44290.76234953704 | 47.014 |
| 44290.80401620371 | 45.547 |
| 44290.84568287038 | 44.408 |
| 44290.88734953704 | 43.482 |
| 44290.92901620371 | 42.497 |
| 44290.97068287038 | 41.609 |
| 44291.01234953704 | 40.779 |
| 44291.05401620371 | 40.045 |
| 44291.09568287038 | 39.563 |
| 44291.13734953704 | 39.37 |
| 44291.17901620371 | 39.196 |
| 44291.22068287038 | 39.041 |
| 44291.26234953704 | 38.733 |
| 44291.30401620371 | 38.443 |
| 44291.34568287038 | 38.25 |
| 44291.38734953704 | 38.752 |
| 44291.42901620371 | 40.045 |
| 44291.47068287038 | 41.416 |
| 44291.51234953704 | 43.404 |
| 44291.55401620371 | 46.088 |
| 44291.59568287038 | 47.594 |
| 44291.63734953704 | 49.235 |
| 44291.67901620371 | 50.103 |
| 44291.72068287038 | 49.852 |
| 44291.76234953704 | 48.694 |
| 44291.80401620371 | 47.014 |
| 44291.84568287038 | 45.586 |
| 44291.88734953704 | 44.428 |
| 44291.92901620371 | 43.346 |
| 44291.97068287038 | 42.458 |
| 44292.01234953704 | 41.667 |
| 44292.05401620371 | 41.146 |
| 44292.09568287038 | 41.011 |
| 44292.13734953704 | 40.837 |
| 44292.17901620371 | 40.354 |
| 44292.22068287038 | 39.91 |
| 44292.26234953704 | 39.505 |
| 44292.30401620371 | 39.177 |
| 44292.34568287038 | 38.926 |
| 44292.38734953704 | 39.099 |
| 44292.42901620371 | 40.161 |
| 44292.47068287038 | 41.377 |
| 44292.51234953704 | 42.922 |
| 44292.55401620371 | 44.099 |
| 44292.59568287038 | 44.621 |
| 44292.63734953704 | 43.617 |
| 44292.67901620371 | 43.733 |
| 44292.72068287038 | 42.748 |
| 44292.76234953704 | 41.725 |
| 44292.80401620371 | 40.509 |
| 44292.84568287038 | 39.756 |
| 44292.88734953704 | 39.099 |
| 44292.92901620371 | 38.52 |
| 44292.97068287038 | 38.115 |
| 44293.01234953704 | 37.844 |
| 44293.05401620371 | 37.651 |
| 44293.09568287038 | 37.478 |
| 44293.13734953704 | 37.246 |
| 44293.17901620371 | 36.956 |
| 44293.22068287038 | 36.648 |
| 44293.26234953704 | 36.223 |
| 44293.30401620371 | 36.068 |
| 44293.34568287038 | 35.933 |
| 44293.38734953704 | 36.088 |
| 44293.42901620371 | 36.512 |
| 44293.47068287038 | 37.825 |
| 44293.51234953704 | 40.045 |
| 44293.55401620371 | 42.323 |
| 44293.59568287038 | 43.366 |
| 44293.63734953704 | 43.54 |
| 44293.67901620371 | 43.501 |
| 44293.72068287038 | 44.003 |
| 44293.76234953704 | 43.964 |
| 44293.80401620371 | 42.999 |
| 44293.84568287038 | 41.86 |
| 44293.88734953704 | 41.3 |
| 44293.92901620371 | 41.03 |
| 44293.97068287038 | 40.663 |
| 44294.01234953704 | 39.929 |
| 44294.05401620371 | 39.331 |
| 44294.09568287038 | 38.848 |
| 44294.13734953704 | 38.424 |
| 44294.17901620371 | 38.018 |
| 44294.22068287038 | 37.555 |
| 44294.26234953704 | 37.246 |
| 44294.30401620371 | 37.034 |
| 44294.34568287038 | 37.072 |
| 44294.38734953704 | 37.574 |
| 44294.42901620371 | 38.887 |
| 44294.47068287038 | 40.972 |
| 44294.51234953704 | 41.783 |
| 44294.55401620371 | 42.594 |
| 44294.59568287038 | 44.968 |
| 44294.63734953704 | 45.451 |
| 44294.67901620371 | 44.968 |
| 44294.72068287038 | 44.949 |
| 44294.76234953704 | 44.524 |
| 44294.80401620371 | 43.617 |
| 44294.84568287038 | 42.497 |
| 44294.88734953704 | 41.532 |
| 44294.92901620371 | 40.895 |
| 44294.97068287038 | 40.258 |
| 44295.01234953704 | 39.814 |
| 44295.05401620371 | 39.563 |
| 44295.09568287038 | 39.234 |
| 44295.13734953704 | 38.945 |
| 44295.17901620371 | 38.501 |
| 44295.22068287038 | 37.806 |
| 44295.26234953704 | 37.072 |
| 44295.30401620371 | 36.397 |
| 44295.34568287038 | 36.088 |
| 44295.38734953704 | 36.281 |
| 44295.42901620371 | 37.4 |
| 44295.47068287038 | 39.408 |
| 44295.51234953704 | 41.783 |
| 44295.55401620371 | 43.868 |
| 44295.59568287038 | 45.933 |
| 44295.63734953704 | 47.227 |
| 44295.67901620371 | 47.246 |
| 44295.72068287038 | 46.937 |
| 44295.76234953704 | 45.779 |
| 44295.80401620371 | 43.926 |
| 44295.84568287038 | 42.536 |
| 44295.88734953704 | 41.416 |
| 44295.92901620371 | 40.354 |
| 44295.97068287038 | 39.485 |
| 44296.01234953704 | 38.752 |
| 44296.05401620371 | 38.211 |
| 44296.09568287038 | 37.787 |
| 44296.13734953704 | 37.42 |
| 44296.17901620371 | 37.014 |
| 44296.22068287038 | 36.551 |
| 44296.26234953704 | 36.03 |
| 44296.30401620371 | 35.451 |
| 44296.34568287038 | 35.219 |
| 44296.38734953704 | 35.663 |
| 44296.42901620371 | 37.227 |
| 44296.47068287038 | 39.601 |
| 44296.51234953704 | 42.323 |
| 44296.55401620371 | 44.929 |
| 44296.59568287038 | 47.15 |
| 44296.63734953704 | 48.597 |
| 44296.67901620371 | 48.868 |
| 44296.72068287038 | 48.906 |
| 44296.76234953704 | 47.381 |
| 44296.80401620371 | 45.837 |
| 44296.84568287038 | 44.543 |
| 44296.88734953704 | 43.404 |
| 44296.92901620371 | 42.497 |
| 44296.97068287038 | 41.783 |
| 44297.01234953704 | 41.184 |
| 44297.05401620371 | 40.663 |
| 44297.09568287038 | 40.18 |
| 44297.13734953704 | 39.678 |
| 44297.17901620371 | 39.215 |
| 44297.22068287038 | 38.597 |
| 44297.26234953704 | 38.038 |
| 44297.30401620371 | 37.42 |
| 44297.34568287038 | 37.227 |
| 44297.38734953704 | 37.709 |
| 44297.42901620371 | 39.157 |
| 44297.47068287038 | 41.3 |
| 44297.51234953704 | 43.848 |
| 44297.55401620371 | 46.648 |
| 44297.59568287038 | 49.177 |
| 44297.63734953704 | 50.296 |
| 44297.67901620371 | 50.451 |
| 44297.72068287038 | 50.219 |
| 44297.76234953704 | 48.54 |
| 44297.80401620371 | 46.821 |
| 44297.84568287038 | 45.624 |
| 44297.88734953704 | 44.524 |
| 44297.92901620371 | 43.559 |
| 44297.97068287038 | 42.864 |
| 44298.01234953704 | 42.265 |
| 44298.05401620371 | 41.686 |
| 44298.09568287038 | 41.088 |
| 44298.13734953704 | 40.451 |
| 44298.17901620371 | 39.852 |
| 44298.22068287038 | 39.099 |
| 44298.26234953704 | 38.443 |
| 44298.30401620371 | 37.69 |
| 44298.34568287038 | 37.4 |
| 44298.38734953704 | 37.806 |
| 44298.42901620371 | 38.983 |
| 44298.47068287038 | 41.088 |
| 44298.51234953704 | 43.54 |
| 44298.55401620371 | 45.875 |
| 44298.59568287038 | 47.96 |
| 44298.63734953704 | 49.331 |
| 44298.67901620371 | 49.91 |
| 44298.72068287038 | 49.505 |
| 44298.76234953704 | 48.25 |
| 44298.80401620371 | 46.59 |
| 44298.84568287038 | 45.161 |
| 44298.88734953704 | 44.234 |
| 44298.92901620371 | 43.366 |
| 44298.97068287038 | 42.536 |
| 44299.01234953704 | 41.879 |
| 44299.05401620371 | 41.3 |
| 44299.09568287038 | 40.817 |
| 44299.13734953704 | 40.451 |
| 44299.17901620371 | 40.161 |
| 44299.22068287038 | 39.794 |
| 44299.26234953704 | 39.254 |
| 44299.30401620371 | 38.675 |
| 44299.34568287038 | 38.443 |
| 44299.38734953704 | 38.269 |
| 44299.42901620371 | 38.81 |
| 44299.47068287038 | 39.929 |
| 44299.51234953704 | 41.937 |
| 44299.55401620371 | 42.497 |
| 44299.59568287038 | 42.053 |
| 44299.63734953704 | 41.86 |
| 44299.67901620371 | 41.976 |
| 44299.72068287038 | 42.458 |
| 44299.76234953704 | 42.555 |
| 44299.80401620371 | 42.381 |
| 44299.84568287038 | 41.763 |
| 44299.88734953704 | 41.107 |
| 44299.92901620371 | 40.489 |
| 44299.97068287038 | 39.775 |
| 44300.01234953704 | 39.196 |
| 44300.05401620371 | 38.694 |
| 44300.09568287038 | 38.231 |
| 44300.13734953704 | 37.864 |
| 44300.17901620371 | 37.42 |
| 44300.22068287038 | 36.995 |
| 44300.26234953704 | 36.59 |
| 44300.30401620371 | 36.107 |
| 44300.34568287038 | 35.895 |
| 44300.38734953704 | 36.358 |
| 44300.42901620371 | 37.806 |
| 44300.47068287038 | 40.161 |
| 44300.51234953704 | 42.96 |
| 44300.55401620371 | 45.837 |
| 44300.59568287038 | 47.246 |
| 44300.63734953704 | 47.053 |
| 44300.67901620371 | 46.165 |
| 44300.72068287038 | 45.644 |
| 44300.76234953704 | 44.621 |
| 44300.80401620371 | 43.578 |
| 44300.84568287038 | 42.516 |
| 44300.88734953704 | 41.706 |
| 44300.92901620371 | 41.107 |
| 44300.97068287038 | 40.663 |
| 44301.01234953704 | 40.277 |
| 44301.05401620371 | 39.929 |
| 44301.09568287038 | 39.659 |
| 44301.13734953704 | 39.428 |
| 44301.17901620371 | 39.061 |
| 44301.22068287038 | 38.694 |
| 44301.26234953704 | 38.308 |
| 44301.30401620371 | 37.96 |
| 44301.34568287038 | 37.844 |
| 44301.38734953704 | 38.057 |
| 44301.42901620371 | 39.949 |
| 44301.47068287038 | 40.489 |
| 44301.51234953704 | 41.011 |
| 44301.55401620371 | 41.146 |
| 44301.59568287038 | 40.875 |
| 44301.63734953704 | 40.489 |
| 44301.67901620371 | 40.972 |
| 44301.72068287038 | 40.509 |
| 44301.76234953704 | 40.065 |
| 44301.80401620371 | 39.003 |
| 44301.84568287038 | 37.922 |
| 44301.88734953704 | 37.902 |
| 44301.92901620371 | 37.922 |
| 44301.97068287038 | 37.864 |
| 44302.01234953704 | 37.536 |
| 44302.05401620371 | 37.149 |
| 44302.09568287038 | 36.628 |
| 44302.13734953704 | 36.068 |
| 44302.17901620371 | 35.566 |
| 44302.22068287038 | 35.026 |
| 44302.26234953704 | 34.524 |
| 44302.30401620371 | 34.138 |
| 44302.34568287038 | 34.234 |
| 44302.38734953704 | 34.582 |
| 44302.42901620371 | 35.837 |
| 44302.47068287038 | 37.729 |
| 44302.51234953704 | 39.485 |
| 44302.55401620371 | 41.146 |
| 44302.59568287038 | 44.273 |
| 44302.63734953704 | 45.644 |
| 44302.67901620371 | 44.968 |
| 44302.72068287038 | 44.119 |
| 44302.76234953704 | 43.076 |
| 44302.80401620371 | 41.879 |
| 44302.84568287038 | 40.567 |
| 44302.88734953704 | 39.717 |
| 44302.92901620371 | 39.215 |
| 44302.97068287038 | 38.81 |
| 44303.01234953704 | 38.385 |
| 44303.05401620371 | 38.192 |
| 44303.09568287038 | 37.96 |
| 44303.13734953704 | 37.671 |
| 44303.17901620371 | 37.4 |
| 44303.22068287038 | 37.034 |
| 44303.26234953704 | 36.667 |
| 44303.30401620371 | 36.358 |
| 44303.34568287038 | 36.165 |
| 44303.38734953704 | 36.686 |
| 44303.42901620371 | 37.053 |
| 44303.47068287038 | 37.594 |
| 44303.51234953704 | 39.678 |
| 44303.55401620371 | 40.258 |
| 44303.59568287038 | 41.223 |
| 44303.63734953704 | 42.227 |
| 44303.67901620371 | 43.153 |
| 44303.72068287038 | 43.038 |
| 44303.76234953704 | 42.13 |
| 44303.80401620371 | 41.165 |
| 44303.84568287038 | 40.18 |
| 44303.88734953704 | 39.254 |
| 44303.92901620371 | 38.443 |
| 44303.97068287038 | 37.69 |
| 44304.01234953704 | 36.899 |
| 44304.05401620371 | 36.184 |
| 44304.09568287038 | 35.663 |
| 44304.13734953704 | 35.219 |
| 44304.17901620371 | 34.814 |
| 44304.22068287038 | 34.312 |
| 44304.26234953704 | 33.771 |
| 44304.30401620371 | 33.25 |
| 44304.34568287038 | 33.095 |
| 44304.38734953704 | 33.829 |
| 44304.42901620371 | 35.644 |
| 44304.47068287038 | 37.864 |
| 44304.51234953704 | 40.509 |
| 44304.55401620371 | 42.864 |
| 44304.59568287038 | 44.64 |
| 44304.63734953704 | 44.833 |
| 44304.67901620371 | 45.818 |
| 44304.72068287038 | 46.068 |
| 44304.76234953704 | 44.794 |
| 44304.80401620371 | 44.119 |
| 44304.84568287038 | 42.922 |
| 44304.88734953704 | 42.169 |
| 44304.92901620371 | 41.628 |
| 44304.97068287038 | 40.817 |
| 44305.01234953704 | 39.949 |
| 44305.05401620371 | 39.273 |
| 44305.09568287038 | 38.906 |
| 44305.13734953704 | 38.81 |
| 44305.17901620371 | 38.597 |
| 44305.22068287038 | 38.173 |
| 44305.26234953704 | 37.709 |
| 44305.30401620371 | 37.246 |
| 44305.34568287038 | 37.092 |
| 44305.38734953704 | 37.671 |
| 44305.42901620371 | 38.288 |
| 44305.47068287038 | 40.586 |
| 44305.51234953704 | 42.941 |
| 44305.55401620371 | 45.123 |
| 44305.59568287038 | 46.706 |
| 44305.63734953704 | 47.536 |
| 44305.67901620371 | 46.435 |
| 44305.72068287038 | 45.567 |
| 44305.76234953704 | 45.084 |
| 44305.80401620371 | 43.984 |
| 44305.84568287038 | 42.902 |
| 44305.88734953704 | 41.763 |
| 44305.92901620371 | 40.335 |
| 44305.97068287038 | 39.292 |
| 44306.01234953704 | 38.501 |
| 44306.05401620371 | 37.883 |
| 44306.09568287038 | 37.555 |
| 44306.13734953704 | 37.034 |
| 44306.17901620371 | 36.705 |
| 44306.22068287038 | 36.204 |
| 44306.26234953704 | 35.566 |
| 44306.30401620371 | 34.736 |
| 44306.34568287038 | 34.234 |
| 44306.38734953704 | 34.621 |
| 44306.42901620371 | 36.068 |
| 44306.47068287038 | 38.424 |
| 44306.51234953704 | 41.068 |
| 44306.55401620371 | 43.848 |
| 44306.59568287038 | 46.204 |
| 44306.63734953704 | 47.922 |
| 44306.67901620371 | 48.675 |
| 44306.72068287038 | 48.385 |
| 44306.76234953704 | 47.285 |
| 44306.80401620371 | 45.431 |
| 44306.84568287038 | 43.733 |
| 44306.88734953704 | 42.381 |
| 44306.92901620371 | 41.377 |
| 44306.97068287038 | 40.528 |
| 44307.01234953704 | 39.601 |
| 44307.05401620371 | 38.81 |
| 44307.09568287038 | 38.134 |
| 44307.13734953704 | 37.536 |
| 44307.17901620371 | 37.149 |
| 44307.22068287038 | 36.783 |
| 44307.26234953704 | 36.435 |
| 44307.30401620371 | 36.088 |
| 44307.34568287038 | 35.875 |
| 44307.38734953704 | 35.798 |
| 44307.42901620371 | 36.705 |
| 44307.47068287038 | 37.825 |
| 44307.51234953704 | 37.709 |
| 44307.55401620371 | 38.752 |
| 44307.59568287038 | 40.373 |
| 44307.63734953704 | 41.107 |
| 44307.67901620371 | 41.455 |
| 44307.72068287038 | 41.242 |
| 44307.76234953704 | 40.74 |
| 44307.80401620371 | 40.296 |
| 44307.84568287038 | 39.621 |
| 44307.88734953704 | 39.041 |
| 44307.92901620371 | 38.52 |
| 44307.97068287038 | 38.211 |
| 44308.01234953704 | 38.192 |
| 44308.05401620371 | 38.173 |
| 44308.09568287038 | 38.115 |
| 44308.13734953704 | 37.864 |
| 44308.17901620371 | 37.516 |
| 44308.22068287038 | 37.246 |
| 44308.26234953704 | 37.13 |
| 44308.30401620371 | 37.014 |
| 44308.34568287038 | 37.072 |
| 44308.38734953704 | 37.246 |
| 44308.42901620371 | 37.594 |
| 44308.47068287038 | 38.559 |
| 44308.51234953704 | 39.254 |
| 44308.55401620371 | 39.08 |
| 44308.59568287038 | 39.756 |
| 44308.63734953704 | 40.026 |
| 44308.67901620371 | 39.852 |
| 44308.72068287038 | 39.717 |
| 44308.76234953704 | 39.196 |
| 44308.80401620371 | 38.636 |
| 44308.84568287038 | 38.134 |
| 44308.88734953704 | 37.594 |
| 44308.92901620371 | 37.207 |
| 44308.97068287038 | 36.705 |
| 44309.01234953704 | 36.281 |
| 44309.05401620371 | 35.74 |
| 44309.09568287038 | 35.238 |
| 44309.13734953704 | 34.775 |
| 44309.17901620371 | 34.312 |
| 44309.22068287038 | 33.81 |
| 44309.26234953704 | 33.327 |
| 44309.30401620371 | 32.999 |
| 44309.34568287038 | 33.153 |
| 44309.38734953704 | 34.176 |
| 44309.42901620371 | 36.435 |
| 44309.47068287038 | 38.462 |
| 44309.51234953704 | 40.817 |
| 44309.55401620371 | 40.644 |
| 44309.59568287038 | 41.783 |
| 44309.63734953704 | 42.864 |
| 44309.67901620371 | 42.323 |
| 44309.72068287038 | 42.169 |
| 44309.76234953704 | 41.242 |
| 44309.80401620371 | 40.238 |
| 44309.84568287038 | 39.485 |
| 44309.88734953704 | 39.234 |
| 44309.92901620371 | 38.848 |
| 44309.97068287038 | 38.443 |
| 44310.01234953704 | 37.883 |
| 44310.05401620371 | 37.458 |
| 44310.09568287038 | 36.995 |
| 44310.13734953704 | 36.532 |
| 44310.17901620371 | 36.068 |
| 44310.22068287038 | 35.644 |
| 44310.26234953704 | 35.161 |
| 44310.30401620371 | 34.814 |
| 44310.34568287038 | 34.968 |
| 44310.38734953704 | 35.895 |
| 44310.42901620371 | 37.902 |
| 44310.47068287038 | 40.817 |
| 44310.51234953704 | 43.771 |
| 44310.55401620371 | 46.339 |
| 44310.59568287038 | 48.771 |
| 44310.63734953704 | 49.138 |
| 44310.67901620371 | 48.404 |
| 44310.72068287038 | 48.597 |
| 44310.76234953704 | 47.555 |
| 44310.80401620371 | 46.416 |
| 44310.84568287038 | 45.798 |
| 44310.88734953704 | 45.007 |
| 44310.92901620371 | 44.428 |
| 44310.97068287038 | 44.061 |
| 44311.01234953704 | 43.887 |
| 44311.05401620371 | 43.675 |
| 44311.09568287038 | 43.54 |
| 44311.13734953704 | 43.192 |
| 44311.17901620371 | 42.825 |
| 44311.22068287038 | 42.265 |
| 44311.26234953704 | 41.706 |
| 44311.30401620371 | 41.242 |
| 44311.34568287038 | 41.339 |
| 44311.38734953704 | 42.285 |
| 44311.42901620371 | 44.003 |
| 44311.47068287038 | 46.049 |
| 44311.51234953704 | 48.964 |
| 44311.55401620371 | 51.841 |
| 44311.59568287038 | 54.37 |
| 44311.63734953704 | 55.972 |
| 44311.67901620371 | 56.667 |
| 44311.72068287038 | 55.489 |
| 44311.76234953704 | 54.042 |
| 44311.80401620371 | 52.536 |
| 44311.84568287038 | 51.126 |
| 44311.88734953704 | 49.949 |
| 44311.92901620371 | 48.868 |
| 44311.97068287038 | 47.883 |
| 44312.01234953704 | 46.918 |
| 44312.05401620371 | 46.068 |
| 44312.09568287038 | 45.354 |
| 44312.13734953704 | 44.621 |
| 44312.17901620371 | 43.829 |
| 44312.22068287038 | 42.98 |
| 44312.26234953704 | 42.072 |
| 44312.30401620371 | 41.339 |
| 44312.34568287038 | 41.184 |
| 44312.38734953704 | 41.899 |
| 44312.42901620371 | 42.922 |
| 44312.47068287038 | 43.636 |
| 44312.51234953704 | 46.126 |
| 44312.55401620371 | 49.061 |
| 44312.59568287038 | 51.397 |
| 44312.63734953704 | 52.285 |
| 44312.67901620371 | 52.111 |
| 44312.72068287038 | 51.899 |
| 44312.76234953704 | 50.991 |
| 44312.80401620371 | 49.852 |
| 44312.84568287038 | 48.675 |
| 44312.88734953704 | 47.516 |
| 44312.92901620371 | 46.59 |
| 44312.97068287038 | 45.682 |
| 44313.01234953704 | 44.872 |
| 44313.05401620371 | 44.061 |
| 44313.09568287038 | 43.52 |
| 44313.13734953704 | 42.941 |
| 44313.17901620371 | 42.265 |
| 44313.22068287038 | 41.532 |
| 44313.26234953704 | 40.76 |
| 44313.30401620371 | 40.2 |
| 44313.34568287038 | 40.045 |
| 44313.38734953704 | 40.103 |
| 44313.42901620371 | 40.644 |
| 44313.47068287038 | 40.933 |
| 44313.51234953704 | 40.76 |
| 44313.55401620371 | 40.373 |
| 44313.59568287038 | 39.582 |
| 44313.63734953704 | 40.026 |
| 44313.67901620371 | 39.563 |
| 44313.72068287038 | 39.254 |
| 44313.76234953704 | 39.659 |
| 44313.80401620371 | 39.524 |
| 44313.84568287038 | 39.196 |
| 44313.88734953704 | 38.771 |
| 44313.92901620371 | 38.501 |
| 44313.97068287038 | 38.134 |
| 44314.01234953704 | 37.381 |
| 44314.05401620371 | 36.918 |
| 44314.09568287038 | 36.59 |
| 44314.13734953704 | 36.358 |
| 44314.17901620371 | 36.223 |
| 44314.22068287038 | 36.165 |
| 44314.26234953704 | 36.165 |
| 44314.30401620371 | 36.184 |
| 44314.34568287038 | 36.57 |
| 44314.38734953704 | 37.169 |
| 44314.42901620371 | 38.038 |
| 44314.47068287038 | 39.466 |
| 44314.51234953704 | 41.59 |
| 44314.55401620371 | 44.814 |
| 44314.59568287038 | 45.991 |
| 44314.63734953704 | 47.748 |
| 44314.67901620371 | 49.196 |
| 44314.72068287038 | 49.099 |
| 44314.76234953704 | 47.767 |
| 44314.80401620371 | 46.59 |
| 44314.84568287038 | 45.509 |
| 44314.88734953704 | 44.814 |
| 44314.92901620371 | 44.08 |
| 44314.97068287038 | 43.25 |
| 44315.01234953704 | 42.536 |
| 44315.05401620371 | 41.995 |
| 44315.09568287038 | 41.416 |
| 44315.13734953704 | 40.779 |
| 44315.17901620371 | 40.142 |
| 44315.22068287038 | 39.485 |
| 44315.26234953704 | 38.81 |
| 44315.30401620371 | 38.269 |
| 44315.34568287038 | 38.231 |
| 44315.38734953704 | 39.254 |
| 44315.42901620371 | 41.068 |
| 44315.47068287038 | 43.733 |
| 44315.51234953704 | 46.628 |
| 44315.55401620371 | 49.447 |
| 44315.59568287038 | 51.841 |
| 44315.63734953704 | 53.636 |
| 44315.67901620371 | 54.563 |
| 44315.72068287038 | 54.428 |
| 44315.76234953704 | 53.462 |
| 44315.80401620371 | 52.034 |
| 44315.84568287038 | 50.76 |
| 44315.88734953704 | 49.64 |
| 44315.92901620371 | 48.617 |
| 44315.97068287038 | 47.632 |
| 44316.01234953704 | 46.725 |
| 44316.05401620371 | 45.875 |
| 44316.09568287038 | 45.18 |
| 44316.13734953704 | 44.621 |
| 44316.17901620371 | 43.945 |
| 44316.22068287038 | 43.211 |
| 44316.26234953704 | 42.458 |
| 44316.30401620371 | 41.783 |
| 44316.34568287038 | 41.667 |
| 44316.38734953704 | 42.439 |
| 44316.42901620371 | 44.099 |
| 44316.47068287038 | 46.474 |
| 44316.51234953704 | 49.041 |
| 44316.55401620371 | 51.57 |
| 44316.59568287038 | 53.887 |
| 44316.63734953704 | 55.586 |
| 44316.67901620371 | 56.493 |
| 44316.72068287038 | 56.377 |
| 44316.76234953704 | 55.489 |
| 44316.80401620371 | 54.196 |
| 44316.84568287038 | 53.057 |
| 44316.88734953704 | 51.995 |
| 44316.92901620371 | 50.933 |
| 44316.97068287038 | 49.91 |
| 44317.01234953704 | 48.964 |
| 44317.05401620371 | 48.192 |
| 44317.09568287038 | 47.458 |
| 44317.13734953704 | 46.648 |
| 44317.17901620371 | 45.76 |
| 44317.22068287038 | 44.756 |
| 44317.26234953704 | 43.713 |
| 44317.30401620371 | 43.018 |
| 44317.34568287038 | 42.613 |
| 44317.38734953704 | 43.173 |
| 44317.42901620371 | 44.698 |
| 44317.47068287038 | 46.725 |
| 44317.51234953704 | 48.443 |
| 44317.55401620371 | 49.292 |
| 44317.59568287038 | 50.065 |
| 44317.63734953704 | 52.053 |
| 44317.67901620371 | 52.439 |
| 44317.72068287038 | 51.879 |
| 44317.76234953704 | 51.609 |
| 44317.80401620371 | 51.513 |
| 44317.84568287038 | 51.088 |
| 44317.88734953704 | 50.335 |
| 44317.92901620371 | 49.601 |
| 44317.97068287038 | 49.08 |
| 44318.01234953704 | 48.578 |
| 44318.05401620371 | 47.883 |
| 44318.09568287038 | 47.092 |
| 44318.13734953704 | 46.377 |
| 44318.17901620371 | 45.663 |
| 44318.22068287038 | 44.91 |
| 44318.26234953704 | 43.964 |
| 44318.30401620371 | 43.115 |
| 44318.34568287038 | 42.748 |
| 44318.38734953704 | 42.883 |
| 44318.42901620371 | 41.706 |
| 44318.47068287038 | 42.265 |
| 44318.51234953704 | 42.072 |
| 44318.55401620371 | 43.346 |
| 44318.59568287038 | 43.636 |
| 44318.63734953704 | 43.404 |
| 44318.67901620371 | 44.35 |
| 44318.72068287038 | 44.698 |
| 44318.76234953704 | 44.659 |
| 44318.80401620371 | 44.428 |
| 44318.84568287038 | 43.964 |
| 44318.88734953704 | 43.443 |
| 44318.92901620371 | 42.96 |
| 44318.97068287038 | 42.709 |
| 44319.01234953704 | 42.497 |
| 44319.05401620371 | 41.879 |
| 44319.09568287038 | 40.875 |
| 44319.13734953704 | 40.528 |
| 44319.17901620371 | 39.833 |
| 44319.22068287038 | 39.234 |
| 44319.26234953704 | 38.887 |
| 44319.30401620371 | 38.733 |
| 44319.34568287038 | 38.752 |
| 44319.38734953704 | 39.466 |
| 44319.42901620371 | 39.775 |
| 44319.47068287038 | 41.667 |
| 44319.51234953704 | 43.945 |
| 44319.55401620371 | 46.262 |
| 44319.59568287038 | 47.999 |
| 44319.63734953704 | 50.2 |
| 44319.67901620371 | 49.099 |
| 44319.72068287038 | 49.177 |
| 44319.76234953704 | 48.617 |
| 44319.80401620371 | 47.072 |
| 44319.84568287038 | 45.818 |
| 44319.88734953704 | 45.045 |
| 44319.92901620371 | 44.447 |
| 44319.97068287038 | 44.041 |
| 44320.01234953704 | 43.424 |
| 44320.05401620371 | 42.902 |
| 44320.09568287038 | 42.381 |
| 44320.13734953704 | 41.918 |
| 44320.17901620371 | 41.628 |
| 44320.22068287038 | 41.3 |
| 44320.26234953704 | 40.933 |
| 44320.30401620371 | 40.586 |
| 44320.34568287038 | 40.721 |
| 44320.38734953704 | 40.702 |
| 44320.42901620371 | 42.362 |
| 44320.47068287038 | 43.346 |
| 44320.51234953704 | 44.794 |
| 44320.55401620371 | 46.262 |
| 44320.59568287038 | 46.455 |
| 44320.63734953704 | 46.126 |
| 44320.67901620371 | 45.779 |
| 44320.72068287038 | 45.354 |
| 44320.76234953704 | 44.987 |
| 44320.80401620371 | 44.408 |
| 44320.84568287038 | 43.733 |
| 44320.88734953704 | 43.269 |
| 44320.92901620371 | 42.767 |
| 44320.97068287038 | 42.555 |
| 44321.01234953704 | 42.536 |
| 44321.05401620371 | 42.439 |
| 44321.09568287038 | 41.879 |
| 44321.13734953704 | 41.609 |
| 44321.17901620371 | 41.281 |
| 44321.22068287038 | 40.76 |
| 44321.26234953704 | 40.219 |
| 44321.30401620371 | 39.852 |
| 44321.34568287038 | 39.891 |
| 44321.38734953704 | 40.895 |
| 44321.42901620371 | 41.899 |
| 44321.47068287038 | 42.864 |
| 44321.51234953704 | 44.756 |
| 44321.55401620371 | 45.605 |
| 44321.59568287038 | 45.837 |
| 44321.63734953704 | 46.763 |
| 44321.67901620371 | 47.632 |
| 44321.72068287038 | 48.462 |
| 44321.76234953704 | 48.018 |
| 44321.80401620371 | 47.536 |
| 44321.84568287038 | 46.358 |
| 44321.88734953704 | 45.238 |
| 44321.92901620371 | 44.37 |
| 44321.97068287038 | 43.713 |
| 44322.01234953704 | 43.231 |
| 44322.05401620371 | 42.941 |
| 44322.09568287038 | 42.729 |
| 44322.13734953704 | 42.478 |
| 44322.17901620371 | 42.014 |
| 44322.22068287038 | 41.435 |
| 44322.26234953704 | 40.586 |
| 44322.30401620371 | 40.007 |
| 44322.34568287038 | 39.987 |
| 44322.38734953704 | 40.953 |
| 44322.42901620371 | 42.883 |
| 44322.47068287038 | 45.489 |
| 44322.51234953704 | 48.385 |
| 44322.55401620371 | 51.223 |
| 44322.59568287038 | 53.578 |
| 44322.63734953704 | 55.2 |
| 44322.67901620371 | 56.03 |
| 44322.72068287038 | 55.895 |
| 44322.76234953704 | 55.026 |
| 44322.80401620371 | 53.482 |
| 44322.84568287038 | 52.227 |
| 44322.88734953704 | 51.146 |
| 44322.92901620371 | 50.103 |
| 44322.97068287038 | 49.138 |
| 44323.01234953704 | 48.269 |
| 44323.05401620371 | 47.478 |
| 44323.09568287038 | 46.706 |
| 44323.13734953704 | 45.953 |
| 44323.17901620371 | 45.161 |
| 44323.22068287038 | 44.292 |
| 44323.26234953704 | 43.404 |
| 44323.30401620371 | 42.632 |
| 44323.34568287038 | 42.478 |
| 44323.38734953704 | 43.346 |
| 44323.42901620371 | 44.775 |
| 44323.47068287038 | 47.381 |
| 44323.51234953704 | 48.713 |
| 44323.55401620371 | 49.891 |
| 44323.59568287038 | 51.455 |
| 44323.63734953704 | 51.59 |
| 44323.67901620371 | 51.957 |
| 44323.72068287038 | 51.899 |
| 44323.76234953704 | 51.319 |
| 44323.80401620371 | 50.605 |
| 44323.84568287038 | 49.775 |
| 44323.88734953704 | 49.022 |
| 44323.92901620371 | 48.597 |
| 44323.97068287038 | 48.134 |
| 44324.01234953704 | 47.401 |
| 44324.05401620371 | 46.706 |
| 44324.09568287038 | 46.011 |
| 44324.13734953704 | 45.296 |
| 44324.17901620371 | 44.621 |
| 44324.22068287038 | 43.79 |
| 44324.26234953704 | 42.999 |
| 44324.30401620371 | 42.497 |
| 44324.34568287038 | 42.478 |
| 44324.38734953704 | 43.134 |
| 44324.42901620371 | 44.64 |
| 44324.47068287038 | 46.474 |
| 44324.51234953704 | 48.269 |
| 44324.55401620371 | 48.443 |
| 44324.59568287038 | 48.076 |
| 44324.63734953704 | 47.516 |
| 44324.67901620371 | 48.443 |
| 44324.72068287038 | 48.327 |
| 44324.76234953704 | 48.018 |
| 44324.80401620371 | 47.207 |
| 44324.84568287038 | 46.686 |
| 44324.88734953704 | 46.223 |
| 44324.92901620371 | 45.586 |
| 44324.97068287038 | 44.852 |
| 44325.01234953704 | 44.022 |
| 44325.05401620371 | 43.231 |
| 44325.09568287038 | 42.69 |
| 44325.13734953704 | 42.034 |
| 44325.17901620371 | 41.223 |
| 44325.22068287038 | 40.393 |
| 44325.26234953704 | 39.601 |
| 44325.30401620371 | 38.848 |
| 44325.34568287038 | 38.829 |
| 44325.38734953704 | 39.601 |
| 44325.42901620371 | 41.223 |
| 44325.47068287038 | 42.323 |
| 44325.51234953704 | 44.524 |
| 44325.55401620371 | 45.354 |
| 44325.59568287038 | 47.188 |
| 44325.63734953704 | 47.69 |
| 44325.67901620371 | 47.652 |
| 44325.72068287038 | 46.937 |
| 44325.76234953704 | 46.802 |
| 44325.80401620371 | 46.319 |
| 44325.84568287038 | 45.605 |
| 44325.88734953704 | 44.929 |
| 44325.92901620371 | 44.543 |
| 44325.97068287038 | 44.196 |
| 44326.01234953704 | 43.984 |
| 44326.05401620371 | 43.675 |
| 44326.09568287038 | 43.308 |
| 44326.13734953704 | 42.922 |
| 44326.17901620371 | 42.381 |
| 44326.22068287038 | 42.014 |
| 44326.26234953704 | 41.455 |
| 44326.30401620371 | 40.373 |
| 44326.34568287038 | 39.447 |
| 44326.38734953704 | 39.312 |
| 44326.42901620371 | 39.234 |
| 44326.47068287038 | 39.601 |
| 44326.51234953704 | 40.489 |
| 44326.55401620371 | 41.397 |
| 44326.59568287038 | 42.188 |
| 44326.63734953704 | 42.902 |
| 44326.67901620371 | 43.366 |
| 44326.72068287038 | 43.675 |
| 44326.76234953704 | 42.999 |
| 44326.80401620371 | 42.381 |
| 44326.84568287038 | 41.899 |
| 44326.88734953704 | 41.551 |
| 44326.92901620371 | 41.165 |
| 44326.97068287038 | 40.74 |
| 44327.01234953704 | 40.122 |
| 44327.05401620371 | 39.601 |
| 44327.09568287038 | 39.119 |
| 44327.13734953704 | 38.675 |
| 44327.17901620371 | 38.211 |
| 44327.22068287038 | 37.902 |
| 44327.26234953704 | 37.458 |
| 44327.30401620371 | 37.111 |
| 44327.34568287038 | 37.207 |
| 44327.38734953704 | 38.366 |
| 44327.42901620371 | 39.64 |
| 44327.47068287038 | 40.084 |
| 44327.51234953704 | 40.045 |
| 44327.55401620371 | 41.011 |
| 44327.59568287038 | 40.895 |
| 44327.63734953704 | 42.632 |
| 44327.67901620371 | 43.906 |
| 44327.72068287038 | 43.424 |
| 44327.76234953704 | 43.501 |
| 44327.80401620371 | 43.346 |
| 44327.84568287038 | 42.767 |
| 44327.88734953704 | 41.937 |
| 44327.92901620371 | 41.339 |
| 44327.97068287038 | 40.856 |
| 44328.01234953704 | 40.219 |
| 44328.05401620371 | 39.447 |
| 44328.09568287038 | 38.868 |
| 44328.13734953704 | 38.346 |
| 44328.17901620371 | 37.883 |
| 44328.22068287038 | 37.362 |
| 44328.26234953704 | 36.937 |
| 44328.30401620371 | 36.57 |
| 44328.34568287038 | 36.763 |
| 44328.38734953704 | 37.98 |
| 44328.42901620371 | 40.065 |
| 44328.47068287038 | 42.941 |
| 44328.51234953704 | 45.818 |
| 44328.55401620371 | 47.98 |
| 44328.59568287038 | 48.559 |
| 44328.63734953704 | 48.366 |
| 44328.67901620371 | 48.713 |
| 44328.72068287038 | 49.254 |
| 44328.76234953704 | 48.636 |
| 44328.80401620371 | 47.96 |
| 44328.84568287038 | 47.536 |
| 44328.88734953704 | 46.667 |
| 44328.92901620371 | 45.837 |
| 44328.97068287038 | 45.354 |
| 44329.01234953704 | 44.794 |
| 44329.05401620371 | 44.157 |
| 44329.09568287038 | 43.617 |
| 44329.13734953704 | 43.057 |
| 44329.17901620371 | 42.458 |
| 44329.22068287038 | 41.763 |
| 44329.26234953704 | 41.011 |
| 44329.30401620371 | 40.431 |
| 44329.34568287038 | 40.47 |
| 44329.38734953704 | 41.551 |
| 44329.42901620371 | 43.462 |
| 44329.47068287038 | 46.165 |
| 44329.51234953704 | 48.443 |
| 44329.55401620371 | 50.76 |
| 44329.59568287038 | 51.879 |
| 44329.63734953704 | 52.014 |
| 44329.67901620371 | 51.59 |
| 44329.72068287038 | 50.142 |
| 44329.76234953704 | 49.736 |
| 44329.80401620371 | 49.119 |
| 44329.84568287038 | 48.134 |
| 44329.88734953704 | 47.594 |
| 44329.92901620371 | 47.053 |
| 44329.97068287038 | 46.493 |
| 44330.01234953704 | 46.011 |
| 44330.05401620371 | 45.393 |
| 44330.09568287038 | 44.852 |
| 44330.13734953704 | 44.215 |
| 44330.17901620371 | 43.713 |
| 44330.22068287038 | 43.25 |
| 44330.26234953704 | 42.69 |
| 44330.30401620371 | 42.304 |
| 44330.34568287038 | 42.516 |
| 44330.38734953704 | 43.462 |
| 44330.42901620371 | 44.582 |
| 44330.47068287038 | 47.13 |
| 44330.51234953704 | 48.617 |
| 44330.55401620371 | 51.049 |
| 44330.59568287038 | 50.605 |
| 44330.63734953704 | 51.86 |
| 44330.67901620371 | 51.957 |
| 44330.72068287038 | 51.841 |
| 44330.76234953704 | 51.223 |
| 44330.80401620371 | 50.277 |
| 44330.84568287038 | 49.389 |
| 44330.88734953704 | 48.694 |
| 44330.92901620371 | 48.018 |
| 44330.97068287038 | 47.343 |
| 44331.01234953704 | 46.59 |
| 44331.05401620371 | 45.991 |
| 44331.09568287038 | 45.412 |
| 44331.13734953704 | 44.987 |
| 44331.17901620371 | 44.621 |
| 44331.22068287038 | 44.138 |
| 44331.26234953704 | 43.559 |
| 44331.30401620371 | 43.057 |
| 44331.34568287038 | 43.095 |
| 44331.38734953704 | 44.138 |
| 44331.42901620371 | 45.953 |
| 44331.47068287038 | 48.559 |
| 44331.51234953704 | 51.011 |
| 44331.55401620371 | 52.864 |
| 44331.59568287038 | 54.543 |
| 44331.63734953704 | 54.37 |
| 44331.67901620371 | 55.123 |
| 44331.72068287038 | 55.354 |
| 44331.76234953704 | 54.679 |
| 44331.80401620371 | 53.597 |
| 44331.84568287038 | 52.632 |
| 44331.88734953704 | 51.802 |
| 44331.92901620371 | 50.837 |
| 44331.97068287038 | 49.968 |
| 44332.01234953704 | 49.119 |
| 44332.05401620371 | 48.404 |
| 44332.09568287038 | 47.652 |
| 44332.13734953704 | 46.841 |
| 44332.17901620371 | 46.011 |
| 44332.22068287038 | 45.296 |
| 44332.26234953704 | 44.505 |
| 44332.30401620371 | 43.984 |
| 44332.34568287038 | 43.829 |
| 44332.38734953704 | 44.64 |
| 44332.42901620371 | 46.358 |
| 44332.47068287038 | 47.555 |
| 44332.51234953704 | 50.586 |
| 44332.55401620371 | 51.204 |
| 44332.59568287038 | 52.536 |
| 44332.63734953704 | 51.744 |
| 44332.67901620371 | 51.493 |
| 44332.72068287038 | 51.319 |
| 44332.76234953704 | 51.223 |
| 44332.80401620371 | 50.74 |
| 44332.84568287038 | 50.084 |
| 44332.88734953704 | 49.273 |
| 44332.92901620371 | 48.655 |
| 44332.97068287038 | 48.289 |
| 44333.01234953704 | 47.864 |
| 44333.05401620371 | 47.343 |
| 44333.09568287038 | 46.513 |
| 44333.13734953704 | 45.586 |
| 44333.17901620371 | 44.775 |
| 44333.22068287038 | 44.041 |
| 44333.26234953704 | 43.366 |
| 44333.30401620371 | 42.883 |
| 44333.34568287038 | 42.825 |
| 44333.38734953704 | 43.404 |
| 44333.42901620371 | 44.717 |
| 44333.47068287038 | 45.702 |
| 44333.51234953704 | 46.609 |
| 44333.55401620371 | 46.262 |
| 44333.59568287038 | 46.223 |
| 44333.63734953704 | 46.223 |
| 44333.67901620371 | 45.895 |
| 44333.72068287038 | 45.586 |
| 44333.76234953704 | 45.702 |
| 44333.80401620371 | 45.779 |
| 44333.84568287038 | 45.624 |
| 44333.88734953704 | 45.335 |
| 44333.92901620371 | 45.065 |
| 44333.97068287038 | 44.659 |
| 44334.01234953704 | 44.234 |
| 44334.05401620371 | 43.945 |
| 44334.09568287038 | 43.713 |
| 44334.13734953704 | 43.424 |
| 44334.17901620371 | 43.076 |
| 44334.22068287038 | 42.806 |
| 44334.26234953704 | 42.439 |
| 44334.30401620371 | 42.285 |
| 44334.34568287038 | 42.381 |
| 44334.38734953704 | 43.095 |
| 44334.42901620371 | 44.736 |
| 44334.47068287038 | 47.207 |
| 44334.51234953704 | 49.543 |
| 44334.55401620371 | 51.628 |
| 44334.59568287038 | 52.96 |
| 44334.63734953704 | 52.323 |
| 44334.67901620371 | 52.111 |
| 44334.72068287038 | 51.667 |
| 44334.76234953704 | 51.957 |
| 44334.80401620371 | 51.455 |
| 44334.84568287038 | 51.088 |
| 44334.88734953704 | 50.509 |
| 44334.92901620371 | 49.794 |
| 44334.97068287038 | 48.752 |
| 44335.01234953704 | 47.767 |
| 44335.05401620371 | 46.841 |
| 44335.09568287038 | 45.953 |
| 44335.13734953704 | 45.103 |
| 44335.17901620371 | 44.234 |
| 44335.22068287038 | 43.424 |
| 44335.26234953704 | 42.922 |
| 44335.30401620371 | 42.536 |
| 44335.34568287038 | 42.42 |
| 44335.38734953704 | 43.211 |
| 44335.42901620371 | 44.698 |
| 44335.47068287038 | 46.976 |
| 44335.51234953704 | 49.389 |
| 44335.55401620371 | 51.879 |
| 44335.59568287038 | 52.787 |
| 44335.63734953704 | 54.177 |
| 44335.67901620371 | 55.431 |
| 44335.72068287038 | 54.408 |
| 44335.76234953704 | 54.042 |
| 44335.80401620371 | 53.289 |
| 44335.84568287038 | 52.285 |
| 44335.88734953704 | 51.204 |
| 44335.92901620371 | 50.277 |
| 44335.97068287038 | 49.408 |
| 44336.01234953704 | 48.752 |
| 44336.05401620371 | 48.115 |
| 44336.09568287038 | 47.381 |
| 44336.13734953704 | 46.397 |
| 44336.17901620371 | 45.335 |
| 44336.22068287038 | 44.273 |
| 44336.26234953704 | 43.404 |
| 44336.30401620371 | 42.864 |
| 44336.34568287038 | 42.922 |
| 44336.38734953704 | 44.003 |
| 44336.42901620371 | 45.567 |
| 44336.47068287038 | 47.497 |
| 44336.51234953704 | 49.621 |
| 44336.55401620371 | 51.59 |
| 44336.59568287038 | 52.69 |
| 44336.63734953704 | 55.026 |
| 44336.67901620371 | 55.547 |
| 44336.72068287038 | 54.621 |
| 44336.76234953704 | 54.157 |
| 44336.80401620371 | 53.424 |
| 44336.84568287038 | 52.652 |
| 44336.88734953704 | 51.821 |
| 44336.92901620371 | 50.991 |
| 44336.97068287038 | 49.987 |
| 44337.01234953704 | 49.061 |
| 44337.05401620371 | 48.173 |
| 44337.09568287038 | 47.207 |
| 44337.13734953704 | 46.126 |
| 44337.17901620371 | 45.007 |
| 44337.22068287038 | 44.022 |
| 44337.26234953704 | 43.115 |
| 44337.30401620371 | 42.536 |
| 44337.34568287038 | 42.516 |
| 44337.38734953704 | 43.076 |
| 44337.42901620371 | 43.887 |
| 44337.47068287038 | 46.03 |
| 44337.51234953704 | 48.096 |
| 44337.55401620371 | 49.35 |
| 44337.59568287038 | 50.625 |
| 44337.63734953704 | 52.014 |
| 44337.67901620371 | 51.57 |
| 44337.72068287038 | 51.223 |
| 44337.76234953704 | 50.682 |
| 44337.80401620371 | 49.717 |
| 44337.84568287038 | 48.868 |
| 44337.88734953704 | 47.999 |
| 44337.92901620371 | 47.304 |
| 44337.97068287038 | 46.609 |
| 44338.01234953704 | 45.933 |
| 44338.05401620371 | 45.354 |
| 44338.09568287038 | 44.756 |
| 44338.13734953704 | 44.234 |
| 44338.17901620371 | 43.636 |
| 44338.22068287038 | 43.173 |
| 44338.26234953704 | 42.709 |
| 44338.30401620371 | 42.265 |
| 44338.34568287038 | 42.536 |
| 44338.38734953704 | 43.404 |
| 44338.42901620371 | 44.968 |
| 44338.47068287038 | 47.014 |
| 44338.51234953704 | 48.636 |
| 44338.55401620371 | 48.945 |
| 44338.59568287038 | 51.532 |
| 44338.63734953704 | 53.385 |
| 44338.67901620371 | 53.501 |
| 44338.72068287038 | 54.196 |
| 44338.76234953704 | 53.578 |
| 44338.80401620371 | 52.69 |
| 44338.84568287038 | 51.609 |
| 44338.88734953704 | 50.644 |
| 44338.92901620371 | 49.679 |
| 44338.97068287038 | 48.945 |
| 44339.01234953704 | 48.385 |
| 44339.05401620371 | 47.806 |
| 44339.09568287038 | 47.014 |
| 44339.13734953704 | 46.126 |
| 44339.17901620371 | 45.161 |
| 44339.22068287038 | 44.138 |
| 44339.26234953704 | 43.308 |
| 44339.30401620371 | 42.574 |
| 44339.34568287038 | 42.497 |
| 44339.38734953704 | 42.787 |
| 44339.42901620371 | 43.289 |
| 44339.47068287038 | 44.35 |
| 44339.51234953704 | 45.219 |
| 44339.55401620371 | 45.316 |
| 44339.59568287038 | 45.895 |
| 44339.63734953704 | 46.435 |
| 44339.67901620371 | 47.458 |
| 44339.72068287038 | 48.501 |
| 44339.76234953704 | 48.868 |
| 44339.80401620371 | 48.211 |
| 44339.84568287038 | 47.516 |
| 44339.88734953704 | 46.899 |
| 44339.92901620371 | 46.088 |
| 44339.97068287038 | 45.258 |
| 44340.01234953704 | 44.37 |
| 44340.05401620371 | 43.52 |
| 44340.09568287038 | 42.69 |
| 44340.13734953704 | 41.879 |
| 44340.17901620371 | 41.068 |
| 44340.22068287038 | 40.316 |
| 44340.26234953704 | 39.543 |
| 44340.30401620371 | 39.061 |
| 44340.34568287038 | 39.041 |
| 44340.38734953704 | 39.814 |
| 44340.42901620371 | 41.416 |
| 44340.47068287038 | 43.597 |
| 44340.51234953704 | 46.049 |
| 44340.55401620371 | 48.482 |
| 44340.59568287038 | 50.625 |
| 44340.63734953704 | 52.285 |
| 44340.67901620371 | 53.057 |
| 44340.72068287038 | 53.559 |
| 44340.76234953704 | 53.289 |
| 44340.80401620371 | 52.072 |
| 44340.84568287038 | 50.953 |
| 44340.88734953704 | 50.18 |
| 44340.92901620371 | 49.37 |
| 44340.97068287038 | 48.559 |
| 44341.01234953704 | 47.729 |
| 44341.05401620371 | 46.957 |
| 44341.09568287038 | 46.184 |
| 44341.13734953704 | 45.316 |
| 44341.17901620371 | 44.273 |
| 44341.22068287038 | 43.173 |
| 44341.26234953704 | 42.169 |
| 44341.30401620371 | 41.339 |
| 44341.34568287038 | 41.107 |
| 44341.38734953704 | 41.744 |
| 44341.42901620371 | 43.153 |
| 44341.47068287038 | 45.277 |
| 44341.51234953704 | 47.516 |
| 44341.55401620371 | 49.736 |
| 44341.59568287038 | 51.551 |
| 44341.63734953704 | 53.443 |
| 44341.67901620371 | 54.621 |
| 44341.72068287038 | 54.949 |
| 44341.76234953704 | 54.428 |
| 44341.80401620371 | 53.424 |
| 44341.84568287038 | 52.555 |
| 44341.88734953704 | 51.667 |
| 44341.92901620371 | 50.76 |
| 44341.97068287038 | 49.968 |
| 44342.01234953704 | 49.273 |
| 44342.05401620371 | 48.713 |
| 44342.09568287038 | 47.98 |
| 44342.13734953704 | 47.092 |
| 44342.17901620371 | 46.107 |
| 44342.22068287038 | 45.045 |
| 44342.26234953704 | 44.003 |
| 44342.30401620371 | 43.308 |
| 44342.34568287038 | 43.057 |
| 44342.38734953704 | 43.366 |
| 44342.42901620371 | 44.08 |
| 44342.47068287038 | 45.837 |
| 44342.51234953704 | 47.014 |
| 44342.55401620371 | 47.613 |
| 44342.59568287038 | 47.845 |
| 44342.63734953704 | 47.883 |
| 44342.67901620371 | 48.327 |
| 44342.72068287038 | 49.35 |
| 44342.76234953704 | 49.466 |
| 44342.80401620371 | 49.235 |
| 44342.84568287038 | 48.694 |
| 44342.88734953704 | 48.327 |
| 44342.92901620371 | 47.883 |
| 44342.97068287038 | 47.343 |
| 44343.01234953704 | 46.821 |
| 44343.05401620371 | 46.3 |
| 44343.09568287038 | 45.914 |
| 44343.13734953704 | 45.296 |
| 44343.17901620371 | 44.621 |
| 44343.22068287038 | 43.848 |
| 44343.26234953704 | 43.095 |
| 44343.30401620371 | 42.497 |
| 44343.34568287038 | 42.516 |
| 44343.38734953704 | 43.231 |
| 44343.42901620371 | 44.775 |
| 44343.47068287038 | 46.879 |
| 44343.51234953704 | 49.177 |
| 44343.55401620371 | 51.435 |
| 44343.59568287038 | 53.347 |
| 44343.63734953704 | 54.833 |
| 44343.67901620371 | 55.605 |
| 44343.72068287038 | 54.987 |
| 44343.76234953704 | 54.524 |
| 44343.80401620371 | 53.617 |
| 44343.84568287038 | 52.96 |
| 44343.88734953704 | 52.169 |
| 44343.92901620371 | 51.262 |
| 44343.97068287038 | 50.393 |
| 44344.01234953704 | 49.505 |
| 44344.05401620371 | 48.597 |
| 44344.09568287038 | 47.613 |
| 44344.13734953704 | 46.474 |
| 44344.17901620371 | 45.373 |
| 44344.22068287038 | 44.312 |
| 44344.26234953704 | 43.289 |
| 44344.30401620371 | 42.439 |
| 44344.34568287038 | 42.227 |
| 44344.38734953704 | 42.845 |
| 44344.42901620371 | 44.273 |
| 44344.47068287038 | 45.991 |
| 44344.51234953704 | 46.957 |
| 44344.55401620371 | 48.501 |
| 44344.59568287038 | 49.408 |
| 44344.63734953704 | 51.551 |
| 44344.67901620371 | 52.285 |
| 44344.72068287038 | 51.841 |
| 44344.76234953704 | 51.551 |
| 44344.80401620371 | 51.416 |
| 44344.84568287038 | 50.663 |
| 44344.88734953704 | 50.084 |
| 44344.92901620371 | 49.428 |
| 44344.97068287038 | 48.81 |
| 44345.01234953704 | 48.25 |
| 44345.05401620371 | 47.709 |
| 44345.09568287038 | 46.918 |
| 44345.13734953704 | 46.088 |
| 44345.17901620371 | 45.219 |
| 44345.22068287038 | 44.254 |
| 44345.26234953704 | 43.269 |
| 44345.30401620371 | 42.594 |
| 44345.34568287038 | 42.458 |
| 44345.38734953704 | 43.095 |
| 44345.42901620371 | 44.485 |
| 44345.47068287038 | 46.744 |
| 44345.51234953704 | 47.574 |
| 44345.55401620371 | 49.003 |
| 44345.59568287038 | 49.987 |
| 44345.63734953704 | 50.605 |
| 44345.67901620371 | 51.841 |
| 44345.72068287038 | 52.304 |
| 44345.76234953704 | 52.13 |
| 44345.80401620371 | 51.628 |
| 44345.84568287038 | 51.107 |
| 44345.88734953704 | 50.412 |
| 44345.92901620371 | 49.717 |
| 44345.97068287038 | 49.119 |
| 44346.01234953704 | 48.54 |
| 44346.05401620371 | 47.825 |
| 44346.09568287038 | 47.111 |
| 44346.13734953704 | 46.358 |
| 44346.17901620371 | 45.721 |
| 44346.22068287038 | 45.045 |
| 44346.26234953704 | 44.505 |
| 44346.30401620371 | 44.234 |
| 44346.34568287038 | 44.119 |
| 44346.38734953704 | 44.254 |
| 44346.42901620371 | 44.833 |
| 44346.47068287038 | 46.088 |
| 44346.51234953704 | 47.574 |
| 44346.55401620371 | 47.362 |
| 44346.59568287038 | 47.439 |
| 44346.63734953704 | 47.072 |
| 44346.67901620371 | 46.686 |
| 44346.72068287038 | 46.841 |
| 44346.76234953704 | 46.821 |
| 44346.80401620371 | 46.802 |
| 44346.84568287038 | 46.609 |
| 44346.88734953704 | 46.223 |
| 44346.92901620371 | 45.875 |
| 44346.97068287038 | 45.547 |
| 44347.01234953704 | 45.277 |
| 44347.05401620371 | 44.929 |
| 44347.09568287038 | 44.582 |
| 44347.13734953704 | 44.099 |
| 44347.17901620371 | 43.617 |
| 44347.22068287038 | 43.115 |
| 44347.26234953704 | 42.651 |
| 44347.30401620371 | 42.478 |
| 44347.34568287038 | 42.632 |
| 44347.38734953704 | 43.366 |
| 44347.42901620371 | 44.794 |
| 44347.47068287038 | 47.207 |
| 44347.51234953704 | 49.736 |
| 44347.55401620371 | 52.285 |
| 44347.59568287038 | 54.698 |
| 44347.63734953704 | 56.3 |
| 44347.67901620371 | 54.486 |
| 44347.72068287038 | 54.524 |
| 44347.76234953704 | 53.771 |
| 44347.80401620371 | 53.115 |
| 44347.84568287038 | 51.802 |
| 44347.88734953704 | 50.76 |
| 44347.92901620371 | 49.968 |
| 44347.97068287038 | 48.945 |
| 44348.01234953704 | 47.845 |
| 44348.05401620371 | 46.976 |
| 44348.09568287038 | 46.03 |
| 44348.13734953704 | 45.219 |
| 44348.17901620371 | 44.389 |
| 44348.22068287038 | 43.617 |
| 44348.26234953704 | 42.941 |
| 44348.30401620371 | 42.632 |
| 44348.34568287038 | 42.594 |
| 44348.38734953704 | 43.327 |
| 44348.42901620371 | 44.254 |
| 44348.47068287038 | 46.184 |
| 44348.51234953704 | 48.134 |
| 44348.55401620371 | 50.026 |
| 44348.59568287038 | 50.663 |
| 44348.63734953704 | 50.76 |
| 44348.67901620371 | 52.323 |
| 44348.72068287038 | 52.729 |
| 44348.76234953704 | 52.169 |
| 44348.80401620371 | 51.57 |
| 44348.84568287038 | 51.358 |
| 44348.88734953704 | 50.605 |
| 44348.92901620371 | 49.852 |
| 44348.97068287038 | 49.157 |
| 44349.01234953704 | 48.54 |
| 44349.05401620371 | 47.864 |
| 44349.09568287038 | 47.323 |
| 44349.13734953704 | 46.648 |
| 44349.17901620371 | 45.856 |
| 44349.22068287038 | 45.258 |
| 44349.26234953704 | 44.621 |
| 44349.30401620371 | 44.138 |
| 44349.34568287038 | 44.08 |
| 44349.38734953704 | 44.775 |
| 44349.42901620371 | 45.586 |
| 44349.47068287038 | 47.478 |
| 44349.51234953704 | 49.949 |
| 44349.55401620371 | 51.281 |
| 44349.59568287038 | 52.652 |
| 44349.63734953704 | 53.54 |
| 44349.67901620371 | 54.93 |
| 44349.72068287038 | 55.277 |
| 44349.76234953704 | 54.37 |
| 44349.80401620371 | 53.366 |
| 44349.84568287038 | 52.941 |
| 44349.88734953704 | 52.227 |
| 44349.92901620371 | 51.551 |
| 44349.97068287038 | 50.895 |
| 44350.01234953704 | 50.238 |
| 44350.05401620371 | 49.35 |
| 44350.09568287038 | 48.308 |
| 44350.13734953704 | 47.246 |
| 44350.17901620371 | 46.242 |
| 44350.22068287038 | 45.2 |
| 44350.26234953704 | 44.273 |
| 44350.30401620371 | 43.559 |
| 44350.34568287038 | 43.482 |
| 44350.38734953704 | 44.099 |
| 44350.42901620371 | 45.451 |
| 44350.47068287038 | 47.439 |
| 44350.51234953704 | 49.756 |
| 44350.55401620371 | 52.072 |
| 44350.59568287038 | 53.926 |
| 44350.63734953704 | 55.798 |
| 44350.67901620371 | 56.783 |
| 44350.72068287038 | 57.439 |
| 44350.76234953704 | 57.208 |
| 44350.80401620371 | 56.493 |
| 44350.84568287038 | 55.837 |
| 44350.88734953704 | 55.103 |
| 44350.92901620371 | 54.312 |
| 44350.97068287038 | 53.443 |
| 44351.01234953704 | 52.632 |
| 44351.05401620371 | 51.667 |
| 44351.09568287038 | 50.489 |
| 44351.13734953704 | 49.177 |
| 44351.17901620371 | 47.767 |
| 44351.22068287038 | 46.474 |
| 44351.26234953704 | 45.431 |
| 44351.30401620371 | 44.621 |
| 44351.34568287038 | 44.466 |
| 44351.38734953704 | 44.929 |
| 44351.42901620371 | 46.262 |
| 44351.47068287038 | 48.134 |
| 44351.51234953704 | 50.2 |
| 44351.55401620371 | 52.323 |
| 44351.59568287038 | 54.389 |
| 44351.63734953704 | 56.165 |
| 44351.67901620371 | 57.323 |
| 44351.72068287038 | 57.999 |
| 44351.76234953704 | 58.096 |
| 44351.80401620371 | 57.478 |
| 44351.84568287038 | 56.493 |
| 44351.88734953704 | 55.567 |
| 44351.92901620371 | 54.717 |
| 44351.97068287038 | 53.597 |
| 44352.01234953704 | 52.401 |
| 44352.05401620371 | 51.049 |
| 44352.09568287038 | 49.543 |
| 44352.13734953704 | 48.076 |
| 44352.17901620371 | 46.763 |
| 44352.22068287038 | 45.702 |
| 44352.26234953704 | 44.891 |
| 44352.30401620371 | 44.273 |
| 44352.34568287038 | 44.138 |
| 44352.38734953704 | 44.775 |
| 44352.42901620371 | 45.818 |
| 44352.47068287038 | 47.729 |
| 44352.51234953704 | 49.872 |
| 44352.55401620371 | 52.169 |
| 44352.59568287038 | 54.35 |
| 44352.63734953704 | 55.219 |
| 44352.67901620371 | 54.698 |
| 44352.72068287038 | 54.505 |
| 44352.76234953704 | 54.022 |
| 44352.80401620371 | 53.655 |
| 44352.84568287038 | 53.192 |
| 44352.88734953704 | 52.246 |
| 44352.92901620371 | 51.493 |
| 44352.97068287038 | 50.779 |
| 44353.01234953704 | 49.756 |
| 44353.05401620371 | 48.54 |
| 44353.09568287038 | 47.439 |
| 44353.13734953704 | 46.455 |
| 44353.17901620371 | 45.605 |
| 44353.22068287038 | 44.891 |
| 44353.26234953704 | 44.234 |
| 44353.30401620371 | 43.771 |
| 44353.34568287038 | 43.79 |
| 44353.38734953704 | 44.292 |
| 44353.42901620371 | 45.373 |
| 44353.47068287038 | 47.323 |
| 44353.51234953704 | 49.177 |
| 44353.55401620371 | 51.3 |
| 44353.59568287038 | 52.825 |
| 44353.63734953704 | 52.246 |
| 44353.67901620371 | 51.532 |
| 44353.72068287038 | 51.86 |
| 44353.76234953704 | 51.262 |
| 44353.80401620371 | 51.107 |
| 44353.84568287038 | 50.702 |
| 44353.88734953704 | 50.354 |
| 44353.92901620371 | 50.065 |
| 44353.97068287038 | 49.447 |
| 44354.01234953704 | 48.597 |
| 44354.05401620371 | 47.729 |
| 44354.09568287038 | 46.783 |
| 44354.13734953704 | 46.03 |
| 44354.17901620371 | 45.296 |
| 44354.22068287038 | 44.659 |
| 44354.26234953704 | 44.273 |
| 44354.30401620371 | 43.829 |
| 44354.34568287038 | 43.617 |
| 44354.38734953704 | 44.234 |
| 44354.42901620371 | 45.489 |
| 44354.47068287038 | 47.401 |
| 44354.51234953704 | 48.404 |
| 44354.55401620371 | 48.906 |
| 44354.59568287038 | 51.281 |
| 44354.63734953704 | 51.879 |
| 44354.67901620371 | 52.729 |
| 44354.72068287038 | 52.709 |
| 44354.76234953704 | 53.211 |
| 44354.80401620371 | 53.308 |
| 44354.84568287038 | 53.578 |
| 44354.88734953704 | 53.153 |
| 44354.92901620371 | 52.401 |
| 44354.97068287038 | 51.435 |
| 44355.01234953704 | 50.509 |
| 44355.05401620371 | 49.582 |
| 44355.09568287038 | 48.462 |
| 44355.13734953704 | 47.343 |
| 44355.17901620371 | 46.397 |
| 44355.22068287038 | 45.489 |
| 44355.26234953704 | 44.736 |
| 44355.30401620371 | 44.215 |
| 44355.34568287038 | 44.157 |
| 44355.38734953704 | 44.775 |
| 44355.42901620371 | 46.107 |
| 44355.47068287038 | 47.806 |
| 44355.51234953704 | 49.736 |
| 44355.55401620371 | 51.918 |
| 44355.59568287038 | 53.906 |
| 44355.63734953704 | 55.895 |
| 44355.67901620371 | 57.072 |
| 44355.72068287038 | 57.536 |
| 44355.76234953704 | 57.227 |
| 44355.80401620371 | 56.474 |
| 44355.84568287038 | 55.586 |
| 44355.88734953704 | 54.756 |
| 44355.92901620371 | 53.964 |
| 44355.97068287038 | 52.98 |
| 44356.01234953704 | 51.764 |
| 44356.05401620371 | 50.354 |
| 44356.09568287038 | 48.848 |
| 44356.13734953704 | 47.42 |
| 44356.17901620371 | 46.146 |
| 44356.22068287038 | 45.123 |
| 44356.26234953704 | 44.157 |
| 44356.30401620371 | 43.501 |
| 44356.34568287038 | 43.385 |
| 44356.38734953704 | 43.945 |
| 44356.42901620371 | 45.258 |
| 44356.47068287038 | 47.053 |
| 44356.51234953704 | 49.041 |
| 44356.55401620371 | 51.358 |
| 44356.59568287038 | 53.578 |
| 44356.63734953704 | 54.563 |
| 44356.67901620371 | 55.779 |
| 44356.72068287038 | 56.918 |
| 44356.76234953704 | 57.285 |
| 44356.80401620371 | 57.053 |
| 44356.84568287038 | 56.706 |
| 44356.88734953704 | 55.953 |
| 44356.92901620371 | 55.007 |
| 44356.97068287038 | 54.543 |
| 44357.01234953704 | 53.752 |
| 44357.05401620371 | 52.594 |
| 44357.09568287038 | 51.319 |
| 44357.13734953704 | 50.605 |
| 44357.17901620371 | 49.157 |
| 44357.22068287038 | 48.173 |
| 44357.26234953704 | 47.034 |
| 44357.30401620371 | 46.551 |
| 44357.34568287038 | 46.088 |
| 44357.38734953704 | 46.358 |
| 44357.42901620371 | 47.13 |
| 44357.47068287038 | 48.54 |
| 44357.51234953704 | 50.567 |
| 44357.55401620371 | 52.072 |
| 44357.59568287038 | 54.93 |
| 44357.63734953704 | 55.972 |
| 44357.67901620371 | 57.246 |
| 44357.72068287038 | 57.594 |
| 44357.76234953704 | 57.053 |
| 44357.80401620371 | 56.204 |
| 44357.84568287038 | 55.161 |
| 44357.88734953704 | 54.35 |
| 44357.92901620371 | 53.887 |
| 44357.97068287038 | 53.308 |
| 44358.01234953704 | 52.362 |
| 44358.05401620371 | 51.628 |
| 44358.09568287038 | 50.702 |
| 44358.13734953704 | 49.37 |
| 44358.17901620371 | 48.038 |
| 44358.22068287038 | 47.343 |
| 44358.26234953704 | 46.204 |
| 44358.30401620371 | 45.74 |
| 44358.34568287038 | 44.987 |
| 44358.38734953704 | 44.968 |
| 44358.42901620371 | 45.74 |
| 44358.47068287038 | 46.667 |
| 44358.51234953704 | 48.424 |
| 44358.55401620371 | 51.126 |
| 44358.59568287038 | 52.458 |
| 44358.63734953704 | 54.949 |
| 44358.67901620371 | 55.953 |
| 44358.72068287038 | 56.513 |
| 44358.76234953704 | 56.474 |
| 44358.80401620371 | 56.435 |
| 44358.84568287038 | 55.721 |
| 44358.88734953704 | 55.142 |
| 44358.92901620371 | 54.37 |
| 44358.97068287038 | 53.597 |
| 44359.01234953704 | 53.115 |
| 44359.05401620371 | 52.265 |
| 44359.09568287038 | 50.528 |
| 44359.13734953704 | 49.872 |
| 44359.17901620371 | 49.157 |
| 44359.22068287038 | 47.98 |
| 44359.26234953704 | 47.092 |
| 44359.30401620371 | 46.223 |
| 44359.34568287038 | 45.818 |
| 44359.38734953704 | 45.779 |
| 44359.42901620371 | 46.57 |
| 44359.47068287038 | 47.594 |
| 44359.51234953704 | 49.254 |
| 44359.55401620371 | 51.088 |
| 44359.59568287038 | 53.173 |
| 44359.63734953704 | 55.065 |
| 44359.67901620371 | 56.03 |
| 44359.72068287038 | 57.516 |
| 44359.76234953704 | 57.594 |
| 44359.80401620371 | 57.42 |
| 44359.84568287038 | 56.918 |
| 44359.88734953704 | 56.223 |
| 44359.92901620371 | 55.451 |
| 44359.97068287038 | 54.698 |
| 44360.01234953704 | 53.675 |
| 44360.05401620371 | 52.729 |
| 44360.09568287038 | 51.377 |
| 44360.13734953704 | 50.605 |
| 44360.17901620371 | 49.833 |
| 44360.22068287038 | 48.713 |
| 44360.26234953704 | 48.038 |
| 44360.30401620371 | 47.13 |
| 44360.34568287038 | 46.551 |
| 44360.38734953704 | 46.783 |
| 44360.42901620371 | 47.729 |
| 44360.47068287038 | 48.791 |
| 44360.51234953704 | 51.049 |
| 44360.55401620371 | 52.381 |
| 44360.59568287038 | 54.679 |
| 44360.63734953704 | 56.011 |
| 44360.67901620371 | 57.883 |
| 44360.72068287038 | 58.385 |
| 44360.76234953704 | 59.022 |
| 44360.80401620371 | 58.771 |
| 44360.84568287038 | 57.999 |
| 44360.88734953704 | 57.246 |
| 44360.92901620371 | 56.377 |
| 44360.97068287038 | 55.316 |
| 44361.01234953704 | 54.331 |
| 44361.05401620371 | 53.308 |
| 44361.09568287038 | 52.092 |
| 44361.13734953704 | 51.551 |
| 44361.17901620371 | 50.933 |
| 44361.22068287038 | 49.891 |
| 44361.26234953704 | 49.196 |
| 44361.30401620371 | 48.424 |
| 44361.34568287038 | 47.999 |
| 44361.38734953704 | 48.231 |
| 44361.42901620371 | 49.061 |
| 44361.47068287038 | 50.451 |
| 44361.51234953704 | 52.246 |
| 44361.55401620371 | 54.679 |
| 44361.59568287038 | 55.895 |
| 44361.63734953704 | 57.323 |
| 44361.67901620371 | 58.713 |
| 44361.72068287038 | 59.582 |
| 44361.76234953704 | 59.447 |
| 44361.80401620371 | 59.273 |
| 44361.84568287038 | 58.675 |
| 44361.88734953704 | 58.096 |
| 44361.92901620371 | 57.15 |
| 44361.97068287038 | 56.069 |
| 44362.01234953704 | 54.872 |
| 44362.05401620371 | 53.906 |
| 44362.09568287038 | 52.96 |
| 44362.13734953704 | 51.57 |
| 44362.17901620371 | 50.045 |
| 44362.22068287038 | 49.254 |
| 44362.26234953704 | 47.922 |
| 44362.30401620371 | 47.401 |
| 44362.34568287038 | 47.227 |
| 44362.38734953704 | 47.748 |
| 44362.42901620371 | 48.964 |
| 44362.47068287038 | 50.74 |
| 44362.51234953704 | 51.899 |
| 44362.55401620371 | 54.157 |
| 44362.59568287038 | 55.335 |
| 44362.63734953704 | 56.532 |
| 44362.67901620371 | 58.462 |
| 44362.72068287038 | 58.636 |
| 44362.76234953704 | 58.926 |
| 44362.80401620371 | 58.636 |
| 44362.84568287038 | 58.076 |
| 44362.88734953704 | 57.516 |
| 44362.92901620371 | 56.706 |
| 44362.97068287038 | 55.702 |
| 44363.01234953704 | 55.142 |
| 44363.05401620371 | 54.022 |
| 44363.09568287038 | 52.845 |
| 44363.13734953704 | 51.899 |
| 44363.17901620371 | 50.316 |
| 44363.22068287038 | 49.659 |
| 44363.26234953704 | 48.791 |
| 44363.30401620371 | 47.941 |
| 44363.34568287038 | 47.767 |
| 44363.38734953704 | 48.308 |
| 44363.42901620371 | 49.331 |
| 44363.47068287038 | 50.76 |
| 44363.51234953704 | 51.744 |
| 44363.55401620371 | 53.771 |
| 44363.59568287038 | 54.466 |
| 44363.63734953704 | 55.47 |
| 44363.67901620371 | 55.953 |
| 44363.72068287038 | 56.667 |
| 44363.76234953704 | 56.899 |
| 44363.80401620371 | 57.015 |
| 44363.84568287038 | 56.976 |
| 44363.88734953704 | 56.358 |
| 44363.92901620371 | 55.605 |
| 44363.97068287038 | 54.852 |
| 44364.01234953704 | 54.138 |
| 44364.05401620371 | 53.308 |
| 44364.09568287038 | 52.265 |
| 44364.13734953704 | 51.397 |
| 44364.17901620371 | 50.374 |
| 44364.22068287038 | 49.466 |
| 44364.26234953704 | 48.791 |
| 44364.30401620371 | 48.173 |
| 44364.34568287038 | 48.173 |
| 44364.38734953704 | 48.694 |
| 44364.42901620371 | 49.814 |
| 44364.47068287038 | 51.513 |
| 44364.51234953704 | 53.404 |
| 44364.55401620371 | 54.659 |
| 44364.59568287038 | 56.049 |
| 44364.63734953704 | 57.516 |
| 44364.67901620371 | 58.096 |
| 44364.72068287038 | 58.598 |
| 44364.76234953704 | 58.598 |
| 44364.80401620371 | 58.385 |
| 44364.84568287038 | 57.555 |
| 44364.88734953704 | 56.744 |
| 44364.92901620371 | 56.088 |
| 44364.97068287038 | 55.528 |
| 44365.01234953704 | 54.891 |
| 44365.05401620371 | 54.312 |
| 44365.09568287038 | 53.289 |
| 44365.13734953704 | 52.188 |
| 44365.17901620371 | 51.165 |
| 44365.22068287038 | 50.277 |
| 44365.26234953704 | 49.64 |
| 44365.30401620371 | 48.945 |
| 44365.34568287038 | 48.578 |
| 44365.38734953704 | 49.022 |
| 44365.42901620371 | 50.123 |
| 44365.47068287038 | 50.953 |
| 44365.51234953704 | 51.532 |
| 44365.55401620371 | 52.034 |
| 44365.59568287038 | 53.269 |
| 44365.63734953704 | 54.621 |
| 44365.67901620371 | 55.991 |
| 44365.72068287038 | 57.015 |
| 44365.76234953704 | 56.474 |
| 44365.80401620371 | 55.682 |
| 44365.84568287038 | 55.258 |
| 44365.88734953704 | 54.466 |
| 44365.92901620371 | 53.771 |
| 44365.97068287038 | 53.404 |
| 44366.01234953704 | 52.941 |
| 44366.05401620371 | 52.439 |
| 44366.09568287038 | 51.57 |
| 44366.13734953704 | 50.74 |
| 44366.17901620371 | 50.084 |
| 44366.22068287038 | 49.485 |
| 44366.26234953704 | 48.945 |
| 44366.30401620371 | 48.578 |
| 44366.34568287038 | 48.443 |
| 44366.38734953704 | 48.887 |
| 44366.42901620371 | 49.949 |
| 44366.47068287038 | 51.319 |
| 44366.51234953704 | 51.86 |
| 44366.55401620371 | 53.076 |
| 44366.59568287038 | 54.794 |
| 44366.63734953704 | 55.103 |
| 44366.67901620371 | 54.756 |
| 44366.72068287038 | 54.659 |
| 44366.76234953704 | 54.91 |
| 44366.80401620371 | 54.563 |
| 44366.84568287038 | 54.08 |
| 44366.88734953704 | 53.578 |
| 44366.92901620371 | 52.903 |
| 44366.97068287038 | 52.111 |
| 44367.01234953704 | 51.3 |
| 44367.05401620371 | 50.547 |
| 44367.09568287038 | 49.872 |
| 44367.13734953704 | 49.099 |
| 44367.17901620371 | 48.269 |
| 44367.22068287038 | 47.594 |
| 44367.26234953704 | 47.304 |
| 44367.30401620371 | 46.918 |
| 44367.34568287038 | 46.937 |
| 44367.38734953704 | 47.439 |
| 44367.42901620371 | 48.848 |
| 44367.47068287038 | 50.76 |
| 44367.51234953704 | 52.787 |
| 44367.55401620371 | 54.003 |
| 44367.59568287038 | 54.91 |
| 44367.63734953704 | 55.76 |
| 44367.67901620371 | 55.818 |
| 44367.72068287038 | 56.049 |
| 44367.76234953704 | 55.76 |
| 44367.80401620371 | 55.528 |
| 44367.84568287038 | 55.219 |
| 44367.88734953704 | 54.775 |
| 44367.92901620371 | 54.157 |
| 44367.97068287038 | 53.347 |
| 44368.01234953704 | 52.594 |
| 44368.05401620371 | 51.879 |
| 44368.09568287038 | 51.069 |
| 44368.13734953704 | 50.18 |
| 44368.17901620371 | 49.312 |
| 44368.22068287038 | 48.443 |
| 44368.26234953704 | 47.767 |
| 44368.30401620371 | 47.169 |
| 44368.34568287038 | 46.995 |
| 44368.38734953704 | 47.594 |
| 44368.42901620371 | 48.984 |
| 44368.47068287038 | 50.856 |
| 44368.51234953704 | 52.806 |
| 44368.55401620371 | 54.814 |
| 44368.59568287038 | 56.648 |
| 44368.63734953704 | 58.154 |
| 44368.67901620371 | 59.157 |
| 44368.72068287038 | 59.524 |
| 44368.76234953704 | 59.273 |
| 44368.80401620371 | 58.482 |
| 44368.84568287038 | 57.652 |
| 44368.88734953704 | 56.725 |
| 44368.92901620371 | 55.876 |
| 44368.97068287038 | 54.949 |
| 44369.01234953704 | 53.964 |
| 44369.05401620371 | 53.076 |
| 44369.09568287038 | 52.169 |
| 44369.13734953704 | 51.165 |
| 44369.17901620371 | 50.103 |
| 44369.22068287038 | 49.061 |
| 44369.26234953704 | 48.153 |
| 44369.30401620371 | 47.516 |
| 44369.34568287038 | 47.42 |
| 44369.38734953704 | 47.941 |
| 44369.42901620371 | 49.254 |
| 44369.47068287038 | 50.895 |
| 44369.51234953704 | 51.879 |
| 44369.55401620371 | 54.157 |
| 44369.59568287038 | 55.316 |
| 44369.63734953704 | 56.397 |
| 44369.67901620371 | 57.555 |
| 44369.72068287038 | 57.092 |
| 44369.76234953704 | 56.976 |
| 44369.80401620371 | 56.764 |
| 44369.84568287038 | 56.493 |
| 44369.88734953704 | 55.991 |
| 44369.92901620371 | 55.258 |
| 44369.97068287038 | 54.37 |
| 44370.01234953704 | 53.597 |
| 44370.05401620371 | 52.903 |
| 44370.09568287038 | 52.208 |
| 44370.13734953704 | 51.377 |
| 44370.17901620371 | 50.509 |
| 44370.22068287038 | 49.679 |
| 44370.26234953704 | 48.848 |
| 44370.30401620371 | 48.25 |
| 44370.34568287038 | 48.038 |
| 44370.38734953704 | 48.443 |
| 44370.42901620371 | 49.312 |
| 44370.47068287038 | 50.509 |
| 44370.51234953704 | 52.632 |
| 44370.55401620371 | 53.501 |
| 44370.59568287038 | 54.003 |
| 44370.63734953704 | 53.617 |
| 44370.67901620371 | 53.617 |
| 44370.72068287038 | 53.791 |
| 44370.76234953704 | 53.54 |
| 44370.80401620371 | 53.192 |
| 44370.84568287038 | 53.096 |
| 44370.88734953704 | 52.787 |
| 44370.92901620371 | 52.42 |
| 44370.97068287038 | 52.072 |
| 44371.01234953704 | 51.764 |
| 44371.05401620371 | 51.493 |
| 44371.09568287038 | 51.242 |
| 44371.13734953704 | 50.953 |
| 44371.17901620371 | 50.528 |
| 44371.22068287038 | 50.103 |
| 44371.26234953704 | 49.717 |
| 44371.30401620371 | 49.37 |
| 44371.34568287038 | 49.37 |
| 44371.38734953704 | 49.794 |
| 44371.42901620371 | 50.374 |
| 44371.47068287038 | 51.242 |
| 44371.51234953704 | 52.574 |
| 44371.55401620371 | 53.655 |
| 44371.59568287038 | 54.93 |
| 44371.63734953704 | 55.065 |
| 44371.67901620371 | 54.968 |
| 44371.72068287038 | 54.679 |
| 44371.76234953704 | 54.794 |
| 44371.80401620371 | 53.926 |
| 44371.84568287038 | 53.404 |
| 44371.88734953704 | 52.96 |
| 44371.92901620371 | 52.574 |
| 44371.97068287038 | 52.014 |
| 44372.01234953704 | 51.474 |
| 44372.05401620371 | 50.837 |
| 44372.09568287038 | 50.123 |
| 44372.13734953704 | 49.563 |
| 44372.17901620371 | 48.964 |
| 44372.22068287038 | 48.346 |
| 44372.26234953704 | 47.806 |
| 44372.30401620371 | 47.536 |
| 44372.34568287038 | 47.362 |
| 44372.38734953704 | 47.902 |
| 44372.42901620371 | 48.771 |
| 44372.47068287038 | 49.679 |
| 44372.51234953704 | 51.764 |
| 44372.55401620371 | 53.578 |
| 44372.59568287038 | 54.64 |
| 44372.63734953704 | 53.462 |
| 44372.67901620371 | 53.54 |
| 44372.72068287038 | 53.81 |
| 44372.76234953704 | 53.636 |
| 44372.80401620371 | 53.424 |
| 44372.84568287038 | 53.211 |
| 44372.88734953704 | 52.96 |
| 44372.92901620371 | 52.516 |
| 44372.97068287038 | 52.034 |
| 44373.01234953704 | 51.628 |
| 44373.05401620371 | 51.377 |
| 44373.09568287038 | 51.049 |
| 44373.13734953704 | 50.663 |
| 44373.17901620371 | 50.2 |
| 44373.22068287038 | 49.717 |
| 44373.26234953704 | 49.292 |
| 44373.30401620371 | 48.964 |
| 44373.34568287038 | 48.791 |
| 44373.38734953704 | 48.926 |
| 44373.42901620371 | 49.543 |
| 44373.47068287038 | 50.47 |
| 44373.51234953704 | 51.03 |
| 44373.55401620371 | 50.76 |
| 44373.59568287038 | 51.435 |
| 44373.63734953704 | 52.478 |
| 44373.67901620371 | 53.096 |
| 44373.72068287038 | 53.366 |
| 44373.76234953704 | 53.52 |
| 44373.80401620371 | 53.366 |
| 44373.84568287038 | 52.999 |
| 44373.88734953704 | 52.652 |
| 44373.92901620371 | 52.343 |
| 44373.97068287038 | 52.014 |
| 44374.01234953704 | 51.609 |
| 44374.05401620371 | 51.262 |
| 44374.09568287038 | 50.837 |
| 44374.13734953704 | 50.393 |
| 44374.17901620371 | 50.007 |
| 44374.22068287038 | 49.466 |
| 44374.26234953704 | 48.964 |
| 44374.30401620371 | 48.636 |
| 44374.34568287038 | 48.385 |
| 44374.38734953704 | 48.462 |
| 44374.42901620371 | 49.466 |
| 44374.47068287038 | 51.011 |
| 44374.51234953704 | 52.092 |
| 44374.55401620371 | 53.752 |
| 44374.59568287038 | 54.93 |
| 44374.63734953704 | 55.798 |
| 44374.67901620371 | 55.721 |
| 44374.72068287038 | 55.74 |
| 44374.76234953704 | 55.374 |
| 44374.80401620371 | 54.852 |
| 44374.84568287038 | 54.08 |
| 44374.88734953704 | 53.308 |
| 44374.92901620371 | 52.709 |
| 44374.97068287038 | 52.188 |
| 44375.01234953704 | 51.686 |
| 44375.05401620371 | 51.223 |
| 44375.09568287038 | 50.682 |
| 44375.13734953704 | 50.123 |
| 44375.17901620371 | 49.428 |
| 44375.22068287038 | 48.578 |
| 44375.26234953704 | 47.787 |
| 44375.30401620371 | 47.169 |
| 44375.34568287038 | 46.879 |
| 44375.38734953704 | 47.42 |
| 44375.42901620371 | 48.636 |
| 44375.47068287038 | 50.567 |
| 44375.51234953704 | 52.497 |
| 44375.55401620371 | 53.501 |
| 44375.59568287038 | 53.578 |
| 44375.63734953704 | 53.945 |
| 44375.67901620371 | 54.833 |
| 44375.72068287038 | 55.354 |
| 44375.76234953704 | 55.277 |
| 44375.80401620371 | 54.814 |
| 44375.84568287038 | 54.37 |
| 44375.88734953704 | 53.771 |
| 44375.92901620371 | 53.385 |
| 44375.97068287038 | 52.922 |
| 44376.01234953704 | 52.516 |
| 44376.05401620371 | 52.188 |
| 44376.09568287038 | 51.879 |
| 44376.13734953704 | 51.377 |
| 44376.17901620371 | 50.702 |
| 44376.22068287038 | 49.872 |
| 44376.26234953704 | 49.041 |
| 44376.30401620371 | 48.443 |
| 44376.34568287038 | 48.346 |
| 44376.38734953704 | 48.636 |
| 44376.42901620371 | 49.582 |
| 44376.47068287038 | 51.57 |
| 44376.51234953704 | 51.686 |
| 44376.55401620371 | 53.173 |
| 44376.59568287038 | 56.532 |
| 44376.63734953704 | 57.96 |
| 44376.67901620371 | 58.25 |
| 44376.72068287038 | 57.15 |
| 44376.76234953704 | 56.223 |
| 44376.80401620371 | 55.644 |
| 44376.84568287038 | 55.296 |
| 44376.88734953704 | 54.621 |
| 44376.92901620371 | 54.099 |
| 44376.97068287038 | 53.694 |
| 44377.01234953704 | 53.076 |
| 44377.05401620371 | 52.478 |
| 44377.09568287038 | 51.783 |
| 44377.13734953704 | 51.03 |
| 44377.17901620371 | 50.18 |
| 44377.22068287038 | 49.312 |
| 44377.26234953704 | 48.578 |
| 44377.30401620371 | 48.096 |
| 44377.34568287038 | 48.057 |
| 44377.38734953704 | 48.675 |
| 44377.42901620371 | 50.103 |
| 44377.47068287038 | 52.111 |
| 44377.51234953704 | 54.408 |
| 44377.55401620371 | 56.281 |
| 44377.59568287038 | 57.343 |
| 44377.63734953704 | 58.578 |
| 44377.67901620371 | 58.771 |
| 44377.72068287038 | 58.713 |
| 44377.76234953704 | 58.308 |
| 44377.80401620371 | 57.652 |
| 44377.84568287038 | 57.246 |
| 44377.88734953704 | 56.821 |
| 44377.92901620371 | 56.204 |
| 44377.97068287038 | 55.528 |
| 44378.01234953704 | 54.968 |
| 44378.05401620371 | 54.37 |
| 44378.09568287038 | 53.617 |
| 44378.13734953704 | 52.864 |
| 44378.17901620371 | 52.381 |
| 44378.22068287038 | 51.686 |
| 44378.26234953704 | 51.088 |
| 44378.30401620371 | 50.74 |
| 44378.34568287038 | 50.702 |
| 44378.38734953704 | 51.165 |
| 44378.42901620371 | 52.478 |
| 44378.47068287038 | 53.597 |
| 44378.51234953704 | 53.81 |
| 44378.55401620371 | 55.895 |
| 44378.59568287038 | 55.914 |
| 44378.63734953704 | 56.957 |
| 44378.67901620371 | 57.323 |
| 44378.72068287038 | 57.092 |
| 44378.76234953704 | 56.995 |
| 44378.80401620371 | 56.764 |
| 44378.84568287038 | 56.513 |
| 44378.88734953704 | 56.03 |
| 44378.92901620371 | 55.393 |
| 44378.97068287038 | 54.891 |
| 44379.01234953704 | 54.35 |
| 44379.05401620371 | 53.578 |
| 44379.09568287038 | 52.845 |
| 44379.13734953704 | 52.188 |
| 44379.17901620371 | 51.532 |
| 44379.22068287038 | 50.953 |
| 44379.26234953704 | 50.47 |
| 44379.30401620371 | 50.103 |
| 44379.34568287038 | 50.142 |
| 44379.38734953704 | 50.702 |
| 44379.42901620371 | 51.937 |
| 44379.47068287038 | 53.771 |
| 44379.51234953704 | 55.605 |
| 44379.55401620371 | 57.169 |
| 44379.59568287038 | 58.366 |
| 44379.63734953704 | 58.829 |
| 44379.67901620371 | 59.814 |
| 44379.72068287038 | 59.505 |
| 44379.76234953704 | 59.138 |
| 44379.80401620371 | 58.906 |
| 44379.84568287038 | 58.598 |
| 44379.88734953704 | 57.98 |
| 44379.92901620371 | 57.015 |
| 44379.97068287038 | 56.049 |
| 44380.01234953704 | 55.026 |
| 44380.05401620371 | 54.061 |
| 44380.09568287038 | 53.173 |
| 44380.13734953704 | 52.323 |
| 44380.17901620371 | 51.628 |
| 44380.22068287038 | 50.972 |
| 44380.26234953704 | 50.393 |
| 44380.30401620371 | 50.045 |
| 44380.34568287038 | 50.142 |
| 44380.38734953704 | 50.875 |
| 44380.42901620371 | 52.188 |
| 44380.47068287038 | 54.022 |
| 44380.51234953704 | 55.895 |
| 44380.55401620371 | 57.748 |
| 44380.59568287038 | 58.211 |
| 44380.63734953704 | 58.096 |
| 44380.67901620371 | 58.482 |
| 44380.72068287038 | 58.829 |
| 44380.76234953704 | 59.428 |
| 44380.80401620371 | 59.408 |
| 44380.84568287038 | 58.964 |
| 44380.88734953704 | 58.231 |
| 44380.92901620371 | 57.13 |
| 44380.97068287038 | 56.242 |
| 44381.01234953704 | 55.528 |
| 44381.05401620371 | 54.833 |
| 44381.09568287038 | 54.215 |
| 44381.13734953704 | 53.443 |
| 44381.17901620371 | 52.709 |
| 44381.22068287038 | 51.976 |
| 44381.26234953704 | 51.281 |
| 44381.30401620371 | 50.798 |
| 44381.34568287038 | 50.856 |
| 44381.38734953704 | 51.532 |
| 44381.42901620371 | 52.864 |
| 44381.47068287038 | 54.679 |
| 44381.51234953704 | 56.609 |
| 44381.55401620371 | 58.443 |
| 44381.59568287038 | 60.528 |
| 44381.63734953704 | 62.227 |
| 44381.67901620371 | 62.883 |
| 44381.72068287038 | 62.787 |
| 44381.76234953704 | 62.304 |
| 44381.80401620371 | 61.957 |
| 44381.84568287038 | 60.972 |
| 44381.88734953704 | 59.891 |
| 44381.92901620371 | 58.926 |
| 44381.97068287038 | 57.883 |
| 44382.01234953704 | 56.821 |
| 44382.05401620371 | 55.837 |
| 44382.09568287038 | 54.891 |
| 44382.13734953704 | 54.157 |
| 44382.17901620371 | 53.52 |
| 44382.22068287038 | 52.883 |
| 44382.26234953704 | 52.246 |
| 44382.30401620371 | 51.783 |
| 44382.34568287038 | 51.764 |
| 44382.38734953704 | 52.362 |
| 44382.42901620371 | 53.655 |
| 44382.47068287038 | 55.47 |
| 44382.51234953704 | 57.497 |
| 44382.55401620371 | 57.883 |
| 44382.59568287038 | 60.103 |
| 44382.63734953704 | 60.798 |
| 44382.67901620371 | 60.258 |
| 44382.72068287038 | 60.103 |
| 44382.76234953704 | 59.563 |
| 44382.80401620371 | 58.675 |
| 44382.84568287038 | 57.864 |
| 44382.88734953704 | 57.034 |
| 44382.92901620371 | 56.435 |
| 44382.97068287038 | 55.856 |
| 44383.01234953704 | 55.47 |
| 44383.05401620371 | 54.987 |
| 44383.09568287038 | 54.215 |
| 44383.13734953704 | 53.52 |
| 44383.17901620371 | 52.96 |
| 44383.22068287038 | 52.362 |
| 44383.26234953704 | 51.783 |
| 44383.30401620371 | 51.377 |
| 44383.34568287038 | 51.339 |
| 44383.38734953704 | 51.937 |
| 44383.42901620371 | 53.153 |
| 44383.47068287038 | 54.833 |
| 44383.51234953704 | 56.628 |
| 44383.55401620371 | 58.424 |
| 44383.59568287038 | 60.2 |
| 44383.63734953704 | 61.686 |
| 44383.67901620371 | 62.69 |
| 44383.72068287038 | 63.211 |
| 44383.76234953704 | 63.134 |
| 44383.80401620371 | 62.42 |
| 44383.84568287038 | 61.706 |
| 44383.88734953704 | 60.972 |
| 44383.92901620371 | 60.161 |
| 44383.97068287038 | 59.215 |
| 44384.01234953704 | 58.269 |
| 44384.05401620371 | 57.15 |
| 44384.09568287038 | 55.933 |
| 44384.13734953704 | 54.833 |
| 44384.17901620371 | 53.81 |
| 44384.22068287038 | 52.883 |
| 44384.26234953704 | 52.169 |
| 44384.30401620371 | 51.725 |
| 44384.34568287038 | 51.686 |
| 44384.38734953704 | 52.304 |
| 44384.42901620371 | 53.578 |
| 44384.47068287038 | 55.412 |
| 44384.51234953704 | 57.034 |
| 44384.55401620371 | 58.868 |
| 44384.59568287038 | 60.567 |
| 44384.63734953704 | 61.957 |
| 44384.67901620371 | 62.98 |
| 44384.72068287038 | 63.54 |
| 44384.76234953704 | 63.52 |
| 44384.80401620371 | 63.018 |
| 44384.84568287038 | 62.323 |
| 44384.88734953704 | 61.474 |
| 44384.92901620371 | 60.509 |
| 44384.97068287038 | 59.428 |
| 44385.01234953704 | 58.385 |
| 44385.05401620371 | 57.246 |
| 44385.09568287038 | 56.184 |
| 44385.13734953704 | 55.123 |
| 44385.17901620371 | 54.215 |
| 44385.22068287038 | 53.347 |
| 44385.26234953704 | 52.729 |
| 44385.30401620371 | 52.343 |
| 44385.34568287038 | 52.323 |
| 44385.38734953704 | 52.96 |
| 44385.42901620371 | 53.906 |
| 44385.47068287038 | 55.644 |
| 44385.51234953704 | 57.574 |
| 44385.55401620371 | 58.096 |
| 44385.59568287038 | 58.906 |
| 44385.63734953704 | 59.08 |
| 44385.67901620371 | 59.003 |
| 44385.72068287038 | 58.849 |
| 44385.76234953704 | 58.887 |
| 44385.80401620371 | 59.35 |
| 44385.84568287038 | 59.235 |
| 44385.88734953704 | 58.617 |
| 44385.92901620371 | 58.057 |
| 44385.97068287038 | 57.555 |
| 44386.01234953704 | 56.841 |
| 44386.05401620371 | 56.165 |
| 44386.09568287038 | 55.431 |
| 44386.13734953704 | 54.505 |
| 44386.17901620371 | 53.578 |
| 44386.22068287038 | 52.787 |
| 44386.26234953704 | 52.053 |
| 44386.30401620371 | 51.513 |
| 44386.34568287038 | 51.435 |
| 44386.38734953704 | 52.034 |
| 44386.42901620371 | 53.347 |
| 44386.47068287038 | 55.219 |
| 44386.51234953704 | 57.015 |
| 44386.55401620371 | 57.845 |
| 44386.59568287038 | 58.617 |
| 44386.63734953704 | 58.733 |
| 44386.67901620371 | 59.679 |
| 44386.72068287038 | 59.679 |
| 44386.76234953704 | 59.679 |
| 44386.80401620371 | 59.524 |
| 44386.84568287038 | 59.138 |
| 44386.88734953704 | 58.849 |
| 44386.92901620371 | 58.134 |
| 44386.97068287038 | 57.265 |
| 44387.01234953704 | 56.281 |
| 44387.05401620371 | 55.219 |
| 44387.09568287038 | 54.292 |
| 44387.13734953704 | 53.366 |
| 44387.17901620371 | 52.478 |
| 44387.22068287038 | 51.551 |
| 44387.26234953704 | 50.76 |
| 44387.30401620371 | 50.123 |
| 44387.34568287038 | 49.968 |
| 44387.38734953704 | 50.489 |
| 44387.42901620371 | 51.706 |
| 44387.47068287038 | 53.443 |
| 44387.51234953704 | 55.393 |
| 44387.55401620371 | 57.246 |
| 44387.59568287038 | 58.906 |
| 44387.63734953704 | 60.2 |
| 44387.67901620371 | 61.049 |
| 44387.72068287038 | 61.416 |
| 44387.76234953704 | 61.262 |
| 44387.80401620371 | 60.76 |
| 44387.84568287038 | 60.142 |
| 44387.88734953704 | 59.408 |
| 44387.92901620371 | 58.655 |
| 44387.97068287038 | 57.806 |
| 44388.01234953704 | 56.879 |
| 44388.05401620371 | 55.818 |
| 44388.09568287038 | 54.737 |
| 44388.13734953704 | 53.617 |
| 44388.17901620371 | 52.594 |
| 44388.22068287038 | 51.57 |
| 44388.26234953704 | 50.702 |
| 44388.30401620371 | 50.007 |
| 44388.34568287038 | 49.756 |
| 44388.38734953704 | 50.258 |
| 44388.42901620371 | 51.339 |
| 44388.47068287038 | 53.057 |
| 44388.51234953704 | 54.93 |
| 44388.55401620371 | 56.899 |
| 44388.59568287038 | 58.636 |
| 44388.63734953704 | 60.045 |
| 44388.67901620371 | 60.991 |
| 44388.72068287038 | 61.32 |
| 44388.76234953704 | 61.223 |
| 44388.80401620371 | 60.74 |
| 44388.84568287038 | 60.045 |
| 44388.88734953704 | 59.273 |
| 44388.92901620371 | 58.52 |
| 44388.97068287038 | 57.671 |
| 44389.01234953704 | 56.86 |
| 44389.05401620371 | 55.991 |
| 44389.09568287038 | 55.065 |
| 44389.13734953704 | 54.08 |
| 44389.17901620371 | 53.115 |
| 44389.22068287038 | 52.13 |
| 44389.26234953704 | 51.204 |
| 44389.30401620371 | 50.509 |
| 44389.34568287038 | 50.296 |
| 44389.38734953704 | 50.74 |
| 44389.42901620371 | 51.744 |
| 44389.47068287038 | 53.366 |
| 44389.51234953704 | 55.258 |
| 44389.55401620371 | 57.169 |
| 44389.59568287038 | 58.791 |
| 44389.63734953704 | 60.103 |
| 44389.67901620371 | 61.242 |
| 44389.72068287038 | 61.628 |
| 44389.76234953704 | 61.377 |
| 44389.80401620371 | 60.914 |
| 44389.84568287038 | 60.181 |
| 44389.88734953704 | 59.389 |
| 44389.92901620371 | 58.636 |
| 44389.97068287038 | 58.057 |
| 44390.01234953704 | 57.439 |
| 44390.05401620371 | 56.899 |
| 44390.09568287038 | 56.339 |
| 44390.13734953704 | 55.451 |
| 44390.17901620371 | 54.466 |
| 44390.22068287038 | 53.52 |
| 44390.26234953704 | 52.536 |
| 44390.30401620371 | 51.764 |
| 44390.34568287038 | 51.435 |
| 44390.38734953704 | 51.802 |
| 44390.42901620371 | 52.825 |
| 44390.47068287038 | 54.447 |
| 44390.51234953704 | 55.296 |
| 44390.55401620371 | 56.86 |
| 44390.59568287038 | 56.86 |
| 44390.63734953704 | 57.169 |
| 44390.67901620371 | 57.632 |
| 44390.72068287038 | 57.478 |
| 44390.76234953704 | 57.072 |
| 44390.80401620371 | 56.648 |
| 44390.84568287038 | 56.223 |
| 44390.88734953704 | 55.779 |
| 44390.92901620371 | 55.258 |
| 44390.97068287038 | 54.891 |
| 44391.01234953704 | 54.563 |
| 44391.05401620371 | 53.984 |
| 44391.09568287038 | 53.366 |
| 44391.13734953704 | 52.787 |
| 44391.17901620371 | 52.246 |
| 44391.22068287038 | 51.628 |
| 44391.26234953704 | 51.069 |
| 44391.30401620371 | 50.625 |
| 44391.34568287038 | 50.509 |
| 44391.38734953704 | 50.605 |
| 44391.42901620371 | 50.837 |
| 44391.47068287038 | 51.319 |
| 44391.51234953704 | 51.976 |
| 44391.55401620371 | 52.825 |
| 44391.59568287038 | 54.042 |
| 44391.63734953704 | 54.64 |
| 44391.67901620371 | 54.003 |
| 44391.72068287038 | 53.655 |
| 44391.76234953704 | 53.52 |
| 44391.80401620371 | 52.883 |
| 44391.84568287038 | 52.594 |
| 44391.88734953704 | 52.362 |
| 44391.92901620371 | 51.976 |
| 44391.97068287038 | 51.474 |
| 44392.01234953704 | 50.875 |
| 44392.05401620371 | 50.354 |
| 44392.09568287038 | 49.891 |
| 44392.13734953704 | 49.37 |
| 44392.17901620371 | 48.81 |
| 44392.22068287038 | 48.25 |
| 44392.26234953704 | 47.69 |
| 44392.30401620371 | 47.285 |
| 44392.34568287038 | 47.362 |
| 44392.38734953704 | 48.018 |
| 44392.42901620371 | 49.408 |
| 44392.47068287038 | 51.377 |
| 44392.51234953704 | 53.733 |
| 44392.55401620371 | 55.991 |
| 44392.59568287038 | 57.787 |
| 44392.63734953704 | 58.327 |
| 44392.67901620371 | 59.042 |
| 44392.72068287038 | 59.775 |
| 44392.76234953704 | 59.794 |
| 44392.80401620371 | 59.196 |
| 44392.84568287038 | 58.385 |
| 44392.88734953704 | 57.845 |
| 44392.92901620371 | 57.15 |
| 44392.97068287038 | 56.513 |
| 44393.01234953704 | 55.914 |
| 44393.05401620371 | 55.412 |
| 44393.09568287038 | 54.737 |
| 44393.13734953704 | 54.022 |
| 44393.17901620371 | 53.153 |
| 44393.22068287038 | 52.188 |
| 44393.26234953704 | 51.3 |
| 44393.30401620371 | 50.509 |
| 44393.34568287038 | 50.238 |
| 44393.38734953704 | 50.721 |
| 44393.42901620371 | 51.899 |
| 44393.47068287038 | 53.791 |
| 44393.51234953704 | 55.779 |
| 44393.55401620371 | 58.269 |
| 44393.59568287038 | 58.887 |
| 44393.63734953704 | 58.347 |
| 44393.67901620371 | 57.574 |
| 44393.72068287038 | 57.304 |
| 44393.76234953704 | 56.899 |
| 44393.80401620371 | 56.783 |
| 44393.84568287038 | 56.262 |
| 44393.88734953704 | 55.644 |
| 44393.92901620371 | 55.084 |
| 44393.97068287038 | 54.717 |
| 44394.01234953704 | 54.254 |
| 44394.05401620371 | 53.848 |
| 44394.09568287038 | 53.501 |
| 44394.13734953704 | 53.096 |
| 44394.17901620371 | 52.632 |
| 44394.22068287038 | 52.111 |
| 44394.26234953704 | 51.513 |
| 44394.30401620371 | 51.146 |
| 44394.34568287038 | 51.069 |
| 44394.38734953704 | 51.397 |
| 44394.42901620371 | 52.671 |
| 44394.47068287038 | 54.659 |
| 44394.51234953704 | 57.053 |
| 44394.55401620371 | 59.563 |
| 44394.59568287038 | 61.184 |
| 44394.63734953704 | 60.856 |
| 44394.67901620371 | 60.161 |
| 44394.72068287038 | 59.968 |
| 44394.76234953704 | 60.103 |
| 44394.80401620371 | 59.775 |
| 44394.84568287038 | 58.926 |
| 44394.88734953704 | 57.98 |
| 44394.92901620371 | 57.13 |
| 44394.97068287038 | 56.3 |
| 44395.01234953704 | 55.625 |
| 44395.05401620371 | 54.833 |
| 44395.09568287038 | 54.119 |
| 44395.13734953704 | 53.327 |
| 44395.17901620371 | 52.632 |
| 44395.22068287038 | 51.86 |
| 44395.26234953704 | 51.088 |
| 44395.30401620371 | 50.47 |
| 44395.34568287038 | 50.393 |
| 44395.38734953704 | 50.991 |
| 44395.42901620371 | 52.323 |
| 44395.47068287038 | 54.331 |
| 44395.51234953704 | 56.706 |
| 44395.55401620371 | 59.003 |
| 44395.59568287038 | 60.895 |
| 44395.63734953704 | 61.822 |
| 44395.67901620371 | 63.289 |
| 44395.72068287038 | 62.671 |
| 44395.76234953704 | 61.918 |
| 44395.80401620371 | 61.127 |
| 44395.84568287038 | 60.316 |
| 44395.88734953704 | 59.505 |
| 44395.92901620371 | 58.81 |
| 44395.97068287038 | 58.076 |
| 44396.01234953704 | 57.516 |
| 44396.05401620371 | 56.918 |
| 44396.09568287038 | 56.339 |
| 44396.13734953704 | 55.702 |
| 44396.17901620371 | 54.949 |
| 44396.22068287038 | 54.022 |
| 44396.26234953704 | 52.999 |
| 44396.30401620371 | 52.188 |
| 44396.34568287038 | 51.706 |
| 44396.38734953704 | 51.879 |
| 44396.42901620371 | 52.806 |
| 44396.47068287038 | 54.466 |
| 44396.51234953704 | 56.455 |
| 44396.55401620371 | 58.559 |
| 44396.59568287038 | 59.852 |
| 44396.63734953704 | 61.976 |
| 44396.67901620371 | 62.999 |
| 44396.72068287038 | 62.227 |
| 44396.76234953704 | 62.439 |
| 44396.80401620371 | 61.744 |
| 44396.84568287038 | 61.03 |
| 44396.88734953704 | 60.316 |
| 44396.92901620371 | 59.389 |
| 44396.97068287038 | 58.598 |
| 44397.01234953704 | 57.883 |
| 44397.05401620371 | 57.092 |
| 44397.09568287038 | 56.416 |
| 44397.13734953704 | 55.798 |
| 44397.17901620371 | 55.084 |
| 44397.22068287038 | 54.312 |
| 44397.26234953704 | 53.366 |
| 44397.30401620371 | 52.613 |
| 44397.34568287038 | 52.285 |
| 44397.38734953704 | 52.594 |
| 44397.42901620371 | 53.347 |
| 44397.47068287038 | 55.374 |
| 44397.51234953704 | 57.632 |
| 44397.55401620371 | 59.988 |
| 44397.59568287038 | 62.13 |
| 44397.63734953704 | 62.42 |
| 44397.67901620371 | 61.995 |
| 44397.72068287038 | 61.937 |
| 44397.76234953704 | 61.262 |
| 44397.80401620371 | 60.567 |
| 44397.84568287038 | 60.026 |
| 44397.88734953704 | 59.331 |
| 44397.92901620371 | 58.636 |
| 44397.97068287038 | 57.98 |
| 44398.01234953704 | 57.478 |
| 44398.05401620371 | 57.034 |
| 44398.09568287038 | 56.628 |
| 44398.13734953704 | 56.184 |
| 44398.17901620371 | 55.605 |
| 44398.22068287038 | 54.949 |
| 44398.26234953704 | 54.254 |
| 44398.30401620371 | 53.617 |
| 44398.34568287038 | 53.327 |
| 44398.38734953704 | 53.617 |
| 44398.42901620371 | 54.621 |
| 44398.47068287038 | 56.223 |
| 44398.51234953704 | 58.289 |
| 44398.55401620371 | 58.617 |
| 44398.59568287038 | 59.099 |
| 44398.63734953704 | 58.926 |
| 44398.67901620371 | 59.408 |
| 44398.72068287038 | 59.698 |
| 44398.76234953704 | 59.601 |
| 44398.80401620371 | 59.389 |
| 44398.84568287038 | 59.177 |
| 44398.88734953704 | 58.617 |
| 44398.92901620371 | 57.903 |
| 44398.97068287038 | 56.976 |
| 44399.01234953704 | 56.146 |
| 44399.05401620371 | 55.625 |
| 44399.09568287038 | 55.238 |
| 44399.13734953704 | 54.814 |
| 44399.17901620371 | 53.964 |
| 44399.22068287038 | 52.96 |
| 44399.26234953704 | 51.976 |
| 44399.30401620371 | 51.223 |
| 44399.34568287038 | 51.069 |
| 44399.38734953704 | 51.764 |
| 44399.42901620371 | 53.076 |
| 44399.47068287038 | 55.219 |
| 44399.51234953704 | 57.69 |
| 44399.55401620371 | 60.026 |
| 44399.59568287038 | 61.648 |
| 44399.63734953704 | 62.323 |
| 44399.67901620371 | 61.3 |
| 44399.72068287038 | 60.547 |
| 44399.76234953704 | 59.698 |
| 44399.80401620371 | 59.273 |
| 44399.84568287038 | 58.81 |
| 44399.88734953704 | 58.385 |
| 44399.92901620371 | 57.999 |
| 44399.97068287038 | 57.459 |
| 44400.01234953704 | 56.841 |
| 44400.05401620371 | 56.184 |
| 44400.09568287038 | 55.586 |
| 44400.13734953704 | 55.045 |
| 44400.17901620371 | 54.35 |
| 44400.22068287038 | 53.52 |
| 44400.26234953704 | 52.671 |
| 44400.30401620371 | 52.034 |
| 44400.34568287038 | 51.725 |
| 44400.38734953704 | 52.111 |
| 44400.42901620371 | 53.462 |
| 44400.47068287038 | 55.702 |
| 44400.51234953704 | 58.289 |
| 44400.55401620371 | 60.181 |
| 44400.59568287038 | 61.571 |
| 44400.63734953704 | 61.088 |
| 44400.67901620371 | 60.412 |
| 44400.72068287038 | 59.621 |
| 44400.76234953704 | 59.08 |
| 44400.80401620371 | 58.655 |
| 44400.84568287038 | 58.269 |
| 44400.88734953704 | 57.999 |
| 44400.92901620371 | 57.767 |
| 44400.97068287038 | 57.304 |
| 44401.01234953704 | 56.706 |
| 44401.05401620371 | 56.049 |
| 44401.09568287038 | 55.219 |
| 44401.13734953704 | 54.37 |
| 44401.17901620371 | 53.752 |
| 44401.22068287038 | 53.347 |
| 44401.26234953704 | 52.806 |
| 44401.30401620371 | 52.323 |
| 44401.34568287038 | 52.227 |
| 44401.38734953704 | 52.478 |
| 44401.42901620371 | 53.308 |
| 44401.47068287038 | 54.794 |
| 44401.51234953704 | 56.609 |
| 44401.55401620371 | 58.076 |
| 44401.59568287038 | 59.157 |
| 44401.63734953704 | 60.354 |
| 44401.67901620371 | 60.374 |
| 44401.72068287038 | 59.891 |
| 44401.76234953704 | 60.181 |
| 44401.80401620371 | 59.756 |
| 44401.84568287038 | 59.061 |
| 44401.88734953704 | 58.385 |
| 44401.92901620371 | 57.536 |
| 44401.97068287038 | 56.802 |
| 44402.01234953704 | 56.049 |
| 44402.05401620371 | 55.296 |
| 44402.09568287038 | 54.563 |
| 44402.13734953704 | 53.81 |
| 44402.17901620371 | 53.018 |
| 44402.22068287038 | 52.227 |
| 44402.26234953704 | 51.551 |
| 44402.30401620371 | 51.049 |
| 44402.34568287038 | 50.914 |
| 44402.38734953704 | 51.397 |
| 44402.42901620371 | 52.555 |
| 44402.47068287038 | 54.35 |
| 44402.51234953704 | 56.416 |
| 44402.55401620371 | 58.462 |
| 44402.59568287038 | 60.374 |
| 44402.63734953704 | 61.899 |
| 44402.67901620371 | 62.922 |
| 44402.72068287038 | 62.632 |
| 44402.76234953704 | 61.706 |
| 44402.80401620371 | 60.953 |
| 44402.84568287038 | 60.316 |
| 44402.88734953704 | 59.698 |
| 44402.92901620371 | 59.157 |
| 44402.97068287038 | 58.578 |
| 44403.01234953704 | 58.018 |
| 44403.05401620371 | 57.516 |
| 44403.09568287038 | 56.899 |
| 44403.13734953704 | 56.069 |
| 44403.17901620371 | 55.238 |
| 44403.22068287038 | 54.331 |
| 44403.26234953704 | 53.327 |
| 44403.30401620371 | 52.497 |
| 44403.34568287038 | 52.15 |
| 44403.38734953704 | 52.516 |
| 44403.42901620371 | 53.559 |
| 44403.47068287038 | 55.238 |
| 44403.51234953704 | 57.265 |
| 44403.55401620371 | 59.37 |
| 44403.59568287038 | 61.146 |
| 44403.63734953704 | 60.547 |
| 44403.67901620371 | 62.169 |
| 44403.72068287038 | 63.25 |
| 44403.76234953704 | 62.71 |
| 44403.80401620371 | 61.706 |
| 44403.84568287038 | 60.779 |
| 44403.88734953704 | 59.93 |
| 44403.92901620371 | 59.37 |
| 44403.97068287038 | 58.617 |
| 44404.01234953704 | 57.941 |
| 44404.05401620371 | 57.265 |
| 44404.09568287038 | 56.435 |
| 44404.13734953704 | 55.296 |
| 44404.17901620371 | 54.119 |
| 44404.22068287038 | 53.057 |
| 44404.26234953704 | 52.053 |
| 44404.30401620371 | 51.319 |
| 44404.34568287038 | 50.933 |
| 44404.38734953704 | 51.339 |
| 44404.42901620371 | 52.478 |
| 44404.47068287038 | 54.466 |
| 44404.51234953704 | 56.744 |
| 44404.55401620371 | 58.945 |
| 44404.59568287038 | 60.991 |
| 44404.63734953704 | 62.671 |
| 44404.67901620371 | 63.906 |
| 44404.72068287038 | 64.1 |
| 44404.76234953704 | 63.289 |
| 44404.80401620371 | 62.806 |
| 44404.84568287038 | 61.937 |
| 44404.88734953704 | 61.03 |
| 44404.92901620371 | 60.181 |
| 44404.97068287038 | 59.621 |
| 44405.01234953704 | 59.235 |
| 44405.05401620371 | 58.617 |
| 44405.09568287038 | 57.999 |
| 44405.13734953704 | 57.343 |
| 44405.17901620371 | 56.551 |
| 44405.22068287038 | 55.625 |
| 44405.26234953704 | 54.582 |
| 44405.30401620371 | 53.578 |
| 44405.34568287038 | 53.115 |
| 44405.38734953704 | 53.385 |
| 44405.42901620371 | 54.486 |
| 44405.47068287038 | 56.281 |
| 44405.51234953704 | 58.52 |
| 44405.55401620371 | 60.644 |
| 44405.59568287038 | 62.343 |
| 44405.63734953704 | 63.887 |
| 44405.67901620371 | 65.084 |
| 44405.72068287038 | 64.698 |
| 44405.76234953704 | 64.524 |
| 44405.80401620371 | 63.598 |
| 44405.84568287038 | 62.883 |
| 44405.88734953704 | 62.285 |
| 44405.92901620371 | 61.744 |
| 44405.97068287038 | 61.3 |
| 44406.01234953704 | 60.779 |
| 44406.05401620371 | 60.142 |
| 44406.09568287038 | 59.505 |
| 44406.13734953704 | 58.733 |
| 44406.17901620371 | 57.883 |
| 44406.22068287038 | 56.976 |
| 44406.26234953704 | 55.972 |
| 44406.30401620371 | 55.181 |
| 44406.34568287038 | 54.872 |
| 44406.38734953704 | 55.277 |
| 44406.42901620371 | 56.262 |
| 44406.47068287038 | 57.922 |
| 44406.51234953704 | 60.065 |
| 44406.55401620371 | 62.208 |
| 44406.59568287038 | 63.945 |
| 44406.63734953704 | 63.752 |
| 44406.67901620371 | 63.984 |
| 44406.72068287038 | 65.065 |
| 44406.76234953704 | 64.35 |
| 44406.80401620371 | 64.042 |
| 44406.84568287038 | 63.617 |
| 44406.88734953704 | 63.057 |
| 44406.92901620371 | 62.478 |
| 44406.97068287038 | 61.841 |
| 44407.01234953704 | 61.377 |
| 44407.05401620371 | 60.837 |
| 44407.09568287038 | 60.026 |
| 44407.13734953704 | 59.042 |
| 44407.17901620371 | 57.941 |
| 44407.22068287038 | 56.802 |
| 44407.26234953704 | 55.721 |
| 44407.30401620371 | 54.891 |
| 44407.34568287038 | 54.37 |
| 44407.38734953704 | 54.447 |
| 44407.42901620371 | 55.335 |
| 44407.47068287038 | 56.937 |
| 44407.51234953704 | 59.138 |
| 44407.55401620371 | 61.146 |
| 44407.59568287038 | 61.995 |
| 44407.63734953704 | 61.513 |
| 44407.67901620371 | 61.069 |
| 44407.72068287038 | 60.509 |
| 44407.76234953704 | 60.123 |
| 44407.80401620371 | 59.659 |
| 44407.84568287038 | 59.293 |
| 44407.88734953704 | 59.061 |
| 44407.92901620371 | 58.887 |
| 44407.97068287038 | 58.598 |
| 44408.01234953704 | 58.308 |
| 44408.05401620371 | 57.729 |
| 44408.09568287038 | 56.937 |
| 44408.13734953704 | 55.895 |
| 44408.17901620371 | 55.007 |
| 44408.22068287038 | 54.37 |
| 44408.26234953704 | 53.829 |
| 44408.30401620371 | 53.347 |
| 44408.34568287038 | 53.211 |
| 44408.38734953704 | 53.559 |
| 44408.42901620371 | 54.408 |
| 44408.47068287038 | 55.296 |
| 44408.51234953704 | 55.625 |
| 44408.55401620371 | 56.493 |
| 44408.59568287038 | 57.246 |
| 44408.63734953704 | 57.96 |
| 44408.67901620371 | 58.366 |
| 44408.72068287038 | 58.578 |
| 44408.76234953704 | 58.926 |
| 44408.80401620371 | 58.887 |
| 44408.84568287038 | 58.347 |
| 44408.88734953704 | 57.883 |
| 44408.92901620371 | 57.478 |
| 44408.97068287038 | 56.86 |
| 44409.01234953704 | 56.165 |
| 44409.05401620371 | 55.393 |
| 44409.09568287038 | 54.794 |
| 44409.13734953704 | 54.292 |
| 44409.17901620371 | 53.926 |
| 44409.22068287038 | 53.617 |
| 44409.26234953704 | 53.347 |
| 44409.30401620371 | 53.173 |
| 44409.34568287038 | 53.134 |
| 44409.38734953704 | 53.25 |
| 44409.42901620371 | 53.694 |
| 44409.47068287038 | 54.833 |
| 44409.51234953704 | 56.184 |
| 44409.55401620371 | 57.15 |
| 44409.59568287038 | 58.057 |
| 44409.63734953704 | 59.679 |
| 44409.67901620371 | 60.953 |
| 44409.72068287038 | 60.567 |
| 44409.76234953704 | 60.509 |
| 44409.80401620371 | 60.354 |
| 44409.84568287038 | 59.949 |
| 44409.88734953704 | 59.756 |
| 44409.92901620371 | 59.447 |
| 44409.97068287038 | 59.003 |
| 44410.01234953704 | 58.366 |
| 44410.05401620371 | 57.574 |
| 44410.09568287038 | 56.764 |
| 44410.13734953704 | 55.798 |
| 44410.17901620371 | 54.987 |
| 44410.22068287038 | 54.312 |
| 44410.26234953704 | 53.733 |
| 44410.30401620371 | 53.347 |
| 44410.34568287038 | 53.424 |
| 44410.38734953704 | 53.906 |
| 44410.42901620371 | 54.968 |
| 44410.47068287038 | 56.416 |
| 44410.51234953704 | 57.767 |
| 44410.55401620371 | 59.621 |
| 44410.59568287038 | 60.412 |
| 44410.63734953704 | 61.493 |
| 44410.67901620371 | 60.876 |
| 44410.72068287038 | 60.663 |
| 44410.76234953704 | 60.065 |
| 44410.80401620371 | 59.582 |
| 44410.84568287038 | 59.235 |
| 44410.88734953704 | 58.752 |
| 44410.92901620371 | 58.366 |
| 44410.97068287038 | 57.941 |
| 44411.01234953704 | 57.362 |
| 44411.05401620371 | 56.493 |
| 44411.09568287038 | 55.914 |
| 44411.13734953704 | 55.586 |
| 44411.17901620371 | 55.47 |
| 44411.22068287038 | 55.451 |
| 44411.26234953704 | 55.258 |
| 44411.30401620371 | 55.103 |
| 44411.34568287038 | 55.142 |
| 44411.38734953704 | 55.354 |
| 44411.42901620371 | 55.721 |
| 44411.47068287038 | 56.377 |
| 44411.51234953704 | 56.86 |
| 44411.55401620371 | 57.459 |
| 44411.59568287038 | 57.883 |
| 44411.63734953704 | 59.003 |
| 44411.67901620371 | 59.486 |
| 44411.72068287038 | 59.37 |
| 44411.76234953704 | 59.524 |
| 44411.80401620371 | 59.312 |
| 44411.84568287038 | 58.733 |
| 44411.88734953704 | 58.366 |
| 44411.92901620371 | 57.69 |
| 44411.97068287038 | 57.15 |
| 44412.01234953704 | 56.686 |
| 44412.05401620371 | 56.107 |
| 44412.09568287038 | 55.586 |
| 44412.13734953704 | 55.123 |
| 44412.17901620371 | 54.698 |
| 44412.22068287038 | 54.235 |
| 44412.26234953704 | 53.81 |
| 44412.30401620371 | 53.424 |
| 44412.34568287038 | 53.347 |
| 44412.38734953704 | 53.752 |
| 44412.42901620371 | 54.621 |
| 44412.47068287038 | 55.991 |
| 44412.51234953704 | 57.497 |
| 44412.55401620371 | 59.003 |
| 44412.59568287038 | 60.432 |
| 44412.63734953704 | 61.532 |
| 44412.67901620371 | 62.053 |
| 44412.72068287038 | 62.304 |
| 44412.76234953704 | 62.594 |
| 44412.80401620371 | 62.516 |
| 44412.84568287038 | 61.937 |
| 44412.88734953704 | 61.107 |
| 44412.92901620371 | 60.161 |
| 44412.97068287038 | 59.061 |
| 44413.01234953704 | 57.903 |
| 44413.05401620371 | 56.86 |
| 44413.09568287038 | 55.933 |
| 44413.13734953704 | 55.161 |
| 44413.17901620371 | 54.543 |
| 44413.22068287038 | 53.906 |
| 44413.26234953704 | 53.443 |
| 44413.30401620371 | 53.173 |
| 44413.34568287038 | 53.134 |
| 44413.38734953704 | 53.578 |
| 44413.42901620371 | 54.466 |
| 44413.47068287038 | 55.682 |
| 44413.51234953704 | 57.304 |
| 44413.55401620371 | 58.945 |
| 44413.59568287038 | 60.509 |
| 44413.63734953704 | 61.995 |
| 44413.67901620371 | 63.192 |
| 44413.72068287038 | 63.733 |
| 44413.76234953704 | 63.887 |
| 44413.80401620371 | 63.443 |
| 44413.84568287038 | 62.787 |
| 44413.88734953704 | 61.822 |
| 44413.92901620371 | 60.721 |
| 44413.97068287038 | 59.563 |
| 44414.01234953704 | 58.424 |
| 44414.05401620371 | 57.401 |
| 44414.09568287038 | 56.455 |
| 44414.13734953704 | 55.779 |
| 44414.17901620371 | 55.065 |
| 44414.22068287038 | 54.408 |
| 44414.26234953704 | 53.945 |
| 44414.30401620371 | 53.675 |
| 44414.34568287038 | 53.829 |
| 44414.38734953704 | 54.331 |
| 44414.42901620371 | 55.161 |
| 44414.47068287038 | 56.455 |
| 44414.51234953704 | 58.211 |
| 44414.55401620371 | 58.945 |
| 44414.59568287038 | 59.563 |
| 44414.63734953704 | 59.891 |
| 44414.67901620371 | 60.123 |
| 44414.72068287038 | 61.146 |
| 44414.76234953704 | 61.377 |
| 44414.80401620371 | 61.377 |
| 44414.84568287038 | 60.682 |
| 44414.88734953704 | 59.756 |
| 44414.92901620371 | 58.926 |
| 44414.97068287038 | 58.269 |
| 44415.01234953704 | 57.652 |
| 44415.05401620371 | 57.072 |
| 44415.09568287038 | 56.435 |
| 44415.13734953704 | 55.76 |
| 44415.17901620371 | 55.084 |
| 44415.22068287038 | 54.486 |
| 44415.26234953704 | 54.042 |
| 44415.30401620371 | 53.675 |
| 44415.34568287038 | 53.655 |
| 44415.38734953704 | 53.868 |
| 44415.42901620371 | 54.177 |
| 44415.47068287038 | 54.698 |
| 44415.51234953704 | 55.721 |
| 44415.55401620371 | 56.513 |
| 44415.59568287038 | 57.555 |
| 44415.63734953704 | 58.598 |
| 44415.67901620371 | 59.003 |
| 44415.72068287038 | 59.273 |
| 44415.76234953704 | 59.235 |
| 44415.80401620371 | 58.81 |
| 44415.84568287038 | 58.231 |
| 44415.88734953704 | 57.536 |
| 44415.92901620371 | 56.764 |
| 44415.97068287038 | 55.972 |
| 44416.01234953704 | 55.045 |
| 44416.05401620371 | 54.273 |
| 44416.09568287038 | 53.559 |
| 44416.13734953704 | 52.864 |
| 44416.17901620371 | 52.246 |
| 44416.22068287038 | 51.744 |
| 44416.26234953704 | 51.223 |
| 44416.30401620371 | 50.895 |
| 44416.34568287038 | 50.914 |
| 44416.38734953704 | 51.397 |
| 44416.42901620371 | 52.478 |
| 44416.47068287038 | 53.984 |
| 44416.51234953704 | 55.702 |
| 44416.55401620371 | 57.401 |
| 44416.59568287038 | 59.003 |
| 44416.63734953704 | 60.2 |
| 44416.67901620371 | 61.242 |
| 44416.72068287038 | 61.725 |
| 44416.76234953704 | 61.725 |
| 44416.80401620371 | 61.416 |
| 44416.84568287038 | 61.165 |
| 44416.88734953704 | 60.528 |
| 44416.92901620371 | 59.659 |
| 44416.97068287038 | 58.733 |
| 44417.01234953704 | 57.748 |
| 44417.05401620371 | 56.686 |
| 44417.09568287038 | 55.528 |
| 44417.13734953704 | 54.447 |
| 44417.17901620371 | 53.424 |
| 44417.22068287038 | 52.536 |
| 44417.26234953704 | 51.841 |
| 44417.30401620371 | 51.242 |
| 44417.34568287038 | 51.146 |
| 44417.38734953704 | 51.609 |
| 44417.42901620371 | 52.613 |
| 44417.47068287038 | 53.984 |
| 44417.51234953704 | 55.296 |
| 44417.55401620371 | 56.049 |
| 44417.59568287038 | 56.995 |
| 44417.63734953704 | 59.08 |
| 44417.67901620371 | 60.142 |
| 44417.72068287038 | 60.451 |
| 44417.76234953704 | 60.528 |
| 44417.80401620371 | 60.142 |
| 44417.84568287038 | 59.582 |
| 44417.88734953704 | 59.003 |
| 44417.92901620371 | 58.443 |
| 44417.97068287038 | 57.632 |
| 44418.01234953704 | 56.937 |
| 44418.05401620371 | 56.069 |
| 44418.09568287038 | 54.91 |
| 44418.13734953704 | 53.752 |
| 44418.17901620371 | 52.632 |
| 44418.22068287038 | 51.725 |
| 44418.26234953704 | 50.895 |
| 44418.30401620371 | 50.296 |
| 44418.34568287038 | 50.084 |
| 44418.38734953704 | 50.509 |
| 44418.42901620371 | 51.551 |
| 44418.47068287038 | 53.211 |
| 44418.51234953704 | 54.949 |
| 44418.55401620371 | 56.146 |
| 44418.59568287038 | 57.15 |
| 44418.63734953704 | 57.265 |
| 44418.67901620371 | 57.941 |
| 44418.72068287038 | 58.829 |
| 44418.76234953704 | 58.791 |
| 44418.80401620371 | 58.424 |
| 44418.84568287038 | 58.096 |
| 44418.88734953704 | 57.034 |
| 44418.92901620371 | 55.779 |
| 44418.97068287038 | 54.621 |
| 44419.01234953704 | 53.597 |
| 44419.05401620371 | 52.574 |
| 44419.09568287038 | 51.455 |
| 44419.13734953704 | 50.412 |
| 44419.17901620371 | 49.389 |
| 44419.22068287038 | 48.482 |
| 44419.26234953704 | 47.69 |
| 44419.30401620371 | 47.072 |
| 44419.34568287038 | 46.918 |
| 44419.38734953704 | 47.401 |
| 44419.42901620371 | 48.443 |
| 44419.47068287038 | 50.065 |
| 44419.51234953704 | 51.899 |
| 44419.55401620371 | 53.713 |
| 44419.59568287038 | 55.393 |
| 44419.63734953704 | 56.628 |
| 44419.67901620371 | 57.536 |
| 44419.72068287038 | 57.922 |
| 44419.76234953704 | 57.787 |
| 44419.80401620371 | 57.246 |
| 44419.84568287038 | 56.339 |
| 44419.88734953704 | 55.142 |
| 44419.92901620371 | 53.791 |
| 44419.97068287038 | 52.362 |
| 44420.01234953704 | 50.798 |
| 44420.05401620371 | 49.254 |
| 44420.09568287038 | 47.748 |
| 44420.13734953704 | 46.59 |
| 44420.17901620371 | 45.567 |
| 44420.22068287038 | 44.852 |
| 44420.26234953704 | 44.312 |
| 44420.30401620371 | 43.945 |
| 44420.34568287038 | 43.906 |
| 44420.38734953704 | 44.408 |
| 44420.42901620371 | 45.451 |
| 44420.47068287038 | 47.014 |
| 44420.51234953704 | 48.81 |
| 44420.55401620371 | 49.949 |
| 44420.59568287038 | 51.319 |
| 44420.63734953704 | 52.014 |
| 44420.67901620371 | 53.347 |
| 44420.72068287038 | 53.54 |
| 44420.76234953704 | 54.061 |
| 44420.80401620371 | 54.042 |
| 44420.84568287038 | 53.578 |
| 44420.88734953704 | 53.173 |
| 44420.92901620371 | 53.115 |
| 44420.97068287038 | 53.308 |
| 44421.01234953704 | 53.096 |
| 44421.05401620371 | 52.671 |
| 44421.09568287038 | 52.246 |
| 44421.13734953704 | 51.86 |
| 44421.17901620371 | 51.319 |
| 44421.22068287038 | 50.721 |
| 44421.26234953704 | 50.161 |
| 44421.30401620371 | 49.64 |
| 44421.34568287038 | 49.524 |
| 44421.38734953704 | 50.065 |
| 44421.42901620371 | 51.262 |
| 44421.47068287038 | 53.211 |
| 44421.51234953704 | 55.605 |
| 44421.55401620371 | 58.269 |
| 44421.59568287038 | 60.258 |
| 44421.63734953704 | 61.841 |
| 44421.67901620371 | 61.339 |
| 44421.72068287038 | 61.049 |
| 44421.76234953704 | 60.161 |
| 44421.80401620371 | 59.37 |
| 44421.84568287038 | 58.791 |
| 44421.88734953704 | 58.231 |
| 44421.92901620371 | 57.555 |
| 44421.97068287038 | 56.821 |
| 44422.01234953704 | 56.03 |
| 44422.05401620371 | 55.393 |
| 44422.09568287038 | 54.756 |
| 44422.13734953704 | 54.119 |
| 44422.17901620371 | 53.424 |
| 44422.22068287038 | 52.671 |
| 44422.26234953704 | 51.802 |
| 44422.30401620371 | 51.011 |
| 44422.34568287038 | 50.663 |
| 44422.38734953704 | 50.972 |
| 44422.42901620371 | 52.053 |
| 44422.47068287038 | 53.868 |
| 44422.51234953704 | 56.146 |
| 44422.55401620371 | 58.501 |
| 44422.59568287038 | 60.181 |
| 44422.63734953704 | 62.111 |
| 44422.67901620371 | 63.096 |
| 44422.72068287038 | 63.231 |
| 44422.76234953704 | 62.516 |
| 44422.80401620371 | 61.127 |
| 44422.84568287038 | 60.161 |
| 44422.88734953704 | 59.293 |
| 44422.92901620371 | 58.385 |
| 44422.97068287038 | 57.594 |
| 44423.01234953704 | 57.015 |
| 44423.05401620371 | 56.358 |
| 44423.09568287038 | 55.76 |
| 44423.13734953704 | 55.142 |
| 44423.17901620371 | 54.447 |
| 44423.22068287038 | 53.578 |
| 44423.26234953704 | 52.767 |
| 44423.30401620371 | 51.841 |
| 44423.34568287038 | 51.532 |
| 44423.38734953704 | 51.706 |
| 44423.42901620371 | 52.516 |
| 44423.47068287038 | 53.81 |
| 44423.51234953704 | 55.181 |
| 44423.55401620371 | 56.725 |
| 44423.59568287038 | 57.323 |
| 44423.63734953704 | 58.559 |
| 44423.67901620371 | 57.381 |
| 44423.72068287038 | 56.725 |
| 44423.76234953704 | 56.706 |
| 44423.80401620371 | 56.223 |
| 44423.84568287038 | 55.856 |
| 44423.88734953704 | 55.451 |
| 44423.92901620371 | 55.026 |
| 44423.97068287038 | 54.601 |
| 44424.01234953704 | 54.196 |
| 44424.05401620371 | 53.636 |
| 44424.09568287038 | 53.134 |
| 44424.13734953704 | 52.555 |
| 44424.17901620371 | 51.802 |
| 44424.22068287038 | 51.049 |
| 44424.26234953704 | 50.238 |
| 44424.30401620371 | 49.505 |
| 44424.34568287038 | 49.235 |
| 44424.38734953704 | 49.621 |
| 44424.42901620371 | 50.74 |
| 44424.47068287038 | 52.594 |
| 44424.51234953704 | 54.891 |
| 44424.55401620371 | 57.227 |
| 44424.59568287038 | 59.486 |
| 44424.63734953704 | 61.107 |
| 44424.67901620371 | 60.489 |
| 44424.72068287038 | 59.775 |
| 44424.76234953704 | 58.926 |
| 44424.80401620371 | 58.578 |
| 44424.84568287038 | 58.115 |
| 44424.88734953704 | 57.71 |
| 44424.92901620371 | 56.899 |
| 44424.97068287038 | 56.223 |
| 44425.01234953704 | 55.74 |
| 44425.05401620371 | 55.084 |
| 44425.09568287038 | 54.331 |
| 44425.13734953704 | 53.617 |
| 44425.17901620371 | 52.825 |
| 44425.22068287038 | 52.034 |
| 44425.26234953704 | 51.223 |
| 44425.30401620371 | 50.412 |
| 44425.34568287038 | 49.949 |
| 44425.38734953704 | 50.084 |
| 44425.42901620371 | 51.049 |
| 44425.47068287038 | 52.825 |
| 44425.51234953704 | 55.007 |
| 44425.55401620371 | 57.304 |
| 44425.59568287038 | 58.81 |
| 44425.63734953704 | 59.582 |
| 44425.67901620371 | 59.91 |
| 44425.72068287038 | 59.582 |
| 44425.76234953704 | 59.003 |
| 44425.80401620371 | 57.903 |
| 44425.84568287038 | 57.15 |
| 44425.88734953704 | 56.532 |
| 44425.92901620371 | 55.876 |
| 44425.97068287038 | 55.354 |
| 44426.01234953704 | 54.91 |
| 44426.05401620371 | 54.582 |
| 44426.09568287038 | 54.215 |
| 44426.13734953704 | 53.694 |
| 44426.17901620371 | 53.096 |
| 44426.22068287038 | 52.323 |
| 44426.26234953704 | 51.57 |
| 44426.30401620371 | 50.991 |
| 44426.34568287038 | 50.74 |
| 44426.38734953704 | 51.146 |
| 44426.42901620371 | 52.343 |
| 44426.47068287038 | 53.617 |
| 44426.51234953704 | 55.084 |
| 44426.55401620371 | 57.574 |
| 44426.59568287038 | 57.71 |
| 44426.63734953704 | 56.204 |
| 44426.67901620371 | 56.976 |
| 44426.72068287038 | 56.783 |
| 44426.76234953704 | 56.281 |
| 44426.80401620371 | 55.895 |
| 44426.84568287038 | 55.374 |
| 44426.88734953704 | 55.142 |
| 44426.92901620371 | 54.794 |
| 44426.97068287038 | 54.408 |
| 44427.01234953704 | 54.119 |
| 44427.05401620371 | 53.945 |
| 44427.09568287038 | 53.636 |
| 44427.13734953704 | 53.231 |
| 44427.17901620371 | 52.845 |
| 44427.22068287038 | 52.439 |
| 44427.26234953704 | 51.899 |
| 44427.30401620371 | 51.474 |
| 44427.34568287038 | 51.088 |
| 44427.38734953704 | 51.397 |
| 44427.42901620371 | 51.821 |
| 44427.47068287038 | 52.825 |
| 44427.51234953704 | 53.482 |
| 44427.55401620371 | 55.431 |
| 44427.59568287038 | 56.069 |
| 44427.63734953704 | 57.459 |
| 44427.67901620371 | 57.652 |
| 44427.72068287038 | 57.265 |
| 44427.76234953704 | 57.188 |
| 44427.80401620371 | 56.3 |
| 44427.84568287038 | 55.374 |
| 44427.88734953704 | 54.486 |
| 44427.92901620371 | 54.138 |
| 44427.97068287038 | 53.752 |
| 44428.01234953704 | 53.231 |
| 44428.05401620371 | 52.516 |
| 44428.09568287038 | 51.957 |
| 44428.13734953704 | 51.416 |
| 44428.17901620371 | 50.818 |
| 44428.22068287038 | 50.007 |
| 44428.26234953704 | 49.215 |
| 44428.30401620371 | 48.482 |
| 44428.34568287038 | 48.038 |
| 44428.38734953704 | 48.173 |
| 44428.42901620371 | 48.945 |
| 44428.47068287038 | 50.547 |
| 44428.51234953704 | 52.516 |
| 44428.55401620371 | 54.621 |
| 44428.59568287038 | 56.377 |
| 44428.63734953704 | 57.787 |
| 44428.67901620371 | 57.285 |
| 44428.72068287038 | 56.725 |
| 44428.76234953704 | 55.933 |
| 44428.80401620371 | 55.818 |
| 44428.84568287038 | 54.717 |
| 44428.88734953704 | 53.462 |
| 44428.92901620371 | 52.845 |
| 44428.97068287038 | 52.574 |
| 44429.01234953704 | 51.976 |
| 44429.05401620371 | 51.3 |
| 44429.09568287038 | 50.76 |
| 44429.13734953704 | 50.277 |
| 44429.17901620371 | 49.775 |
| 44429.22068287038 | 49.235 |
| 44429.26234953704 | 48.597 |
| 44429.30401620371 | 47.845 |
| 44429.34568287038 | 47.439 |
| 44429.38734953704 | 47.709 |
| 44429.42901620371 | 48.597 |
| 44429.47068287038 | 50.489 |
| 44429.51234953704 | 52.362 |
| 44429.55401620371 | 52.304 |
| 44429.59568287038 | 53.018 |
| 44429.63734953704 | 54.273 |
| 44429.67901620371 | 55.605 |
| 44429.72068287038 | 55.142 |
| 44429.76234953704 | 54.987 |
| 44429.80401620371 | 55.161 |
| 44429.84568287038 | 54.659 |
| 44429.88734953704 | 54.003 |
| 44429.92901620371 | 53.559 |
| 44429.97068287038 | 53.057 |
| 44430.01234953704 | 52.767 |
| 44430.05401620371 | 52.439 |
| 44430.09568287038 | 52.304 |
| 44430.13734953704 | 51.976 |
| 44430.17901620371 | 51.628 |
| 44430.22068287038 | 51.165 |
| 44430.26234953704 | 50.798 |
| 44430.30401620371 | 50.374 |
| 44430.34568287038 | 50.277 |
| 44430.38734953704 | 50.779 |
| 44430.42901620371 | 51.86 |
| 44430.47068287038 | 52.767 |
| 44430.51234953704 | 53.617 |
| 44430.55401620371 | 54.852 |
| 44430.59568287038 | 57.072 |
| 44430.63734953704 | 59.486 |
| 44430.67901620371 | 59.814 |
| 44430.72068287038 | 59.814 |
| 44430.76234953704 | 59.64 |
| 44430.80401620371 | 58.617 |
| 44430.84568287038 | 57.439 |
| 44430.88734953704 | 56.339 |
| 44430.92901620371 | 55.296 |
| 44430.97068287038 | 54.157 |
| 44431.01234953704 | 53.269 |
| 44431.05401620371 | 52.516 |
| 44431.09568287038 | 51.744 |
| 44431.13734953704 | 51.126 |
| 44431.17901620371 | 50.47 |
| 44431.22068287038 | 49.794 |
| 44431.26234953704 | 49.119 |
| 44431.30401620371 | 48.482 |
| 44431.34568287038 | 48.211 |
| 44431.38734953704 | 48.559 |
| 44431.42901620371 | 49.099 |
| 44431.47068287038 | 50.856 |
| 44431.51234953704 | 51.937 |
| 44431.55401620371 | 53.752 |
| 44431.59568287038 | 55.316 |
| 44431.63734953704 | 56.011 |
| 44431.67901620371 | 56.841 |
| 44431.72068287038 | 57.729 |
| 44431.76234953704 | 56.976 |
| 44431.80401620371 | 55.528 |
| 44431.84568287038 | 54.486 |
| 44431.88734953704 | 53.713 |
| 44431.92901620371 | 53.192 |
| 44431.97068287038 | 52.69 |
| 44432.01234953704 | 52.169 |
| 44432.05401620371 | 51.706 |
| 44432.09568287038 | 51.358 |
| 44432.13734953704 | 51.069 |
| 44432.17901620371 | 50.567 |
| 44432.22068287038 | 49.949 |
| 44432.26234953704 | 49.235 |
| 44432.30401620371 | 48.54 |
| 44432.34568287038 | 48.173 |
| 44432.38734953704 | 48.501 |
| 44432.42901620371 | 49.679 |
| 44432.47068287038 | 51.686 |
| 44432.51234953704 | 53.694 |
| 44432.55401620371 | 56.184 |
| 44432.59568287038 | 58.211 |
| 44432.63734953704 | 59.794 |
| 44432.67901620371 | 60.528 |
| 44432.72068287038 | 60.065 |
| 44432.76234953704 | 59.061 |
| 44432.80401620371 | 57.71 |
| 44432.84568287038 | 56.706 |
| 44432.88734953704 | 55.953 |
| 44432.92901620371 | 55.2 |
| 44432.97068287038 | 54.408 |
| 44433.01234953704 | 53.559 |
| 44433.05401620371 | 52.825 |
| 44433.09568287038 | 52.265 |
| 44433.13734953704 | 51.59 |
| 44433.17901620371 | 50.798 |
| 44433.22068287038 | 50.007 |
| 44433.26234953704 | 49.08 |
| 44433.30401620371 | 48.211 |
| 44433.34568287038 | 47.787 |
| 44433.38734953704 | 48.057 |
| 44433.42901620371 | 49.119 |
| 44433.47068287038 | 51.126 |
| 44433.51234953704 | 53.443 |
| 44433.55401620371 | 55.663 |
| 44433.59568287038 | 57.806 |
| 44433.63734953704 | 59.35 |
| 44433.67901620371 | 59.968 |
| 44433.72068287038 | 59.756 |
| 44433.76234953704 | 58.733 |
| 44433.80401620371 | 57.516 |
| 44433.84568287038 | 56.551 |
| 44433.88734953704 | 55.837 |
| 44433.92901620371 | 55.142 |
| 44433.97068287038 | 54.505 |
| 44434.01234953704 | 53.81 |
| 44434.05401620371 | 53.269 |
| 44434.09568287038 | 52.729 |
| 44434.13734953704 | 52.169 |
| 44434.17901620371 | 51.513 |
| 44434.22068287038 | 50.837 |
| 44434.26234953704 | 50.123 |
| 44434.30401620371 | 49.408 |
| 44434.34568287038 | 49.157 |
| 44434.38734953704 | 49.408 |
| 44434.42901620371 | 50.393 |
| 44434.47068287038 | 51.706 |
| 44434.51234953704 | 53.462 |
| 44434.55401620371 | 54.814 |
| 44434.59568287038 | 55.374 |
| 44434.63734953704 | 55.779 |
| 44434.67901620371 | 56.126 |
| 44434.72068287038 | 56.899 |
| 44434.76234953704 | 56.358 |
| 44434.80401620371 | 55.431 |
| 44434.84568287038 | 54.775 |
| 44434.88734953704 | 54.486 |
| 44434.92901620371 | 53.906 |
| 44434.97068287038 | 53.347 |
| 44435.01234953704 | 52.748 |
| 44435.05401620371 | 52.246 |
| 44435.09568287038 | 51.879 |
| 44435.13734953704 | 51.435 |
| 44435.17901620371 | 50.875 |
| 44435.22068287038 | 50.18 |
| 44435.26234953704 | 49.37 |
| 44435.30401620371 | 48.694 |
| 44435.34568287038 | 48.269 |
| 44435.38734953704 | 48.501 |
| 44435.42901620371 | 49.64 |
| 44435.47068287038 | 51.706 |
| 44435.51234953704 | 54.061 |
| 44435.55401620371 | 56.493 |
| 44435.59568287038 | 58.25 |
| 44435.63734953704 | 59.138 |
| 44435.67901620371 | 60.605 |
| 44435.72068287038 | 60.779 |
| 44435.76234953704 | 59.737 |
| 44435.80401620371 | 58.385 |
| 44435.84568287038 | 57.304 |
| 44435.88734953704 | 56.513 |
| 44435.92901620371 | 55.663 |
| 44435.97068287038 | 54.872 |
| 44436.01234953704 | 54.486 |
| 44436.05401620371 | 54.042 |
| 44436.09568287038 | 53.424 |
| 44436.13734953704 | 52.632 |
| 44436.17901620371 | 51.879 |
| 44436.22068287038 | 51.088 |
| 44436.26234953704 | 50.277 |
| 44436.30401620371 | 49.428 |
| 44436.34568287038 | 49.022 |
| 44436.38734953704 | 49.254 |
| 44436.42901620371 | 50.354 |
| 44436.47068287038 | 52.285 |
| 44436.51234953704 | 54.447 |
| 44436.55401620371 | 56.57 |
| 44436.59568287038 | 58.617 |
| 44436.63734953704 | 59.814 |
| 44436.67901620371 | 60.547 |
| 44436.72068287038 | 60.47 |
| 44436.76234953704 | 59.543 |
| 44436.80401620371 | 58.559 |
| 44436.84568287038 | 57.632 |
| 44436.88734953704 | 56.648 |
| 44436.92901620371 | 55.76 |
| 44436.97068287038 | 54.891 |
| 44437.01234953704 | 54.099 |
| 44437.05401620371 | 53.404 |
| 44437.09568287038 | 52.787 |
| 44437.13734953704 | 52.304 |
| 44437.17901620371 | 51.744 |
| 44437.22068287038 | 51.069 |
| 44437.26234953704 | 50.354 |
| 44437.30401620371 | 49.601 |
| 44437.34568287038 | 49.196 |
| 44437.38734953704 | 49.408 |
| 44437.42901620371 | 50.489 |
| 44437.47068287038 | 52.381 |
| 44437.51234953704 | 54.601 |
| 44437.55401620371 | 56.59 |
| 44437.59568287038 | 58.482 |
| 44437.63734953704 | 59.852 |
| 44437.67901620371 | 60.412 |
| 44437.72068287038 | 60.007 |
| 44437.76234953704 | 59.022 |
| 44437.80401620371 | 57.767 |
| 44437.84568287038 | 56.686 |
| 44437.88734953704 | 55.856 |
| 44437.92901620371 | 54.968 |
| 44437.97068287038 | 54.196 |
| 44438.01234953704 | 53.501 |
| 44438.05401620371 | 52.98 |
| 44438.09568287038 | 52.458 |
| 44438.13734953704 | 51.957 |
| 44438.17901620371 | 51.339 |
| 44438.22068287038 | 50.74 |
| 44438.26234953704 | 49.987 |
| 44438.30401620371 | 49.312 |
| 44438.34568287038 | 48.926 |
| 44438.38734953704 | 49.177 |
| 44438.42901620371 | 50.142 |
| 44438.47068287038 | 51.957 |
| 44438.51234953704 | 54.042 |
| 44438.55401620371 | 56.107 |
| 44438.59568287038 | 57.072 |
| 44438.63734953704 | 57.883 |
| 44438.67901620371 | 58.173 |
| 44438.72068287038 | 57.96 |
| 44438.76234953704 | 57.285 |
| 44438.80401620371 | 56.59 |
| 44438.84568287038 | 55.682 |
| 44438.88734953704 | 54.833 |
| 44438.92901620371 | 53.926 |
| 44438.97068287038 | 53.153 |
| 44439.01234953704 | 52.594 |
| 44439.05401620371 | 52.246 |
| 44439.09568287038 | 51.821 |
| 44439.13734953704 | 51.377 |
| 44439.17901620371 | 50.818 |
| 44439.22068287038 | 50.065 |
| 44439.26234953704 | 49.37 |
| 44439.30401620371 | 48.52 |
| 44439.34568287038 | 48.038 |
| 44439.38734953704 | 48.25 |
| 44439.42901620371 | 49.08 |
| 44439.47068287038 | 50.721 |
| 44439.51234953704 | 52.825 |
| 44439.55401620371 | 55.007 |
| 44439.59568287038 | 57.034 |
| 44439.63734953704 | 56.783 |
| 44439.67901620371 | 57.208 |
| 44439.72068287038 | 56.937 |
| 44439.76234953704 | 56.879 |
| 44439.80401620371 | 56.339 |
| 44439.84568287038 | 55.605 |
| 44439.88734953704 | 55.161 |
| 44439.92901620371 | 54.833 |
| 44439.97068287038 | 54.543 |
| 44440.01234953704 | 54.138 |
| 44440.05401620371 | 53.636 |
| 44440.09568287038 | 53.134 |
| 44440.13734953704 | 52.845 |
| 44440.17901620371 | 52.362 |
| 44440.22068287038 | 51.783 |
| 44440.26234953704 | 51.319 |
| 44440.30401620371 | 50.856 |
| 44440.34568287038 | 50.489 |
| 44440.38734953704 | 50.335 |
| 44440.42901620371 | 50.489 |
| 44440.47068287038 | 51.648 |
| 44440.51234953704 | 52.729 |
| 44440.55401620371 | 53.289 |
| 44440.59568287038 | 52.922 |
| 44440.63734953704 | 52.709 |
| 44440.67901620371 | 52.478 |
| 44440.72068287038 | 52.053 |
| 44440.76234953704 | 51.995 |
| 44440.80401620371 | 51.686 |
| 44440.84568287038 | 51.493 |
| 44440.88734953704 | 51.319 |
| 44440.92901620371 | 51.049 |
| 44440.97068287038 | 50.837 |
| 44441.01234953704 | 50.702 |
| 44441.05401620371 | 50.567 |
| 44441.09568287038 | 50.509 |
| 44441.13734953704 | 50.393 |
| 44441.17901620371 | 50.258 |
| 44441.22068287038 | 50.103 |
| 44441.26234953704 | 49.717 |
| 44441.30401620371 | 49.389 |
| 44441.34568287038 | 49.312 |
| 44441.38734953704 | 49.447 |
| 44441.42901620371 | 50.296 |
| 44441.47068287038 | 51.686 |
| 44441.51234953704 | 52.903 |
| 44441.55401620371 | 52.825 |
| 44441.59568287038 | 53.578 |
| 44441.63734953704 | 54.486 |
| 44441.67901620371 | 55.084 |
| 44441.72068287038 | 55.431 |
| 44441.76234953704 | 55.219 |
| 44441.80401620371 | 54.775 |
| 44441.84568287038 | 54.061 |
| 44441.88734953704 | 53.115 |
| 44441.92901620371 | 52.632 |
| 44441.97068287038 | 52.111 |
| 44442.01234953704 | 51.725 |
| 44442.05401620371 | 51.435 |
| 44442.09568287038 | 51.204 |
| 44442.13734953704 | 51.107 |
| 44442.17901620371 | 50.991 |
| 44442.22068287038 | 50.605 |
| 44442.26234953704 | 50.142 |
| 44442.30401620371 | 49.775 |
| 44442.34568287038 | 49.563 |
| 44442.38734953704 | 50.084 |
| 44442.42901620371 | 51.242 |
| 44442.47068287038 | 52.401 |
| 44442.51234953704 | 52.188 |
| 44442.55401620371 | 54.428 |
| 44442.59568287038 | 54.679 |
| 44442.63734953704 | 55.567 |
| 44442.67901620371 | 56.107 |
| 44442.72068287038 | 55.914 |
| 44442.76234953704 | 55.412 |
| 44442.80401620371 | 54.601 |
| 44442.84568287038 | 53.636 |
| 44442.88734953704 | 52.922 |
| 44442.92901620371 | 52.304 |
| 44442.97068287038 | 51.764 |
| 44443.01234953704 | 51.165 |
| 44443.05401620371 | 50.74 |
| 44443.09568287038 | 50.374 |
| 44443.13734953704 | 49.833 |
| 44443.17901620371 | 49.254 |
| 44443.22068287038 | 48.655 |
| 44443.26234953704 | 48.038 |
| 44443.30401620371 | 47.536 |
| 44443.34568287038 | 47.265 |
| 44443.38734953704 | 47.536 |
| 44443.42901620371 | 48.791 |
| 44443.47068287038 | 50.605 |
| 44443.51234953704 | 53.192 |
| 44443.55401620371 | 54.949 |
| 44443.59568287038 | 56.184 |
| 44443.63734953704 | 57.072 |
| 44443.67901620371 | 57.574 |
| 44443.72068287038 | 57.536 |
| 44443.76234953704 | 56.416 |
| 44443.80401620371 | 55.644 |
| 44443.84568287038 | 54.698 |
| 44443.88734953704 | 53.462 |
| 44443.92901620371 | 52.497 |
| 44443.97068287038 | 51.783 |
| 44444.01234953704 | 51.069 |
| 44444.05401620371 | 50.393 |
| 44444.09568287038 | 49.872 |
| 44444.13734953704 | 49.428 |
| 44444.17901620371 | 48.771 |
| 44444.22068287038 | 47.98 |
| 44444.26234953704 | 47.246 |
| 44444.30401620371 | 46.551 |
| 44444.34568287038 | 46.165 |
| 44444.38734953704 | 46.435 |
| 44444.42901620371 | 47.497 |
| 44444.47068287038 | 49.408 |
| 44444.51234953704 | 51.744 |
| 44444.55401620371 | 53.984 |
| 44444.59568287038 | 55.933 |
| 44444.63734953704 | 57.362 |
| 44444.67901620371 | 57.999 |
| 44444.72068287038 | 57.594 |
| 44444.76234953704 | 56.513 |
| 44444.80401620371 | 55.335 |
| 44444.84568287038 | 54.331 |
| 44444.88734953704 | 53.424 |
| 44444.92901620371 | 52.574 |
| 44444.97068287038 | 51.802 |
| 44445.01234953704 | 51.126 |
| 44445.05401620371 | 50.509 |
| 44445.09568287038 | 49.987 |
| 44445.13734953704 | 49.485 |
| 44445.17901620371 | 48.868 |
| 44445.22068287038 | 48.096 |
| 44445.26234953704 | 47.401 |
| 44445.30401620371 | 46.648 |
| 44445.34568287038 | 46.262 |
| 44445.38734953704 | 46.416 |
| 44445.42901620371 | 47.401 |
| 44445.47068287038 | 49.292 |
| 44445.51234953704 | 51.59 |
| 44445.55401620371 | 53.945 |
| 44445.59568287038 | 55.953 |
| 44445.63734953704 | 57.343 |
| 44445.67901620371 | 57.922 |
| 44445.72068287038 | 57.594 |
| 44445.76234953704 | 56.57 |
| 44445.80401620371 | 55.354 |
| 44445.84568287038 | 54.254 |
| 44445.88734953704 | 53.366 |
| 44445.92901620371 | 52.536 |
| 44445.97068287038 | 51.744 |
| 44446.01234953704 | 51.126 |
| 44446.05401620371 | 50.547 |
| 44446.09568287038 | 49.968 |
| 44446.13734953704 | 49.408 |
| 44446.17901620371 | 48.81 |
| 44446.22068287038 | 48.115 |
| 44446.26234953704 | 47.343 |
| 44446.30401620371 | 46.628 |
| 44446.34568287038 | 46.223 |
| 44446.38734953704 | 46.397 |
| 44446.42901620371 | 47.42 |
| 44446.47068287038 | 49.331 |
| 44446.51234953704 | 51.57 |
| 44446.55401620371 | 53.829 |
| 44446.59568287038 | 55.798 |
| 44446.63734953704 | 57.362 |
| 44446.67901620371 | 57.999 |
| 44446.72068287038 | 57.652 |
| 44446.76234953704 | 56.59 |
| 44446.80401620371 | 55.509 |
| 44446.84568287038 | 54.428 |
| 44446.88734953704 | 53.52 |
| 44446.92901620371 | 52.632 |
| 44446.97068287038 | 51.937 |
| 44447.01234953704 | 51.242 |
| 44447.05401620371 | 50.702 |
| 44447.09568287038 | 50.161 |
| 44447.13734953704 | 49.679 |
| 44447.17901620371 | 49.177 |
| 44447.22068287038 | 48.559 |
| 44447.26234953704 | 47.922 |
| 44447.30401620371 | 47.207 |
| 44447.34568287038 | 46.899 |
| 44447.38734953704 | 47.053 |
| 44447.42901620371 | 48.115 |
| 44447.47068287038 | 49.852 |
| 44447.51234953704 | 52.15 |
| 44447.55401620371 | 54.447 |
| 44447.59568287038 | 56.532 |
| 44447.63734953704 | 58.096 |
| 44447.67901620371 | 58.617 |
| 44447.72068287038 | 58.25 |
| 44447.76234953704 | 57.15 |
| 44447.80401620371 | 56.03 |
| 44447.84568287038 | 54.968 |
| 44447.88734953704 | 54.061 |
| 44447.92901620371 | 53.192 |
| 44447.97068287038 | 52.401 |
| 44448.01234953704 | 51.725 |
| 44448.05401620371 | 51.069 |
| 44448.09568287038 | 50.509 |
| 44448.13734953704 | 49.968 |
| 44448.17901620371 | 49.37 |
| 44448.22068287038 | 48.636 |
| 44448.26234953704 | 47.883 |
| 44448.30401620371 | 47.111 |
| 44448.34568287038 | 46.648 |
| 44448.38734953704 | 46.821 |
| 44448.42901620371 | 47.767 |
| 44448.47068287038 | 49.679 |
| 44448.51234953704 | 52.014 |
| 44448.55401620371 | 54.312 |
| 44448.59568287038 | 56.3 |
| 44448.63734953704 | 57.806 |
| 44448.67901620371 | 58.462 |
| 44448.72068287038 | 58.154 |
| 44448.76234953704 | 57.072 |
| 44448.80401620371 | 55.856 |
| 44448.84568287038 | 54.833 |
| 44448.88734953704 | 53.945 |
| 44448.92901620371 | 53.115 |
| 44448.97068287038 | 52.458 |
| 44449.01234953704 | 51.86 |
| 44449.05401620371 | 51.242 |
| 44449.09568287038 | 50.76 |
| 44449.13734953704 | 50.354 |
| 44449.17901620371 | 49.794 |
| 44449.22068287038 | 49.196 |
| 44449.26234953704 | 48.54 |
| 44449.30401620371 | 47.825 |
| 44449.34568287038 | 47.362 |
| 44449.38734953704 | 47.478 |
| 44449.42901620371 | 48.443 |
| 44449.47068287038 | 50.277 |
| 44449.51234953704 | 52.613 |
| 44449.55401620371 | 54.91 |
| 44449.59568287038 | 56.995 |
| 44449.63734953704 | 58.443 |
| 44449.67901620371 | 58.964 |
| 44449.72068287038 | 58.636 |
| 44449.76234953704 | 57.459 |
| 44449.80401620371 | 56.242 |
| 44449.84568287038 | 55.161 |
| 44449.88734953704 | 54.196 |
| 44449.92901620371 | 53.424 |
| 44449.97068287038 | 52.729 |
| 44450.01234953704 | 52.111 |
| 44450.05401620371 | 51.57 |
| 44450.09568287038 | 51.088 |
| 44450.13734953704 | 50.586 |
| 44450.17901620371 | 50.123 |
| 44450.22068287038 | 49.485 |
| 44450.26234953704 | 48.81 |
| 44450.30401620371 | 48.134 |
| 44450.34568287038 | 47.613 |
| 44450.38734953704 | 47.825 |
| 44450.42901620371 | 48.443 |
| 44450.47068287038 | 50.296 |
| 44450.51234953704 | 52.265 |
| 44450.55401620371 | 53.366 |
| 44450.59568287038 | 54.852 |
| 44450.63734953704 | 56.513 |
| 44450.67901620371 | 57.343 |
| 44450.72068287038 | 56.821 |
| 44450.76234953704 | 55.489 |
| 44450.80401620371 | 54.292 |
| 44450.84568287038 | 53.54 |
| 44450.88734953704 | 53.347 |
| 44450.92901620371 | 53.038 |
| 44450.97068287038 | 52.729 |
| 44451.01234953704 | 52.304 |
| 44451.05401620371 | 51.86 |
| 44451.09568287038 | 51.513 |
| 44451.13734953704 | 51.262 |
| 44451.17901620371 | 50.953 |
| 44451.22068287038 | 50.586 |
| 44451.26234953704 | 50.219 |
| 44451.30401620371 | 49.621 |
| 44451.34568287038 | 49.312 |
| 44451.38734953704 | 49.312 |
| 44451.42901620371 | 50.007 |
| 44451.47068287038 | 52.208 |
| 44451.51234953704 | 53.926 |
| 44451.55401620371 | 56.242 |
| 44451.59568287038 | 57.98 |
| 44451.63734953704 | 57.903 |
| 44451.67901620371 | 58.076 |
| 44451.72068287038 | 57.497 |
| 44451.76234953704 | 56.764 |
| 44451.80401620371 | 55.644 |
| 44451.84568287038 | 54.312 |
| 44451.88734953704 | 53.347 |
| 44451.92901620371 | 52.709 |
| 44451.97068287038 | 52.092 |
| 44452.01234953704 | 51.628 |
| 44452.05401620371 | 51.319 |
| 44452.09568287038 | 50.991 |
| 44452.13734953704 | 50.567 |
| 44452.17901620371 | 50.103 |
| 44452.22068287038 | 49.717 |
| 44452.26234953704 | 49.331 |
| 44452.30401620371 | 48.829 |
| 44452.34568287038 | 48.578 |
| 44452.38734953704 | 48.462 |
| 44452.42901620371 | 49.312 |
| 44452.47068287038 | 50.856 |
| 44452.51234953704 | 51.841 |
| 44452.55401620371 | 53.501 |
| 44452.59568287038 | 54.428 |
| 44452.63734953704 | 56.242 |
| 44452.67901620371 | 56.976 |
| 44452.72068287038 | 56.667 |
| 44452.76234953704 | 55.895 |
| 44452.80401620371 | 54.91 |
| 44452.84568287038 | 54.215 |
| 44452.88734953704 | 53.404 |
| 44452.92901620371 | 52.594 |
| 44452.97068287038 | 51.957 |
| 44453.01234953704 | 51.435 |
| 44453.05401620371 | 50.991 |
| 44453.09568287038 | 50.509 |
| 44453.13734953704 | 50.123 |
| 44453.17901620371 | 49.679 |
| 44453.22068287038 | 49.273 |
| 44453.26234953704 | 48.848 |
| 44453.30401620371 | 48.462 |
| 44453.34568287038 | 48.076 |
| 44453.38734953704 | 48.115 |
| 44453.42901620371 | 49.003 |
| 44453.47068287038 | 50.76 |
| 44453.51234953704 | 52.922 |
| 44453.55401620371 | 53.424 |
| 44453.59568287038 | 54.949 |
| 44453.63734953704 | 54.621 |
| 44453.67901620371 | 54.486 |
| 44453.72068287038 | 54.312 |
| 44453.76234953704 | 53.115 |
| 44453.80401620371 | 52.15 |
| 44453.84568287038 | 51.474 |
| 44453.88734953704 | 51.011 |
| 44453.92901620371 | 50.547 |
| 44453.97068287038 | 50.045 |
| 44454.01234953704 | 49.466 |
| 44454.05401620371 | 48.81 |
| 44454.09568287038 | 48.327 |
| 44454.13734953704 | 47.806 |
| 44454.17901620371 | 47.285 |
| 44454.22068287038 | 46.706 |
| 44454.26234953704 | 46.011 |
| 44454.30401620371 | 45.373 |
| 44454.34568287038 | 44.987 |
| 44454.38734953704 | 45.258 |
| 44454.42901620371 | 46.377 |
| 44454.47068287038 | 48.327 |
| 44454.51234953704 | 50.76 |
| 44454.55401620371 | 53.153 |
| 44454.59568287038 | 55.181 |
| 44454.63734953704 | 56.648 |
| 44454.67901620371 | 57.285 |
| 44454.72068287038 | 56.879 |
| 44454.76234953704 | 55.682 |
| 44454.80401620371 | 54.408 |
| 44454.84568287038 | 53.347 |
| 44454.88734953704 | 52.478 |
| 44454.92901620371 | 51.706 |
| 44454.97068287038 | 50.991 |
| 44455.01234953704 | 50.316 |
| 44455.05401620371 | 49.717 |
| 44455.09568287038 | 49.157 |
| 44455.13734953704 | 48.675 |
| 44455.17901620371 | 48.096 |
| 44455.22068287038 | 47.439 |
| 44455.26234953704 | 46.763 |
| 44455.30401620371 | 46.068 |
| 44455.34568287038 | 45.586 |
| 44455.38734953704 | 45.798 |
| 44455.42901620371 | 46.706 |
| 44455.47068287038 | 48.636 |
| 44455.51234953704 | 51.011 |
| 44455.55401620371 | 52.864 |
| 44455.59568287038 | 52.98 |
| 44455.63734953704 | 54.138 |
| 44455.67901620371 | 54.659 |
| 44455.72068287038 | 54.679 |
| 44455.76234953704 | 53.906 |
| 44455.80401620371 | 52.864 |
| 44455.84568287038 | 52.053 |
| 44455.88734953704 | 51.339 |
| 44455.92901620371 | 50.76 |
| 44455.97068287038 | 50.258 |
| 44456.01234953704 | 50.084 |
| 44456.05401620371 | 49.717 |
| 44456.09568287038 | 49.447 |
| 44456.13734953704 | 49.08 |
| 44456.17901620371 | 48.597 |
| 44456.22068287038 | 48.018 |
| 44456.26234953704 | 47.343 |
| 44456.30401620371 | 46.609 |
| 44456.34568287038 | 46.126 |
| 44456.38734953704 | 46.184 |
| 44456.42901620371 | 47.207 |
| 44456.47068287038 | 48.984 |
| 44456.51234953704 | 50.702 |
| 44456.55401620371 | 51.86 |
| 44456.59568287038 | 54.486 |
| 44456.63734953704 | 56.184 |
| 44456.67901620371 | 56.532 |
| 44456.72068287038 | 55.702 |
| 44456.76234953704 | 54.37 |
| 44456.80401620371 | 53.173 |
| 44456.84568287038 | 52.15 |
| 44456.88734953704 | 51.223 |
| 44456.92901620371 | 50.663 |
| 44456.97068287038 | 50.161 |
| 44457.01234953704 | 49.679 |
| 44457.05401620371 | 49.215 |
| 44457.09568287038 | 48.655 |
| 44457.13734953704 | 48.076 |
| 44457.17901620371 | 47.555 |
| 44457.22068287038 | 46.957 |
| 44457.26234953704 | 46.377 |
| 44457.30401620371 | 45.74 |
| 44457.34568287038 | 45.296 |
| 44457.38734953704 | 45.412 |
| 44457.42901620371 | 46.532 |
| 44457.47068287038 | 48.462 |
| 44457.51234953704 | 50.798 |
| 44457.55401620371 | 53.173 |
| 44457.59568287038 | 54.621 |
| 44457.63734953704 | 56.358 |
| 44457.67901620371 | 55.663 |
| 44457.72068287038 | 55.065 |
| 44457.76234953704 | 54.659 |
| 44457.80401620371 | 53.791 |
| 44457.84568287038 | 53.173 |
| 44457.88734953704 | 52.632 |
| 44457.92901620371 | 52.208 |
| 44457.97068287038 | 51.976 |
| 44458.01234953704 | 51.918 |
| 44458.05401620371 | 51.706 |
| 44458.09568287038 | 51.513 |
| 44458.13734953704 | 51.319 |
| 44458.17901620371 | 50.818 |
| 44458.22068287038 | 50.161 |
| 44458.26234953704 | 49.543 |
| 44458.30401620371 | 48.713 |
| 44458.34568287038 | 48.173 |
| 44458.38734953704 | 48.385 |
| 44458.42901620371 | 49.794 |
| 44458.47068287038 | 51.59 |
| 44458.51234953704 | 53.578 |
| 44458.55401620371 | 55.045 |
| 44458.59568287038 | 56.628 |
| 44458.63734953704 | 56.57 |
| 44458.67901620371 | 55.76 |
| 44458.72068287038 | 56.223 |
| 44458.76234953704 | 54.968 |
| 44458.80401620371 | 53.636 |
| 44458.84568287038 | 52.497 |
| 44458.88734953704 | 51.628 |
| 44458.92901620371 | 51.262 |
| 44458.97068287038 | 50.933 |
| 44459.01234953704 | 50.586 |
| 44459.05401620371 | 49.93 |
| 44459.09568287038 | 48.964 |
| 44459.13734953704 | 47.941 |
| 44459.17901620371 | 47.034 |
| 44459.22068287038 | 46.957 |
| 44459.26234953704 | 46.783 |
| 44459.30401620371 | 46.609 |
| 44459.34568287038 | 46.377 |
| 44459.38734953704 | 46.339 |
| 44459.42901620371 | 47.381 |
| 44459.47068287038 | 48.617 |
| 44459.51234953704 | 50.547 |
| 44459.55401620371 | 52.343 |
| 44459.59568287038 | 53.81 |
| 44459.63734953704 | 54.872 |
| 44459.67901620371 | 54.949 |
| 44459.72068287038 | 53.964 |
| 44459.76234953704 | 52.69 |
| 44459.80401620371 | 51.281 |
| 44459.84568287038 | 50.509 |
| 44459.88734953704 | 49.93 |
| 44459.92901620371 | 49.235 |
| 44459.97068287038 | 48.675 |
| 44460.01234953704 | 48.231 |
| 44460.05401620371 | 47.941 |
| 44460.09568287038 | 47.652 |
| 44460.13734953704 | 47.227 |
| 44460.17901620371 | 46.628 |
| 44460.22068287038 | 45.895 |
| 44460.26234953704 | 45.007 |
| 44460.30401620371 | 44.234 |
| 44460.34568287038 | 43.655 |
| 44460.38734953704 | 43.617 |
| 44460.42901620371 | 44.408 |
| 44460.47068287038 | 46.068 |
| 44460.51234953704 | 48.192 |
| 44460.55401620371 | 50.277 |
| 44460.59568287038 | 52.13 |
| 44460.63734953704 | 53.404 |
| 44460.67901620371 | 53.694 |
| 44460.72068287038 | 53.231 |
| 44460.76234953704 | 51.764 |
| 44460.80401620371 | 50.509 |
| 44460.84568287038 | 49.601 |
| 44460.88734953704 | 48.81 |
| 44460.92901620371 | 48.076 |
| 44460.97068287038 | 47.42 |
| 44461.01234953704 | 46.783 |
| 44461.05401620371 | 46.262 |
| 44461.09568287038 | 45.837 |
| 44461.13734953704 | 45.296 |
| 44461.17901620371 | 44.717 |
| 44461.22068287038 | 44.119 |
| 44461.26234953704 | 43.443 |
| 44461.30401620371 | 42.709 |
| 44461.34568287038 | 42.304 |
| 44461.38734953704 | 42.381 |
| 44461.42901620371 | 43.308 |
| 44461.47068287038 | 45.123 |
| 44461.51234953704 | 47.458 |
| 44461.55401620371 | 49.833 |
| 44461.59568287038 | 51.879 |
| 44461.63734953704 | 53.25 |
| 44461.67901620371 | 53.713 |
| 44461.72068287038 | 53.231 |
| 44461.76234953704 | 51.957 |
| 44461.80401620371 | 50.818 |
| 44461.84568287038 | 49.852 |
| 44461.88734953704 | 49.099 |
| 44461.92901620371 | 48.443 |
| 44461.97068287038 | 47.864 |
| 44462.01234953704 | 47.285 |
| 44462.05401620371 | 46.821 |
| 44462.09568287038 | 46.339 |
| 44462.13734953704 | 45.895 |
| 44462.17901620371 | 45.393 |
| 44462.22068287038 | 44.794 |
| 44462.26234953704 | 44.138 |
| 44462.30401620371 | 43.54 |
| 44462.34568287038 | 42.999 |
| 44462.38734953704 | 42.999 |
| 44462.42901620371 | 43.848 |
| 44462.47068287038 | 45.47 |
| 44462.51234953704 | 47.574 |
| 44462.55401620371 | 49.794 |
| 44462.59568287038 | 51.706 |
| 44462.63734953704 | 53.076 |
| 44462.67901620371 | 52.98 |
| 44462.72068287038 | 52.111 |
| 44462.76234953704 | 51.397 |
| 44462.80401620371 | 50.682 |
| 44462.84568287038 | 49.987 |
| 44462.88734953704 | 49.35 |
| 44462.92901620371 | 48.984 |
| 44462.97068287038 | 48.713 |
| 44463.01234953704 | 48.327 |
| 44463.05401620371 | 48.018 |
| 44463.09568287038 | 47.709 |
| 44463.13734953704 | 47.188 |
| 44463.17901620371 | 46.667 |
| 44463.22068287038 | 46.126 |
| 44463.26234953704 | 45.547 |
| 44463.30401620371 | 45.026 |
| 44463.34568287038 | 44.563 |
| 44463.38734953704 | 44.679 |
| 44463.42901620371 | 45.586 |
| 44463.47068287038 | 47.497 |
| 44463.51234953704 | 49.717 |
| 44463.55401620371 | 51.841 |
| 44463.59568287038 | 53.54 |
| 44463.63734953704 | 54.717 |
| 44463.67901620371 | 55.045 |
| 44463.72068287038 | 54.543 |
| 44463.76234953704 | 53.211 |
| 44463.80401620371 | 51.995 |
| 44463.84568287038 | 51.088 |
| 44463.88734953704 | 50.2 |
| 44463.92901620371 | 49.524 |
| 44463.97068287038 | 48.81 |
| 44464.01234953704 | 48.231 |
| 44464.05401620371 | 47.806 |
| 44464.09568287038 | 47.285 |
| 44464.13734953704 | 46.899 |
| 44464.17901620371 | 46.397 |
| 44464.22068287038 | 45.76 |
| 44464.26234953704 | 45.161 |
| 44464.30401620371 | 44.543 |
| 44464.34568287038 | 44.099 |
| 44464.38734953704 | 44.177 |
| 44464.42901620371 | 45.084 |
| 44464.47068287038 | 46.802 |
| 44464.51234953704 | 49.119 |
| 44464.55401620371 | 51.262 |
| 44464.59568287038 | 53.115 |
| 44464.63734953704 | 54.35 |
| 44464.67901620371 | 54.698 |
| 44464.72068287038 | 54.177 |
| 44464.76234953704 | 52.96 |
| 44464.80401620371 | 51.879 |
| 44464.84568287038 | 50.914 |
| 44464.88734953704 | 50.123 |
| 44464.92901620371 | 49.543 |
| 44464.97068287038 | 48.964 |
| 44465.01234953704 | 48.404 |
| 44465.05401620371 | 47.941 |
| 44465.09568287038 | 47.536 |
| 44465.13734953704 | 47.053 |
| 44465.17901620371 | 46.59 |
| 44465.22068287038 | 46.03 |
| 44465.26234953704 | 45.451 |
| 44465.30401620371 | 44.833 |
| 44465.34568287038 | 44.408 |
| 44465.38734953704 | 44.466 |
| 44465.42901620371 | 45.316 |
| 44465.47068287038 | 47.111 |
| 44465.51234953704 | 49.408 |
| 44465.55401620371 | 51.435 |
| 44465.59568287038 | 53.134 |
| 44465.63734953704 | 54.543 |
| 44465.67901620371 | 55.026 |
| 44465.72068287038 | 54.543 |
| 44465.76234953704 | 53.366 |
| 44465.80401620371 | 52.169 |
| 44465.84568287038 | 51.319 |
| 44465.88734953704 | 50.489 |
| 44465.92901620371 | 49.872 |
| 44465.97068287038 | 49.428 |
| 44466.01234953704 | 48.926 |
| 44466.05401620371 | 48.443 |
| 44466.09568287038 | 48.018 |
| 44466.13734953704 | 47.574 |
| 44466.17901620371 | 47.092 |
| 44466.22068287038 | 46.455 |
| 44466.26234953704 | 45.875 |
| 44466.30401620371 | 45.258 |
| 44466.34568287038 | 44.852 |
| 44466.38734953704 | 44.968 |
| 44466.42901620371 | 45.914 |
| 44466.47068287038 | 47.594 |
| 44466.51234953704 | 49.717 |
| 44466.55401620371 | 51.339 |
| 44466.59568287038 | 52.169 |
| 44466.63734953704 | 52.709 |
| 44466.67901620371 | 52.516 |
| 44466.72068287038 | 52.072 |
| 44466.76234953704 | 50.76 |
| 44466.80401620371 | 49.582 |
| 44466.84568287038 | 48.81 |
| 44466.88734953704 | 48.231 |
| 44466.92901620371 | 47.845 |
| 44466.97068287038 | 47.458 |
| 44467.01234953704 | 47.13 |
| 44467.05401620371 | 46.86 |
| 44467.09568287038 | 46.725 |
| 44467.13734953704 | 46.493 |
| 44467.17901620371 | 46.358 |
| 44467.22068287038 | 46.339 |
| 44467.26234953704 | 46.184 |
| 44467.30401620371 | 45.856 |
| 44467.34568287038 | 45.682 |
| 44467.38734953704 | 46.262 |
| 44467.42901620371 | 46.821 |
| 44467.47068287038 | 48.134 |
| 44467.51234953704 | 48.694 |
| 44467.55401620371 | 48.675 |
| 44467.59568287038 | 48.231 |
| 44467.63734953704 | 48.81 |
| 44467.67901620371 | 49.138 |
| 44467.72068287038 | 48.675 |
| 44467.76234953704 | 48.462 |
| 44467.80401620371 | 48.076 |
| 44467.84568287038 | 47.902 |
| 44467.88734953704 | 47.902 |
| 44467.92901620371 | 47.864 |
| 44467.97068287038 | 47.825 |
| 44468.01234953704 | 47.652 |
| 44468.05401620371 | 47.555 |
| 44468.09568287038 | 47.516 |
| 44468.13734953704 | 47.401 |
| 44468.17901620371 | 47.285 |
| 44468.22068287038 | 47.15 |
| 44468.26234953704 | 46.995 |
| 44468.30401620371 | 46.783 |
| 44468.34568287038 | 46.532 |
| 44468.38734953704 | 46.879 |
| 44468.42901620371 | 47.323 |
| 44468.47068287038 | 47.632 |
| 44468.51234953704 | 47.671 |
| 44468.55401620371 | 48.076 |
| 44468.59568287038 | 49.35 |
| 44468.63734953704 | 51.59 |
| 44468.67901620371 | 51.783 |
| 44468.72068287038 | 51.088 |
| 44468.76234953704 | 50.2 |
| 44468.80401620371 | 49.505 |
| 44468.84568287038 | 48.906 |
| 44468.88734953704 | 48.346 |
| 44468.92901620371 | 47.825 |
| 44468.97068287038 | 47.516 |
| 44469.01234953704 | 47.401 |
| 44469.05401620371 | 47.343 |
| 44469.09568287038 | 47.265 |
| 44469.13734953704 | 47.207 |
| 44469.17901620371 | 47.053 |
| 44469.22068287038 | 46.937 |
| 44469.26234953704 | 46.706 |
| 44469.30401620371 | 46.513 |
| 44469.34568287038 | 46.377 |
| 44469.38734953704 | 46.802 |
| 44469.42901620371 | 47.362 |
| 44469.47068287038 | 48.906 |
| 44469.51234953704 | 50.296 |
| 44469.55401620371 | 52.053 |
| 44469.59568287038 | 53.327 |
| 44469.63734953704 | 54.486 |
| 44469.67901620371 | 54.775 |
| 44469.72068287038 | 53.675 |
| 44469.76234953704 | 52.652 |
| 44469.80401620371 | 51.879 |
| 44469.84568287038 | 51.03 |
| 44469.88734953704 | 50.335 |
| 44469.92901620371 | 49.601 |
| 44469.97068287038 | 48.945 |
| 44470.01234953704 | 48.462 |
| 44470.05401620371 | 48.057 |
| 44470.09568287038 | 47.613 |
| 44470.13734953704 | 47.207 |
| 44470.17901620371 | 46.667 |
| 44470.22068287038 | 46.165 |
| 44470.26234953704 | 45.779 |
| 44470.30401620371 | 45.47 |
| 44470.34568287038 | 45.2 |
| 44470.38734953704 | 45.238 |
| 44470.42901620371 | 45.933 |
| 44470.47068287038 | 46.725 |
| 44470.51234953704 | 47.806 |
| 44470.55401620371 | 48.462 |
| 44470.59568287038 | 49.949 |
| 44470.63734953704 | 49.582 |
| 44470.67901620371 | 49.64 |
| 44470.72068287038 | 49.022 |
| 44470.76234953704 | 48.482 |
| 44470.80401620371 | 47.902 |
| 44470.84568287038 | 47.401 |
| 44470.88734953704 | 46.976 |
| 44470.92901620371 | 46.59 |
| 44470.97068287038 | 46.493 |
| 44471.01234953704 | 46.319 |
| 44471.05401620371 | 45.895 |
| 44471.09568287038 | 45.431 |
| 44471.13734953704 | 45.045 |
| 44471.17901620371 | 44.679 |
| 44471.22068287038 | 44.312 |
| 44471.26234953704 | 43.926 |
| 44471.30401620371 | 43.578 |
| 44471.34568287038 | 43.289 |
| 44471.38734953704 | 43.52 |
| 44471.42901620371 | 44.601 |
| 44471.47068287038 | 46.262 |
| 44471.51234953704 | 48.52 |
| 44471.55401620371 | 50.489 |
| 44471.59568287038 | 52.169 |
| 44471.63734953704 | 53.347 |
| 44471.67901620371 | 53.694 |
| 44471.72068287038 | 53.018 |
| 44471.76234953704 | 51.821 |
| 44471.80401620371 | 50.625 |
| 44471.84568287038 | 49.543 |
| 44471.88734953704 | 48.578 |
| 44471.92901620371 | 48.018 |
| 44471.97068287038 | 47.439 |
| 44472.01234953704 | 46.918 |
| 44472.05401620371 | 46.474 |
| 44472.09568287038 | 46.068 |
| 44472.13734953704 | 45.644 |
| 44472.17901620371 | 45.2 |
| 44472.22068287038 | 44.64 |
| 44472.26234953704 | 44.022 |
| 44472.30401620371 | 43.424 |
| 44472.34568287038 | 42.96 |
| 44472.38734953704 | 43.038 |
| 44472.42901620371 | 43.906 |
| 44472.47068287038 | 45.624 |
| 44472.51234953704 | 47.787 |
| 44472.55401620371 | 49.872 |
| 44472.59568287038 | 51.609 |
| 44472.63734953704 | 52.767 |
| 44472.67901620371 | 53.115 |
| 44472.72068287038 | 52.362 |
| 44472.76234953704 | 51.069 |
| 44472.80401620371 | 50.026 |
| 44472.84568287038 | 49.157 |
| 44472.88734953704 | 48.404 |
| 44472.92901620371 | 47.729 |
| 44472.97068287038 | 47.15 |
| 44473.01234953704 | 46.667 |
| 44473.05401620371 | 46.204 |
| 44473.09568287038 | 45.837 |
| 44473.13734953704 | 45.489 |
| 44473.17901620371 | 44.987 |
| 44473.22068287038 | 44.485 |
| 44473.26234953704 | 43.984 |
| 44473.30401620371 | 43.424 |
| 44473.34568287038 | 43.076 |
| 44473.38734953704 | 43.231 |
| 44473.42901620371 | 44.157 |
| 44473.47068287038 | 45.895 |
| 44473.51234953704 | 48.038 |
| 44473.55401620371 | 50.142 |
| 44473.59568287038 | 51.899 |
| 44473.63734953704 | 52.999 |
| 44473.67901620371 | 53.404 |
| 44473.72068287038 | 52.903 |
| 44473.76234953704 | 51.725 |
| 44473.80401620371 | 50.509 |
| 44473.84568287038 | 49.563 |
| 44473.88734953704 | 48.733 |
| 44473.92901620371 | 48.134 |
| 44473.97068287038 | 47.613 |
| 44474.01234953704 | 47.188 |
| 44474.05401620371 | 46.841 |
| 44474.09568287038 | 46.57 |
| 44474.13734953704 | 46.223 |
| 44474.17901620371 | 45.798 |
| 44474.22068287038 | 45.335 |
| 44474.26234953704 | 44.775 |
| 44474.30401620371 | 44.196 |
| 44474.34568287038 | 43.81 |
| 44474.38734953704 | 43.79 |
| 44474.42901620371 | 44.563 |
| 44474.47068287038 | 46.204 |
| 44474.51234953704 | 48.404 |
| 44474.55401620371 | 50.528 |
| 44474.59568287038 | 52.304 |
| 44474.63734953704 | 53.424 |
| 44474.67901620371 | 53.289 |
| 44474.72068287038 | 52.497 |
| 44474.76234953704 | 51.686 |
| 44474.80401620371 | 50.779 |
| 44474.84568287038 | 49.736 |
| 44474.88734953704 | 48.945 |
| 44474.92901620371 | 48.366 |
| 44474.97068287038 | 48.096 |
| 44475.01234953704 | 47.941 |
| 44475.05401620371 | 47.729 |
| 44475.09568287038 | 47.478 |
| 44475.13734953704 | 47.304 |
| 44475.17901620371 | 46.957 |
| 44475.22068287038 | 46.609 |
| 44475.26234953704 | 46.088 |
| 44475.30401620371 | 45.586 |
| 44475.34568287038 | 45.296 |
| 44475.38734953704 | 45.316 |
| 44475.42901620371 | 45.702 |
| 44475.47068287038 | 46.474 |
| 44475.51234953704 | 47.439 |
| 44475.55401620371 | 48.366 |
| 44475.59568287038 | 48.945 |
| 44475.63734953704 | 49.235 |
| 44475.67901620371 | 49.389 |
| 44475.72068287038 | 49.235 |
| 44475.76234953704 | 48.868 |
| 44475.80401620371 | 48.192 |
| 44475.84568287038 | 47.632 |
| 44475.88734953704 | 47.15 |
| 44475.92901620371 | 46.667 |
| 44475.97068287038 | 46.049 |
| 44476.01234953704 | 45.509 |
| 44476.05401620371 | 45.103 |
| 44476.09568287038 | 44.717 |
| 44476.13734953704 | 44.273 |
| 44476.17901620371 | 43.868 |
| 44476.22068287038 | 43.404 |
| 44476.26234953704 | 42.96 |
| 44476.30401620371 | 42.458 |
| 44476.34568287038 | 42.034 |
| 44476.38734953704 | 42.227 |
| 44476.42901620371 | 43.095 |
| 44476.47068287038 | 44.756 |
| 44476.51234953704 | 46.918 |
| 44476.55401620371 | 49.022 |
| 44476.59568287038 | 50.837 |
| 44476.63734953704 | 52.014 |
| 44476.67901620371 | 52.111 |
| 44476.72068287038 | 51.242 |
| 44476.76234953704 | 50.277 |
| 44476.80401620371 | 49.447 |
| 44476.84568287038 | 48.906 |
| 44476.88734953704 | 48.424 |
| 44476.92901620371 | 48.134 |
| 44476.97068287038 | 47.98 |
| 44477.01234953704 | 47.845 |
| 44477.05401620371 | 47.671 |
| 44477.09568287038 | 47.285 |
| 44477.13734953704 | 46.763 |
| 44477.17901620371 | 46.242 |
| 44477.22068287038 | 45.605 |
| 44477.26234953704 | 45.103 |
| 44477.30401620371 | 44.408 |
| 44477.34568287038 | 43.906 |
| 44477.38734953704 | 43.829 |
| 44477.42901620371 | 44.698 |
| 44477.47068287038 | 45.875 |
| 44477.51234953704 | 47.458 |
| 44477.55401620371 | 47.748 |
| 44477.59568287038 | 48.752 |
| 44477.63734953704 | 48.964 |
| 44477.67901620371 | 48.655 |
| 44477.72068287038 | 48.096 |
| 44477.76234953704 | 47.536 |
| 44477.80401620371 | 46.995 |
| 44477.84568287038 | 46.551 |
| 44477.88734953704 | 46.3 |
| 44477.92901620371 | 46.165 |
| 44477.97068287038 | 46.165 |
| 44478.01234953704 | 46.107 |
| 44478.05401620371 | 46.049 |
| 44478.09568287038 | 46.146 |
| 44478.13734953704 | 46.068 |
| 44478.17901620371 | 45.991 |
| 44478.22068287038 | 45.914 |
| 44478.26234953704 | 45.663 |
| 44478.30401620371 | 45.373 |
| 44478.34568287038 | 44.949 |
| 44478.38734953704 | 45.084 |
| 44478.42901620371 | 44.891 |
| 44478.47068287038 | 45.142 |
| 44478.51234953704 | 45.412 |
| 44478.55401620371 | 47.227 |
| 44478.59568287038 | 49.235 |
| 44478.63734953704 | 50.045 |
| 44478.67901620371 | 48.81 |
| 44478.72068287038 | 47.999 |
| 44478.76234953704 | 47.265 |
| 44478.80401620371 | 46.532 |
| 44478.84568287038 | 45.933 |
| 44478.88734953704 | 45.277 |
| 44478.92901620371 | 44.794 |
| 44478.97068287038 | 44.408 |
| 44479.01234953704 | 44.138 |
| 44479.05401620371 | 43.81 |
| 44479.09568287038 | 43.443 |
| 44479.13734953704 | 43.211 |
| 44479.17901620371 | 42.902 |
| 44479.22068287038 | 42.632 |
| 44479.26234953704 | 42.4 |
| 44479.30401620371 | 42.111 |
| 44479.34568287038 | 41.937 |
| 44479.38734953704 | 41.899 |
| 44479.42901620371 | 42.227 |
| 44479.47068287038 | 43.018 |
| 44479.51234953704 | 44.37 |
| 44479.55401620371 | 45.296 |
| 44479.59568287038 | 46.416 |
| 44479.63734953704 | 46.011 |
| 44479.67901620371 | 46.262 |
| 44479.72068287038 | 46.397 |
| 44479.76234953704 | 45.798 |
| 44479.80401620371 | 45.065 |
| 44479.84568287038 | 44.582 |
| 44479.88734953704 | 44.273 |
| 44479.92901620371 | 43.81 |
| 44479.97068287038 | 43.424 |
| 44480.01234953704 | 42.96 |
| 44480.05401620371 | 42.516 |
| 44480.09568287038 | 42.092 |
| 44480.13734953704 | 41.57 |
| 44480.17901620371 | 41.146 |
| 44480.22068287038 | 40.721 |
| 44480.26234953704 | 40.258 |
| 44480.30401620371 | 39.794 |
| 44480.34568287038 | 39.428 |
| 44480.38734953704 | 39.524 |
| 44480.42901620371 | 40.354 |
| 44480.47068287038 | 41.995 |
| 44480.51234953704 | 44.022 |
| 44480.55401620371 | 45.605 |
| 44480.59568287038 | 46.899 |
| 44480.63734953704 | 47.265 |
| 44480.67901620371 | 47.516 |
| 44480.72068287038 | 47.053 |
| 44480.76234953704 | 46.551 |
| 44480.80401620371 | 46.184 |
| 44480.84568287038 | 45.779 |
| 44480.88734953704 | 45.258 |
| 44480.92901620371 | 44.756 |
| 44480.97068287038 | 44.447 |
| 44481.01234953704 | 44.254 |
| 44481.05401620371 | 43.984 |
| 44481.09568287038 | 43.79 |
| 44481.13734953704 | 43.482 |
| 44481.17901620371 | 43.211 |
| 44481.22068287038 | 42.902 |
| 44481.26234953704 | 42.497 |
| 44481.30401620371 | 42.072 |
| 44481.34568287038 | 41.763 |
| 44481.38734953704 | 41.744 |
| 44481.42901620371 | 42.13 |
| 44481.47068287038 | 42.922 |
| 44481.51234953704 | 43.076 |
| 44481.55401620371 | 44.234 |
| 44481.59568287038 | 44.524 |
| 44481.63734953704 | 44.234 |
| 44481.67901620371 | 43.964 |
| 44481.72068287038 | 43.81 |
| 44481.76234953704 | 42.709 |
| 44481.80401620371 | 42.111 |
| 44481.84568287038 | 41.57 |
| 44481.88734953704 | 41.242 |
| 44481.92901620371 | 40.875 |
| 44481.97068287038 | 40.47 |
| 44482.01234953704 | 40.122 |
| 44482.05401620371 | 39.814 |
| 44482.09568287038 | 39.621 |
| 44482.13734953704 | 39.35 |
| 44482.17901620371 | 39.022 |
| 44482.22068287038 | 38.829 |
| 44482.26234953704 | 38.578 |
| 44482.30401620371 | 38.327 |
| 44482.34568287038 | 38.173 |
| 44482.38734953704 | 38.231 |
| 44482.42901620371 | 38.733 |
| 44482.47068287038 | 39.794 |
| 44482.51234953704 | 40.47 |
| 44482.55401620371 | 41.146 |
| 44482.59568287038 | 42.4 |
| 44482.63734953704 | 42.98 |
| 44482.67901620371 | 42.999 |
| 44482.72068287038 | 42.536 |
| 44482.76234953704 | 41.86 |
| 44482.80401620371 | 41.319 |
| 44482.84568287038 | 40.837 |
| 44482.88734953704 | 40.509 |
| 44482.92901620371 | 40.335 |
| 44482.97068287038 | 40.161 |
| 44483.01234953704 | 40.084 |
| 44483.05401620371 | 39.872 |
| 44483.09568287038 | 39.659 |
| 44483.13734953704 | 39.466 |
| 44483.17901620371 | 39.234 |
| 44483.22068287038 | 39.041 |
| 44483.26234953704 | 38.79 |
| 44483.30401620371 | 38.462 |
| 44483.34568287038 | 38.192 |
| 44483.38734953704 | 38.095 |
| 44483.42901620371 | 38.346 |
| 44483.47068287038 | 38.906 |
| 44483.51234953704 | 38.733 |
| 44483.55401620371 | 38.327 |
| 44483.59568287038 | 39.254 |
| 44483.63734953704 | 39.312 |
| 44483.67901620371 | 39.408 |
| 44483.72068287038 | 39.254 |
| 44483.76234953704 | 39.177 |
| 44483.80401620371 | 39.138 |
| 44483.84568287038 | 39.157 |
| 44483.88734953704 | 38.848 |
| 44483.92901620371 | 38.173 |
| 44483.97068287038 | 37.864 |
| 44484.01234953704 | 37.729 |
| 44484.05401620371 | 37.651 |
| 44484.09568287038 | 37.285 |
| 44484.13734953704 | 36.956 |
| 44484.17901620371 | 36.648 |
| 44484.22068287038 | 36.3 |
| 44484.26234953704 | 36.03 |
| 44484.30401620371 | 35.895 |
| 44484.34568287038 | 35.74 |
| 44484.38734953704 | 35.837 |
| 44484.42901620371 | 36.184 |
| 44484.47068287038 | 37.265 |
| 44484.51234953704 | 38.983 |
| 44484.55401620371 | 40.953 |
| 44484.59568287038 | 42.806 |
| 44484.63734953704 | 43.501 |
| 44484.67901620371 | 43.501 |
| 44484.72068287038 | 42.787 |
| 44484.76234953704 | 41.59 |
| 44484.80401620371 | 40.702 |
| 44484.84568287038 | 40.142 |
| 44484.88734953704 | 39.794 |
| 44484.92901620371 | 39.466 |
| 44484.97068287038 | 39.177 |
| 44485.01234953704 | 38.906 |
| 44485.05401620371 | 38.597 |
| 44485.09568287038 | 38.173 |
| 44485.13734953704 | 37.671 |
| 44485.17901620371 | 37.111 |
| 44485.22068287038 | 36.551 |
| 44485.26234953704 | 36.03 |
| 44485.30401620371 | 35.547 |
| 44485.34568287038 | 35.142 |
| 44485.38734953704 | 35.238 |
| 44485.42901620371 | 36.03 |
| 44485.47068287038 | 37.555 |
| 44485.51234953704 | 39.563 |
| 44485.55401620371 | 41.609 |
| 44485.59568287038 | 43.424 |
| 44485.63734953704 | 44.659 |
| 44485.67901620371 | 45.142 |
| 44485.72068287038 | 44.756 |
| 44485.76234953704 | 43.79 |
| 44485.80401620371 | 43.095 |
| 44485.84568287038 | 42.555 |
| 44485.88734953704 | 42.265 |
| 44485.92901620371 | 42.014 |
| 44485.97068287038 | 41.802 |
| 44486.01234953704 | 41.59 |
| 44486.05401620371 | 41.261 |
| 44486.09568287038 | 40.895 |
| 44486.13734953704 | 40.393 |
| 44486.17901620371 | 39.833 |
| 44486.22068287038 | 39.312 |
| 44486.26234953704 | 38.694 |
| 44486.30401620371 | 38.038 |
| 44486.34568287038 | 37.497 |
| 44486.38734953704 | 37.458 |
| 44486.42901620371 | 38.134 |
| 44486.47068287038 | 39.563 |
| 44486.51234953704 | 41.532 |
| 44486.55401620371 | 43.501 |
| 44486.59568287038 | 45.316 |
| 44486.63734953704 | 46.532 |
| 44486.67901620371 | 46.937 |
| 44486.72068287038 | 46.416 |
| 44486.76234953704 | 45.509 |
| 44486.80401620371 | 44.775 |
| 44486.84568287038 | 44.254 |
| 44486.88734953704 | 43.829 |
| 44486.92901620371 | 43.559 |
| 44486.97068287038 | 43.327 |
| 44487.01234953704 | 43.038 |
| 44487.05401620371 | 42.767 |
| 44487.09568287038 | 42.4 |
| 44487.13734953704 | 41.879 |
| 44487.17901620371 | 41.416 |
| 44487.22068287038 | 40.895 |
| 44487.26234953704 | 40.393 |
| 44487.30401620371 | 39.794 |
| 44487.34568287038 | 39.234 |
| 44487.38734953704 | 39.177 |
| 44487.42901620371 | 39.949 |
| 44487.47068287038 | 41.3 |
| 44487.51234953704 | 43.115 |
| 44487.55401620371 | 44.852 |
| 44487.59568287038 | 46.59 |
| 44487.63734953704 | 47.652 |
| 44487.67901620371 | 47.999 |
| 44487.72068287038 | 47.15 |
| 44487.76234953704 | 46.416 |
| 44487.80401620371 | 45.837 |
| 44487.84568287038 | 45.238 |
| 44487.88734953704 | 44.891 |
| 44487.92901620371 | 44.64 |
| 44487.97068287038 | 44.389 |
| 44488.01234953704 | 44.138 |
| 44488.05401620371 | 43.713 |
| 44488.09568287038 | 43.192 |
| 44488.13734953704 | 42.574 |
| 44488.17901620371 | 41.976 |
| 44488.22068287038 | 41.57 |
| 44488.26234953704 | 41.261 |
| 44488.30401620371 | 40.991 |
| 44488.34568287038 | 40.624 |
| 44488.38734953704 | 40.586 |
| 44488.42901620371 | 40.933 |
| 44488.47068287038 | 41.088 |
| 44488.51234953704 | 43.173 |
| 44488.55401620371 | 44.37 |
| 44488.59568287038 | 45.547 |
| 44488.63734953704 | 45.142 |
| 44488.67901620371 | 44.621 |
| 44488.72068287038 | 43.501 |
| 44488.76234953704 | 42.787 |
| 44488.80401620371 | 42.15 |
| 44488.84568287038 | 41.918 |
| 44488.88734953704 | 41.821 |
| 44488.92901620371 | 41.899 |
| 44488.97068287038 | 41.706 |
| 44489.01234953704 | 41.358 |
| 44489.05401620371 | 40.895 |
| 44489.09568287038 | 40.489 |
| 44489.13734953704 | 39.987 |
| 44489.17901620371 | 39.485 |
| 44489.22068287038 | 38.945 |
| 44489.26234953704 | 38.288 |
| 44489.30401620371 | 37.69 |
| 44489.34568287038 | 37.072 |
| 44489.38734953704 | 36.937 |
| 44489.42901620371 | 37.458 |
| 44489.47068287038 | 38.81 |
| 44489.51234953704 | 40.682 |
| 44489.55401620371 | 42.555 |
| 44489.59568287038 | 44.177 |
| 44489.63734953704 | 45.2 |
| 44489.67901620371 | 45.47 |
| 44489.72068287038 | 44.852 |
| 44489.76234953704 | 43.733 |
| 44489.80401620371 | 42.941 |
| 44489.84568287038 | 42.4 |
| 44489.88734953704 | 42.034 |
| 44489.92901620371 | 41.686 |
| 44489.97068287038 | 41.416 |
| 44490.01234953704 | 41.088 |
| 44490.05401620371 | 40.76 |
| 44490.09568287038 | 40.354 |
| 44490.13734953704 | 39.794 |
| 44490.17901620371 | 39.234 |
| 44490.22068287038 | 38.655 |
| 44490.26234953704 | 38.057 |
| 44490.30401620371 | 37.362 |
| 44490.34568287038 | 36.899 |
| 44490.38734953704 | 36.879 |
| 44490.42901620371 | 37.42 |
| 44490.47068287038 | 38.829 |
| 44490.51234953704 | 40.393 |
| 44490.55401620371 | 42.034 |
| 44490.59568287038 | 43.675 |
| 44490.63734953704 | 44.91 |
| 44490.67901620371 | 45.161 |
| 44490.72068287038 | 44.794 |
| 44490.76234953704 | 43.81 |
| 44490.80401620371 | 43.211 |
| 44490.84568287038 | 42.594 |
| 44490.88734953704 | 42.227 |
| 44490.92901620371 | 41.918 |
| 44490.97068287038 | 41.706 |
| 44491.01234953704 | 41.435 |
| 44491.05401620371 | 41.165 |
| 44491.09568287038 | 40.76 |
| 44491.13734953704 | 40.238 |
| 44491.17901620371 | 39.678 |
| 44491.22068287038 | 39.08 |
| 44491.26234953704 | 38.482 |
| 44491.30401620371 | 37.902 |
| 44491.34568287038 | 37.381 |
| 44491.38734953704 | 37.323 |
| 44491.42901620371 | 37.941 |
| 44491.47068287038 | 39.254 |
| 44491.51234953704 | 41.126 |
| 44491.55401620371 | 43.192 |
| 44491.59568287038 | 45.142 |
| 44491.63734953704 | 45.914 |
| 44491.67901620371 | 45.953 |
| 44491.72068287038 | 45.76 |
| 44491.76234953704 | 45.084 |
| 44491.80401620371 | 44.312 |
| 44491.84568287038 | 43.868 |
| 44491.88734953704 | 43.733 |
| 44491.92901620371 | 43.385 |
| 44491.97068287038 | 43.038 |
| 44492.01234953704 | 42.69 |
| 44492.05401620371 | 42.265 |
| 44492.09568287038 | 41.783 |
| 44492.13734953704 | 41.242 |
| 44492.17901620371 | 40.682 |
| 44492.22068287038 | 40.103 |
| 44492.26234953704 | 39.717 |
| 44492.30401620371 | 39.157 |
| 44492.34568287038 | 38.675 |
| 44492.38734953704 | 38.617 |
| 44492.42901620371 | 39.099 |
| 44492.47068287038 | 39.852 |
| 44492.51234953704 | 40.547 |
| 44492.55401620371 | 41.319 |
| 44492.59568287038 | 42.69 |
| 44492.63734953704 | 44.138 |
| 44492.67901620371 | 43.926 |
| 44492.72068287038 | 43.81 |
| 44492.76234953704 | 43.733 |
| 44492.80401620371 | 43.52 |
| 44492.84568287038 | 43.153 |
| 44492.88734953704 | 42.883 |
| 44492.92901620371 | 42.883 |
| 44492.97068287038 | 42.787 |
| 44493.01234953704 | 42.594 |
| 44493.05401620371 | 42.343 |
| 44493.09568287038 | 42.246 |
| 44493.13734953704 | 42.111 |
| 44493.17901620371 | 42.014 |
| 44493.22068287038 | 41.86 |
| 44493.26234953704 | 41.628 |
| 44493.30401620371 | 41.3 |
| 44493.34568287038 | 41.03 |
| 44493.38734953704 | 40.76 |
| 44493.42901620371 | 40.895 |
| 44493.47068287038 | 41.976 |
| 44493.51234953704 | 43.404 |
| 44493.55401620371 | 44.929 |
| 44493.59568287038 | 46.184 |
| 44493.63734953704 | 46.821 |
| 44493.67901620371 | 46.706 |
| 44493.72068287038 | 46.03 |
| 44493.76234953704 | 45.18 |
| 44493.80401620371 | 44.543 |
| 44493.84568287038 | 44.119 |
| 44493.88734953704 | 43.848 |
| 44493.92901620371 | 43.636 |
| 44493.97068287038 | 43.346 |
| 44494.01234953704 | 43.018 |
| 44494.05401620371 | 42.69 |
| 44494.09568287038 | 42.285 |
| 44494.13734953704 | 41.879 |
| 44494.17901620371 | 41.532 |
| 44494.22068287038 | 41.146 |
| 44494.26234953704 | 40.74 |
| 44494.30401620371 | 40.277 |
| 44494.34568287038 | 39.891 |
| 44494.38734953704 | 39.814 |
| 44494.42901620371 | 40.451 |
| 44494.47068287038 | 41.686 |
| 44494.51234953704 | 43.52 |
| 44494.55401620371 | 45.489 |
| 44494.59568287038 | 47.092 |
| 44494.63734953704 | 48.134 |
| 44494.67901620371 | 48.462 |
| 44494.72068287038 | 47.902 |
| 44494.76234953704 | 47.014 |
| 44494.80401620371 | 46.319 |
| 44494.84568287038 | 45.798 |
| 44494.88734953704 | 45.393 |
| 44494.92901620371 | 45.084 |
| 44494.97068287038 | 44.756 |
| 44495.01234953704 | 44.621 |
| 44495.05401620371 | 44.447 |
| 44495.09568287038 | 44.254 |
| 44495.13734953704 | 43.79 |
| 44495.17901620371 | 43.231 |
| 44495.22068287038 | 42.574 |
| 44495.26234953704 | 41.976 |
| 44495.30401620371 | 41.532 |
| 44495.34568287038 | 41.088 |
| 44495.38734953704 | 41.068 |
| 44495.42901620371 | 41.416 |
| 44495.47068287038 | 41.319 |
| 44495.51234953704 | 41.339 |
| 44495.55401620371 | 41.397 |
| 44495.59568287038 | 42.4 |
| 44495.63734953704 | 42.825 |
| 44495.67901620371 | 42.497 |
| 44495.72068287038 | 41.667 |
| 44495.76234953704 | 41.339 |
| 44495.80401620371 | 40.779 |
| 44495.84568287038 | 39.949 |
| 44495.88734953704 | 39.524 |
| 44495.92901620371 | 39.041 |
| 44495.97068287038 | 38.887 |
| 44496.01234953704 | 38.675 |
| 44496.05401620371 | 38.559 |
| 44496.09568287038 | 38.25 |
| 44496.13734953704 | 37.999 |
| 44496.17901620371 | 37.651 |
| 44496.22068287038 | 37.343 |
| 44496.26234953704 | 37.053 |
| 44496.30401620371 | 36.956 |
| 44496.34568287038 | 36.744 |
| 44496.38734953704 | 36.705 |
| 44496.42901620371 | 36.86 |
| 44496.47068287038 | 37.304 |